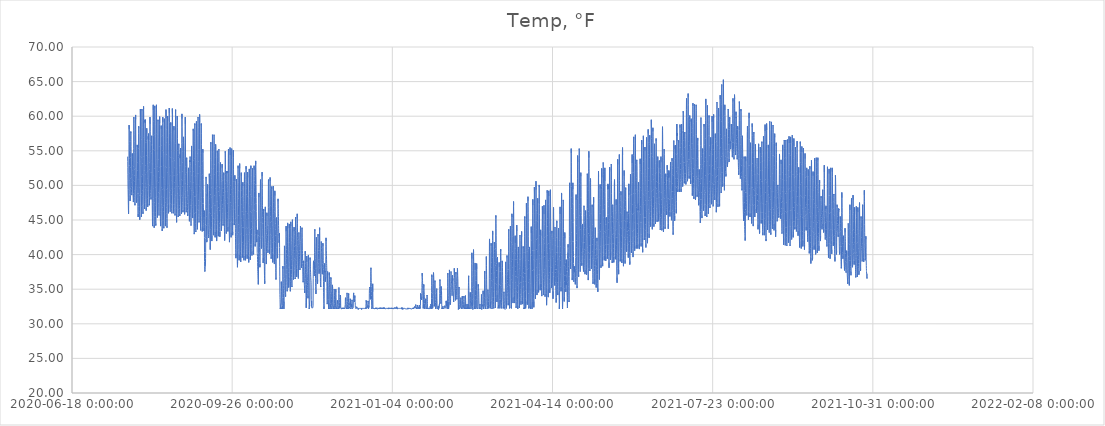
| Category | Temp, °F |
|---|---|
| 44034.768425925926 | 54.157 |
| 44034.81009259259 | 53.462 |
| 44034.85175925926 | 52.613 |
| 44034.893425925926 | 51.609 |
| 44034.93509259259 | 50.76 |
| 44034.97675925926 | 49.91 |
| 44035.018425925926 | 49.447 |
| 44035.06009259259 | 48.906 |
| 44035.10175925926 | 48.289 |
| 44035.143425925926 | 47.748 |
| 44035.18509259259 | 47.13 |
| 44035.22675925926 | 46.59 |
| 44035.268425925926 | 46.204 |
| 44035.31009259259 | 45.895 |
| 44035.35175925926 | 46.358 |
| 44035.393425925926 | 47.594 |
| 44035.43509259259 | 49.37 |
| 44035.47675925926 | 51.918 |
| 44035.518425925926 | 52.845 |
| 44035.56009259259 | 53.926 |
| 44035.60175925926 | 55.933 |
| 44035.643425925926 | 58.713 |
| 44035.68509259259 | 58.713 |
| 44035.72675925926 | 58.096 |
| 44035.768425925926 | 57.71 |
| 44035.81009259259 | 56.32 |
| 44035.85175925926 | 55.084 |
| 44035.893425925926 | 53.926 |
| 44035.93509259259 | 52.845 |
| 44035.97675925926 | 51.764 |
| 44036.018425925926 | 50.76 |
| 44036.06009259259 | 49.91 |
| 44036.10175925926 | 49.215 |
| 44036.143425925926 | 48.675 |
| 44036.18509259259 | 48.289 |
| 44036.22675925926 | 48.057 |
| 44036.268425925926 | 47.748 |
| 44036.31009259259 | 47.748 |
| 44036.35175925926 | 47.825 |
| 44036.393425925926 | 48.52 |
| 44036.43509259259 | 49.524 |
| 44036.47675925926 | 50.991 |
| 44036.518425925926 | 52.613 |
| 44036.56009259259 | 54.003 |
| 44036.60175925926 | 54.93 |
| 44036.643425925926 | 56.32 |
| 44036.68509259259 | 57.246 |
| 44036.72675925926 | 57.787 |
| 44036.768425925926 | 57.555 |
| 44036.81009259259 | 56.628 |
| 44036.85175925926 | 55.625 |
| 44036.893425925926 | 54.543 |
| 44036.93509259259 | 53.231 |
| 44036.97675925926 | 52.072 |
| 44037.018425925926 | 51.146 |
| 44037.06009259259 | 50.451 |
| 44037.10175925926 | 49.833 |
| 44037.143425925926 | 49.37 |
| 44037.18509259259 | 48.984 |
| 44037.22675925926 | 48.829 |
| 44037.268425925926 | 48.597 |
| 44037.31009259259 | 48.675 |
| 44037.35175925926 | 48.752 |
| 44037.393425925926 | 49.215 |
| 44037.43509259259 | 50.142 |
| 44037.47675925926 | 51.455 |
| 44037.518425925926 | 51.841 |
| 44037.56009259259 | 52.304 |
| 44037.60175925926 | 53.231 |
| 44037.643425925926 | 54.621 |
| 44037.68509259259 | 54.235 |
| 44037.72675925926 | 54.157 |
| 44037.768425925926 | 53.54 |
| 44037.81009259259 | 52.922 |
| 44037.85175925926 | 52.15 |
| 44037.893425925926 | 51.609 |
| 44037.93509259259 | 50.914 |
| 44037.97675925926 | 50.219 |
| 44038.018425925926 | 49.679 |
| 44038.06009259259 | 49.061 |
| 44038.10175925926 | 48.675 |
| 44038.143425925926 | 48.443 |
| 44038.18509259259 | 48.211 |
| 44038.22675925926 | 48.057 |
| 44038.268425925926 | 47.825 |
| 44038.31009259259 | 47.594 |
| 44038.35175925926 | 47.748 |
| 44038.393425925926 | 48.829 |
| 44038.43509259259 | 50.76 |
| 44038.47675925926 | 52.69 |
| 44038.518425925926 | 55.316 |
| 44038.56009259259 | 57.941 |
| 44038.60175925926 | 59.872 |
| 44038.643425925926 | 59.64 |
| 44038.68509259259 | 58.945 |
| 44038.72675925926 | 57.864 |
| 44038.768425925926 | 57.401 |
| 44038.81009259259 | 56.32 |
| 44038.85175925926 | 54.775 |
| 44038.893425925926 | 53.385 |
| 44038.93509259259 | 52.304 |
| 44038.97675925926 | 51.455 |
| 44039.018425925926 | 50.605 |
| 44039.06009259259 | 49.91 |
| 44039.10175925926 | 49.215 |
| 44039.143425925926 | 48.752 |
| 44039.18509259259 | 48.211 |
| 44039.22675925926 | 47.748 |
| 44039.268425925926 | 47.285 |
| 44039.31009259259 | 47.13 |
| 44039.35175925926 | 47.362 |
| 44039.393425925926 | 48.52 |
| 44039.43509259259 | 50.065 |
| 44039.47675925926 | 52.458 |
| 44039.518425925926 | 55.007 |
| 44039.56009259259 | 58.096 |
| 44039.60175925926 | 59.408 |
| 44039.643425925926 | 58.945 |
| 44039.68509259259 | 59.794 |
| 44039.72675925926 | 60.181 |
| 44039.768425925926 | 59.563 |
| 44039.81009259259 | 58.173 |
| 44039.85175925926 | 56.242 |
| 44039.893425925926 | 54.698 |
| 44039.93509259259 | 53.385 |
| 44039.97675925926 | 52.227 |
| 44040.018425925926 | 51.069 |
| 44040.06009259259 | 50.142 |
| 44040.10175925926 | 49.37 |
| 44040.143425925926 | 48.675 |
| 44040.18509259259 | 48.443 |
| 44040.22675925926 | 47.902 |
| 44040.268425925926 | 47.516 |
| 44040.31009259259 | 47.439 |
| 44040.35175925926 | 47.516 |
| 44040.393425925926 | 47.825 |
| 44040.43509259259 | 48.906 |
| 44040.47675925926 | 49.91 |
| 44040.518425925926 | 51.146 |
| 44040.56009259259 | 51.377 |
| 44040.60175925926 | 52.381 |
| 44040.643425925926 | 54.852 |
| 44040.68509259259 | 55.856 |
| 44040.72675925926 | 55.779 |
| 44040.768425925926 | 55.547 |
| 44040.81009259259 | 54.389 |
| 44040.85175925926 | 53.308 |
| 44040.893425925926 | 52.15 |
| 44040.93509259259 | 50.914 |
| 44040.97675925926 | 49.756 |
| 44041.018425925926 | 48.829 |
| 44041.06009259259 | 48.057 |
| 44041.10175925926 | 47.594 |
| 44041.143425925926 | 46.976 |
| 44041.18509259259 | 46.435 |
| 44041.22675925926 | 45.972 |
| 44041.268425925926 | 45.586 |
| 44041.31009259259 | 45.431 |
| 44041.35175925926 | 45.895 |
| 44041.393425925926 | 46.976 |
| 44041.43509259259 | 48.829 |
| 44041.47675925926 | 50.914 |
| 44041.518425925926 | 53.231 |
| 44041.56009259259 | 55.316 |
| 44041.60175925926 | 57.478 |
| 44041.643425925926 | 58.559 |
| 44041.68509259259 | 58.559 |
| 44041.72675925926 | 58.25 |
| 44041.768425925926 | 57.71 |
| 44041.81009259259 | 56.551 |
| 44041.85175925926 | 55.161 |
| 44041.893425925926 | 53.694 |
| 44041.93509259259 | 52.227 |
| 44041.97675925926 | 50.914 |
| 44042.018425925926 | 49.679 |
| 44042.06009259259 | 48.52 |
| 44042.10175925926 | 47.594 |
| 44042.143425925926 | 46.899 |
| 44042.18509259259 | 46.204 |
| 44042.22675925926 | 45.74 |
| 44042.268425925926 | 45.2 |
| 44042.31009259259 | 45.045 |
| 44042.35175925926 | 45.431 |
| 44042.393425925926 | 46.667 |
| 44042.43509259259 | 48.597 |
| 44042.47675925926 | 50.914 |
| 44042.518425925926 | 53.462 |
| 44042.56009259259 | 55.933 |
| 44042.60175925926 | 58.018 |
| 44042.643425925926 | 59.872 |
| 44042.68509259259 | 61.03 |
| 44042.72675925926 | 61.03 |
| 44042.768425925926 | 59.794 |
| 44042.81009259259 | 58.559 |
| 44042.85175925926 | 57.015 |
| 44042.893425925926 | 55.547 |
| 44042.93509259259 | 54.157 |
| 44042.97675925926 | 52.69 |
| 44043.018425925926 | 51.069 |
| 44043.06009259259 | 49.601 |
| 44043.10175925926 | 48.52 |
| 44043.143425925926 | 47.516 |
| 44043.18509259259 | 46.821 |
| 44043.22675925926 | 46.126 |
| 44043.268425925926 | 45.663 |
| 44043.31009259259 | 45.431 |
| 44043.35175925926 | 45.74 |
| 44043.393425925926 | 46.976 |
| 44043.43509259259 | 48.829 |
| 44043.47675925926 | 51.3 |
| 44043.518425925926 | 54.003 |
| 44043.56009259259 | 56.628 |
| 44043.60175925926 | 59.177 |
| 44043.643425925926 | 61.03 |
| 44043.68509259259 | 60.953 |
| 44043.72675925926 | 60.798 |
| 44043.768425925926 | 59.872 |
| 44043.81009259259 | 58.404 |
| 44043.85175925926 | 56.706 |
| 44043.893425925926 | 54.852 |
| 44043.93509259259 | 53.153 |
| 44043.97675925926 | 51.609 |
| 44044.018425925926 | 50.296 |
| 44044.06009259259 | 49.292 |
| 44044.10175925926 | 48.443 |
| 44044.143425925926 | 47.748 |
| 44044.18509259259 | 47.13 |
| 44044.22675925926 | 46.59 |
| 44044.268425925926 | 46.126 |
| 44044.31009259259 | 45.895 |
| 44044.35175925926 | 46.204 |
| 44044.393425925926 | 47.207 |
| 44044.43509259259 | 49.061 |
| 44044.47675925926 | 51.377 |
| 44044.518425925926 | 54.157 |
| 44044.56009259259 | 56.937 |
| 44044.60175925926 | 59.408 |
| 44044.643425925926 | 61.262 |
| 44044.68509259259 | 61.416 |
| 44044.72675925926 | 61.03 |
| 44044.768425925926 | 60.412 |
| 44044.81009259259 | 58.791 |
| 44044.85175925926 | 57.246 |
| 44044.893425925926 | 55.47 |
| 44044.93509259259 | 53.771 |
| 44044.97675925926 | 52.15 |
| 44045.018425925926 | 50.76 |
| 44045.06009259259 | 49.833 |
| 44045.10175925926 | 49.061 |
| 44045.143425925926 | 48.289 |
| 44045.18509259259 | 47.671 |
| 44045.22675925926 | 47.362 |
| 44045.268425925926 | 46.899 |
| 44045.31009259259 | 46.59 |
| 44045.35175925926 | 46.821 |
| 44045.393425925926 | 47.98 |
| 44045.43509259259 | 49.679 |
| 44045.47675925926 | 52.15 |
| 44045.518425925926 | 54.235 |
| 44045.56009259259 | 56.628 |
| 44045.60175925926 | 58.559 |
| 44045.643425925926 | 59.486 |
| 44045.68509259259 | 59.099 |
| 44045.72675925926 | 59.486 |
| 44045.768425925926 | 58.945 |
| 44045.81009259259 | 57.71 |
| 44045.85175925926 | 56.242 |
| 44045.893425925926 | 54.389 |
| 44045.93509259259 | 52.845 |
| 44045.97675925926 | 51.532 |
| 44046.018425925926 | 50.219 |
| 44046.06009259259 | 49.37 |
| 44046.10175925926 | 48.597 |
| 44046.143425925926 | 47.902 |
| 44046.18509259259 | 47.362 |
| 44046.22675925926 | 46.744 |
| 44046.268425925926 | 46.513 |
| 44046.31009259259 | 46.358 |
| 44046.35175925926 | 46.744 |
| 44046.393425925926 | 47.902 |
| 44046.43509259259 | 49.679 |
| 44046.47675925926 | 51.918 |
| 44046.518425925926 | 54.312 |
| 44046.56009259259 | 56.242 |
| 44046.60175925926 | 56.474 |
| 44046.643425925926 | 58.096 |
| 44046.68509259259 | 58.25 |
| 44046.72675925926 | 57.478 |
| 44046.768425925926 | 56.937 |
| 44046.81009259259 | 55.547 |
| 44046.85175925926 | 54.235 |
| 44046.893425925926 | 53.153 |
| 44046.93509259259 | 51.995 |
| 44046.97675925926 | 50.991 |
| 44047.018425925926 | 50.065 |
| 44047.06009259259 | 49.215 |
| 44047.10175925926 | 48.597 |
| 44047.143425925926 | 48.134 |
| 44047.18509259259 | 47.594 |
| 44047.22675925926 | 47.285 |
| 44047.268425925926 | 46.899 |
| 44047.31009259259 | 46.899 |
| 44047.35175925926 | 47.362 |
| 44047.393425925926 | 48.366 |
| 44047.43509259259 | 50.065 |
| 44047.47675925926 | 52.15 |
| 44047.518425925926 | 53.462 |
| 44047.56009259259 | 54.775 |
| 44047.60175925926 | 57.092 |
| 44047.643425925926 | 56.783 |
| 44047.68509259259 | 56.628 |
| 44047.72675925926 | 57.478 |
| 44047.768425925926 | 57.015 |
| 44047.81009259259 | 56.551 |
| 44047.85175925926 | 55.547 |
| 44047.893425925926 | 54.08 |
| 44047.93509259259 | 52.767 |
| 44047.97675925926 | 51.223 |
| 44048.018425925926 | 50.142 |
| 44048.06009259259 | 49.292 |
| 44048.10175925926 | 48.752 |
| 44048.143425925926 | 48.211 |
| 44048.18509259259 | 47.825 |
| 44048.22675925926 | 47.439 |
| 44048.268425925926 | 47.13 |
| 44048.31009259259 | 47.053 |
| 44048.35175925926 | 47.362 |
| 44048.393425925926 | 48.289 |
| 44048.43509259259 | 49.987 |
| 44048.47675925926 | 52.304 |
| 44048.518425925926 | 53.308 |
| 44048.56009259259 | 54.389 |
| 44048.60175925926 | 56.474 |
| 44048.643425925926 | 58.945 |
| 44048.68509259259 | 59.872 |
| 44048.72675925926 | 59.794 |
| 44048.768425925926 | 58.868 |
| 44048.81009259259 | 57.787 |
| 44048.85175925926 | 56.32 |
| 44048.893425925926 | 54.93 |
| 44048.93509259259 | 53.385 |
| 44048.97675925926 | 51.918 |
| 44049.018425925926 | 50.914 |
| 44049.06009259259 | 49.91 |
| 44049.10175925926 | 49.215 |
| 44049.143425925926 | 48.829 |
| 44049.18509259259 | 48.443 |
| 44049.22675925926 | 48.289 |
| 44049.268425925926 | 48.134 |
| 44049.31009259259 | 47.98 |
| 44049.35175925926 | 48.289 |
| 44049.393425925926 | 49.061 |
| 44049.43509259259 | 49.756 |
| 44049.47675925926 | 51.841 |
| 44049.518425925926 | 53.54 |
| 44049.56009259259 | 54.621 |
| 44049.60175925926 | 55.007 |
| 44049.643425925926 | 55.779 |
| 44049.68509259259 | 55.933 |
| 44049.72675925926 | 57.169 |
| 44049.768425925926 | 56.937 |
| 44049.81009259259 | 55.856 |
| 44049.85175925926 | 54.543 |
| 44049.893425925926 | 53.153 |
| 44049.93509259259 | 51.841 |
| 44049.97675925926 | 50.451 |
| 44050.018425925926 | 49.215 |
| 44050.06009259259 | 48.057 |
| 44050.10175925926 | 47.053 |
| 44050.143425925926 | 46.049 |
| 44050.18509259259 | 45.354 |
| 44050.22675925926 | 44.814 |
| 44050.268425925926 | 44.273 |
| 44050.31009259259 | 44.119 |
| 44050.35175925926 | 44.273 |
| 44050.393425925926 | 45.663 |
| 44050.43509259259 | 47.516 |
| 44050.47675925926 | 50.142 |
| 44050.518425925926 | 53.076 |
| 44050.56009259259 | 55.933 |
| 44050.60175925926 | 58.559 |
| 44050.643425925926 | 60.335 |
| 44050.68509259259 | 61.416 |
| 44050.72675925926 | 61.648 |
| 44050.768425925926 | 60.876 |
| 44050.81009259259 | 59.254 |
| 44050.85175925926 | 57.169 |
| 44050.893425925926 | 55.161 |
| 44050.93509259259 | 53.231 |
| 44050.97675925926 | 51.377 |
| 44051.018425925926 | 49.601 |
| 44051.06009259259 | 48.134 |
| 44051.10175925926 | 46.899 |
| 44051.143425925926 | 46.049 |
| 44051.18509259259 | 45.277 |
| 44051.22675925926 | 44.736 |
| 44051.268425925926 | 44.119 |
| 44051.31009259259 | 43.887 |
| 44051.35175925926 | 44.273 |
| 44051.393425925926 | 45.509 |
| 44051.43509259259 | 47.516 |
| 44051.47675925926 | 49.91 |
| 44051.518425925926 | 52.458 |
| 44051.56009259259 | 55.007 |
| 44051.60175925926 | 57.401 |
| 44051.643425925926 | 59.563 |
| 44051.68509259259 | 61.493 |
| 44051.72675925926 | 61.107 |
| 44051.768425925926 | 60.567 |
| 44051.81009259259 | 58.791 |
| 44051.85175925926 | 57.092 |
| 44051.893425925926 | 55.084 |
| 44051.93509259259 | 53.076 |
| 44051.97675925926 | 51.223 |
| 44052.018425925926 | 49.679 |
| 44052.06009259259 | 48.211 |
| 44052.10175925926 | 47.053 |
| 44052.143425925926 | 46.049 |
| 44052.18509259259 | 45.509 |
| 44052.22675925926 | 44.968 |
| 44052.268425925926 | 44.505 |
| 44052.31009259259 | 44.196 |
| 44052.35175925926 | 44.505 |
| 44052.393425925926 | 45.509 |
| 44052.43509259259 | 47.439 |
| 44052.47675925926 | 49.91 |
| 44052.518425925926 | 52.767 |
| 44052.56009259259 | 55.702 |
| 44052.60175925926 | 58.25 |
| 44052.643425925926 | 60.026 |
| 44052.68509259259 | 61.262 |
| 44052.72675925926 | 61.648 |
| 44052.768425925926 | 60.567 |
| 44052.81009259259 | 59.177 |
| 44052.85175925926 | 57.478 |
| 44052.893425925926 | 55.547 |
| 44052.93509259259 | 53.694 |
| 44052.97675925926 | 52.072 |
| 44053.018425925926 | 50.528 |
| 44053.06009259259 | 49.215 |
| 44053.10175925926 | 48.211 |
| 44053.143425925926 | 47.285 |
| 44053.18509259259 | 46.667 |
| 44053.22675925926 | 46.204 |
| 44053.268425925926 | 45.586 |
| 44053.31009259259 | 45.354 |
| 44053.35175925926 | 45.586 |
| 44053.393425925926 | 46.59 |
| 44053.43509259259 | 48.443 |
| 44053.47675925926 | 50.76 |
| 44053.518425925926 | 52.767 |
| 44053.56009259259 | 53.231 |
| 44053.60175925926 | 54.543 |
| 44053.643425925926 | 57.401 |
| 44053.68509259259 | 59.486 |
| 44053.72675925926 | 59.254 |
| 44053.768425925926 | 59.022 |
| 44053.81009259259 | 57.864 |
| 44053.85175925926 | 56.86 |
| 44053.893425925926 | 55.547 |
| 44053.93509259259 | 53.771 |
| 44053.97675925926 | 51.995 |
| 44054.018425925926 | 50.374 |
| 44054.06009259259 | 48.984 |
| 44054.10175925926 | 48.057 |
| 44054.143425925926 | 47.362 |
| 44054.18509259259 | 46.744 |
| 44054.22675925926 | 46.281 |
| 44054.268425925926 | 45.818 |
| 44054.31009259259 | 45.663 |
| 44054.35175925926 | 45.818 |
| 44054.393425925926 | 46.744 |
| 44054.43509259259 | 48.829 |
| 44054.47675925926 | 49.91 |
| 44054.518425925926 | 51.146 |
| 44054.56009259259 | 52.613 |
| 44054.60175925926 | 55.625 |
| 44054.643425925926 | 57.864 |
| 44054.68509259259 | 58.791 |
| 44054.72675925926 | 59.949 |
| 44054.768425925926 | 59.022 |
| 44054.81009259259 | 57.864 |
| 44054.85175925926 | 56.32 |
| 44054.893425925926 | 54.543 |
| 44054.93509259259 | 52.69 |
| 44054.97675925926 | 51.069 |
| 44055.018425925926 | 49.292 |
| 44055.06009259259 | 47.98 |
| 44055.10175925926 | 46.744 |
| 44055.143425925926 | 45.972 |
| 44055.18509259259 | 45.2 |
| 44055.22675925926 | 44.736 |
| 44055.268425925926 | 44.35 |
| 44055.31009259259 | 44.119 |
| 44055.35175925926 | 44.428 |
| 44055.393425925926 | 45.509 |
| 44055.43509259259 | 46.204 |
| 44055.47675925926 | 48.289 |
| 44055.518425925926 | 49.987 |
| 44055.56009259259 | 52.767 |
| 44055.60175925926 | 55.856 |
| 44055.643425925926 | 57.401 |
| 44055.68509259259 | 58.636 |
| 44055.72675925926 | 58.173 |
| 44055.768425925926 | 57.092 |
| 44055.81009259259 | 55.779 |
| 44055.85175925926 | 54.235 |
| 44055.893425925926 | 52.767 |
| 44055.93509259259 | 51.223 |
| 44055.97675925926 | 49.679 |
| 44056.018425925926 | 48.443 |
| 44056.06009259259 | 47.207 |
| 44056.10175925926 | 46.281 |
| 44056.143425925926 | 45.431 |
| 44056.18509259259 | 44.736 |
| 44056.22675925926 | 44.119 |
| 44056.268425925926 | 43.81 |
| 44056.31009259259 | 43.424 |
| 44056.35175925926 | 43.733 |
| 44056.393425925926 | 44.891 |
| 44056.43509259259 | 46.821 |
| 44056.47675925926 | 49.447 |
| 44056.518425925926 | 52.227 |
| 44056.56009259259 | 55.007 |
| 44056.60175925926 | 57.246 |
| 44056.643425925926 | 58.945 |
| 44056.68509259259 | 59.872 |
| 44056.72675925926 | 59.872 |
| 44056.768425925926 | 59.177 |
| 44056.81009259259 | 58.018 |
| 44056.85175925926 | 56.551 |
| 44056.893425925926 | 54.775 |
| 44056.93509259259 | 52.922 |
| 44056.97675925926 | 51.146 |
| 44057.018425925926 | 49.601 |
| 44057.06009259259 | 48.211 |
| 44057.10175925926 | 47.053 |
| 44057.143425925926 | 46.204 |
| 44057.18509259259 | 45.431 |
| 44057.22675925926 | 44.891 |
| 44057.268425925926 | 44.196 |
| 44057.31009259259 | 43.81 |
| 44057.35175925926 | 44.041 |
| 44057.393425925926 | 45.045 |
| 44057.43509259259 | 46.899 |
| 44057.47675925926 | 49.37 |
| 44057.518425925926 | 51.918 |
| 44057.56009259259 | 54.466 |
| 44057.60175925926 | 56.937 |
| 44057.643425925926 | 58.636 |
| 44057.68509259259 | 59.64 |
| 44057.72675925926 | 59.64 |
| 44057.768425925926 | 58.791 |
| 44057.81009259259 | 57.555 |
| 44057.85175925926 | 55.856 |
| 44057.893425925926 | 54.235 |
| 44057.93509259259 | 52.536 |
| 44057.97675925926 | 50.837 |
| 44058.018425925926 | 49.292 |
| 44058.06009259259 | 47.98 |
| 44058.10175925926 | 47.053 |
| 44058.143425925926 | 46.204 |
| 44058.18509259259 | 45.586 |
| 44058.22675925926 | 45.045 |
| 44058.268425925926 | 44.505 |
| 44058.31009259259 | 44.119 |
| 44058.35175925926 | 44.582 |
| 44058.393425925926 | 45.74 |
| 44058.43509259259 | 47.516 |
| 44058.47675925926 | 50.065 |
| 44058.518425925926 | 52.767 |
| 44058.56009259259 | 55.702 |
| 44058.60175925926 | 58.173 |
| 44058.643425925926 | 59.949 |
| 44058.68509259259 | 60.953 |
| 44058.72675925926 | 60.876 |
| 44058.768425925926 | 59.717 |
| 44058.81009259259 | 58.096 |
| 44058.85175925926 | 56.242 |
| 44058.893425925926 | 54.466 |
| 44058.93509259259 | 52.613 |
| 44058.97675925926 | 51.069 |
| 44059.018425925926 | 49.447 |
| 44059.06009259259 | 48.057 |
| 44059.10175925926 | 46.821 |
| 44059.143425925926 | 45.972 |
| 44059.18509259259 | 45.2 |
| 44059.22675925926 | 44.659 |
| 44059.268425925926 | 44.119 |
| 44059.31009259259 | 43.887 |
| 44059.35175925926 | 44.119 |
| 44059.393425925926 | 45.2 |
| 44059.43509259259 | 47.207 |
| 44059.47675925926 | 49.524 |
| 44059.518425925926 | 51.841 |
| 44059.56009259259 | 54.389 |
| 44059.60175925926 | 56.937 |
| 44059.643425925926 | 58.713 |
| 44059.68509259259 | 59.794 |
| 44059.72675925926 | 60.026 |
| 44059.768425925926 | 59.331 |
| 44059.81009259259 | 58.018 |
| 44059.85175925926 | 56.397 |
| 44059.893425925926 | 54.698 |
| 44059.93509259259 | 53.076 |
| 44059.97675925926 | 51.532 |
| 44060.018425925926 | 50.219 |
| 44060.06009259259 | 49.061 |
| 44060.10175925926 | 48.134 |
| 44060.143425925926 | 47.362 |
| 44060.18509259259 | 46.899 |
| 44060.22675925926 | 46.435 |
| 44060.268425925926 | 45.972 |
| 44060.31009259259 | 45.895 |
| 44060.35175925926 | 46.049 |
| 44060.393425925926 | 47.13 |
| 44060.43509259259 | 48.906 |
| 44060.47675925926 | 51.069 |
| 44060.518425925926 | 53.694 |
| 44060.56009259259 | 56.242 |
| 44060.60175925926 | 58.018 |
| 44060.643425925926 | 59.872 |
| 44060.68509259259 | 61.03 |
| 44060.72675925926 | 61.184 |
| 44060.768425925926 | 60.412 |
| 44060.81009259259 | 59.099 |
| 44060.85175925926 | 57.555 |
| 44060.893425925926 | 55.856 |
| 44060.93509259259 | 54.235 |
| 44060.97675925926 | 52.536 |
| 44061.018425925926 | 51.223 |
| 44061.06009259259 | 49.987 |
| 44061.10175925926 | 48.984 |
| 44061.143425925926 | 48.211 |
| 44061.18509259259 | 47.594 |
| 44061.22675925926 | 47.053 |
| 44061.268425925926 | 46.513 |
| 44061.31009259259 | 46.204 |
| 44061.35175925926 | 46.358 |
| 44061.393425925926 | 47.362 |
| 44061.43509259259 | 49.215 |
| 44061.47675925926 | 51.377 |
| 44061.518425925926 | 54.003 |
| 44061.56009259259 | 56.551 |
| 44061.60175925926 | 58.713 |
| 44061.643425925926 | 58.868 |
| 44061.68509259259 | 59.099 |
| 44061.72675925926 | 59.099 |
| 44061.768425925926 | 58.636 |
| 44061.81009259259 | 57.632 |
| 44061.85175925926 | 56.397 |
| 44061.893425925926 | 54.852 |
| 44061.93509259259 | 53.385 |
| 44061.97675925926 | 52.072 |
| 44062.018425925926 | 50.76 |
| 44062.06009259259 | 49.601 |
| 44062.10175925926 | 48.675 |
| 44062.143425925926 | 47.748 |
| 44062.18509259259 | 47.207 |
| 44062.22675925926 | 46.667 |
| 44062.268425925926 | 46.204 |
| 44062.31009259259 | 45.972 |
| 44062.35175925926 | 46.126 |
| 44062.393425925926 | 47.13 |
| 44062.43509259259 | 48.984 |
| 44062.47675925926 | 51.3 |
| 44062.518425925926 | 54.003 |
| 44062.56009259259 | 56.937 |
| 44062.60175925926 | 59.022 |
| 44062.643425925926 | 61.107 |
| 44062.68509259259 | 61.107 |
| 44062.72675925926 | 60.258 |
| 44062.768425925926 | 59.177 |
| 44062.81009259259 | 58.018 |
| 44062.85175925926 | 56.551 |
| 44062.893425925926 | 55.007 |
| 44062.93509259259 | 53.462 |
| 44062.97675925926 | 51.841 |
| 44063.018425925926 | 50.528 |
| 44063.06009259259 | 49.447 |
| 44063.10175925926 | 48.597 |
| 44063.143425925926 | 47.902 |
| 44063.18509259259 | 47.285 |
| 44063.22675925926 | 46.667 |
| 44063.268425925926 | 46.281 |
| 44063.31009259259 | 45.972 |
| 44063.35175925926 | 46.204 |
| 44063.393425925926 | 47.207 |
| 44063.43509259259 | 49.061 |
| 44063.47675925926 | 51.377 |
| 44063.518425925926 | 53.848 |
| 44063.56009259259 | 56.551 |
| 44063.60175925926 | 58.327 |
| 44063.643425925926 | 58.559 |
| 44063.68509259259 | 57.941 |
| 44063.72675925926 | 57.864 |
| 44063.768425925926 | 57.555 |
| 44063.81009259259 | 56.397 |
| 44063.85175925926 | 55.007 |
| 44063.893425925926 | 53.617 |
| 44063.93509259259 | 52.536 |
| 44063.97675925926 | 51.377 |
| 44064.018425925926 | 50.451 |
| 44064.06009259259 | 49.601 |
| 44064.10175925926 | 48.752 |
| 44064.143425925926 | 48.057 |
| 44064.18509259259 | 47.285 |
| 44064.22675925926 | 46.667 |
| 44064.268425925926 | 46.126 |
| 44064.31009259259 | 45.663 |
| 44064.35175925926 | 45.895 |
| 44064.393425925926 | 46.821 |
| 44064.43509259259 | 48.52 |
| 44064.47675925926 | 50.76 |
| 44064.518425925926 | 53.385 |
| 44064.56009259259 | 56.088 |
| 44064.60175925926 | 58.559 |
| 44064.643425925926 | 60.258 |
| 44064.68509259259 | 60.953 |
| 44064.72675925926 | 60.721 |
| 44064.768425925926 | 59.794 |
| 44064.81009259259 | 58.327 |
| 44064.85175925926 | 56.706 |
| 44064.893425925926 | 54.93 |
| 44064.93509259259 | 53.231 |
| 44064.97675925926 | 51.455 |
| 44065.018425925926 | 49.833 |
| 44065.06009259259 | 48.597 |
| 44065.10175925926 | 47.594 |
| 44065.143425925926 | 46.667 |
| 44065.18509259259 | 45.895 |
| 44065.22675925926 | 45.431 |
| 44065.268425925926 | 45.045 |
| 44065.31009259259 | 44.659 |
| 44065.35175925926 | 44.968 |
| 44065.393425925926 | 45.895 |
| 44065.43509259259 | 47.516 |
| 44065.47675925926 | 49.91 |
| 44065.518425925926 | 52.458 |
| 44065.56009259259 | 55.084 |
| 44065.60175925926 | 57.401 |
| 44065.643425925926 | 59.022 |
| 44065.68509259259 | 60.026 |
| 44065.72675925926 | 60.103 |
| 44065.768425925926 | 59.408 |
| 44065.81009259259 | 58.327 |
| 44065.85175925926 | 56.783 |
| 44065.893425925926 | 55.084 |
| 44065.93509259259 | 53.231 |
| 44065.97675925926 | 51.609 |
| 44066.018425925926 | 50.065 |
| 44066.06009259259 | 48.829 |
| 44066.10175925926 | 47.902 |
| 44066.143425925926 | 47.053 |
| 44066.18509259259 | 46.435 |
| 44066.22675925926 | 45.972 |
| 44066.268425925926 | 45.586 |
| 44066.31009259259 | 45.431 |
| 44066.35175925926 | 45.663 |
| 44066.393425925926 | 46.513 |
| 44066.43509259259 | 47.902 |
| 44066.47675925926 | 49.833 |
| 44066.518425925926 | 52.072 |
| 44066.56009259259 | 54.003 |
| 44066.60175925926 | 54.312 |
| 44066.643425925926 | 55.084 |
| 44066.68509259259 | 56.011 |
| 44066.72675925926 | 55.779 |
| 44066.768425925926 | 54.775 |
| 44066.81009259259 | 53.926 |
| 44066.85175925926 | 52.845 |
| 44066.893425925926 | 51.841 |
| 44066.93509259259 | 50.76 |
| 44066.97675925926 | 49.524 |
| 44067.018425925926 | 48.52 |
| 44067.06009259259 | 47.748 |
| 44067.10175925926 | 47.13 |
| 44067.143425925926 | 46.667 |
| 44067.18509259259 | 46.281 |
| 44067.22675925926 | 45.895 |
| 44067.268425925926 | 45.74 |
| 44067.31009259259 | 45.586 |
| 44067.35175925926 | 45.895 |
| 44067.393425925926 | 46.435 |
| 44067.43509259259 | 47.98 |
| 44067.47675925926 | 49.756 |
| 44067.518425925926 | 52.381 |
| 44067.56009259259 | 54.466 |
| 44067.60175925926 | 53.926 |
| 44067.643425925926 | 54.466 |
| 44067.68509259259 | 54.775 |
| 44067.72675925926 | 55.161 |
| 44067.768425925926 | 55.393 |
| 44067.81009259259 | 54.852 |
| 44067.85175925926 | 53.848 |
| 44067.893425925926 | 52.845 |
| 44067.93509259259 | 51.918 |
| 44067.97675925926 | 51.069 |
| 44068.018425925926 | 50.142 |
| 44068.06009259259 | 49.292 |
| 44068.10175925926 | 48.443 |
| 44068.143425925926 | 47.748 |
| 44068.18509259259 | 47.285 |
| 44068.22675925926 | 46.744 |
| 44068.268425925926 | 46.204 |
| 44068.31009259259 | 45.895 |
| 44068.35175925926 | 45.972 |
| 44068.393425925926 | 46.821 |
| 44068.43509259259 | 48.52 |
| 44068.47675925926 | 50.837 |
| 44068.518425925926 | 53.385 |
| 44068.56009259259 | 56.088 |
| 44068.60175925926 | 58.404 |
| 44068.643425925926 | 60.335 |
| 44068.68509259259 | 59.64 |
| 44068.72675925926 | 58.482 |
| 44068.768425925926 | 57.71 |
| 44068.81009259259 | 56.242 |
| 44068.85175925926 | 54.93 |
| 44068.893425925926 | 53.308 |
| 44068.93509259259 | 51.995 |
| 44068.97675925926 | 50.76 |
| 44069.018425925926 | 49.833 |
| 44069.06009259259 | 48.906 |
| 44069.10175925926 | 48.211 |
| 44069.143425925926 | 47.516 |
| 44069.18509259259 | 47.053 |
| 44069.22675925926 | 46.513 |
| 44069.268425925926 | 46.126 |
| 44069.31009259259 | 46.049 |
| 44069.35175925926 | 46.435 |
| 44069.393425925926 | 46.899 |
| 44069.43509259259 | 48.597 |
| 44069.47675925926 | 51.069 |
| 44069.518425925926 | 53.848 |
| 44069.56009259259 | 56.011 |
| 44069.60175925926 | 57.015 |
| 44069.643425925926 | 56.783 |
| 44069.68509259259 | 56.474 |
| 44069.72675925926 | 56.397 |
| 44069.768425925926 | 55.779 |
| 44069.81009259259 | 54.852 |
| 44069.85175925926 | 53.617 |
| 44069.893425925926 | 52.304 |
| 44069.93509259259 | 51.146 |
| 44069.97675925926 | 50.219 |
| 44070.018425925926 | 49.447 |
| 44070.06009259259 | 48.829 |
| 44070.10175925926 | 48.211 |
| 44070.143425925926 | 47.594 |
| 44070.18509259259 | 46.976 |
| 44070.22675925926 | 46.513 |
| 44070.268425925926 | 46.126 |
| 44070.31009259259 | 45.818 |
| 44070.35175925926 | 45.818 |
| 44070.393425925926 | 46.821 |
| 44070.43509259259 | 48.675 |
| 44070.47675925926 | 50.837 |
| 44070.518425925926 | 53.694 |
| 44070.56009259259 | 54.93 |
| 44070.60175925926 | 56.165 |
| 44070.643425925926 | 58.482 |
| 44070.68509259259 | 59.64 |
| 44070.72675925926 | 59.872 |
| 44070.768425925926 | 58.868 |
| 44070.81009259259 | 57.169 |
| 44070.85175925926 | 55.547 |
| 44070.893425925926 | 54.08 |
| 44070.93509259259 | 52.767 |
| 44070.97675925926 | 51.532 |
| 44071.018425925926 | 50.296 |
| 44071.06009259259 | 49.138 |
| 44071.10175925926 | 48.289 |
| 44071.143425925926 | 47.516 |
| 44071.18509259259 | 46.899 |
| 44071.22675925926 | 46.435 |
| 44071.268425925926 | 46.126 |
| 44071.31009259259 | 46.049 |
| 44071.35175925926 | 46.281 |
| 44071.393425925926 | 46.976 |
| 44071.43509259259 | 48.289 |
| 44071.47675925926 | 49.91 |
| 44071.518425925926 | 51.841 |
| 44071.56009259259 | 53.231 |
| 44071.60175925926 | 54.003 |
| 44071.643425925926 | 53.771 |
| 44071.68509259259 | 53.54 |
| 44071.72675925926 | 53.231 |
| 44071.768425925926 | 52.767 |
| 44071.81009259259 | 52.072 |
| 44071.85175925926 | 51.069 |
| 44071.893425925926 | 50.142 |
| 44071.93509259259 | 49.292 |
| 44071.97675925926 | 48.597 |
| 44072.018425925926 | 47.902 |
| 44072.06009259259 | 47.362 |
| 44072.10175925926 | 46.744 |
| 44072.143425925926 | 46.358 |
| 44072.18509259259 | 45.895 |
| 44072.22675925926 | 45.586 |
| 44072.268425925926 | 45.509 |
| 44072.31009259259 | 45.509 |
| 44072.35175925926 | 45.663 |
| 44072.393425925926 | 45.818 |
| 44072.43509259259 | 46.126 |
| 44072.47675925926 | 46.513 |
| 44072.518425925926 | 46.899 |
| 44072.56009259259 | 47.439 |
| 44072.60175925926 | 48.52 |
| 44072.643425925926 | 50.374 |
| 44072.68509259259 | 51.995 |
| 44072.72675925926 | 52.536 |
| 44072.768425925926 | 52.536 |
| 44072.81009259259 | 52.072 |
| 44072.85175925926 | 51.532 |
| 44072.893425925926 | 50.76 |
| 44072.93509259259 | 49.91 |
| 44072.97675925926 | 49.138 |
| 44073.018425925926 | 48.443 |
| 44073.06009259259 | 47.825 |
| 44073.10175925926 | 47.13 |
| 44073.143425925926 | 46.435 |
| 44073.18509259259 | 45.818 |
| 44073.22675925926 | 45.431 |
| 44073.268425925926 | 45.045 |
| 44073.31009259259 | 44.814 |
| 44073.35175925926 | 44.891 |
| 44073.393425925926 | 45.818 |
| 44073.43509259259 | 47.594 |
| 44073.47675925926 | 49.833 |
| 44073.518425925926 | 52.227 |
| 44073.56009259259 | 53.385 |
| 44073.60175925926 | 53.617 |
| 44073.643425925926 | 53.385 |
| 44073.68509259259 | 53.54 |
| 44073.72675925926 | 54.157 |
| 44073.768425925926 | 54.003 |
| 44073.81009259259 | 52.999 |
| 44073.85175925926 | 51.995 |
| 44073.893425925926 | 50.605 |
| 44073.93509259259 | 49.601 |
| 44073.97675925926 | 48.752 |
| 44074.018425925926 | 47.902 |
| 44074.06009259259 | 47.13 |
| 44074.10175925926 | 46.435 |
| 44074.143425925926 | 45.895 |
| 44074.18509259259 | 45.354 |
| 44074.22675925926 | 44.891 |
| 44074.268425925926 | 44.505 |
| 44074.31009259259 | 44.196 |
| 44074.35175925926 | 44.35 |
| 44074.393425925926 | 45.277 |
| 44074.43509259259 | 47.053 |
| 44074.47675925926 | 49.292 |
| 44074.518425925926 | 51.455 |
| 44074.56009259259 | 52.536 |
| 44074.60175925926 | 54.389 |
| 44074.643425925926 | 55.702 |
| 44074.68509259259 | 55.47 |
| 44074.72675925926 | 55.161 |
| 44074.768425925926 | 54.543 |
| 44074.81009259259 | 53.54 |
| 44074.85175925926 | 52.458 |
| 44074.893425925926 | 51.609 |
| 44074.93509259259 | 50.451 |
| 44074.97675925926 | 49.601 |
| 44075.018425925926 | 48.675 |
| 44075.06009259259 | 47.825 |
| 44075.10175925926 | 47.362 |
| 44075.143425925926 | 46.821 |
| 44075.18509259259 | 46.281 |
| 44075.22675925926 | 45.74 |
| 44075.268425925926 | 45.431 |
| 44075.31009259259 | 45.277 |
| 44075.35175925926 | 45.509 |
| 44075.393425925926 | 46.126 |
| 44075.43509259259 | 47.285 |
| 44075.47675925926 | 49.215 |
| 44075.518425925926 | 51.377 |
| 44075.56009259259 | 53.694 |
| 44075.60175925926 | 55.779 |
| 44075.643425925926 | 57.555 |
| 44075.68509259259 | 58.173 |
| 44075.72675925926 | 57.864 |
| 44075.768425925926 | 56.551 |
| 44075.81009259259 | 55.084 |
| 44075.85175925926 | 53.617 |
| 44075.893425925926 | 51.995 |
| 44075.93509259259 | 50.451 |
| 44075.97675925926 | 48.984 |
| 44076.018425925926 | 47.594 |
| 44076.06009259259 | 46.435 |
| 44076.10175925926 | 45.431 |
| 44076.143425925926 | 44.736 |
| 44076.18509259259 | 44.119 |
| 44076.22675925926 | 43.733 |
| 44076.268425925926 | 43.269 |
| 44076.31009259259 | 42.96 |
| 44076.35175925926 | 43.115 |
| 44076.393425925926 | 44.119 |
| 44076.43509259259 | 45.972 |
| 44076.47675925926 | 48.366 |
| 44076.518425925926 | 51.223 |
| 44076.56009259259 | 53.926 |
| 44076.60175925926 | 56.397 |
| 44076.643425925926 | 58.096 |
| 44076.68509259259 | 58.945 |
| 44076.72675925926 | 58.713 |
| 44076.768425925926 | 57.71 |
| 44076.81009259259 | 56.088 |
| 44076.85175925926 | 54.543 |
| 44076.893425925926 | 52.999 |
| 44076.93509259259 | 51.377 |
| 44076.97675925926 | 49.756 |
| 44077.018425925926 | 48.366 |
| 44077.06009259259 | 47.13 |
| 44077.10175925926 | 46.049 |
| 44077.143425925926 | 45.277 |
| 44077.18509259259 | 44.505 |
| 44077.22675925926 | 43.964 |
| 44077.268425925926 | 43.501 |
| 44077.31009259259 | 43.269 |
| 44077.35175925926 | 43.424 |
| 44077.393425925926 | 44.273 |
| 44077.43509259259 | 46.049 |
| 44077.47675925926 | 48.52 |
| 44077.518425925926 | 51.3 |
| 44077.56009259259 | 54.157 |
| 44077.60175925926 | 56.706 |
| 44077.643425925926 | 58.404 |
| 44077.68509259259 | 59.254 |
| 44077.72675925926 | 59.177 |
| 44077.768425925926 | 58.173 |
| 44077.81009259259 | 56.551 |
| 44077.85175925926 | 54.93 |
| 44077.893425925926 | 53.462 |
| 44077.93509259259 | 51.764 |
| 44077.97675925926 | 50.142 |
| 44078.018425925926 | 48.675 |
| 44078.06009259259 | 47.362 |
| 44078.10175925926 | 46.358 |
| 44078.143425925926 | 45.586 |
| 44078.18509259259 | 44.891 |
| 44078.22675925926 | 44.428 |
| 44078.268425925926 | 43.964 |
| 44078.31009259259 | 43.655 |
| 44078.35175925926 | 43.887 |
| 44078.393425925926 | 44.736 |
| 44078.43509259259 | 46.513 |
| 44078.47675925926 | 49.061 |
| 44078.518425925926 | 51.764 |
| 44078.56009259259 | 54.621 |
| 44078.60175925926 | 57.169 |
| 44078.643425925926 | 58.945 |
| 44078.68509259259 | 59.872 |
| 44078.72675925926 | 59.717 |
| 44078.768425925926 | 58.404 |
| 44078.81009259259 | 56.706 |
| 44078.85175925926 | 55.161 |
| 44078.893425925926 | 53.462 |
| 44078.93509259259 | 51.764 |
| 44078.97675925926 | 50.065 |
| 44079.018425925926 | 48.752 |
| 44079.06009259259 | 47.825 |
| 44079.10175925926 | 47.053 |
| 44079.143425925926 | 46.358 |
| 44079.18509259259 | 45.74 |
| 44079.22675925926 | 45.354 |
| 44079.268425925926 | 44.968 |
| 44079.31009259259 | 44.659 |
| 44079.35175925926 | 44.814 |
| 44079.393425925926 | 45.74 |
| 44079.43509259259 | 47.594 |
| 44079.47675925926 | 49.833 |
| 44079.518425925926 | 52.767 |
| 44079.56009259259 | 55.238 |
| 44079.60175925926 | 57.555 |
| 44079.643425925926 | 59.408 |
| 44079.68509259259 | 60.258 |
| 44079.72675925926 | 60.258 |
| 44079.768425925926 | 59.099 |
| 44079.81009259259 | 57.555 |
| 44079.85175925926 | 55.933 |
| 44079.893425925926 | 54.157 |
| 44079.93509259259 | 52.536 |
| 44079.97675925926 | 50.682 |
| 44080.018425925926 | 48.906 |
| 44080.06009259259 | 47.671 |
| 44080.10175925926 | 46.435 |
| 44080.143425925926 | 45.663 |
| 44080.18509259259 | 44.968 |
| 44080.22675925926 | 44.428 |
| 44080.268425925926 | 43.81 |
| 44080.31009259259 | 43.501 |
| 44080.35175925926 | 43.655 |
| 44080.393425925926 | 44.659 |
| 44080.43509259259 | 46.513 |
| 44080.47675925926 | 48.984 |
| 44080.518425925926 | 51.841 |
| 44080.56009259259 | 54.621 |
| 44080.60175925926 | 56.783 |
| 44080.643425925926 | 58.327 |
| 44080.68509259259 | 58.945 |
| 44080.72675925926 | 58.636 |
| 44080.768425925926 | 57.478 |
| 44080.81009259259 | 55.933 |
| 44080.85175925926 | 54.543 |
| 44080.893425925926 | 52.922 |
| 44080.93509259259 | 51.377 |
| 44080.97675925926 | 49.756 |
| 44081.018425925926 | 48.289 |
| 44081.06009259259 | 47.053 |
| 44081.10175925926 | 46.126 |
| 44081.143425925926 | 45.354 |
| 44081.18509259259 | 44.736 |
| 44081.22675925926 | 44.196 |
| 44081.268425925926 | 43.81 |
| 44081.31009259259 | 43.346 |
| 44081.35175925926 | 43.346 |
| 44081.393425925926 | 43.964 |
| 44081.43509259259 | 45.431 |
| 44081.47675925926 | 47.362 |
| 44081.518425925926 | 49.601 |
| 44081.56009259259 | 51.609 |
| 44081.60175925926 | 53.462 |
| 44081.643425925926 | 54.775 |
| 44081.68509259259 | 55.238 |
| 44081.72675925926 | 55.238 |
| 44081.768425925926 | 54.698 |
| 44081.81009259259 | 53.617 |
| 44081.85175925926 | 52.381 |
| 44081.893425925926 | 50.837 |
| 44081.93509259259 | 49.447 |
| 44081.97675925926 | 48.289 |
| 44082.018425925926 | 47.362 |
| 44082.06009259259 | 46.744 |
| 44082.10175925926 | 46.126 |
| 44082.143425925926 | 45.74 |
| 44082.18509259259 | 45.431 |
| 44082.22675925926 | 44.891 |
| 44082.268425925926 | 44.505 |
| 44082.31009259259 | 44.196 |
| 44082.35175925926 | 43.733 |
| 44082.393425925926 | 43.424 |
| 44082.43509259259 | 43.887 |
| 44082.47675925926 | 45.354 |
| 44082.518425925926 | 45.74 |
| 44082.56009259259 | 46.358 |
| 44082.60175925926 | 45.354 |
| 44082.643425925926 | 43.964 |
| 44082.68509259259 | 42.497 |
| 44082.72675925926 | 40.335 |
| 44082.768425925926 | 39.022 |
| 44082.81009259259 | 38.327 |
| 44082.85175925926 | 37.941 |
| 44082.893425925926 | 37.787 |
| 44082.93509259259 | 37.555 |
| 44082.97675925926 | 37.555 |
| 44083.018425925926 | 37.555 |
| 44083.06009259259 | 37.709 |
| 44083.10175925926 | 37.864 |
| 44083.143425925926 | 38.095 |
| 44083.18509259259 | 38.173 |
| 44083.22675925926 | 38.173 |
| 44083.268425925926 | 38.25 |
| 44083.31009259259 | 38.25 |
| 44083.35175925926 | 38.79 |
| 44083.393425925926 | 39.408 |
| 44083.43509259259 | 40.258 |
| 44083.47675925926 | 42.343 |
| 44083.518425925926 | 44.35 |
| 44083.56009259259 | 47.285 |
| 44083.60175925926 | 48.984 |
| 44083.643425925926 | 50.528 |
| 44083.68509259259 | 51.223 |
| 44083.72675925926 | 50.991 |
| 44083.768425925926 | 49.987 |
| 44083.81009259259 | 48.829 |
| 44083.85175925926 | 47.902 |
| 44083.893425925926 | 46.667 |
| 44083.93509259259 | 45.509 |
| 44083.97675925926 | 44.196 |
| 44084.018425925926 | 43.269 |
| 44084.06009259259 | 42.574 |
| 44084.10175925926 | 42.034 |
| 44084.143425925926 | 41.802 |
| 44084.18509259259 | 41.725 |
| 44084.22675925926 | 41.725 |
| 44084.268425925926 | 41.725 |
| 44084.31009259259 | 41.879 |
| 44084.35175925926 | 42.111 |
| 44084.393425925926 | 42.806 |
| 44084.43509259259 | 44.428 |
| 44084.47675925926 | 46.435 |
| 44084.518425925926 | 48.829 |
| 44084.56009259259 | 48.443 |
| 44084.60175925926 | 49.138 |
| 44084.643425925926 | 50.142 |
| 44084.68509259259 | 50.142 |
| 44084.72675925926 | 50.065 |
| 44084.768425925926 | 49.679 |
| 44084.81009259259 | 48.984 |
| 44084.85175925926 | 47.825 |
| 44084.893425925926 | 46.667 |
| 44084.93509259259 | 45.895 |
| 44084.97675925926 | 45.123 |
| 44085.018425925926 | 44.505 |
| 44085.06009259259 | 43.81 |
| 44085.10175925926 | 43.424 |
| 44085.143425925926 | 43.115 |
| 44085.18509259259 | 42.883 |
| 44085.22675925926 | 42.651 |
| 44085.268425925926 | 42.574 |
| 44085.31009259259 | 42.42 |
| 44085.35175925926 | 42.42 |
| 44085.393425925926 | 42.574 |
| 44085.43509259259 | 42.883 |
| 44085.47675925926 | 43.655 |
| 44085.518425925926 | 44.196 |
| 44085.56009259259 | 46.049 |
| 44085.60175925926 | 48.366 |
| 44085.643425925926 | 49.91 |
| 44085.68509259259 | 51.3 |
| 44085.72675925926 | 51.686 |
| 44085.768425925926 | 51.146 |
| 44085.81009259259 | 50.296 |
| 44085.85175925926 | 49.292 |
| 44085.893425925926 | 48.057 |
| 44085.93509259259 | 47.207 |
| 44085.97675925926 | 46.049 |
| 44086.018425925926 | 45.045 |
| 44086.06009259259 | 44.119 |
| 44086.10175925926 | 43.192 |
| 44086.143425925926 | 42.42 |
| 44086.18509259259 | 41.879 |
| 44086.22675925926 | 41.339 |
| 44086.268425925926 | 40.953 |
| 44086.31009259259 | 40.721 |
| 44086.35175925926 | 40.798 |
| 44086.393425925926 | 41.648 |
| 44086.43509259259 | 43.578 |
| 44086.47675925926 | 45.895 |
| 44086.518425925926 | 48.675 |
| 44086.56009259259 | 51.455 |
| 44086.60175925926 | 53.848 |
| 44086.643425925926 | 55.547 |
| 44086.68509259259 | 56.242 |
| 44086.72675925926 | 56.011 |
| 44086.768425925926 | 54.852 |
| 44086.81009259259 | 53.617 |
| 44086.85175925926 | 52.458 |
| 44086.893425925926 | 50.991 |
| 44086.93509259259 | 49.679 |
| 44086.97675925926 | 48.289 |
| 44087.018425925926 | 46.821 |
| 44087.06009259259 | 45.663 |
| 44087.10175925926 | 44.736 |
| 44087.143425925926 | 43.964 |
| 44087.18509259259 | 43.269 |
| 44087.22675925926 | 42.651 |
| 44087.268425925926 | 42.188 |
| 44087.31009259259 | 41.956 |
| 44087.35175925926 | 41.879 |
| 44087.393425925926 | 42.729 |
| 44087.43509259259 | 44.505 |
| 44087.47675925926 | 46.899 |
| 44087.518425925926 | 49.601 |
| 44087.56009259259 | 52.304 |
| 44087.60175925926 | 54.775 |
| 44087.643425925926 | 56.474 |
| 44087.68509259259 | 57.323 |
| 44087.72675925926 | 57.169 |
| 44087.768425925926 | 56.397 |
| 44087.81009259259 | 55.547 |
| 44087.85175925926 | 54.235 |
| 44087.893425925926 | 52.999 |
| 44087.93509259259 | 51.532 |
| 44087.97675925926 | 49.833 |
| 44088.018425925926 | 48.366 |
| 44088.06009259259 | 47.13 |
| 44088.10175925926 | 46.049 |
| 44088.143425925926 | 45.2 |
| 44088.18509259259 | 44.428 |
| 44088.22675925926 | 43.81 |
| 44088.268425925926 | 43.346 |
| 44088.31009259259 | 42.806 |
| 44088.35175925926 | 42.883 |
| 44088.393425925926 | 43.578 |
| 44088.43509259259 | 45.2 |
| 44088.47675925926 | 47.362 |
| 44088.518425925926 | 49.756 |
| 44088.56009259259 | 52.458 |
| 44088.60175925926 | 54.93 |
| 44088.643425925926 | 56.551 |
| 44088.68509259259 | 57.323 |
| 44088.72675925926 | 57.169 |
| 44088.768425925926 | 56.551 |
| 44088.81009259259 | 55.625 |
| 44088.85175925926 | 54.389 |
| 44088.893425925926 | 52.999 |
| 44088.93509259259 | 51.532 |
| 44088.97675925926 | 49.91 |
| 44089.018425925926 | 48.52 |
| 44089.06009259259 | 47.13 |
| 44089.10175925926 | 45.972 |
| 44089.143425925926 | 45.045 |
| 44089.18509259259 | 44.35 |
| 44089.22675925926 | 43.655 |
| 44089.268425925926 | 43.038 |
| 44089.31009259259 | 42.729 |
| 44089.35175925926 | 42.497 |
| 44089.393425925926 | 43.269 |
| 44089.43509259259 | 44.814 |
| 44089.47675925926 | 47.053 |
| 44089.518425925926 | 49.524 |
| 44089.56009259259 | 51.918 |
| 44089.60175925926 | 54.08 |
| 44089.643425925926 | 55.238 |
| 44089.68509259259 | 55.933 |
| 44089.72675925926 | 55.856 |
| 44089.768425925926 | 55.161 |
| 44089.81009259259 | 54.157 |
| 44089.85175925926 | 53.076 |
| 44089.893425925926 | 51.764 |
| 44089.93509259259 | 50.451 |
| 44089.97675925926 | 48.984 |
| 44090.018425925926 | 47.671 |
| 44090.06009259259 | 46.358 |
| 44090.10175925926 | 45.277 |
| 44090.143425925926 | 44.35 |
| 44090.18509259259 | 43.655 |
| 44090.22675925926 | 42.883 |
| 44090.268425925926 | 42.42 |
| 44090.31009259259 | 41.956 |
| 44090.35175925926 | 41.956 |
| 44090.393425925926 | 42.651 |
| 44090.43509259259 | 44.119 |
| 44090.47675925926 | 46.049 |
| 44090.518425925926 | 48.366 |
| 44090.56009259259 | 50.682 |
| 44090.60175925926 | 52.922 |
| 44090.643425925926 | 54.235 |
| 44090.68509259259 | 55.007 |
| 44090.72675925926 | 54.698 |
| 44090.768425925926 | 54.08 |
| 44090.81009259259 | 53.231 |
| 44090.85175925926 | 51.995 |
| 44090.893425925926 | 50.914 |
| 44090.93509259259 | 49.833 |
| 44090.97675925926 | 48.752 |
| 44091.018425925926 | 47.671 |
| 44091.06009259259 | 46.667 |
| 44091.10175925926 | 45.663 |
| 44091.143425925926 | 44.814 |
| 44091.18509259259 | 44.196 |
| 44091.22675925926 | 43.578 |
| 44091.268425925926 | 43.115 |
| 44091.31009259259 | 42.651 |
| 44091.35175925926 | 42.729 |
| 44091.393425925926 | 43.424 |
| 44091.43509259259 | 44.736 |
| 44091.47675925926 | 46.821 |
| 44091.518425925926 | 49.138 |
| 44091.56009259259 | 51.377 |
| 44091.60175925926 | 53.308 |
| 44091.643425925926 | 54.775 |
| 44091.68509259259 | 55.238 |
| 44091.72675925926 | 55.084 |
| 44091.768425925926 | 54.235 |
| 44091.81009259259 | 53.153 |
| 44091.85175925926 | 51.995 |
| 44091.893425925926 | 50.914 |
| 44091.93509259259 | 49.679 |
| 44091.97675925926 | 48.52 |
| 44092.018425925926 | 47.439 |
| 44092.06009259259 | 46.358 |
| 44092.10175925926 | 45.431 |
| 44092.143425925926 | 44.505 |
| 44092.18509259259 | 43.887 |
| 44092.22675925926 | 43.346 |
| 44092.268425925926 | 42.883 |
| 44092.31009259259 | 42.574 |
| 44092.35175925926 | 42.497 |
| 44092.393425925926 | 43.269 |
| 44092.43509259259 | 44.659 |
| 44092.47675925926 | 46.976 |
| 44092.518425925926 | 48.443 |
| 44092.56009259259 | 50.065 |
| 44092.60175925926 | 51.841 |
| 44092.643425925926 | 52.536 |
| 44092.68509259259 | 53.308 |
| 44092.72675925926 | 53.385 |
| 44092.768425925926 | 52.767 |
| 44092.81009259259 | 52.227 |
| 44092.85175925926 | 51.532 |
| 44092.893425925926 | 50.528 |
| 44092.93509259259 | 49.292 |
| 44092.97675925926 | 48.211 |
| 44093.018425925926 | 47.053 |
| 44093.06009259259 | 46.358 |
| 44093.10175925926 | 45.74 |
| 44093.143425925926 | 45.2 |
| 44093.18509259259 | 44.736 |
| 44093.22675925926 | 44.196 |
| 44093.268425925926 | 43.733 |
| 44093.31009259259 | 43.424 |
| 44093.35175925926 | 43.501 |
| 44093.393425925926 | 44.041 |
| 44093.43509259259 | 45.586 |
| 44093.47675925926 | 47.825 |
| 44093.518425925926 | 50.065 |
| 44093.56009259259 | 50.528 |
| 44093.60175925926 | 50.837 |
| 44093.643425925926 | 51.146 |
| 44093.68509259259 | 52.304 |
| 44093.72675925926 | 53.076 |
| 44093.768425925926 | 52.536 |
| 44093.81009259259 | 51.686 |
| 44093.85175925926 | 50.682 |
| 44093.893425925926 | 49.601 |
| 44093.93509259259 | 48.597 |
| 44093.97675925926 | 47.748 |
| 44094.018425925926 | 47.207 |
| 44094.06009259259 | 46.667 |
| 44094.10175925926 | 45.972 |
| 44094.143425925926 | 45.586 |
| 44094.18509259259 | 45.045 |
| 44094.22675925926 | 44.736 |
| 44094.268425925926 | 44.505 |
| 44094.31009259259 | 44.196 |
| 44094.35175925926 | 44.428 |
| 44094.393425925926 | 45.123 |
| 44094.43509259259 | 46.59 |
| 44094.47675925926 | 47.902 |
| 44094.518425925926 | 48.52 |
| 44094.56009259259 | 48.984 |
| 44094.60175925926 | 49.524 |
| 44094.643425925926 | 50.76 |
| 44094.68509259259 | 51.223 |
| 44094.72675925926 | 51.841 |
| 44094.768425925926 | 51.455 |
| 44094.81009259259 | 50.837 |
| 44094.85175925926 | 49.756 |
| 44094.893425925926 | 48.984 |
| 44094.93509259259 | 48.211 |
| 44094.97675925926 | 47.362 |
| 44095.018425925926 | 46.435 |
| 44095.06009259259 | 45.431 |
| 44095.10175925926 | 44.505 |
| 44095.143425925926 | 43.887 |
| 44095.18509259259 | 43.346 |
| 44095.22675925926 | 42.883 |
| 44095.268425925926 | 42.42 |
| 44095.31009259259 | 42.034 |
| 44095.35175925926 | 42.111 |
| 44095.393425925926 | 42.96 |
| 44095.43509259259 | 44.814 |
| 44095.47675925926 | 47.13 |
| 44095.518425925926 | 49.292 |
| 44095.56009259259 | 50.837 |
| 44095.60175925926 | 51.841 |
| 44095.643425925926 | 53.694 |
| 44095.68509259259 | 54.93 |
| 44095.72675925926 | 54.698 |
| 44095.768425925926 | 54.08 |
| 44095.81009259259 | 53.076 |
| 44095.85175925926 | 52.304 |
| 44095.893425925926 | 51.609 |
| 44095.93509259259 | 50.296 |
| 44095.97675925926 | 49.138 |
| 44096.018425925926 | 47.825 |
| 44096.06009259259 | 46.899 |
| 44096.10175925926 | 45.972 |
| 44096.143425925926 | 45.123 |
| 44096.18509259259 | 44.428 |
| 44096.22675925926 | 43.887 |
| 44096.268425925926 | 43.501 |
| 44096.31009259259 | 43.038 |
| 44096.35175925926 | 42.96 |
| 44096.393425925926 | 43.578 |
| 44096.43509259259 | 45.277 |
| 44096.47675925926 | 47.594 |
| 44096.518425925926 | 49.756 |
| 44096.56009259259 | 50.682 |
| 44096.60175925926 | 51.686 |
| 44096.643425925926 | 52.072 |
| 44096.68509259259 | 51.764 |
| 44096.72675925926 | 52.072 |
| 44096.768425925926 | 51.918 |
| 44096.81009259259 | 51.377 |
| 44096.85175925926 | 50.605 |
| 44096.893425925926 | 49.833 |
| 44096.93509259259 | 49.138 |
| 44096.97675925926 | 48.289 |
| 44097.018425925926 | 47.362 |
| 44097.06009259259 | 46.59 |
| 44097.10175925926 | 46.126 |
| 44097.143425925926 | 45.586 |
| 44097.18509259259 | 45.045 |
| 44097.22675925926 | 44.582 |
| 44097.268425925926 | 44.041 |
| 44097.31009259259 | 43.578 |
| 44097.35175925926 | 43.346 |
| 44097.393425925926 | 44.041 |
| 44097.43509259259 | 45.586 |
| 44097.47675925926 | 47.748 |
| 44097.518425925926 | 50.142 |
| 44097.56009259259 | 52.536 |
| 44097.60175925926 | 54.466 |
| 44097.643425925926 | 54.852 |
| 44097.68509259259 | 55.238 |
| 44097.72675925926 | 55.007 |
| 44097.768425925926 | 53.926 |
| 44097.81009259259 | 52.922 |
| 44097.85175925926 | 51.686 |
| 44097.893425925926 | 50.682 |
| 44097.93509259259 | 49.37 |
| 44097.97675925926 | 48.134 |
| 44098.018425925926 | 46.821 |
| 44098.06009259259 | 45.509 |
| 44098.10175925926 | 44.659 |
| 44098.143425925926 | 43.733 |
| 44098.18509259259 | 43.115 |
| 44098.22675925926 | 42.651 |
| 44098.268425925926 | 42.188 |
| 44098.31009259259 | 41.802 |
| 44098.35175925926 | 41.725 |
| 44098.393425925926 | 42.497 |
| 44098.43509259259 | 43.578 |
| 44098.47675925926 | 45.2 |
| 44098.518425925926 | 47.594 |
| 44098.56009259259 | 50.374 |
| 44098.60175925926 | 52.999 |
| 44098.643425925926 | 54.698 |
| 44098.68509259259 | 55.47 |
| 44098.72675925926 | 55.393 |
| 44098.768425925926 | 54.389 |
| 44098.81009259259 | 53.385 |
| 44098.85175925926 | 52.227 |
| 44098.893425925926 | 51.223 |
| 44098.93509259259 | 49.987 |
| 44098.97675925926 | 48.675 |
| 44099.018425925926 | 47.516 |
| 44099.06009259259 | 46.435 |
| 44099.10175925926 | 45.431 |
| 44099.143425925926 | 44.659 |
| 44099.18509259259 | 43.964 |
| 44099.22675925926 | 43.424 |
| 44099.268425925926 | 42.883 |
| 44099.31009259259 | 42.651 |
| 44099.35175925926 | 42.497 |
| 44099.393425925926 | 43.192 |
| 44099.43509259259 | 44.814 |
| 44099.47675925926 | 47.13 |
| 44099.518425925926 | 49.37 |
| 44099.56009259259 | 51.609 |
| 44099.60175925926 | 53.771 |
| 44099.643425925926 | 54.852 |
| 44099.68509259259 | 55.316 |
| 44099.72675925926 | 55.161 |
| 44099.768425925926 | 54.235 |
| 44099.81009259259 | 53.385 |
| 44099.85175925926 | 52.381 |
| 44099.893425925926 | 51.3 |
| 44099.93509259259 | 50.219 |
| 44099.97675925926 | 48.984 |
| 44100.018425925926 | 47.594 |
| 44100.06009259259 | 46.513 |
| 44100.10175925926 | 45.509 |
| 44100.143425925926 | 44.659 |
| 44100.18509259259 | 44.119 |
| 44100.22675925926 | 43.501 |
| 44100.268425925926 | 43.115 |
| 44100.31009259259 | 42.806 |
| 44100.35175925926 | 42.729 |
| 44100.393425925926 | 43.269 |
| 44100.43509259259 | 44.814 |
| 44100.47675925926 | 46.976 |
| 44100.518425925926 | 48.443 |
| 44100.56009259259 | 50.528 |
| 44100.60175925926 | 52.458 |
| 44100.643425925926 | 54.003 |
| 44100.68509259259 | 55.084 |
| 44100.72675925926 | 55.084 |
| 44100.768425925926 | 54.08 |
| 44100.81009259259 | 53.076 |
| 44100.85175925926 | 52.304 |
| 44100.893425925926 | 51.377 |
| 44100.93509259259 | 50.528 |
| 44100.97675925926 | 49.524 |
| 44101.018425925926 | 48.443 |
| 44101.06009259259 | 47.439 |
| 44101.10175925926 | 46.59 |
| 44101.143425925926 | 45.895 |
| 44101.18509259259 | 45.2 |
| 44101.22675925926 | 44.582 |
| 44101.268425925926 | 44.273 |
| 44101.31009259259 | 44.196 |
| 44101.35175925926 | 44.196 |
| 44101.393425925926 | 44.582 |
| 44101.43509259259 | 45.123 |
| 44101.47675925926 | 46.513 |
| 44101.518425925926 | 48.057 |
| 44101.56009259259 | 49.91 |
| 44101.60175925926 | 50.528 |
| 44101.643425925926 | 50.914 |
| 44101.68509259259 | 51.455 |
| 44101.72675925926 | 50.605 |
| 44101.768425925926 | 48.984 |
| 44101.81009259259 | 47.516 |
| 44101.85175925926 | 46.126 |
| 44101.893425925926 | 45.2 |
| 44101.93509259259 | 44.505 |
| 44101.97675925926 | 43.81 |
| 44102.018425925926 | 43.192 |
| 44102.06009259259 | 42.651 |
| 44102.10175925926 | 42.343 |
| 44102.143425925926 | 41.802 |
| 44102.18509259259 | 41.261 |
| 44102.22675925926 | 40.721 |
| 44102.268425925926 | 40.335 |
| 44102.31009259259 | 39.717 |
| 44102.35175925926 | 39.485 |
| 44102.393425925926 | 40.103 |
| 44102.43509259259 | 41.416 |
| 44102.47675925926 | 43.269 |
| 44102.518425925926 | 45.354 |
| 44102.56009259259 | 47.594 |
| 44102.60175925926 | 49.447 |
| 44102.643425925926 | 50.528 |
| 44102.68509259259 | 50.914 |
| 44102.72675925926 | 50.142 |
| 44102.768425925926 | 48.906 |
| 44102.81009259259 | 47.902 |
| 44102.85175925926 | 46.899 |
| 44102.893425925926 | 45.74 |
| 44102.93509259259 | 44.659 |
| 44102.97675925926 | 43.733 |
| 44103.018425925926 | 42.574 |
| 44103.06009259259 | 41.493 |
| 44103.10175925926 | 40.567 |
| 44103.143425925926 | 39.872 |
| 44103.18509259259 | 39.254 |
| 44103.22675925926 | 38.713 |
| 44103.268425925926 | 38.482 |
| 44103.31009259259 | 38.173 |
| 44103.35175925926 | 38.173 |
| 44103.393425925926 | 38.945 |
| 44103.43509259259 | 40.644 |
| 44103.47675925926 | 42.883 |
| 44103.518425925926 | 45.586 |
| 44103.56009259259 | 48.366 |
| 44103.60175925926 | 50.76 |
| 44103.643425925926 | 52.304 |
| 44103.68509259259 | 52.845 |
| 44103.72675925926 | 52.458 |
| 44103.768425925926 | 51.3 |
| 44103.81009259259 | 50.374 |
| 44103.85175925926 | 49.292 |
| 44103.893425925926 | 48.134 |
| 44103.93509259259 | 47.053 |
| 44103.97675925926 | 45.663 |
| 44104.018425925926 | 44.35 |
| 44104.06009259259 | 43.192 |
| 44104.10175925926 | 42.265 |
| 44104.143425925926 | 41.416 |
| 44104.18509259259 | 40.721 |
| 44104.22675925926 | 40.258 |
| 44104.268425925926 | 39.717 |
| 44104.31009259259 | 39.485 |
| 44104.35175925926 | 39.177 |
| 44104.393425925926 | 39.949 |
| 44104.43509259259 | 41.648 |
| 44104.47675925926 | 43.964 |
| 44104.518425925926 | 46.59 |
| 44104.56009259259 | 49.061 |
| 44104.60175925926 | 51.377 |
| 44104.643425925926 | 52.767 |
| 44104.68509259259 | 53.153 |
| 44104.72675925926 | 52.458 |
| 44104.768425925926 | 51.069 |
| 44104.81009259259 | 50.065 |
| 44104.85175925926 | 48.906 |
| 44104.893425925926 | 47.748 |
| 44104.93509259259 | 46.59 |
| 44104.97675925926 | 45.431 |
| 44105.018425925926 | 44.119 |
| 44105.06009259259 | 42.883 |
| 44105.10175925926 | 41.956 |
| 44105.143425925926 | 41.107 |
| 44105.18509259259 | 40.412 |
| 44105.22675925926 | 39.872 |
| 44105.268425925926 | 39.563 |
| 44105.31009259259 | 39.099 |
| 44105.35175925926 | 38.945 |
| 44105.393425925926 | 39.717 |
| 44105.43509259259 | 41.261 |
| 44105.47675925926 | 43.115 |
| 44105.518425925926 | 45.586 |
| 44105.56009259259 | 47.98 |
| 44105.60175925926 | 49.987 |
| 44105.643425925926 | 51.377 |
| 44105.68509259259 | 51.841 |
| 44105.72675925926 | 51.3 |
| 44105.768425925926 | 50.219 |
| 44105.81009259259 | 49.292 |
| 44105.85175925926 | 48.211 |
| 44105.893425925926 | 47.207 |
| 44105.93509259259 | 46.281 |
| 44105.97675925926 | 45.2 |
| 44106.018425925926 | 44.196 |
| 44106.06009259259 | 43.038 |
| 44106.10175925926 | 42.265 |
| 44106.143425925926 | 41.493 |
| 44106.18509259259 | 40.875 |
| 44106.22675925926 | 40.258 |
| 44106.268425925926 | 39.949 |
| 44106.31009259259 | 39.563 |
| 44106.35175925926 | 39.485 |
| 44106.393425925926 | 40.103 |
| 44106.43509259259 | 41.725 |
| 44106.47675925926 | 43.887 |
| 44106.518425925926 | 46.204 |
| 44106.56009259259 | 48.366 |
| 44106.60175925926 | 49.601 |
| 44106.643425925926 | 50.296 |
| 44106.68509259259 | 50.451 |
| 44106.72675925926 | 49.91 |
| 44106.768425925926 | 49.37 |
| 44106.81009259259 | 48.675 |
| 44106.85175925926 | 47.825 |
| 44106.893425925926 | 46.821 |
| 44106.93509259259 | 45.818 |
| 44106.97675925926 | 44.891 |
| 44107.018425925926 | 43.887 |
| 44107.06009259259 | 42.806 |
| 44107.10175925926 | 41.956 |
| 44107.143425925926 | 41.261 |
| 44107.18509259259 | 40.644 |
| 44107.22675925926 | 40.103 |
| 44107.268425925926 | 39.64 |
| 44107.31009259259 | 39.331 |
| 44107.35175925926 | 39.177 |
| 44107.393425925926 | 39.794 |
| 44107.43509259259 | 41.261 |
| 44107.47675925926 | 43.269 |
| 44107.518425925926 | 45.818 |
| 44107.56009259259 | 48.211 |
| 44107.60175925926 | 50.296 |
| 44107.643425925926 | 51.532 |
| 44107.68509259259 | 51.841 |
| 44107.72675925926 | 51.3 |
| 44107.768425925926 | 50.296 |
| 44107.81009259259 | 49.601 |
| 44107.85175925926 | 48.52 |
| 44107.893425925926 | 47.516 |
| 44107.93509259259 | 46.59 |
| 44107.97675925926 | 45.586 |
| 44108.018425925926 | 44.273 |
| 44108.06009259259 | 43.115 |
| 44108.10175925926 | 42.188 |
| 44108.143425925926 | 41.416 |
| 44108.18509259259 | 40.721 |
| 44108.22675925926 | 40.18 |
| 44108.268425925926 | 39.872 |
| 44108.31009259259 | 39.485 |
| 44108.35175925926 | 39.177 |
| 44108.393425925926 | 39.949 |
| 44108.43509259259 | 41.57 |
| 44108.47675925926 | 43.733 |
| 44108.518425925926 | 46.204 |
| 44108.56009259259 | 48.752 |
| 44108.60175925926 | 50.837 |
| 44108.643425925926 | 52.304 |
| 44108.68509259259 | 52.767 |
| 44108.72675925926 | 52.304 |
| 44108.768425925926 | 51.377 |
| 44108.81009259259 | 50.605 |
| 44108.85175925926 | 49.601 |
| 44108.893425925926 | 48.675 |
| 44108.93509259259 | 47.594 |
| 44108.97675925926 | 46.281 |
| 44109.018425925926 | 45.123 |
| 44109.06009259259 | 43.964 |
| 44109.10175925926 | 42.883 |
| 44109.143425925926 | 41.956 |
| 44109.18509259259 | 41.184 |
| 44109.22675925926 | 40.721 |
| 44109.268425925926 | 40.18 |
| 44109.31009259259 | 39.717 |
| 44109.35175925926 | 39.408 |
| 44109.393425925926 | 40.026 |
| 44109.43509259259 | 41.648 |
| 44109.47675925926 | 43.733 |
| 44109.518425925926 | 45.972 |
| 44109.56009259259 | 48.366 |
| 44109.60175925926 | 50.374 |
| 44109.643425925926 | 51.609 |
| 44109.68509259259 | 51.918 |
| 44109.72675925926 | 51.146 |
| 44109.768425925926 | 50.219 |
| 44109.81009259259 | 49.215 |
| 44109.85175925926 | 48.366 |
| 44109.893425925926 | 47.362 |
| 44109.93509259259 | 46.281 |
| 44109.97675925926 | 45.2 |
| 44110.018425925926 | 43.887 |
| 44110.06009259259 | 42.883 |
| 44110.10175925926 | 41.879 |
| 44110.143425925926 | 41.107 |
| 44110.18509259259 | 40.489 |
| 44110.22675925926 | 39.872 |
| 44110.268425925926 | 39.485 |
| 44110.31009259259 | 39.022 |
| 44110.35175925926 | 38.868 |
| 44110.393425925926 | 39.64 |
| 44110.43509259259 | 41.107 |
| 44110.47675925926 | 43.269 |
| 44110.518425925926 | 45.74 |
| 44110.56009259259 | 48.289 |
| 44110.60175925926 | 50.451 |
| 44110.643425925926 | 51.764 |
| 44110.68509259259 | 52.381 |
| 44110.72675925926 | 51.918 |
| 44110.768425925926 | 51.069 |
| 44110.81009259259 | 50.142 |
| 44110.85175925926 | 49.138 |
| 44110.893425925926 | 48.057 |
| 44110.93509259259 | 46.899 |
| 44110.97675925926 | 45.586 |
| 44111.018425925926 | 44.273 |
| 44111.06009259259 | 43.192 |
| 44111.10175925926 | 42.188 |
| 44111.143425925926 | 41.416 |
| 44111.18509259259 | 40.798 |
| 44111.22675925926 | 40.18 |
| 44111.268425925926 | 39.794 |
| 44111.31009259259 | 39.408 |
| 44111.35175925926 | 39.254 |
| 44111.393425925926 | 39.949 |
| 44111.43509259259 | 41.416 |
| 44111.47675925926 | 43.655 |
| 44111.518425925926 | 46.204 |
| 44111.56009259259 | 48.675 |
| 44111.60175925926 | 50.914 |
| 44111.643425925926 | 52.381 |
| 44111.68509259259 | 52.845 |
| 44111.72675925926 | 52.304 |
| 44111.768425925926 | 51.455 |
| 44111.81009259259 | 50.528 |
| 44111.85175925926 | 49.447 |
| 44111.893425925926 | 48.366 |
| 44111.93509259259 | 47.285 |
| 44111.97675925926 | 46.049 |
| 44112.018425925926 | 44.814 |
| 44112.06009259259 | 43.81 |
| 44112.10175925926 | 42.883 |
| 44112.143425925926 | 42.111 |
| 44112.18509259259 | 41.493 |
| 44112.22675925926 | 40.875 |
| 44112.268425925926 | 40.412 |
| 44112.31009259259 | 40.18 |
| 44112.35175925926 | 39.872 |
| 44112.393425925926 | 40.489 |
| 44112.43509259259 | 41.802 |
| 44112.47675925926 | 44.041 |
| 44112.518425925926 | 46.358 |
| 44112.56009259259 | 48.752 |
| 44112.60175925926 | 50.76 |
| 44112.643425925926 | 51.995 |
| 44112.68509259259 | 52.458 |
| 44112.72675925926 | 51.918 |
| 44112.768425925926 | 51.069 |
| 44112.81009259259 | 50.296 |
| 44112.85175925926 | 49.37 |
| 44112.893425925926 | 48.443 |
| 44112.93509259259 | 47.516 |
| 44112.97675925926 | 46.59 |
| 44113.018425925926 | 45.663 |
| 44113.06009259259 | 44.505 |
| 44113.10175925926 | 43.733 |
| 44113.143425925926 | 42.806 |
| 44113.18509259259 | 42.034 |
| 44113.22675925926 | 41.416 |
| 44113.268425925926 | 40.721 |
| 44113.31009259259 | 40.335 |
| 44113.35175925926 | 40.026 |
| 44113.393425925926 | 40.258 |
| 44113.43509259259 | 41.725 |
| 44113.47675925926 | 43.887 |
| 44113.518425925926 | 46.513 |
| 44113.56009259259 | 48.906 |
| 44113.60175925926 | 50.76 |
| 44113.643425925926 | 52.304 |
| 44113.68509259259 | 52.845 |
| 44113.72675925926 | 52.227 |
| 44113.768425925926 | 51.3 |
| 44113.81009259259 | 50.682 |
| 44113.85175925926 | 50.296 |
| 44113.893425925926 | 49.756 |
| 44113.93509259259 | 49.061 |
| 44113.97675925926 | 48.211 |
| 44114.018425925926 | 47.285 |
| 44114.06009259259 | 46.358 |
| 44114.10175925926 | 45.277 |
| 44114.143425925926 | 44.428 |
| 44114.18509259259 | 43.501 |
| 44114.22675925926 | 42.729 |
| 44114.268425925926 | 42.034 |
| 44114.31009259259 | 41.57 |
| 44114.35175925926 | 41.184 |
| 44114.393425925926 | 41.57 |
| 44114.43509259259 | 42.883 |
| 44114.47675925926 | 44.891 |
| 44114.518425925926 | 47.439 |
| 44114.56009259259 | 50.142 |
| 44114.60175925926 | 51.532 |
| 44114.643425925926 | 52.69 |
| 44114.68509259259 | 53.54 |
| 44114.72675925926 | 53.076 |
| 44114.768425925926 | 52.536 |
| 44114.81009259259 | 51.918 |
| 44114.85175925926 | 51.069 |
| 44114.893425925926 | 50.142 |
| 44114.93509259259 | 49.215 |
| 44114.97675925926 | 48.289 |
| 44115.018425925926 | 47.362 |
| 44115.06009259259 | 46.204 |
| 44115.10175925926 | 45.123 |
| 44115.143425925926 | 44.119 |
| 44115.18509259259 | 43.346 |
| 44115.22675925926 | 42.883 |
| 44115.268425925926 | 42.343 |
| 44115.31009259259 | 42.034 |
| 44115.35175925926 | 41.802 |
| 44115.393425925926 | 42.343 |
| 44115.43509259259 | 43.038 |
| 44115.47675925926 | 43.346 |
| 44115.518425925926 | 43.578 |
| 44115.56009259259 | 42.883 |
| 44115.60175925926 | 41.802 |
| 44115.643425925926 | 40.335 |
| 44115.68509259259 | 40.18 |
| 44115.72675925926 | 40.18 |
| 44115.768425925926 | 40.18 |
| 44115.81009259259 | 39.717 |
| 44115.85175925926 | 39.331 |
| 44115.893425925926 | 38.868 |
| 44115.93509259259 | 38.327 |
| 44115.97675925926 | 37.787 |
| 44116.018425925926 | 37.555 |
| 44116.06009259259 | 37.246 |
| 44116.10175925926 | 36.937 |
| 44116.143425925926 | 36.628 |
| 44116.18509259259 | 36.397 |
| 44116.22675925926 | 36.165 |
| 44116.268425925926 | 35.933 |
| 44116.31009259259 | 35.702 |
| 44116.35175925926 | 35.624 |
| 44116.393425925926 | 36.319 |
| 44116.43509259259 | 37.787 |
| 44116.47675925926 | 40.103 |
| 44116.518425925926 | 42.729 |
| 44116.56009259259 | 45.277 |
| 44116.60175925926 | 47.439 |
| 44116.643425925926 | 48.597 |
| 44116.68509259259 | 48.906 |
| 44116.72675925926 | 48.289 |
| 44116.768425925926 | 47.207 |
| 44116.81009259259 | 46.435 |
| 44116.85175925926 | 45.586 |
| 44116.893425925926 | 44.891 |
| 44116.93509259259 | 44.273 |
| 44116.97675925926 | 43.424 |
| 44117.018425925926 | 42.651 |
| 44117.06009259259 | 41.802 |
| 44117.10175925926 | 41.03 |
| 44117.143425925926 | 40.258 |
| 44117.18509259259 | 39.717 |
| 44117.22675925926 | 39.099 |
| 44117.268425925926 | 38.713 |
| 44117.31009259259 | 38.173 |
| 44117.35175925926 | 38.095 |
| 44117.393425925926 | 38.636 |
| 44117.43509259259 | 40.026 |
| 44117.47675925926 | 42.188 |
| 44117.518425925926 | 44.582 |
| 44117.56009259259 | 47.13 |
| 44117.60175925926 | 49.061 |
| 44117.643425925926 | 50.374 |
| 44117.68509259259 | 50.837 |
| 44117.72675925926 | 50.296 |
| 44117.768425925926 | 49.215 |
| 44117.81009259259 | 48.366 |
| 44117.85175925926 | 47.516 |
| 44117.893425925926 | 46.821 |
| 44117.93509259259 | 46.126 |
| 44117.97675925926 | 45.431 |
| 44118.018425925926 | 44.659 |
| 44118.06009259259 | 43.887 |
| 44118.10175925926 | 43.269 |
| 44118.143425925926 | 42.497 |
| 44118.18509259259 | 41.956 |
| 44118.22675925926 | 41.416 |
| 44118.268425925926 | 41.107 |
| 44118.31009259259 | 40.875 |
| 44118.35175925926 | 40.798 |
| 44118.393425925926 | 41.339 |
| 44118.43509259259 | 42.651 |
| 44118.47675925926 | 44.582 |
| 44118.518425925926 | 46.821 |
| 44118.56009259259 | 48.752 |
| 44118.60175925926 | 50.528 |
| 44118.643425925926 | 51.609 |
| 44118.68509259259 | 51.918 |
| 44118.72675925926 | 51.3 |
| 44118.768425925926 | 50.451 |
| 44118.81009259259 | 49.524 |
| 44118.85175925926 | 48.597 |
| 44118.893425925926 | 47.902 |
| 44118.93509259259 | 47.053 |
| 44118.97675925926 | 46.281 |
| 44119.018425925926 | 45.354 |
| 44119.06009259259 | 44.505 |
| 44119.10175925926 | 43.578 |
| 44119.143425925926 | 42.651 |
| 44119.18509259259 | 41.802 |
| 44119.22675925926 | 40.875 |
| 44119.268425925926 | 40.103 |
| 44119.31009259259 | 39.177 |
| 44119.35175925926 | 38.79 |
| 44119.393425925926 | 38.713 |
| 44119.43509259259 | 39.563 |
| 44119.47675925926 | 40.798 |
| 44119.518425925926 | 42.497 |
| 44119.56009259259 | 44.505 |
| 44119.60175925926 | 45.818 |
| 44119.643425925926 | 46.59 |
| 44119.68509259259 | 46.281 |
| 44119.72675925926 | 45.2 |
| 44119.768425925926 | 43.964 |
| 44119.81009259259 | 43.038 |
| 44119.85175925926 | 42.265 |
| 44119.893425925926 | 41.493 |
| 44119.93509259259 | 41.03 |
| 44119.97675925926 | 40.412 |
| 44120.018425925926 | 39.717 |
| 44120.06009259259 | 39.022 |
| 44120.10175925926 | 38.327 |
| 44120.143425925926 | 37.632 |
| 44120.18509259259 | 37.014 |
| 44120.22675925926 | 36.551 |
| 44120.268425925926 | 36.165 |
| 44120.31009259259 | 35.779 |
| 44120.35175925926 | 35.702 |
| 44120.393425925926 | 36.165 |
| 44120.43509259259 | 37.555 |
| 44120.47675925926 | 39.485 |
| 44120.518425925926 | 41.802 |
| 44120.56009259259 | 43.578 |
| 44120.60175925926 | 45.2 |
| 44120.643425925926 | 46.204 |
| 44120.68509259259 | 46.899 |
| 44120.72675925926 | 46.281 |
| 44120.768425925926 | 45.431 |
| 44120.81009259259 | 44.814 |
| 44120.85175925926 | 44.041 |
| 44120.893425925926 | 43.578 |
| 44120.93509259259 | 43.269 |
| 44120.97675925926 | 42.729 |
| 44121.018425925926 | 42.188 |
| 44121.06009259259 | 41.725 |
| 44121.10175925926 | 41.107 |
| 44121.143425925926 | 40.489 |
| 44121.18509259259 | 39.872 |
| 44121.22675925926 | 39.408 |
| 44121.268425925926 | 39.022 |
| 44121.31009259259 | 38.636 |
| 44121.35175925926 | 38.636 |
| 44121.393425925926 | 39.177 |
| 44121.43509259259 | 40.489 |
| 44121.47675925926 | 41.261 |
| 44121.518425925926 | 42.42 |
| 44121.56009259259 | 43.038 |
| 44121.60175925926 | 44.428 |
| 44121.643425925926 | 45.431 |
| 44121.68509259259 | 46.049 |
| 44121.72675925926 | 46.126 |
| 44121.768425925926 | 45.586 |
| 44121.81009259259 | 45.045 |
| 44121.85175925926 | 44.582 |
| 44121.893425925926 | 44.35 |
| 44121.93509259259 | 44.196 |
| 44121.97675925926 | 43.81 |
| 44122.018425925926 | 43.424 |
| 44122.06009259259 | 42.729 |
| 44122.10175925926 | 42.265 |
| 44122.143425925926 | 41.648 |
| 44122.18509259259 | 41.261 |
| 44122.22675925926 | 40.875 |
| 44122.268425925926 | 40.567 |
| 44122.31009259259 | 40.412 |
| 44122.35175925926 | 40.258 |
| 44122.393425925926 | 40.721 |
| 44122.43509259259 | 41.879 |
| 44122.47675925926 | 42.96 |
| 44122.518425925926 | 44.196 |
| 44122.56009259259 | 46.821 |
| 44122.60175925926 | 49.215 |
| 44122.643425925926 | 50.682 |
| 44122.68509259259 | 50.837 |
| 44122.72675925926 | 50.528 |
| 44122.768425925926 | 49.833 |
| 44122.81009259259 | 48.906 |
| 44122.85175925926 | 48.211 |
| 44122.893425925926 | 47.516 |
| 44122.93509259259 | 46.821 |
| 44122.97675925926 | 46.204 |
| 44123.018425925926 | 45.354 |
| 44123.06009259259 | 44.582 |
| 44123.10175925926 | 43.578 |
| 44123.143425925926 | 42.729 |
| 44123.18509259259 | 41.956 |
| 44123.22675925926 | 41.339 |
| 44123.268425925926 | 40.875 |
| 44123.31009259259 | 40.412 |
| 44123.35175925926 | 40.103 |
| 44123.393425925926 | 40.644 |
| 44123.43509259259 | 41.725 |
| 44123.47675925926 | 43.501 |
| 44123.518425925926 | 45.586 |
| 44123.56009259259 | 46.976 |
| 44123.60175925926 | 48.752 |
| 44123.643425925926 | 50.296 |
| 44123.68509259259 | 51.146 |
| 44123.72675925926 | 50.605 |
| 44123.768425925926 | 49.524 |
| 44123.81009259259 | 48.752 |
| 44123.85175925926 | 47.902 |
| 44123.893425925926 | 47.13 |
| 44123.93509259259 | 46.281 |
| 44123.97675925926 | 45.509 |
| 44124.018425925926 | 44.659 |
| 44124.06009259259 | 43.733 |
| 44124.10175925926 | 42.883 |
| 44124.143425925926 | 42.034 |
| 44124.18509259259 | 41.261 |
| 44124.22675925926 | 40.644 |
| 44124.268425925926 | 40.18 |
| 44124.31009259259 | 39.64 |
| 44124.35175925926 | 39.408 |
| 44124.393425925926 | 39.64 |
| 44124.43509259259 | 40.875 |
| 44124.47675925926 | 42.806 |
| 44124.518425925926 | 44.814 |
| 44124.56009259259 | 46.899 |
| 44124.60175925926 | 48.443 |
| 44124.643425925926 | 49.37 |
| 44124.68509259259 | 49.833 |
| 44124.72675925926 | 49.447 |
| 44124.768425925926 | 48.829 |
| 44124.81009259259 | 48.134 |
| 44124.85175925926 | 47.207 |
| 44124.893425925926 | 46.59 |
| 44124.93509259259 | 45.895 |
| 44124.97675925926 | 45.123 |
| 44125.018425925926 | 44.196 |
| 44125.06009259259 | 43.269 |
| 44125.10175925926 | 42.497 |
| 44125.143425925926 | 41.725 |
| 44125.18509259259 | 40.953 |
| 44125.22675925926 | 40.335 |
| 44125.268425925926 | 39.794 |
| 44125.31009259259 | 39.177 |
| 44125.35175925926 | 38.868 |
| 44125.393425925926 | 38.868 |
| 44125.43509259259 | 40.026 |
| 44125.47675925926 | 42.188 |
| 44125.518425925926 | 44.35 |
| 44125.56009259259 | 46.204 |
| 44125.60175925926 | 47.98 |
| 44125.643425925926 | 49.37 |
| 44125.68509259259 | 49.91 |
| 44125.72675925926 | 49.215 |
| 44125.768425925926 | 48.289 |
| 44125.81009259259 | 47.516 |
| 44125.85175925926 | 46.667 |
| 44125.893425925926 | 45.895 |
| 44125.93509259259 | 45.2 |
| 44125.97675925926 | 44.582 |
| 44126.018425925926 | 43.733 |
| 44126.06009259259 | 42.651 |
| 44126.10175925926 | 41.802 |
| 44126.143425925926 | 41.03 |
| 44126.18509259259 | 40.335 |
| 44126.22675925926 | 39.872 |
| 44126.268425925926 | 39.254 |
| 44126.31009259259 | 38.868 |
| 44126.35175925926 | 38.636 |
| 44126.393425925926 | 38.713 |
| 44126.43509259259 | 40.026 |
| 44126.47675925926 | 41.879 |
| 44126.518425925926 | 44.119 |
| 44126.56009259259 | 46.204 |
| 44126.60175925926 | 48.057 |
| 44126.643425925926 | 49.215 |
| 44126.68509259259 | 49.292 |
| 44126.72675925926 | 48.52 |
| 44126.768425925926 | 47.748 |
| 44126.81009259259 | 46.976 |
| 44126.85175925926 | 46.126 |
| 44126.893425925926 | 45.354 |
| 44126.93509259259 | 44.505 |
| 44126.97675925926 | 43.655 |
| 44127.018425925926 | 42.729 |
| 44127.06009259259 | 41.802 |
| 44127.10175925926 | 40.798 |
| 44127.143425925926 | 39.794 |
| 44127.18509259259 | 38.945 |
| 44127.22675925926 | 38.018 |
| 44127.268425925926 | 37.4 |
| 44127.31009259259 | 36.705 |
| 44127.35175925926 | 36.397 |
| 44127.393425925926 | 36.705 |
| 44127.43509259259 | 37.709 |
| 44127.47675925926 | 39.331 |
| 44127.518425925926 | 41.03 |
| 44127.56009259259 | 42.806 |
| 44127.60175925926 | 44.041 |
| 44127.643425925926 | 45.045 |
| 44127.68509259259 | 45.354 |
| 44127.72675925926 | 45.2 |
| 44127.768425925926 | 44.736 |
| 44127.81009259259 | 44.273 |
| 44127.85175925926 | 43.887 |
| 44127.893425925926 | 43.578 |
| 44127.93509259259 | 43.346 |
| 44127.97675925926 | 43.038 |
| 44128.018425925926 | 42.574 |
| 44128.06009259259 | 42.034 |
| 44128.10175925926 | 41.416 |
| 44128.143425925926 | 40.875 |
| 44128.18509259259 | 40.489 |
| 44128.22675925926 | 40.18 |
| 44128.268425925926 | 39.949 |
| 44128.31009259259 | 39.64 |
| 44128.35175925926 | 39.485 |
| 44128.393425925926 | 39.794 |
| 44128.43509259259 | 41.03 |
| 44128.47675925926 | 43.038 |
| 44128.518425925926 | 45.045 |
| 44128.56009259259 | 46.513 |
| 44128.60175925926 | 47.902 |
| 44128.643425925926 | 48.057 |
| 44128.68509259259 | 47.671 |
| 44128.72675925926 | 47.207 |
| 44128.768425925926 | 46.667 |
| 44128.81009259259 | 46.281 |
| 44128.85175925926 | 45.895 |
| 44128.893425925926 | 45.509 |
| 44128.93509259259 | 44.891 |
| 44128.97675925926 | 44.196 |
| 44129.018425925926 | 43.733 |
| 44129.06009259259 | 43.269 |
| 44129.10175925926 | 43.038 |
| 44129.143425925926 | 42.651 |
| 44129.18509259259 | 42.343 |
| 44129.22675925926 | 42.034 |
| 44129.268425925926 | 41.879 |
| 44129.31009259259 | 41.725 |
| 44129.35175925926 | 41.725 |
| 44129.393425925926 | 41.802 |
| 44129.43509259259 | 42.188 |
| 44129.47675925926 | 43.115 |
| 44129.518425925926 | 43.192 |
| 44129.56009259259 | 42.188 |
| 44129.60175925926 | 41.03 |
| 44129.643425925926 | 40.103 |
| 44129.68509259259 | 38.327 |
| 44129.72675925926 | 36.783 |
| 44129.768425925926 | 35.315 |
| 44129.81009259259 | 34.234 |
| 44129.85175925926 | 33.771 |
| 44129.893425925926 | 33.539 |
| 44129.93509259259 | 32.999 |
| 44129.97675925926 | 32.458 |
| 44130.018425925926 | 32.149 |
| 44130.06009259259 | 32.227 |
| 44130.10175925926 | 32.227 |
| 44130.143425925926 | 32.304 |
| 44130.18509259259 | 32.227 |
| 44130.22675925926 | 32.304 |
| 44130.268425925926 | 32.381 |
| 44130.31009259259 | 32.227 |
| 44130.35175925926 | 32.227 |
| 44130.393425925926 | 32.227 |
| 44130.43509259259 | 32.304 |
| 44130.47675925926 | 32.381 |
| 44130.518425925926 | 32.381 |
| 44130.56009259259 | 33.076 |
| 44130.60175925926 | 34.698 |
| 44130.643425925926 | 35.933 |
| 44130.68509259259 | 36.088 |
| 44130.72675925926 | 36.088 |
| 44130.768425925926 | 35.624 |
| 44130.81009259259 | 35.161 |
| 44130.85175925926 | 34.621 |
| 44130.893425925926 | 34.157 |
| 44130.93509259259 | 33.694 |
| 44130.97675925926 | 33.153 |
| 44131.018425925926 | 32.613 |
| 44131.06009259259 | 32.149 |
| 44131.10175925926 | 32.304 |
| 44131.143425925926 | 32.149 |
| 44131.18509259259 | 32.227 |
| 44131.22675925926 | 32.227 |
| 44131.268425925926 | 32.227 |
| 44131.31009259259 | 32.227 |
| 44131.35175925926 | 32.227 |
| 44131.393425925926 | 32.227 |
| 44131.43509259259 | 32.227 |
| 44131.47675925926 | 32.227 |
| 44131.518425925926 | 32.613 |
| 44131.56009259259 | 33.771 |
| 44131.60175925926 | 36.165 |
| 44131.643425925926 | 37.787 |
| 44131.68509259259 | 38.327 |
| 44131.72675925926 | 37.941 |
| 44131.768425925926 | 37.323 |
| 44131.81009259259 | 36.86 |
| 44131.85175925926 | 36.397 |
| 44131.893425925926 | 35.779 |
| 44131.93509259259 | 35.547 |
| 44131.97675925926 | 35.084 |
| 44132.018425925926 | 34.389 |
| 44132.06009259259 | 33.771 |
| 44132.10175925926 | 33.308 |
| 44132.143425925926 | 32.922 |
| 44132.18509259259 | 32.458 |
| 44132.22675925926 | 32.304 |
| 44132.268425925926 | 32.227 |
| 44132.31009259259 | 32.149 |
| 44132.35175925926 | 32.227 |
| 44132.393425925926 | 32.227 |
| 44132.43509259259 | 33.231 |
| 44132.47675925926 | 34.775 |
| 44132.518425925926 | 36.551 |
| 44132.56009259259 | 38.404 |
| 44132.60175925926 | 40.18 |
| 44132.643425925926 | 41.261 |
| 44132.68509259259 | 41.339 |
| 44132.72675925926 | 40.953 |
| 44132.768425925926 | 40.489 |
| 44132.81009259259 | 39.872 |
| 44132.85175925926 | 39.254 |
| 44132.893425925926 | 38.868 |
| 44132.93509259259 | 38.404 |
| 44132.97675925926 | 37.864 |
| 44133.018425925926 | 37.246 |
| 44133.06009259259 | 36.551 |
| 44133.10175925926 | 35.933 |
| 44133.143425925926 | 35.393 |
| 44133.18509259259 | 35.007 |
| 44133.22675925926 | 34.543 |
| 44133.268425925926 | 34.234 |
| 44133.31009259259 | 34.08 |
| 44133.35175925926 | 33.926 |
| 44133.393425925926 | 34.234 |
| 44133.43509259259 | 35.547 |
| 44133.47675925926 | 37.092 |
| 44133.518425925926 | 39.099 |
| 44133.56009259259 | 41.261 |
| 44133.60175925926 | 42.96 |
| 44133.643425925926 | 43.887 |
| 44133.68509259259 | 44.119 |
| 44133.72675925926 | 43.346 |
| 44133.768425925926 | 42.651 |
| 44133.81009259259 | 41.956 |
| 44133.85175925926 | 41.261 |
| 44133.893425925926 | 40.721 |
| 44133.93509259259 | 40.18 |
| 44133.97675925926 | 39.408 |
| 44134.018425925926 | 38.559 |
| 44134.06009259259 | 37.864 |
| 44134.10175925926 | 37.092 |
| 44134.143425925926 | 36.397 |
| 44134.18509259259 | 35.933 |
| 44134.22675925926 | 35.547 |
| 44134.268425925926 | 35.161 |
| 44134.31009259259 | 34.929 |
| 44134.35175925926 | 34.698 |
| 44134.393425925926 | 34.929 |
| 44134.43509259259 | 36.165 |
| 44134.47675925926 | 37.787 |
| 44134.518425925926 | 39.872 |
| 44134.56009259259 | 41.802 |
| 44134.60175925926 | 43.578 |
| 44134.643425925926 | 44.582 |
| 44134.68509259259 | 44.582 |
| 44134.72675925926 | 43.81 |
| 44134.768425925926 | 43.038 |
| 44134.81009259259 | 42.42 |
| 44134.85175925926 | 41.725 |
| 44134.893425925926 | 41.184 |
| 44134.93509259259 | 40.567 |
| 44134.97675925926 | 39.794 |
| 44135.018425925926 | 38.945 |
| 44135.06009259259 | 38.173 |
| 44135.10175925926 | 37.4 |
| 44135.143425925926 | 36.783 |
| 44135.18509259259 | 36.397 |
| 44135.22675925926 | 36.01 |
| 44135.268425925926 | 35.547 |
| 44135.31009259259 | 35.238 |
| 44135.35175925926 | 35.161 |
| 44135.393425925926 | 35.315 |
| 44135.43509259259 | 36.628 |
| 44135.47675925926 | 38.25 |
| 44135.518425925926 | 40.18 |
| 44135.56009259259 | 42.111 |
| 44135.60175925926 | 43.655 |
| 44135.643425925926 | 44.428 |
| 44135.68509259259 | 44.428 |
| 44135.72675925926 | 43.81 |
| 44135.768425925926 | 43.115 |
| 44135.81009259259 | 42.42 |
| 44135.85175925926 | 41.725 |
| 44135.893425925926 | 41.107 |
| 44135.93509259259 | 40.412 |
| 44135.97675925926 | 39.717 |
| 44136.018425925926 | 38.868 |
| 44136.06009259259 | 38.095 |
| 44136.06009259259 | 37.4 |
| 44136.10175925926 | 36.783 |
| 44136.143425925926 | 36.242 |
| 44136.18509259259 | 35.779 |
| 44136.22675925926 | 35.315 |
| 44136.268425925926 | 35.007 |
| 44136.31009259259 | 34.698 |
| 44136.35175925926 | 34.929 |
| 44136.393425925926 | 36.088 |
| 44136.43509259259 | 37.864 |
| 44136.47675925926 | 39.794 |
| 44136.518425925926 | 42.111 |
| 44136.56009259259 | 43.733 |
| 44136.60175925926 | 44.736 |
| 44136.643425925926 | 44.736 |
| 44136.68509259259 | 44.119 |
| 44136.72675925926 | 43.424 |
| 44136.768425925926 | 42.651 |
| 44136.81009259259 | 42.034 |
| 44136.85175925926 | 41.57 |
| 44136.893425925926 | 40.798 |
| 44136.93509259259 | 40.026 |
| 44136.97675925926 | 39.331 |
| 44137.018425925926 | 38.482 |
| 44137.06009259259 | 37.864 |
| 44137.10175925926 | 37.092 |
| 44137.143425925926 | 36.705 |
| 44137.18509259259 | 36.319 |
| 44137.22675925926 | 35.779 |
| 44137.268425925926 | 35.47 |
| 44137.31009259259 | 35.315 |
| 44137.35175925926 | 35.47 |
| 44137.393425925926 | 36.705 |
| 44137.43509259259 | 38.404 |
| 44137.47675925926 | 40.335 |
| 44137.518425925926 | 42.42 |
| 44137.56009259259 | 44.196 |
| 44137.60175925926 | 45.045 |
| 44137.643425925926 | 45.045 |
| 44137.68509259259 | 44.505 |
| 44137.72675925926 | 43.81 |
| 44137.768425925926 | 43.115 |
| 44137.81009259259 | 42.42 |
| 44137.85175925926 | 41.879 |
| 44137.893425925926 | 41.261 |
| 44137.93509259259 | 40.567 |
| 44137.97675925926 | 39.717 |
| 44138.018425925926 | 39.022 |
| 44138.06009259259 | 38.327 |
| 44138.10175925926 | 37.864 |
| 44138.143425925926 | 37.323 |
| 44138.18509259259 | 36.937 |
| 44138.22675925926 | 36.628 |
| 44138.268425925926 | 36.397 |
| 44138.31009259259 | 36.319 |
| 44138.35175925926 | 36.474 |
| 44138.393425925926 | 37.555 |
| 44138.43509259259 | 39.177 |
| 44138.47675925926 | 40.644 |
| 44138.518425925926 | 42.265 |
| 44138.56009259259 | 43.578 |
| 44138.60175925926 | 43.733 |
| 44138.643425925926 | 43.964 |
| 44138.68509259259 | 43.887 |
| 44138.72675925926 | 43.346 |
| 44138.768425925926 | 42.883 |
| 44138.81009259259 | 42.265 |
| 44138.85175925926 | 41.802 |
| 44138.893425925926 | 41.184 |
| 44138.93509259259 | 40.644 |
| 44138.97675925926 | 40.103 |
| 44139.018425925926 | 39.408 |
| 44139.06009259259 | 38.79 |
| 44139.10175925926 | 38.173 |
| 44139.143425925926 | 37.709 |
| 44139.18509259259 | 37.323 |
| 44139.22675925926 | 36.937 |
| 44139.268425925926 | 36.705 |
| 44139.31009259259 | 36.474 |
| 44139.35175925926 | 36.628 |
| 44139.393425925926 | 37.787 |
| 44139.43509259259 | 39.331 |
| 44139.47675925926 | 41.339 |
| 44139.518425925926 | 43.501 |
| 44139.56009259259 | 45.123 |
| 44139.60175925926 | 45.431 |
| 44139.643425925926 | 45.431 |
| 44139.68509259259 | 45.2 |
| 44139.72675925926 | 44.505 |
| 44139.768425925926 | 43.887 |
| 44139.81009259259 | 43.346 |
| 44139.85175925926 | 42.729 |
| 44139.893425925926 | 42.188 |
| 44139.93509259259 | 41.339 |
| 44139.97675925926 | 40.567 |
| 44140.018425925926 | 39.872 |
| 44140.06009259259 | 39.177 |
| 44140.10175925926 | 38.559 |
| 44140.143425925926 | 38.018 |
| 44140.18509259259 | 37.632 |
| 44140.22675925926 | 37.323 |
| 44140.268425925926 | 37.014 |
| 44140.31009259259 | 36.783 |
| 44140.35175925926 | 36.86 |
| 44140.393425925926 | 37.941 |
| 44140.43509259259 | 39.563 |
| 44140.47675925926 | 41.493 |
| 44140.518425925926 | 43.424 |
| 44140.56009259259 | 45.123 |
| 44140.60175925926 | 45.895 |
| 44140.643425925926 | 45.895 |
| 44140.68509259259 | 45.2 |
| 44140.72675925926 | 44.505 |
| 44140.768425925926 | 43.964 |
| 44140.81009259259 | 43.192 |
| 44140.85175925926 | 42.497 |
| 44140.893425925926 | 42.034 |
| 44140.93509259259 | 41.184 |
| 44140.97675925926 | 40.412 |
| 44141.018425925926 | 39.64 |
| 44141.06009259259 | 38.868 |
| 44141.10175925926 | 38.25 |
| 44141.143425925926 | 37.787 |
| 44141.18509259259 | 37.246 |
| 44141.22675925926 | 36.937 |
| 44141.268425925926 | 36.705 |
| 44141.31009259259 | 36.551 |
| 44141.35175925926 | 36.705 |
| 44141.393425925926 | 37.632 |
| 44141.43509259259 | 38.79 |
| 44141.47675925926 | 40.18 |
| 44141.518425925926 | 41.416 |
| 44141.56009259259 | 42.188 |
| 44141.60175925926 | 42.96 |
| 44141.643425925926 | 43.192 |
| 44141.68509259259 | 43.269 |
| 44141.72675925926 | 43.038 |
| 44141.768425925926 | 42.729 |
| 44141.81009259259 | 42.265 |
| 44141.85175925926 | 41.956 |
| 44141.893425925926 | 41.648 |
| 44141.93509259259 | 41.107 |
| 44141.97675925926 | 40.567 |
| 44142.018425925926 | 40.103 |
| 44142.06009259259 | 39.717 |
| 44142.10175925926 | 39.331 |
| 44142.143425925926 | 38.945 |
| 44142.18509259259 | 38.636 |
| 44142.22675925926 | 38.327 |
| 44142.268425925926 | 38.018 |
| 44142.31009259259 | 37.787 |
| 44142.35175925926 | 38.018 |
| 44142.393425925926 | 38.945 |
| 44142.43509259259 | 40.567 |
| 44142.47675925926 | 41.879 |
| 44142.518425925926 | 43.115 |
| 44142.56009259259 | 43.346 |
| 44142.60175925926 | 43.733 |
| 44142.643425925926 | 44.119 |
| 44142.68509259259 | 43.887 |
| 44142.72675925926 | 43.733 |
| 44142.768425925926 | 43.424 |
| 44142.81009259259 | 43.192 |
| 44142.85175925926 | 42.883 |
| 44142.893425925926 | 42.42 |
| 44142.93509259259 | 42.188 |
| 44142.97675925926 | 41.879 |
| 44143.018425925926 | 41.57 |
| 44143.06009259259 | 41.339 |
| 44143.10175925926 | 40.18 |
| 44143.143425925926 | 39.408 |
| 44143.18509259259 | 38.945 |
| 44143.22675925926 | 38.713 |
| 44143.268425925926 | 38.25 |
| 44143.31009259259 | 38.095 |
| 44143.35175925926 | 38.173 |
| 44143.393425925926 | 38.559 |
| 44143.43509259259 | 39.64 |
| 44143.47675925926 | 40.953 |
| 44143.518425925926 | 42.343 |
| 44143.56009259259 | 43.192 |
| 44143.60175925926 | 43.887 |
| 44143.643425925926 | 43.655 |
| 44143.68509259259 | 43.115 |
| 44143.72675925926 | 42.497 |
| 44143.768425925926 | 41.802 |
| 44143.81009259259 | 40.953 |
| 44143.85175925926 | 40.567 |
| 44143.893425925926 | 40.18 |
| 44143.93509259259 | 39.794 |
| 44143.97675925926 | 39.177 |
| 44144.018425925926 | 38.713 |
| 44144.06009259259 | 38.25 |
| 44144.10175925926 | 37.632 |
| 44144.143425925926 | 37.169 |
| 44144.18509259259 | 36.783 |
| 44144.22675925926 | 36.474 |
| 44144.268425925926 | 36.242 |
| 44144.31009259259 | 36.01 |
| 44144.35175925926 | 36.242 |
| 44144.393425925926 | 36.474 |
| 44144.43509259259 | 36.783 |
| 44144.47675925926 | 37.555 |
| 44144.518425925926 | 38.713 |
| 44144.56009259259 | 38.79 |
| 44144.60175925926 | 39.099 |
| 44144.643425925926 | 39.022 |
| 44144.68509259259 | 38.79 |
| 44144.72675925926 | 38.482 |
| 44144.768425925926 | 38.25 |
| 44144.81009259259 | 37.709 |
| 44144.85175925926 | 37.4 |
| 44144.893425925926 | 36.937 |
| 44144.93509259259 | 36.551 |
| 44144.97675925926 | 36.242 |
| 44145.018425925926 | 36.01 |
| 44145.06009259259 | 35.702 |
| 44145.10175925926 | 35.547 |
| 44145.143425925926 | 35.315 |
| 44145.18509259259 | 35.084 |
| 44145.22675925926 | 35.084 |
| 44145.268425925926 | 34.775 |
| 44145.31009259259 | 34.466 |
| 44145.35175925926 | 34.775 |
| 44145.393425925926 | 35.315 |
| 44145.43509259259 | 36.474 |
| 44145.47675925926 | 37.478 |
| 44145.518425925926 | 38.404 |
| 44145.56009259259 | 39.794 |
| 44145.60175925926 | 40.489 |
| 44145.643425925926 | 40.103 |
| 44145.68509259259 | 39.099 |
| 44145.72675925926 | 38.713 |
| 44145.768425925926 | 38.25 |
| 44145.81009259259 | 37.864 |
| 44145.85175925926 | 37.092 |
| 44145.893425925926 | 36.551 |
| 44145.93509259259 | 36.165 |
| 44145.97675925926 | 35.702 |
| 44146.018425925926 | 35.161 |
| 44146.06009259259 | 34.621 |
| 44146.10175925926 | 33.771 |
| 44146.143425925926 | 33.076 |
| 44146.18509259259 | 32.613 |
| 44146.22675925926 | 32.304 |
| 44146.268425925926 | 32.304 |
| 44146.31009259259 | 32.304 |
| 44146.35175925926 | 32.227 |
| 44146.393425925926 | 32.304 |
| 44146.43509259259 | 34.08 |
| 44146.47675925926 | 35.702 |
| 44146.518425925926 | 37.4 |
| 44146.56009259259 | 38.868 |
| 44146.60175925926 | 39.794 |
| 44146.643425925926 | 39.717 |
| 44146.68509259259 | 38.945 |
| 44146.72675925926 | 38.559 |
| 44146.768425925926 | 38.018 |
| 44146.81009259259 | 37.555 |
| 44146.85175925926 | 37.323 |
| 44146.893425925926 | 37.169 |
| 44146.93509259259 | 36.783 |
| 44146.97675925926 | 36.242 |
| 44147.018425925926 | 35.933 |
| 44147.06009259259 | 35.547 |
| 44147.10175925926 | 35.238 |
| 44147.143425925926 | 34.929 |
| 44147.18509259259 | 34.389 |
| 44147.22675925926 | 34.003 |
| 44147.268425925926 | 33.848 |
| 44147.31009259259 | 33.771 |
| 44147.35175925926 | 33.694 |
| 44147.393425925926 | 34.08 |
| 44147.43509259259 | 34.852 |
| 44147.47675925926 | 36.165 |
| 44147.518425925926 | 38.095 |
| 44147.56009259259 | 39.485 |
| 44147.60175925926 | 39.949 |
| 44147.643425925926 | 39.64 |
| 44147.68509259259 | 38.945 |
| 44147.72675925926 | 38.173 |
| 44147.768425925926 | 37.246 |
| 44147.81009259259 | 36.628 |
| 44147.85175925926 | 36.088 |
| 44147.893425925926 | 35.47 |
| 44147.93509259259 | 34.775 |
| 44147.97675925926 | 34.157 |
| 44148.018425925926 | 33.308 |
| 44148.06009259259 | 32.767 |
| 44148.10175925926 | 32.149 |
| 44148.143425925926 | 32.304 |
| 44148.18509259259 | 32.227 |
| 44148.22675925926 | 32.227 |
| 44148.268425925926 | 32.227 |
| 44148.31009259259 | 32.227 |
| 44148.35175925926 | 32.304 |
| 44148.393425925926 | 32.304 |
| 44148.43509259259 | 32.227 |
| 44148.47675925926 | 33.462 |
| 44148.518425925926 | 35.933 |
| 44148.56009259259 | 37.864 |
| 44148.60175925926 | 39.022 |
| 44148.643425925926 | 39.563 |
| 44148.68509259259 | 39.254 |
| 44148.72675925926 | 39.099 |
| 44148.768425925926 | 38.636 |
| 44148.81009259259 | 38.25 |
| 44148.85175925926 | 38.018 |
| 44148.893425925926 | 37.864 |
| 44148.93509259259 | 37.632 |
| 44148.97675925926 | 37.4 |
| 44149.018425925926 | 37.092 |
| 44149.06009259259 | 36.86 |
| 44149.10175925926 | 36.705 |
| 44149.143425925926 | 36.474 |
| 44149.18509259259 | 36.397 |
| 44149.22675925926 | 36.242 |
| 44149.268425925926 | 36.01 |
| 44149.31009259259 | 35.624 |
| 44149.35175925926 | 34.157 |
| 44149.393425925926 | 33.539 |
| 44149.43509259259 | 33.385 |
| 44149.47675925926 | 32.536 |
| 44149.518425925926 | 32.613 |
| 44149.56009259259 | 33.153 |
| 44149.60175925926 | 33.308 |
| 44149.643425925926 | 32.613 |
| 44149.68509259259 | 32.304 |
| 44149.72675925926 | 32.304 |
| 44149.768425925926 | 32.381 |
| 44149.81009259259 | 32.381 |
| 44149.85175925926 | 32.381 |
| 44149.893425925926 | 32.304 |
| 44149.93509259259 | 32.304 |
| 44149.97675925926 | 32.304 |
| 44150.018425925926 | 32.304 |
| 44150.06009259259 | 32.381 |
| 44150.10175925926 | 32.304 |
| 44150.143425925926 | 32.227 |
| 44150.18509259259 | 32.227 |
| 44150.22675925926 | 32.227 |
| 44150.268425925926 | 32.227 |
| 44150.31009259259 | 32.304 |
| 44150.35175925926 | 32.304 |
| 44150.393425925926 | 32.381 |
| 44150.43509259259 | 32.304 |
| 44150.47675925926 | 32.304 |
| 44150.518425925926 | 32.613 |
| 44150.56009259259 | 34.312 |
| 44150.60175925926 | 36.551 |
| 44150.643425925926 | 37.864 |
| 44150.68509259259 | 38.482 |
| 44150.72675925926 | 38.79 |
| 44150.768425925926 | 38.945 |
| 44150.81009259259 | 39.022 |
| 44150.85175925926 | 39.099 |
| 44150.893425925926 | 39.099 |
| 44150.93509259259 | 39.022 |
| 44150.97675925926 | 38.79 |
| 44151.018425925926 | 38.482 |
| 44151.06009259259 | 37.941 |
| 44151.10175925926 | 37.555 |
| 44151.143425925926 | 37.4 |
| 44151.18509259259 | 37.169 |
| 44151.22675925926 | 37.092 |
| 44151.268425925926 | 36.937 |
| 44151.31009259259 | 37.014 |
| 44151.35175925926 | 37.092 |
| 44151.393425925926 | 37.709 |
| 44151.43509259259 | 39.022 |
| 44151.47675925926 | 40.335 |
| 44151.518425925926 | 41.956 |
| 44151.56009259259 | 43.115 |
| 44151.60175925926 | 43.655 |
| 44151.643425925926 | 43.424 |
| 44151.68509259259 | 42.651 |
| 44151.72675925926 | 41.802 |
| 44151.768425925926 | 41.107 |
| 44151.81009259259 | 40.567 |
| 44151.85175925926 | 40.026 |
| 44151.893425925926 | 39.408 |
| 44151.93509259259 | 38.636 |
| 44151.97675925926 | 37.941 |
| 44152.018425925926 | 37.246 |
| 44152.06009259259 | 36.551 |
| 44152.10175925926 | 36.01 |
| 44152.143425925926 | 35.393 |
| 44152.18509259259 | 35.007 |
| 44152.22675925926 | 34.775 |
| 44152.268425925926 | 34.466 |
| 44152.31009259259 | 34.312 |
| 44152.35175925926 | 34.234 |
| 44152.393425925926 | 34.929 |
| 44152.43509259259 | 36.319 |
| 44152.47675925926 | 38.018 |
| 44152.518425925926 | 39.949 |
| 44152.56009259259 | 41.57 |
| 44152.60175925926 | 42.497 |
| 44152.643425925926 | 42.42 |
| 44152.68509259259 | 41.879 |
| 44152.72675925926 | 41.184 |
| 44152.768425925926 | 40.489 |
| 44152.81009259259 | 40.103 |
| 44152.85175925926 | 39.717 |
| 44152.893425925926 | 39.177 |
| 44152.93509259259 | 38.713 |
| 44152.97675925926 | 38.095 |
| 44153.018425925926 | 37.555 |
| 44153.06009259259 | 36.937 |
| 44153.10175925926 | 36.628 |
| 44153.143425925926 | 36.319 |
| 44153.18509259259 | 36.088 |
| 44153.22675925926 | 35.933 |
| 44153.268425925926 | 35.856 |
| 44153.31009259259 | 35.779 |
| 44153.35175925926 | 35.856 |
| 44153.393425925926 | 36.397 |
| 44153.43509259259 | 37.478 |
| 44153.47675925926 | 38.868 |
| 44153.518425925926 | 40.644 |
| 44153.56009259259 | 42.343 |
| 44153.60175925926 | 42.96 |
| 44153.643425925926 | 43.038 |
| 44153.68509259259 | 42.651 |
| 44153.72675925926 | 41.956 |
| 44153.768425925926 | 41.416 |
| 44153.81009259259 | 41.03 |
| 44153.85175925926 | 40.567 |
| 44153.893425925926 | 40.18 |
| 44153.93509259259 | 39.64 |
| 44153.97675925926 | 39.254 |
| 44154.018425925926 | 38.713 |
| 44154.06009259259 | 38.25 |
| 44154.10175925926 | 37.864 |
| 44154.143425925926 | 37.632 |
| 44154.18509259259 | 37.4 |
| 44154.22675925926 | 37.323 |
| 44154.268425925926 | 37.246 |
| 44154.31009259259 | 37.169 |
| 44154.35175925926 | 37.246 |
| 44154.393425925926 | 37.941 |
| 44154.43509259259 | 39.254 |
| 44154.47675925926 | 40.567 |
| 44154.518425925926 | 42.111 |
| 44154.56009259259 | 43.346 |
| 44154.60175925926 | 43.887 |
| 44154.643425925926 | 43.578 |
| 44154.68509259259 | 42.806 |
| 44154.72675925926 | 42.034 |
| 44154.768425925926 | 41.261 |
| 44154.81009259259 | 40.567 |
| 44154.85175925926 | 39.949 |
| 44154.893425925926 | 39.485 |
| 44154.93509259259 | 38.79 |
| 44154.97675925926 | 38.095 |
| 44155.018425925926 | 37.246 |
| 44155.06009259259 | 36.705 |
| 44155.10175925926 | 36.088 |
| 44155.143425925926 | 35.779 |
| 44155.18509259259 | 35.624 |
| 44155.22675925926 | 35.47 |
| 44155.268425925926 | 35.47 |
| 44155.31009259259 | 35.315 |
| 44155.35175925926 | 35.47 |
| 44155.393425925926 | 35.933 |
| 44155.43509259259 | 37.092 |
| 44155.47675925926 | 38.713 |
| 44155.518425925926 | 40.335 |
| 44155.56009259259 | 41.261 |
| 44155.60175925926 | 41.648 |
| 44155.643425925926 | 41.879 |
| 44155.68509259259 | 41.725 |
| 44155.72675925926 | 41.261 |
| 44155.768425925926 | 40.875 |
| 44155.81009259259 | 40.489 |
| 44155.85175925926 | 40.335 |
| 44155.893425925926 | 39.949 |
| 44155.93509259259 | 39.331 |
| 44155.97675925926 | 38.79 |
| 44156.018425925926 | 38.327 |
| 44156.06009259259 | 37.941 |
| 44156.10175925926 | 37.787 |
| 44156.143425925926 | 37.478 |
| 44156.18509259259 | 37.323 |
| 44156.22675925926 | 37.246 |
| 44156.268425925926 | 37.169 |
| 44156.31009259259 | 37.169 |
| 44156.35175925926 | 37.323 |
| 44156.393425925926 | 37.632 |
| 44156.43509259259 | 38.095 |
| 44156.47675925926 | 38.713 |
| 44156.518425925926 | 39.64 |
| 44156.56009259259 | 40.103 |
| 44156.60175925926 | 41.03 |
| 44156.643425925926 | 41.648 |
| 44156.68509259259 | 41.57 |
| 44156.72675925926 | 41.261 |
| 44156.768425925926 | 40.489 |
| 44156.81009259259 | 39.794 |
| 44156.85175925926 | 39.177 |
| 44156.893425925926 | 38.559 |
| 44156.93509259259 | 37.864 |
| 44156.97675925926 | 36.937 |
| 44157.018425925926 | 36.088 |
| 44157.06009259259 | 35.238 |
| 44157.10175925926 | 34.543 |
| 44157.143425925926 | 34.003 |
| 44157.18509259259 | 33.462 |
| 44157.22675925926 | 32.922 |
| 44157.268425925926 | 32.536 |
| 44157.31009259259 | 32.149 |
| 44157.35175925926 | 32.072 |
| 44157.393425925926 | 32.536 |
| 44157.43509259259 | 33.617 |
| 44157.47675925926 | 35.007 |
| 44157.518425925926 | 36.474 |
| 44157.56009259259 | 37.787 |
| 44157.60175925926 | 38.559 |
| 44157.643425925926 | 38.713 |
| 44157.68509259259 | 38.482 |
| 44157.72675925926 | 38.018 |
| 44157.768425925926 | 37.632 |
| 44157.81009259259 | 37.478 |
| 44157.85175925926 | 37.555 |
| 44157.893425925926 | 37.632 |
| 44157.93509259259 | 37.555 |
| 44157.97675925926 | 37.4 |
| 44158.018425925926 | 37.092 |
| 44158.06009259259 | 36.705 |
| 44158.10175925926 | 36.319 |
| 44158.143425925926 | 36.088 |
| 44158.18509259259 | 36.01 |
| 44158.22675925926 | 36.165 |
| 44158.268425925926 | 36.165 |
| 44158.31009259259 | 36.01 |
| 44158.35175925926 | 36.165 |
| 44158.393425925926 | 36.783 |
| 44158.43509259259 | 38.173 |
| 44158.47675925926 | 39.717 |
| 44158.518425925926 | 41.184 |
| 44158.56009259259 | 41.956 |
| 44158.60175925926 | 42.42 |
| 44158.643425925926 | 41.956 |
| 44158.68509259259 | 41.493 |
| 44158.72675925926 | 40.798 |
| 44158.768425925926 | 40.567 |
| 44158.81009259259 | 40.489 |
| 44158.85175925926 | 40.18 |
| 44158.893425925926 | 39.872 |
| 44158.93509259259 | 39.331 |
| 44158.97675925926 | 38.713 |
| 44159.018425925926 | 38.404 |
| 44159.06009259259 | 38.095 |
| 44159.10175925926 | 37.4 |
| 44159.143425925926 | 36.319 |
| 44159.18509259259 | 35.393 |
| 44159.22675925926 | 34.389 |
| 44159.268425925926 | 33.385 |
| 44159.31009259259 | 32.999 |
| 44159.35175925926 | 32.844 |
| 44159.393425925926 | 32.999 |
| 44159.43509259259 | 33.539 |
| 44159.47675925926 | 34.621 |
| 44159.518425925926 | 35.933 |
| 44159.56009259259 | 37.092 |
| 44159.60175925926 | 37.555 |
| 44159.643425925926 | 37.555 |
| 44159.68509259259 | 37.014 |
| 44159.72675925926 | 36.551 |
| 44159.768425925926 | 36.397 |
| 44159.81009259259 | 36.242 |
| 44159.85175925926 | 36.088 |
| 44159.893425925926 | 35.856 |
| 44159.93509259259 | 35.547 |
| 44159.97675925926 | 35.007 |
| 44160.018425925926 | 34.312 |
| 44160.06009259259 | 33.539 |
| 44160.10175925926 | 32.999 |
| 44160.143425925926 | 32.381 |
| 44160.18509259259 | 32.149 |
| 44160.22675925926 | 32.227 |
| 44160.268425925926 | 32.304 |
| 44160.31009259259 | 32.227 |
| 44160.35175925926 | 32.227 |
| 44160.393425925926 | 32.227 |
| 44160.43509259259 | 32.149 |
| 44160.47675925926 | 32.999 |
| 44160.518425925926 | 34.157 |
| 44160.56009259259 | 36.01 |
| 44160.60175925926 | 37.169 |
| 44160.643425925926 | 37.4 |
| 44160.68509259259 | 37.014 |
| 44160.72675925926 | 36.783 |
| 44160.768425925926 | 36.397 |
| 44160.81009259259 | 36.01 |
| 44160.85175925926 | 35.702 |
| 44160.893425925926 | 35.238 |
| 44160.93509259259 | 34.698 |
| 44160.97675925926 | 34.003 |
| 44161.018425925926 | 33.462 |
| 44161.06009259259 | 32.767 |
| 44161.10175925926 | 32.304 |
| 44161.143425925926 | 32.149 |
| 44161.18509259259 | 32.227 |
| 44161.22675925926 | 32.227 |
| 44161.268425925926 | 32.227 |
| 44161.31009259259 | 32.227 |
| 44161.35175925926 | 32.304 |
| 44161.393425925926 | 32.304 |
| 44161.43509259259 | 32.227 |
| 44161.47675925926 | 32.922 |
| 44161.518425925926 | 34.389 |
| 44161.56009259259 | 35.856 |
| 44161.60175925926 | 36.705 |
| 44161.643425925926 | 36.783 |
| 44161.68509259259 | 36.783 |
| 44161.72675925926 | 36.474 |
| 44161.768425925926 | 36.088 |
| 44161.81009259259 | 35.624 |
| 44161.85175925926 | 35.161 |
| 44161.893425925926 | 34.852 |
| 44161.93509259259 | 34.621 |
| 44161.97675925926 | 34.003 |
| 44162.018425925926 | 33.462 |
| 44162.06009259259 | 32.999 |
| 44162.10175925926 | 32.613 |
| 44162.143425925926 | 32.149 |
| 44162.18509259259 | 32.149 |
| 44162.22675925926 | 32.227 |
| 44162.268425925926 | 32.227 |
| 44162.31009259259 | 32.304 |
| 44162.35175925926 | 32.227 |
| 44162.393425925926 | 32.227 |
| 44162.43509259259 | 32.227 |
| 44162.47675925926 | 32.458 |
| 44162.518425925926 | 33.076 |
| 44162.56009259259 | 34.389 |
| 44162.60175925926 | 35.624 |
| 44162.643425925926 | 35.702 |
| 44162.68509259259 | 35.624 |
| 44162.72675925926 | 35.161 |
| 44162.768425925926 | 34.621 |
| 44162.81009259259 | 34.312 |
| 44162.85175925926 | 33.848 |
| 44162.893425925926 | 33.462 |
| 44162.93509259259 | 32.922 |
| 44162.97675925926 | 32.304 |
| 44163.018425925926 | 32.149 |
| 44163.06009259259 | 32.149 |
| 44163.10175925926 | 32.227 |
| 44163.143425925926 | 32.227 |
| 44163.18509259259 | 32.227 |
| 44163.22675925926 | 32.227 |
| 44163.268425925926 | 32.227 |
| 44163.31009259259 | 32.227 |
| 44163.35175925926 | 32.304 |
| 44163.393425925926 | 32.304 |
| 44163.43509259259 | 32.227 |
| 44163.47675925926 | 32.149 |
| 44163.518425925926 | 32.613 |
| 44163.56009259259 | 33.153 |
| 44163.60175925926 | 33.539 |
| 44163.643425925926 | 34.389 |
| 44163.68509259259 | 35.007 |
| 44163.72675925926 | 35.007 |
| 44163.768425925926 | 34.852 |
| 44163.81009259259 | 34.621 |
| 44163.85175925926 | 34.466 |
| 44163.893425925926 | 34.08 |
| 44163.93509259259 | 33.539 |
| 44163.97675925926 | 32.922 |
| 44164.018425925926 | 32.381 |
| 44164.06009259259 | 32.149 |
| 44164.10175925926 | 32.149 |
| 44164.143425925926 | 32.227 |
| 44164.18509259259 | 32.227 |
| 44164.22675925926 | 32.227 |
| 44164.268425925926 | 32.227 |
| 44164.31009259259 | 32.227 |
| 44164.35175925926 | 32.227 |
| 44164.393425925926 | 32.304 |
| 44164.43509259259 | 32.227 |
| 44164.47675925926 | 32.227 |
| 44164.518425925926 | 32.69 |
| 44164.56009259259 | 33.153 |
| 44164.60175925926 | 34.003 |
| 44164.643425925926 | 34.775 |
| 44164.68509259259 | 35.007 |
| 44164.72675925926 | 34.929 |
| 44164.768425925926 | 34.543 |
| 44164.81009259259 | 34.234 |
| 44164.85175925926 | 33.771 |
| 44164.893425925926 | 33.308 |
| 44164.93509259259 | 32.844 |
| 44164.97675925926 | 32.149 |
| 44165.018425925926 | 32.149 |
| 44165.06009259259 | 32.149 |
| 44165.10175925926 | 32.304 |
| 44165.143425925926 | 32.304 |
| 44165.18509259259 | 32.149 |
| 44165.22675925926 | 32.227 |
| 44165.268425925926 | 32.227 |
| 44165.31009259259 | 32.227 |
| 44165.35175925926 | 32.304 |
| 44165.393425925926 | 32.304 |
| 44165.43509259259 | 32.227 |
| 44165.47675925926 | 32.304 |
| 44165.518425925926 | 32.304 |
| 44165.56009259259 | 32.613 |
| 44165.60175925926 | 32.767 |
| 44165.643425925926 | 32.69 |
| 44165.68509259259 | 32.999 |
| 44165.72675925926 | 33.385 |
| 44165.768425925926 | 33.385 |
| 44165.81009259259 | 33.462 |
| 44165.85175925926 | 33.385 |
| 44165.893425925926 | 33.076 |
| 44165.93509259259 | 32.767 |
| 44165.97675925926 | 32.304 |
| 44166.018425925926 | 32.149 |
| 44166.06009259259 | 32.227 |
| 44166.10175925926 | 32.227 |
| 44166.143425925926 | 32.227 |
| 44166.18509259259 | 32.304 |
| 44166.22675925926 | 32.381 |
| 44166.268425925926 | 32.304 |
| 44166.31009259259 | 32.149 |
| 44166.35175925926 | 32.227 |
| 44166.393425925926 | 32.227 |
| 44166.43509259259 | 32.304 |
| 44166.47675925926 | 32.227 |
| 44166.518425925926 | 32.613 |
| 44166.56009259259 | 34.389 |
| 44166.60175925926 | 35.084 |
| 44166.643425925926 | 35.238 |
| 44166.68509259259 | 35.084 |
| 44166.72675925926 | 34.775 |
| 44166.768425925926 | 34.389 |
| 44166.81009259259 | 34.234 |
| 44166.85175925926 | 34.003 |
| 44166.893425925926 | 33.771 |
| 44166.93509259259 | 33.539 |
| 44166.97675925926 | 33.076 |
| 44167.018425925926 | 32.613 |
| 44167.06009259259 | 32.381 |
| 44167.10175925926 | 32.227 |
| 44167.143425925926 | 32.149 |
| 44167.18509259259 | 32.227 |
| 44167.22675925926 | 32.227 |
| 44167.268425925926 | 32.149 |
| 44167.31009259259 | 32.227 |
| 44167.35175925926 | 32.227 |
| 44167.393425925926 | 32.227 |
| 44167.43509259259 | 32.149 |
| 44167.47675925926 | 32.304 |
| 44167.518425925926 | 32.922 |
| 44167.56009259259 | 33.539 |
| 44167.60175925926 | 34.157 |
| 44167.643425925926 | 34.157 |
| 44167.68509259259 | 33.848 |
| 44167.72675925926 | 33.308 |
| 44167.768425925926 | 32.613 |
| 44167.81009259259 | 32.227 |
| 44167.85175925926 | 32.227 |
| 44167.893425925926 | 32.149 |
| 44167.93509259259 | 32.227 |
| 44167.97675925926 | 32.227 |
| 44168.018425925926 | 32.149 |
| 44168.06009259259 | 32.227 |
| 44168.10175925926 | 32.227 |
| 44168.143425925926 | 32.227 |
| 44168.18509259259 | 32.227 |
| 44168.22675925926 | 32.227 |
| 44168.268425925926 | 32.227 |
| 44168.31009259259 | 32.149 |
| 44168.35175925926 | 32.227 |
| 44168.393425925926 | 32.227 |
| 44168.43509259259 | 32.149 |
| 44168.47675925926 | 32.227 |
| 44168.518425925926 | 32.149 |
| 44168.56009259259 | 32.304 |
| 44168.60175925926 | 32.304 |
| 44168.643425925926 | 32.149 |
| 44168.68509259259 | 32.149 |
| 44168.72675925926 | 32.227 |
| 44168.768425925926 | 32.227 |
| 44168.81009259259 | 32.149 |
| 44168.85175925926 | 32.149 |
| 44168.893425925926 | 32.227 |
| 44168.93509259259 | 32.149 |
| 44168.97675925926 | 32.227 |
| 44169.018425925926 | 32.304 |
| 44169.06009259259 | 32.227 |
| 44169.10175925926 | 32.227 |
| 44169.143425925926 | 32.227 |
| 44169.18509259259 | 32.304 |
| 44169.22675925926 | 32.149 |
| 44169.268425925926 | 32.227 |
| 44169.31009259259 | 32.149 |
| 44169.35175925926 | 32.227 |
| 44169.393425925926 | 32.227 |
| 44169.43509259259 | 32.304 |
| 44169.47675925926 | 32.227 |
| 44169.518425925926 | 32.227 |
| 44169.56009259259 | 32.149 |
| 44169.60175925926 | 32.227 |
| 44169.643425925926 | 32.227 |
| 44169.68509259259 | 32.227 |
| 44169.72675925926 | 32.227 |
| 44169.768425925926 | 32.227 |
| 44169.81009259259 | 32.227 |
| 44169.85175925926 | 32.227 |
| 44169.893425925926 | 32.304 |
| 44169.93509259259 | 32.304 |
| 44169.97675925926 | 32.227 |
| 44170.018425925926 | 32.149 |
| 44170.06009259259 | 32.149 |
| 44170.10175925926 | 32.227 |
| 44170.143425925926 | 32.072 |
| 44170.18509259259 | 32.227 |
| 44170.22675925926 | 32.227 |
| 44170.268425925926 | 32.227 |
| 44170.31009259259 | 32.227 |
| 44170.35175925926 | 32.304 |
| 44170.393425925926 | 32.227 |
| 44170.43509259259 | 32.227 |
| 44170.47675925926 | 32.227 |
| 44170.518425925926 | 32.304 |
| 44170.56009259259 | 32.381 |
| 44170.60175925926 | 32.767 |
| 44170.643425925926 | 33.231 |
| 44170.68509259259 | 33.617 |
| 44170.72675925926 | 33.694 |
| 44170.768425925926 | 33.694 |
| 44170.81009259259 | 33.771 |
| 44170.85175925926 | 33.539 |
| 44170.893425925926 | 33.462 |
| 44170.93509259259 | 33.076 |
| 44170.97675925926 | 32.767 |
| 44171.018425925926 | 32.304 |
| 44171.06009259259 | 32.227 |
| 44171.10175925926 | 32.227 |
| 44171.143425925926 | 32.227 |
| 44171.18509259259 | 32.227 |
| 44171.22675925926 | 32.149 |
| 44171.268425925926 | 32.227 |
| 44171.31009259259 | 32.227 |
| 44171.35175925926 | 32.149 |
| 44171.393425925926 | 32.304 |
| 44171.43509259259 | 32.149 |
| 44171.47675925926 | 32.227 |
| 44171.518425925926 | 32.381 |
| 44171.56009259259 | 32.922 |
| 44171.60175925926 | 33.231 |
| 44171.643425925926 | 33.771 |
| 44171.68509259259 | 34.312 |
| 44171.72675925926 | 34.466 |
| 44171.768425925926 | 34.312 |
| 44171.81009259259 | 34.157 |
| 44171.85175925926 | 33.926 |
| 44171.893425925926 | 33.694 |
| 44171.93509259259 | 33.231 |
| 44171.97675925926 | 32.767 |
| 44172.018425925926 | 32.381 |
| 44172.06009259259 | 32.149 |
| 44172.10175925926 | 32.227 |
| 44172.143425925926 | 32.149 |
| 44172.18509259259 | 32.227 |
| 44172.22675925926 | 32.149 |
| 44172.268425925926 | 32.227 |
| 44172.31009259259 | 32.149 |
| 44172.35175925926 | 32.304 |
| 44172.393425925926 | 32.304 |
| 44172.43509259259 | 32.227 |
| 44172.47675925926 | 32.149 |
| 44172.518425925926 | 32.381 |
| 44172.56009259259 | 32.69 |
| 44172.60175925926 | 33.076 |
| 44172.643425925926 | 33.694 |
| 44172.68509259259 | 34.157 |
| 44172.72675925926 | 34.389 |
| 44172.768425925926 | 34.157 |
| 44172.81009259259 | 33.848 |
| 44172.85175925926 | 33.694 |
| 44172.893425925926 | 33.385 |
| 44172.93509259259 | 33.076 |
| 44172.97675925926 | 32.458 |
| 44173.018425925926 | 32.227 |
| 44173.06009259259 | 32.227 |
| 44173.10175925926 | 32.227 |
| 44173.143425925926 | 32.227 |
| 44173.18509259259 | 32.227 |
| 44173.22675925926 | 32.149 |
| 44173.268425925926 | 32.149 |
| 44173.31009259259 | 32.227 |
| 44173.35175925926 | 32.227 |
| 44173.393425925926 | 32.149 |
| 44173.43509259259 | 32.227 |
| 44173.47675925926 | 32.227 |
| 44173.518425925926 | 32.458 |
| 44173.56009259259 | 32.69 |
| 44173.60175925926 | 32.922 |
| 44173.643425925926 | 32.767 |
| 44173.68509259259 | 33.153 |
| 44173.72675925926 | 33.617 |
| 44173.768425925926 | 33.694 |
| 44173.81009259259 | 33.694 |
| 44173.85175925926 | 33.385 |
| 44173.893425925926 | 33.076 |
| 44173.93509259259 | 32.767 |
| 44173.97675925926 | 32.381 |
| 44174.018425925926 | 32.149 |
| 44174.06009259259 | 32.149 |
| 44174.10175925926 | 32.227 |
| 44174.143425925926 | 32.227 |
| 44174.18509259259 | 32.149 |
| 44174.22675925926 | 32.227 |
| 44174.268425925926 | 32.227 |
| 44174.31009259259 | 32.304 |
| 44174.35175925926 | 32.227 |
| 44174.393425925926 | 32.227 |
| 44174.43509259259 | 32.304 |
| 44174.47675925926 | 32.304 |
| 44174.518425925926 | 32.304 |
| 44174.56009259259 | 32.536 |
| 44174.60175925926 | 32.767 |
| 44174.643425925926 | 32.458 |
| 44174.68509259259 | 32.536 |
| 44174.72675925926 | 32.922 |
| 44174.768425925926 | 33.231 |
| 44174.81009259259 | 33.462 |
| 44174.85175925926 | 33.385 |
| 44174.893425925926 | 33.231 |
| 44174.93509259259 | 32.844 |
| 44174.97675925926 | 32.613 |
| 44175.018425925926 | 32.149 |
| 44175.06009259259 | 32.149 |
| 44175.10175925926 | 32.227 |
| 44175.143425925926 | 32.227 |
| 44175.18509259259 | 32.072 |
| 44175.22675925926 | 32.227 |
| 44175.268425925926 | 32.227 |
| 44175.31009259259 | 32.227 |
| 44175.35175925926 | 32.227 |
| 44175.393425925926 | 32.149 |
| 44175.43509259259 | 32.149 |
| 44175.47675925926 | 32.227 |
| 44175.518425925926 | 32.149 |
| 44175.56009259259 | 32.304 |
| 44175.60175925926 | 32.304 |
| 44175.643425925926 | 32.999 |
| 44175.68509259259 | 33.694 |
| 44175.72675925926 | 34.157 |
| 44175.768425925926 | 34.312 |
| 44175.81009259259 | 34.389 |
| 44175.85175925926 | 34.466 |
| 44175.893425925926 | 34.312 |
| 44175.93509259259 | 34.08 |
| 44175.97675925926 | 33.926 |
| 44176.018425925926 | 33.848 |
| 44176.06009259259 | 33.539 |
| 44176.10175925926 | 33.539 |
| 44176.143425925926 | 33.308 |
| 44176.18509259259 | 33.231 |
| 44176.22675925926 | 33.231 |
| 44176.268425925926 | 33.153 |
| 44176.31009259259 | 33.076 |
| 44176.35175925926 | 33.153 |
| 44176.393425925926 | 33.308 |
| 44176.43509259259 | 33.385 |
| 44176.47675925926 | 33.694 |
| 44176.518425925926 | 33.926 |
| 44176.56009259259 | 34.08 |
| 44176.60175925926 | 34.08 |
| 44176.643425925926 | 33.771 |
| 44176.68509259259 | 33.617 |
| 44176.72675925926 | 33.462 |
| 44176.768425925926 | 33.231 |
| 44176.81009259259 | 33.076 |
| 44176.85175925926 | 32.844 |
| 44176.893425925926 | 32.613 |
| 44176.93509259259 | 32.381 |
| 44176.97675925926 | 32.304 |
| 44177.018425925926 | 32.227 |
| 44177.06009259259 | 32.149 |
| 44177.10175925926 | 32.227 |
| 44177.143425925926 | 32.149 |
| 44177.18509259259 | 32.227 |
| 44177.22675925926 | 32.227 |
| 44177.268425925926 | 32.227 |
| 44177.31009259259 | 32.227 |
| 44177.35175925926 | 32.304 |
| 44177.393425925926 | 32.227 |
| 44177.43509259259 | 32.227 |
| 44177.47675925926 | 32.227 |
| 44177.518425925926 | 32.304 |
| 44177.56009259259 | 32.227 |
| 44177.60175925926 | 32.304 |
| 44177.643425925926 | 32.227 |
| 44177.68509259259 | 32.304 |
| 44177.72675925926 | 32.458 |
| 44177.768425925926 | 32.458 |
| 44177.81009259259 | 32.458 |
| 44177.85175925926 | 32.458 |
| 44177.893425925926 | 32.304 |
| 44177.93509259259 | 32.227 |
| 44177.97675925926 | 32.227 |
| 44178.018425925926 | 32.227 |
| 44178.06009259259 | 32.227 |
| 44178.10175925926 | 32.304 |
| 44178.143425925926 | 32.227 |
| 44178.18509259259 | 32.227 |
| 44178.22675925926 | 32.227 |
| 44178.268425925926 | 32.227 |
| 44178.31009259259 | 32.304 |
| 44178.35175925926 | 32.227 |
| 44178.393425925926 | 32.227 |
| 44178.43509259259 | 32.227 |
| 44178.47675925926 | 32.227 |
| 44178.518425925926 | 32.227 |
| 44178.56009259259 | 32.227 |
| 44178.60175925926 | 32.304 |
| 44178.643425925926 | 32.149 |
| 44178.68509259259 | 32.149 |
| 44178.72675925926 | 32.072 |
| 44178.768425925926 | 32.227 |
| 44178.81009259259 | 32.227 |
| 44178.85175925926 | 32.227 |
| 44178.893425925926 | 32.227 |
| 44178.93509259259 | 32.227 |
| 44178.97675925926 | 32.227 |
| 44179.018425925926 | 32.227 |
| 44179.06009259259 | 32.304 |
| 44179.10175925926 | 32.227 |
| 44179.143425925926 | 32.227 |
| 44179.18509259259 | 32.227 |
| 44179.22675925926 | 32.227 |
| 44179.268425925926 | 32.227 |
| 44179.31009259259 | 32.304 |
| 44179.35175925926 | 32.304 |
| 44179.393425925926 | 32.227 |
| 44179.43509259259 | 32.227 |
| 44179.47675925926 | 32.227 |
| 44179.518425925926 | 32.227 |
| 44179.56009259259 | 32.227 |
| 44179.60175925926 | 32.227 |
| 44179.643425925926 | 32.227 |
| 44179.68509259259 | 32.227 |
| 44179.72675925926 | 32.227 |
| 44179.768425925926 | 32.227 |
| 44179.81009259259 | 32.227 |
| 44179.85175925926 | 32.227 |
| 44179.893425925926 | 32.227 |
| 44179.93509259259 | 32.304 |
| 44179.97675925926 | 32.227 |
| 44180.018425925926 | 32.227 |
| 44180.06009259259 | 32.227 |
| 44180.10175925926 | 32.304 |
| 44180.143425925926 | 32.227 |
| 44180.18509259259 | 32.149 |
| 44180.22675925926 | 32.227 |
| 44180.268425925926 | 32.227 |
| 44180.31009259259 | 32.304 |
| 44180.35175925926 | 32.149 |
| 44180.393425925926 | 32.304 |
| 44180.43509259259 | 32.304 |
| 44180.47675925926 | 32.227 |
| 44180.518425925926 | 32.304 |
| 44180.56009259259 | 32.304 |
| 44180.60175925926 | 32.149 |
| 44180.643425925926 | 32.227 |
| 44180.68509259259 | 32.227 |
| 44180.72675925926 | 32.227 |
| 44180.768425925926 | 32.227 |
| 44180.81009259259 | 32.072 |
| 44180.85175925926 | 32.227 |
| 44180.893425925926 | 32.149 |
| 44180.93509259259 | 32.149 |
| 44180.97675925926 | 32.304 |
| 44181.018425925926 | 32.227 |
| 44181.06009259259 | 32.227 |
| 44181.10175925926 | 32.227 |
| 44181.143425925926 | 32.227 |
| 44181.18509259259 | 32.304 |
| 44181.22675925926 | 32.227 |
| 44181.268425925926 | 32.227 |
| 44181.31009259259 | 32.149 |
| 44181.35175925926 | 32.227 |
| 44181.393425925926 | 32.227 |
| 44181.43509259259 | 32.227 |
| 44181.47675925926 | 32.227 |
| 44181.518425925926 | 32.227 |
| 44181.56009259259 | 32.149 |
| 44181.60175925926 | 32.227 |
| 44181.643425925926 | 32.149 |
| 44181.68509259259 | 32.227 |
| 44181.72675925926 | 32.304 |
| 44181.768425925926 | 32.227 |
| 44181.81009259259 | 32.227 |
| 44181.85175925926 | 32.227 |
| 44181.893425925926 | 32.227 |
| 44181.93509259259 | 32.227 |
| 44181.97675925926 | 32.149 |
| 44182.018425925926 | 32.227 |
| 44182.06009259259 | 32.227 |
| 44182.10175925926 | 32.227 |
| 44182.143425925926 | 32.227 |
| 44182.18509259259 | 32.304 |
| 44182.22675925926 | 32.149 |
| 44182.268425925926 | 32.149 |
| 44182.31009259259 | 32.149 |
| 44182.35175925926 | 32.227 |
| 44182.393425925926 | 32.227 |
| 44182.43509259259 | 32.304 |
| 44182.47675925926 | 32.227 |
| 44182.518425925926 | 32.227 |
| 44182.56009259259 | 32.227 |
| 44182.60175925926 | 32.304 |
| 44182.643425925926 | 32.304 |
| 44182.68509259259 | 32.227 |
| 44182.72675925926 | 32.227 |
| 44182.768425925926 | 32.304 |
| 44182.81009259259 | 32.227 |
| 44182.85175925926 | 32.227 |
| 44182.893425925926 | 32.227 |
| 44182.93509259259 | 32.149 |
| 44182.97675925926 | 32.227 |
| 44183.018425925926 | 32.149 |
| 44183.06009259259 | 32.227 |
| 44183.10175925926 | 32.149 |
| 44183.143425925926 | 32.227 |
| 44183.18509259259 | 32.227 |
| 44183.22675925926 | 32.227 |
| 44183.268425925926 | 32.149 |
| 44183.31009259259 | 32.227 |
| 44183.35175925926 | 32.304 |
| 44183.393425925926 | 32.227 |
| 44183.43509259259 | 32.149 |
| 44183.47675925926 | 32.304 |
| 44183.518425925926 | 32.458 |
| 44183.56009259259 | 32.922 |
| 44183.60175925926 | 33.153 |
| 44183.643425925926 | 33.385 |
| 44183.68509259259 | 33.462 |
| 44183.72675925926 | 33.462 |
| 44183.768425925926 | 33.462 |
| 44183.81009259259 | 33.385 |
| 44183.85175925926 | 33.153 |
| 44183.893425925926 | 32.999 |
| 44183.93509259259 | 32.844 |
| 44183.97675925926 | 32.613 |
| 44184.018425925926 | 32.227 |
| 44184.06009259259 | 32.227 |
| 44184.10175925926 | 32.227 |
| 44184.143425925926 | 32.149 |
| 44184.18509259259 | 32.227 |
| 44184.22675925926 | 32.227 |
| 44184.268425925926 | 32.227 |
| 44184.31009259259 | 32.227 |
| 44184.35175925926 | 32.227 |
| 44184.393425925926 | 32.227 |
| 44184.43509259259 | 32.227 |
| 44184.47675925926 | 32.227 |
| 44184.518425925926 | 32.304 |
| 44184.56009259259 | 32.536 |
| 44184.60175925926 | 32.767 |
| 44184.643425925926 | 32.844 |
| 44184.68509259259 | 32.844 |
| 44184.72675925926 | 32.922 |
| 44184.768425925926 | 33.076 |
| 44184.81009259259 | 33.308 |
| 44184.85175925926 | 33.385 |
| 44184.893425925926 | 33.385 |
| 44184.93509259259 | 33.231 |
| 44184.97675925926 | 33.076 |
| 44185.018425925926 | 32.767 |
| 44185.06009259259 | 32.304 |
| 44185.10175925926 | 32.149 |
| 44185.143425925926 | 32.227 |
| 44185.18509259259 | 32.227 |
| 44185.22675925926 | 32.227 |
| 44185.268425925926 | 32.227 |
| 44185.31009259259 | 32.227 |
| 44185.35175925926 | 32.227 |
| 44185.393425925926 | 32.227 |
| 44185.43509259259 | 32.227 |
| 44185.47675925926 | 32.227 |
| 44185.518425925926 | 32.613 |
| 44185.56009259259 | 32.844 |
| 44185.60175925926 | 33.462 |
| 44185.643425925926 | 34.389 |
| 44185.68509259259 | 34.852 |
| 44185.72675925926 | 34.852 |
| 44185.768425925926 | 34.852 |
| 44185.81009259259 | 34.852 |
| 44185.85175925926 | 35.084 |
| 44185.893425925926 | 35.161 |
| 44185.93509259259 | 35.315 |
| 44185.97675925926 | 35.238 |
| 44186.018425925926 | 35.161 |
| 44186.06009259259 | 34.852 |
| 44186.10175925926 | 34.698 |
| 44186.143425925926 | 34.698 |
| 44186.18509259259 | 34.312 |
| 44186.22675925926 | 34.08 |
| 44186.268425925926 | 33.926 |
| 44186.31009259259 | 33.771 |
| 44186.35175925926 | 33.539 |
| 44186.393425925926 | 34.003 |
| 44186.43509259259 | 35.007 |
| 44186.47675925926 | 35.933 |
| 44186.518425925926 | 36.783 |
| 44186.56009259259 | 37.555 |
| 44186.60175925926 | 37.941 |
| 44186.643425925926 | 38.095 |
| 44186.68509259259 | 37.864 |
| 44186.72675925926 | 37.246 |
| 44186.768425925926 | 36.628 |
| 44186.81009259259 | 36.242 |
| 44186.85175925926 | 35.933 |
| 44186.893425925926 | 35.393 |
| 44186.93509259259 | 34.698 |
| 44186.97675925926 | 34.08 |
| 44187.018425925926 | 33.539 |
| 44187.06009259259 | 33.153 |
| 44187.10175925926 | 32.69 |
| 44187.143425925926 | 32.304 |
| 44187.18509259259 | 32.227 |
| 44187.22675925926 | 32.149 |
| 44187.268425925926 | 32.149 |
| 44187.31009259259 | 32.149 |
| 44187.35175925926 | 32.149 |
| 44187.393425925926 | 32.149 |
| 44187.43509259259 | 32.227 |
| 44187.47675925926 | 32.458 |
| 44187.518425925926 | 33.385 |
| 44187.56009259259 | 34.775 |
| 44187.60175925926 | 35.624 |
| 44187.643425925926 | 35.547 |
| 44187.68509259259 | 35.702 |
| 44187.72675925926 | 35.624 |
| 44187.768425925926 | 35.779 |
| 44187.81009259259 | 34.621 |
| 44187.85175925926 | 33.848 |
| 44187.893425925926 | 32.844 |
| 44187.93509259259 | 32.227 |
| 44187.97675925926 | 32.227 |
| 44188.018425925926 | 32.149 |
| 44188.06009259259 | 32.149 |
| 44188.10175925926 | 32.304 |
| 44188.143425925926 | 32.227 |
| 44188.18509259259 | 32.227 |
| 44188.22675925926 | 32.227 |
| 44188.268425925926 | 32.227 |
| 44188.31009259259 | 32.149 |
| 44188.35175925926 | 32.227 |
| 44188.393425925926 | 32.227 |
| 44188.43509259259 | 32.227 |
| 44188.47675925926 | 32.304 |
| 44188.518425925926 | 32.304 |
| 44188.56009259259 | 32.227 |
| 44188.60175925926 | 32.227 |
| 44188.643425925926 | 32.227 |
| 44188.68509259259 | 32.227 |
| 44188.72675925926 | 32.227 |
| 44188.768425925926 | 32.227 |
| 44188.81009259259 | 32.227 |
| 44188.85175925926 | 32.304 |
| 44188.893425925926 | 32.227 |
| 44188.93509259259 | 32.304 |
| 44188.97675925926 | 32.304 |
| 44189.018425925926 | 32.227 |
| 44189.06009259259 | 32.227 |
| 44189.10175925926 | 32.227 |
| 44189.143425925926 | 32.227 |
| 44189.18509259259 | 32.149 |
| 44189.22675925926 | 32.149 |
| 44189.268425925926 | 32.227 |
| 44189.31009259259 | 32.149 |
| 44189.35175925926 | 32.227 |
| 44189.393425925926 | 32.227 |
| 44189.43509259259 | 32.227 |
| 44189.47675925926 | 32.227 |
| 44189.518425925926 | 32.227 |
| 44189.56009259259 | 32.227 |
| 44189.60175925926 | 32.149 |
| 44189.643425925926 | 32.227 |
| 44189.68509259259 | 32.304 |
| 44189.72675925926 | 32.149 |
| 44189.768425925926 | 32.304 |
| 44189.81009259259 | 32.304 |
| 44189.85175925926 | 32.149 |
| 44189.893425925926 | 32.227 |
| 44189.93509259259 | 32.227 |
| 44189.97675925926 | 32.227 |
| 44190.018425925926 | 32.227 |
| 44190.06009259259 | 32.227 |
| 44190.10175925926 | 32.227 |
| 44190.143425925926 | 32.227 |
| 44190.18509259259 | 32.149 |
| 44190.22675925926 | 32.227 |
| 44190.268425925926 | 32.304 |
| 44190.31009259259 | 32.227 |
| 44190.35175925926 | 32.149 |
| 44190.393425925926 | 32.227 |
| 44190.43509259259 | 32.227 |
| 44190.47675925926 | 32.149 |
| 44190.518425925926 | 32.227 |
| 44190.56009259259 | 32.149 |
| 44190.60175925926 | 32.149 |
| 44190.643425925926 | 32.227 |
| 44190.68509259259 | 32.227 |
| 44190.72675925926 | 32.227 |
| 44190.768425925926 | 32.227 |
| 44190.81009259259 | 32.227 |
| 44190.85175925926 | 32.227 |
| 44190.893425925926 | 32.227 |
| 44190.93509259259 | 32.149 |
| 44190.97675925926 | 32.149 |
| 44191.018425925926 | 32.227 |
| 44191.06009259259 | 32.304 |
| 44191.10175925926 | 32.227 |
| 44191.143425925926 | 32.227 |
| 44191.18509259259 | 32.227 |
| 44191.22675925926 | 32.227 |
| 44191.268425925926 | 32.227 |
| 44191.31009259259 | 32.227 |
| 44191.35175925926 | 32.304 |
| 44191.393425925926 | 32.304 |
| 44191.43509259259 | 32.227 |
| 44191.47675925926 | 32.227 |
| 44191.518425925926 | 32.227 |
| 44191.56009259259 | 32.149 |
| 44191.60175925926 | 32.149 |
| 44191.643425925926 | 32.227 |
| 44191.68509259259 | 32.227 |
| 44191.72675925926 | 32.227 |
| 44191.768425925926 | 32.227 |
| 44191.81009259259 | 32.227 |
| 44191.85175925926 | 32.304 |
| 44191.893425925926 | 32.304 |
| 44191.93509259259 | 32.227 |
| 44191.97675925926 | 32.227 |
| 44192.018425925926 | 32.227 |
| 44192.06009259259 | 32.149 |
| 44192.10175925926 | 32.227 |
| 44192.143425925926 | 32.072 |
| 44192.18509259259 | 32.227 |
| 44192.22675925926 | 32.227 |
| 44192.268425925926 | 32.304 |
| 44192.31009259259 | 32.304 |
| 44192.35175925926 | 32.304 |
| 44192.393425925926 | 32.149 |
| 44192.43509259259 | 32.227 |
| 44192.47675925926 | 32.149 |
| 44192.518425925926 | 32.304 |
| 44192.56009259259 | 32.304 |
| 44192.60175925926 | 32.227 |
| 44192.643425925926 | 32.227 |
| 44192.68509259259 | 32.149 |
| 44192.72675925926 | 32.227 |
| 44192.768425925926 | 32.149 |
| 44192.81009259259 | 32.149 |
| 44192.85175925926 | 32.227 |
| 44192.893425925926 | 32.227 |
| 44192.93509259259 | 32.227 |
| 44192.97675925926 | 32.304 |
| 44193.018425925926 | 32.227 |
| 44193.06009259259 | 32.149 |
| 44193.10175925926 | 32.304 |
| 44193.143425925926 | 32.227 |
| 44193.18509259259 | 32.227 |
| 44193.22675925926 | 32.227 |
| 44193.268425925926 | 32.227 |
| 44193.31009259259 | 32.227 |
| 44193.35175925926 | 32.304 |
| 44193.393425925926 | 32.227 |
| 44193.43509259259 | 32.304 |
| 44193.47675925926 | 32.227 |
| 44193.518425925926 | 32.304 |
| 44193.56009259259 | 32.227 |
| 44193.60175925926 | 32.227 |
| 44193.643425925926 | 32.149 |
| 44193.68509259259 | 32.227 |
| 44193.72675925926 | 32.227 |
| 44193.768425925926 | 32.227 |
| 44193.81009259259 | 32.227 |
| 44193.85175925926 | 32.304 |
| 44193.893425925926 | 32.227 |
| 44193.93509259259 | 32.149 |
| 44193.97675925926 | 32.149 |
| 44194.018425925926 | 32.227 |
| 44194.06009259259 | 32.149 |
| 44194.10175925926 | 32.227 |
| 44194.143425925926 | 32.149 |
| 44194.18509259259 | 32.227 |
| 44194.22675925926 | 32.227 |
| 44194.268425925926 | 32.304 |
| 44194.31009259259 | 32.227 |
| 44194.35175925926 | 32.149 |
| 44194.393425925926 | 32.227 |
| 44194.43509259259 | 32.227 |
| 44194.47675925926 | 32.227 |
| 44194.518425925926 | 32.304 |
| 44194.56009259259 | 32.227 |
| 44194.60175925926 | 32.227 |
| 44194.643425925926 | 32.149 |
| 44194.68509259259 | 32.304 |
| 44194.72675925926 | 32.227 |
| 44194.768425925926 | 32.149 |
| 44194.81009259259 | 32.227 |
| 44194.85175925926 | 32.227 |
| 44194.893425925926 | 32.227 |
| 44194.93509259259 | 32.304 |
| 44194.97675925926 | 32.304 |
| 44195.018425925926 | 32.227 |
| 44195.06009259259 | 32.304 |
| 44195.10175925926 | 32.149 |
| 44195.143425925926 | 32.227 |
| 44195.18509259259 | 32.227 |
| 44195.22675925926 | 32.304 |
| 44195.268425925926 | 32.227 |
| 44195.31009259259 | 32.227 |
| 44195.35175925926 | 32.304 |
| 44195.393425925926 | 32.227 |
| 44195.43509259259 | 32.227 |
| 44195.47675925926 | 32.304 |
| 44195.518425925926 | 32.227 |
| 44195.56009259259 | 32.149 |
| 44195.60175925926 | 32.227 |
| 44195.643425925926 | 32.227 |
| 44195.68509259259 | 32.227 |
| 44195.72675925926 | 32.149 |
| 44195.768425925926 | 32.149 |
| 44195.81009259259 | 32.149 |
| 44195.85175925926 | 32.227 |
| 44195.893425925926 | 32.227 |
| 44195.93509259259 | 32.227 |
| 44195.97675925926 | 32.227 |
| 44196.018425925926 | 32.227 |
| 44196.06009259259 | 32.227 |
| 44196.10175925926 | 32.227 |
| 44196.143425925926 | 32.227 |
| 44196.18509259259 | 32.227 |
| 44196.22675925926 | 32.304 |
| 44196.268425925926 | 32.227 |
| 44196.31009259259 | 32.227 |
| 44196.35175925926 | 32.149 |
| 44196.393425925926 | 32.227 |
| 44196.43509259259 | 32.227 |
| 44196.47675925926 | 32.227 |
| 44196.518425925926 | 32.149 |
| 44196.56009259259 | 32.227 |
| 44196.60175925926 | 32.149 |
| 44196.643425925926 | 32.227 |
| 44196.68509259259 | 32.227 |
| 44196.72675925926 | 32.227 |
| 44196.768425925926 | 32.149 |
| 44196.81009259259 | 32.227 |
| 44196.85175925926 | 32.227 |
| 44196.893425925926 | 32.227 |
| 44196.93509259259 | 32.227 |
| 44196.97675925926 | 32.227 |
| 44197.018425925926 | 32.149 |
| 44197.06009259259 | 32.227 |
| 44197.10175925926 | 32.149 |
| 44197.143425925926 | 32.227 |
| 44197.18509259259 | 32.227 |
| 44197.22675925926 | 32.149 |
| 44197.268425925926 | 32.304 |
| 44197.31009259259 | 32.304 |
| 44197.35175925926 | 32.149 |
| 44197.393425925926 | 32.304 |
| 44197.43509259259 | 32.149 |
| 44197.47675925926 | 32.304 |
| 44197.518425925926 | 32.227 |
| 44197.56009259259 | 32.227 |
| 44197.60175925926 | 32.149 |
| 44197.643425925926 | 32.227 |
| 44197.68509259259 | 32.149 |
| 44197.72675925926 | 32.149 |
| 44197.768425925926 | 32.227 |
| 44197.81009259259 | 32.227 |
| 44197.85175925926 | 32.227 |
| 44197.893425925926 | 32.304 |
| 44197.93509259259 | 32.227 |
| 44197.97675925926 | 32.227 |
| 44198.018425925926 | 32.149 |
| 44198.06009259259 | 32.227 |
| 44198.10175925926 | 32.149 |
| 44198.143425925926 | 32.227 |
| 44198.18509259259 | 32.149 |
| 44198.22675925926 | 32.227 |
| 44198.268425925926 | 32.227 |
| 44198.31009259259 | 32.149 |
| 44198.35175925926 | 32.227 |
| 44198.393425925926 | 32.149 |
| 44198.43509259259 | 32.304 |
| 44198.47675925926 | 32.227 |
| 44198.518425925926 | 32.227 |
| 44198.56009259259 | 32.304 |
| 44198.60175925926 | 32.227 |
| 44198.643425925926 | 32.227 |
| 44198.68509259259 | 32.227 |
| 44198.72675925926 | 32.227 |
| 44198.768425925926 | 32.227 |
| 44198.81009259259 | 32.227 |
| 44198.85175925926 | 32.149 |
| 44198.893425925926 | 32.227 |
| 44198.93509259259 | 32.227 |
| 44198.97675925926 | 32.227 |
| 44199.018425925926 | 32.149 |
| 44199.06009259259 | 32.227 |
| 44199.10175925926 | 32.149 |
| 44199.143425925926 | 32.227 |
| 44199.18509259259 | 32.304 |
| 44199.22675925926 | 32.227 |
| 44199.268425925926 | 32.227 |
| 44199.31009259259 | 32.227 |
| 44199.35175925926 | 32.227 |
| 44199.393425925926 | 32.227 |
| 44199.43509259259 | 32.227 |
| 44199.47675925926 | 32.227 |
| 44199.518425925926 | 32.149 |
| 44199.56009259259 | 32.149 |
| 44199.60175925926 | 32.149 |
| 44199.643425925926 | 32.227 |
| 44199.68509259259 | 32.304 |
| 44199.72675925926 | 32.304 |
| 44199.768425925926 | 32.227 |
| 44199.81009259259 | 32.227 |
| 44199.85175925926 | 32.149 |
| 44199.893425925926 | 32.227 |
| 44199.93509259259 | 32.227 |
| 44199.97675925926 | 32.227 |
| 44200.018425925926 | 32.227 |
| 44200.06009259259 | 32.149 |
| 44200.10175925926 | 32.227 |
| 44200.143425925926 | 32.227 |
| 44200.18509259259 | 32.227 |
| 44200.22675925926 | 32.227 |
| 44200.268425925926 | 32.149 |
| 44200.31009259259 | 32.227 |
| 44200.35175925926 | 32.227 |
| 44200.393425925926 | 32.227 |
| 44200.43509259259 | 32.227 |
| 44200.47675925926 | 32.304 |
| 44200.518425925926 | 32.227 |
| 44200.56009259259 | 32.227 |
| 44200.60175925926 | 32.227 |
| 44200.643425925926 | 32.227 |
| 44200.68509259259 | 32.227 |
| 44200.72675925926 | 32.304 |
| 44200.768425925926 | 32.227 |
| 44200.81009259259 | 32.227 |
| 44200.85175925926 | 32.227 |
| 44200.893425925926 | 32.149 |
| 44200.93509259259 | 32.227 |
| 44200.97675925926 | 32.227 |
| 44201.018425925926 | 32.227 |
| 44201.06009259259 | 32.227 |
| 44201.10175925926 | 32.227 |
| 44201.143425925926 | 32.227 |
| 44201.18509259259 | 32.149 |
| 44201.22675925926 | 32.149 |
| 44201.268425925926 | 32.227 |
| 44201.31009259259 | 32.227 |
| 44201.35175925926 | 32.227 |
| 44201.393425925926 | 32.149 |
| 44201.43509259259 | 32.227 |
| 44201.47675925926 | 32.227 |
| 44201.518425925926 | 32.227 |
| 44201.56009259259 | 32.304 |
| 44201.60175925926 | 32.304 |
| 44201.643425925926 | 32.381 |
| 44201.68509259259 | 32.304 |
| 44201.72675925926 | 32.381 |
| 44201.768425925926 | 32.304 |
| 44201.81009259259 | 32.304 |
| 44201.85175925926 | 32.227 |
| 44201.893425925926 | 32.304 |
| 44201.93509259259 | 32.304 |
| 44201.97675925926 | 32.227 |
| 44202.018425925926 | 32.227 |
| 44202.06009259259 | 32.227 |
| 44202.10175925926 | 32.227 |
| 44202.143425925926 | 32.149 |
| 44202.18509259259 | 32.227 |
| 44202.22675925926 | 32.304 |
| 44202.268425925926 | 32.227 |
| 44202.31009259259 | 32.304 |
| 44202.35175925926 | 32.149 |
| 44202.393425925926 | 32.227 |
| 44202.43509259259 | 32.227 |
| 44202.47675925926 | 32.227 |
| 44202.518425925926 | 32.227 |
| 44202.56009259259 | 32.227 |
| 44202.60175925926 | 32.227 |
| 44202.643425925926 | 32.304 |
| 44202.68509259259 | 32.304 |
| 44202.72675925926 | 32.458 |
| 44202.768425925926 | 32.381 |
| 44202.81009259259 | 32.381 |
| 44202.85175925926 | 32.304 |
| 44202.893425925926 | 32.149 |
| 44202.93509259259 | 32.227 |
| 44202.97675925926 | 32.227 |
| 44203.018425925926 | 32.149 |
| 44203.06009259259 | 32.227 |
| 44203.10175925926 | 32.227 |
| 44203.143425925926 | 32.149 |
| 44203.18509259259 | 32.304 |
| 44203.22675925926 | 32.227 |
| 44203.268425925926 | 32.149 |
| 44203.31009259259 | 32.149 |
| 44203.35175925926 | 32.149 |
| 44203.393425925926 | 32.227 |
| 44203.43509259259 | 32.227 |
| 44203.47675925926 | 32.149 |
| 44203.518425925926 | 32.149 |
| 44203.56009259259 | 32.227 |
| 44203.60175925926 | 32.149 |
| 44203.643425925926 | 32.227 |
| 44203.68509259259 | 32.149 |
| 44203.72675925926 | 32.149 |
| 44203.768425925926 | 32.227 |
| 44203.81009259259 | 32.149 |
| 44203.85175925926 | 32.227 |
| 44203.893425925926 | 32.227 |
| 44203.93509259259 | 32.227 |
| 44203.97675925926 | 32.227 |
| 44204.018425925926 | 32.227 |
| 44204.06009259259 | 32.227 |
| 44204.10175925926 | 32.227 |
| 44204.143425925926 | 32.304 |
| 44204.18509259259 | 32.227 |
| 44204.22675925926 | 32.227 |
| 44204.268425925926 | 32.304 |
| 44204.31009259259 | 32.149 |
| 44204.35175925926 | 32.227 |
| 44204.393425925926 | 32.227 |
| 44204.43509259259 | 32.227 |
| 44204.47675925926 | 32.149 |
| 44204.518425925926 | 32.227 |
| 44204.56009259259 | 32.227 |
| 44204.60175925926 | 32.227 |
| 44204.643425925926 | 32.227 |
| 44204.68509259259 | 32.227 |
| 44204.72675925926 | 32.149 |
| 44204.768425925926 | 32.149 |
| 44204.81009259259 | 32.227 |
| 44204.85175925926 | 32.149 |
| 44204.893425925926 | 32.227 |
| 44204.93509259259 | 32.149 |
| 44204.97675925926 | 32.149 |
| 44205.018425925926 | 32.149 |
| 44205.06009259259 | 32.149 |
| 44205.10175925926 | 32.227 |
| 44205.143425925926 | 32.227 |
| 44205.18509259259 | 32.149 |
| 44205.22675925926 | 32.227 |
| 44205.268425925926 | 32.227 |
| 44205.31009259259 | 32.227 |
| 44205.35175925926 | 32.149 |
| 44205.393425925926 | 32.227 |
| 44205.43509259259 | 32.149 |
| 44205.47675925926 | 32.149 |
| 44205.518425925926 | 32.149 |
| 44205.56009259259 | 32.227 |
| 44205.60175925926 | 32.227 |
| 44205.643425925926 | 32.227 |
| 44205.68509259259 | 32.227 |
| 44205.72675925926 | 32.227 |
| 44205.768425925926 | 32.149 |
| 44205.81009259259 | 32.304 |
| 44205.85175925926 | 32.149 |
| 44205.893425925926 | 32.304 |
| 44205.93509259259 | 32.227 |
| 44205.97675925926 | 32.149 |
| 44206.018425925926 | 32.304 |
| 44206.06009259259 | 32.149 |
| 44206.10175925926 | 32.227 |
| 44206.143425925926 | 32.227 |
| 44206.18509259259 | 32.227 |
| 44206.22675925926 | 32.227 |
| 44206.268425925926 | 32.149 |
| 44206.31009259259 | 32.304 |
| 44206.35175925926 | 32.227 |
| 44206.393425925926 | 32.227 |
| 44206.43509259259 | 32.227 |
| 44206.47675925926 | 32.227 |
| 44206.518425925926 | 32.072 |
| 44206.56009259259 | 32.227 |
| 44206.60175925926 | 32.227 |
| 44206.643425925926 | 32.227 |
| 44206.68509259259 | 32.149 |
| 44206.72675925926 | 32.227 |
| 44206.768425925926 | 32.227 |
| 44206.81009259259 | 32.227 |
| 44206.85175925926 | 32.304 |
| 44206.893425925926 | 32.227 |
| 44206.93509259259 | 32.227 |
| 44206.97675925926 | 32.227 |
| 44207.018425925926 | 32.304 |
| 44207.06009259259 | 32.227 |
| 44207.10175925926 | 32.227 |
| 44207.143425925926 | 32.227 |
| 44207.18509259259 | 32.227 |
| 44207.22675925926 | 32.227 |
| 44207.268425925926 | 32.149 |
| 44207.31009259259 | 32.227 |
| 44207.35175925926 | 32.149 |
| 44207.393425925926 | 32.149 |
| 44207.43509259259 | 32.149 |
| 44207.47675925926 | 32.227 |
| 44207.518425925926 | 32.304 |
| 44207.56009259259 | 32.227 |
| 44207.60175925926 | 32.227 |
| 44207.643425925926 | 32.149 |
| 44207.68509259259 | 32.149 |
| 44207.72675925926 | 32.149 |
| 44207.768425925926 | 32.149 |
| 44207.81009259259 | 32.227 |
| 44207.85175925926 | 32.149 |
| 44207.893425925926 | 32.227 |
| 44207.93509259259 | 32.227 |
| 44207.97675925926 | 32.149 |
| 44208.018425925926 | 32.227 |
| 44208.06009259259 | 32.149 |
| 44208.10175925926 | 32.227 |
| 44208.143425925926 | 32.304 |
| 44208.18509259259 | 32.227 |
| 44208.22675925926 | 32.149 |
| 44208.268425925926 | 32.227 |
| 44208.31009259259 | 32.227 |
| 44208.35175925926 | 32.304 |
| 44208.393425925926 | 32.227 |
| 44208.43509259259 | 32.149 |
| 44208.47675925926 | 32.227 |
| 44208.518425925926 | 32.149 |
| 44208.56009259259 | 32.149 |
| 44208.60175925926 | 32.227 |
| 44208.643425925926 | 32.227 |
| 44208.68509259259 | 32.227 |
| 44208.72675925926 | 32.227 |
| 44208.768425925926 | 32.227 |
| 44208.81009259259 | 32.227 |
| 44208.85175925926 | 32.227 |
| 44208.893425925926 | 32.149 |
| 44208.93509259259 | 32.227 |
| 44208.97675925926 | 32.149 |
| 44209.018425925926 | 32.227 |
| 44209.06009259259 | 32.149 |
| 44209.10175925926 | 32.149 |
| 44209.143425925926 | 32.149 |
| 44209.18509259259 | 32.227 |
| 44209.22675925926 | 32.227 |
| 44209.268425925926 | 32.149 |
| 44209.31009259259 | 32.227 |
| 44209.35175925926 | 32.227 |
| 44209.393425925926 | 32.149 |
| 44209.43509259259 | 32.149 |
| 44209.47675925926 | 32.149 |
| 44209.518425925926 | 32.227 |
| 44209.56009259259 | 32.227 |
| 44209.60175925926 | 32.227 |
| 44209.643425925926 | 32.227 |
| 44209.68509259259 | 32.149 |
| 44209.72675925926 | 32.227 |
| 44209.768425925926 | 32.304 |
| 44209.81009259259 | 32.149 |
| 44209.85175925926 | 32.149 |
| 44209.893425925926 | 32.227 |
| 44209.93509259259 | 32.227 |
| 44209.97675925926 | 32.227 |
| 44210.018425925926 | 32.227 |
| 44210.06009259259 | 32.227 |
| 44210.10175925926 | 32.149 |
| 44210.143425925926 | 32.149 |
| 44210.18509259259 | 32.227 |
| 44210.22675925926 | 32.149 |
| 44210.268425925926 | 32.149 |
| 44210.31009259259 | 32.227 |
| 44210.35175925926 | 32.227 |
| 44210.393425925926 | 32.227 |
| 44210.43509259259 | 32.227 |
| 44210.47675925926 | 32.149 |
| 44210.518425925926 | 32.227 |
| 44210.56009259259 | 32.304 |
| 44210.60175925926 | 32.227 |
| 44210.643425925926 | 32.304 |
| 44210.68509259259 | 32.149 |
| 44210.72675925926 | 32.304 |
| 44210.768425925926 | 32.227 |
| 44210.81009259259 | 32.227 |
| 44210.85175925926 | 32.304 |
| 44210.893425925926 | 32.149 |
| 44210.93509259259 | 32.227 |
| 44210.97675925926 | 32.149 |
| 44211.018425925926 | 32.227 |
| 44211.06009259259 | 32.227 |
| 44211.10175925926 | 32.227 |
| 44211.143425925926 | 32.149 |
| 44211.18509259259 | 32.149 |
| 44211.22675925926 | 32.227 |
| 44211.268425925926 | 32.227 |
| 44211.31009259259 | 32.149 |
| 44211.35175925926 | 32.227 |
| 44211.393425925926 | 32.149 |
| 44211.43509259259 | 32.149 |
| 44211.47675925926 | 32.149 |
| 44211.518425925926 | 32.227 |
| 44211.56009259259 | 32.149 |
| 44211.60175925926 | 32.149 |
| 44211.643425925926 | 32.227 |
| 44211.68509259259 | 32.149 |
| 44211.72675925926 | 32.227 |
| 44211.768425925926 | 32.149 |
| 44211.81009259259 | 32.227 |
| 44211.85175925926 | 32.227 |
| 44211.893425925926 | 32.227 |
| 44211.93509259259 | 32.149 |
| 44211.97675925926 | 32.149 |
| 44212.018425925926 | 32.227 |
| 44212.06009259259 | 32.227 |
| 44212.10175925926 | 32.227 |
| 44212.143425925926 | 32.149 |
| 44212.18509259259 | 32.149 |
| 44212.22675925926 | 32.149 |
| 44212.268425925926 | 32.149 |
| 44212.31009259259 | 32.149 |
| 44212.35175925926 | 32.227 |
| 44212.393425925926 | 32.149 |
| 44212.43509259259 | 32.227 |
| 44212.47675925926 | 32.227 |
| 44212.518425925926 | 32.227 |
| 44212.56009259259 | 32.227 |
| 44212.60175925926 | 32.227 |
| 44212.643425925926 | 32.227 |
| 44212.68509259259 | 32.227 |
| 44212.72675925926 | 32.227 |
| 44212.768425925926 | 32.227 |
| 44212.81009259259 | 32.149 |
| 44212.85175925926 | 32.149 |
| 44212.893425925926 | 32.227 |
| 44212.93509259259 | 32.304 |
| 44212.97675925926 | 32.227 |
| 44213.018425925926 | 32.149 |
| 44213.06009259259 | 32.149 |
| 44213.10175925926 | 32.304 |
| 44213.143425925926 | 32.227 |
| 44213.18509259259 | 32.227 |
| 44213.22675925926 | 32.227 |
| 44213.268425925926 | 32.227 |
| 44213.31009259259 | 32.227 |
| 44213.35175925926 | 32.227 |
| 44213.393425925926 | 32.149 |
| 44213.43509259259 | 32.227 |
| 44213.47675925926 | 32.227 |
| 44213.518425925926 | 32.227 |
| 44213.56009259259 | 32.304 |
| 44213.60175925926 | 32.304 |
| 44213.643425925926 | 32.304 |
| 44213.68509259259 | 32.304 |
| 44213.72675925926 | 32.304 |
| 44213.768425925926 | 32.381 |
| 44213.81009259259 | 32.381 |
| 44213.85175925926 | 32.458 |
| 44213.893425925926 | 32.304 |
| 44213.93509259259 | 32.458 |
| 44213.97675925926 | 32.381 |
| 44214.018425925926 | 32.381 |
| 44214.06009259259 | 32.381 |
| 44214.10175925926 | 32.458 |
| 44214.143425925926 | 32.381 |
| 44214.18509259259 | 32.381 |
| 44214.22675925926 | 32.304 |
| 44214.268425925926 | 32.304 |
| 44214.31009259259 | 32.304 |
| 44214.35175925926 | 32.227 |
| 44214.393425925926 | 32.304 |
| 44214.43509259259 | 32.381 |
| 44214.47675925926 | 32.536 |
| 44214.518425925926 | 32.613 |
| 44214.56009259259 | 32.613 |
| 44214.60175925926 | 32.767 |
| 44214.643425925926 | 32.767 |
| 44214.68509259259 | 32.767 |
| 44214.72675925926 | 32.69 |
| 44214.768425925926 | 32.613 |
| 44214.81009259259 | 32.458 |
| 44214.85175925926 | 32.458 |
| 44214.893425925926 | 32.304 |
| 44214.93509259259 | 32.304 |
| 44214.97675925926 | 32.149 |
| 44215.018425925926 | 32.149 |
| 44215.06009259259 | 32.227 |
| 44215.10175925926 | 32.227 |
| 44215.143425925926 | 32.304 |
| 44215.18509259259 | 32.149 |
| 44215.22675925926 | 32.304 |
| 44215.268425925926 | 32.149 |
| 44215.31009259259 | 32.227 |
| 44215.35175925926 | 32.149 |
| 44215.393425925926 | 32.227 |
| 44215.43509259259 | 32.227 |
| 44215.47675925926 | 32.304 |
| 44215.518425925926 | 32.227 |
| 44215.56009259259 | 32.304 |
| 44215.60175925926 | 32.381 |
| 44215.643425925926 | 32.381 |
| 44215.68509259259 | 32.69 |
| 44215.72675925926 | 32.69 |
| 44215.768425925926 | 32.69 |
| 44215.81009259259 | 32.536 |
| 44215.85175925926 | 32.381 |
| 44215.893425925926 | 32.227 |
| 44215.93509259259 | 32.149 |
| 44215.97675925926 | 32.227 |
| 44216.018425925926 | 32.227 |
| 44216.06009259259 | 32.149 |
| 44216.10175925926 | 32.149 |
| 44216.143425925926 | 32.227 |
| 44216.18509259259 | 32.227 |
| 44216.22675925926 | 32.227 |
| 44216.268425925926 | 32.149 |
| 44216.31009259259 | 32.304 |
| 44216.35175925926 | 32.149 |
| 44216.393425925926 | 32.149 |
| 44216.43509259259 | 32.149 |
| 44216.47675925926 | 32.227 |
| 44216.518425925926 | 32.227 |
| 44216.56009259259 | 32.304 |
| 44216.60175925926 | 32.381 |
| 44216.643425925926 | 32.458 |
| 44216.68509259259 | 32.227 |
| 44216.72675925926 | 32.304 |
| 44216.768425925926 | 32.536 |
| 44216.81009259259 | 32.69 |
| 44216.85175925926 | 32.767 |
| 44216.893425925926 | 32.767 |
| 44216.93509259259 | 32.767 |
| 44216.97675925926 | 32.69 |
| 44217.018425925926 | 32.536 |
| 44217.06009259259 | 32.381 |
| 44217.10175925926 | 32.304 |
| 44217.143425925926 | 32.149 |
| 44217.18509259259 | 32.227 |
| 44217.22675925926 | 32.227 |
| 44217.268425925926 | 32.149 |
| 44217.31009259259 | 32.227 |
| 44217.35175925926 | 32.227 |
| 44217.393425925926 | 32.227 |
| 44217.43509259259 | 32.227 |
| 44217.47675925926 | 32.227 |
| 44217.518425925926 | 32.458 |
| 44217.56009259259 | 32.69 |
| 44217.60175925926 | 33.539 |
| 44217.643425925926 | 34.389 |
| 44217.68509259259 | 34.466 |
| 44217.72675925926 | 34.466 |
| 44217.768425925926 | 34.389 |
| 44217.81009259259 | 34.312 |
| 44217.85175925926 | 34.157 |
| 44217.893425925926 | 34.234 |
| 44217.93509259259 | 34.234 |
| 44217.97675925926 | 34.234 |
| 44218.018425925926 | 34.157 |
| 44218.06009259259 | 34.08 |
| 44218.10175925926 | 33.926 |
| 44218.143425925926 | 33.771 |
| 44218.18509259259 | 33.694 |
| 44218.22675925926 | 33.617 |
| 44218.268425925926 | 33.462 |
| 44218.31009259259 | 33.539 |
| 44218.35175925926 | 33.462 |
| 44218.393425925926 | 33.848 |
| 44218.43509259259 | 34.389 |
| 44218.47675925926 | 35.238 |
| 44218.518425925926 | 35.856 |
| 44218.56009259259 | 36.088 |
| 44218.60175925926 | 36.397 |
| 44218.643425925926 | 37.323 |
| 44218.68509259259 | 36.937 |
| 44218.72675925926 | 36.705 |
| 44218.768425925926 | 36.705 |
| 44218.81009259259 | 36.628 |
| 44218.85175925926 | 36.242 |
| 44218.893425925926 | 36.01 |
| 44218.93509259259 | 35.547 |
| 44218.97675925926 | 35.161 |
| 44219.018425925926 | 34.775 |
| 44219.06009259259 | 34.157 |
| 44219.10175925926 | 33.617 |
| 44219.143425925926 | 33.308 |
| 44219.18509259259 | 33.076 |
| 44219.22675925926 | 32.767 |
| 44219.268425925926 | 32.458 |
| 44219.31009259259 | 32.227 |
| 44219.35175925926 | 32.227 |
| 44219.393425925926 | 32.227 |
| 44219.43509259259 | 32.922 |
| 44219.47675925926 | 33.539 |
| 44219.518425925926 | 34.157 |
| 44219.56009259259 | 34.775 |
| 44219.60175925926 | 35.702 |
| 44219.643425925926 | 35.779 |
| 44219.68509259259 | 35.702 |
| 44219.72675925926 | 35.393 |
| 44219.768425925926 | 35.084 |
| 44219.81009259259 | 34.852 |
| 44219.85175925926 | 34.698 |
| 44219.893425925926 | 34.466 |
| 44219.93509259259 | 34.234 |
| 44219.97675925926 | 34.003 |
| 44220.018425925926 | 33.462 |
| 44220.06009259259 | 32.922 |
| 44220.10175925926 | 32.149 |
| 44220.143425925926 | 32.227 |
| 44220.18509259259 | 32.227 |
| 44220.22675925926 | 32.227 |
| 44220.268425925926 | 32.149 |
| 44220.31009259259 | 32.227 |
| 44220.35175925926 | 32.227 |
| 44220.393425925926 | 32.149 |
| 44220.43509259259 | 32.149 |
| 44220.47675925926 | 32.304 |
| 44220.518425925926 | 32.304 |
| 44220.56009259259 | 32.613 |
| 44220.60175925926 | 33.153 |
| 44220.643425925926 | 32.999 |
| 44220.68509259259 | 32.922 |
| 44220.72675925926 | 33.153 |
| 44220.768425925926 | 33.462 |
| 44220.81009259259 | 33.617 |
| 44220.85175925926 | 33.694 |
| 44220.893425925926 | 33.539 |
| 44220.93509259259 | 33.385 |
| 44220.97675925926 | 32.999 |
| 44221.018425925926 | 32.613 |
| 44221.06009259259 | 32.149 |
| 44221.10175925926 | 32.149 |
| 44221.143425925926 | 32.227 |
| 44221.18509259259 | 32.227 |
| 44221.22675925926 | 32.227 |
| 44221.268425925926 | 32.149 |
| 44221.31009259259 | 32.149 |
| 44221.35175925926 | 32.227 |
| 44221.393425925926 | 32.227 |
| 44221.43509259259 | 32.227 |
| 44221.47675925926 | 32.227 |
| 44221.518425925926 | 32.381 |
| 44221.56009259259 | 32.767 |
| 44221.60175925926 | 33.308 |
| 44221.643425925926 | 33.926 |
| 44221.68509259259 | 34.157 |
| 44221.72675925926 | 34.003 |
| 44221.768425925926 | 33.926 |
| 44221.81009259259 | 33.539 |
| 44221.85175925926 | 33.231 |
| 44221.893425925926 | 32.922 |
| 44221.93509259259 | 32.304 |
| 44221.97675925926 | 32.149 |
| 44222.018425925926 | 32.227 |
| 44222.06009259259 | 32.149 |
| 44222.10175925926 | 32.227 |
| 44222.143425925926 | 32.149 |
| 44222.18509259259 | 32.149 |
| 44222.22675925926 | 32.227 |
| 44222.268425925926 | 32.227 |
| 44222.31009259259 | 32.227 |
| 44222.35175925926 | 32.149 |
| 44222.393425925926 | 32.227 |
| 44222.43509259259 | 32.304 |
| 44222.47675925926 | 32.227 |
| 44222.518425925926 | 32.227 |
| 44222.56009259259 | 32.227 |
| 44222.60175925926 | 32.304 |
| 44222.643425925926 | 32.227 |
| 44222.68509259259 | 32.304 |
| 44222.72675925926 | 32.227 |
| 44222.768425925926 | 32.227 |
| 44222.81009259259 | 32.149 |
| 44222.85175925926 | 32.227 |
| 44222.893425925926 | 32.149 |
| 44222.93509259259 | 32.227 |
| 44222.97675925926 | 32.227 |
| 44223.018425925926 | 32.227 |
| 44223.06009259259 | 32.149 |
| 44223.10175925926 | 32.149 |
| 44223.143425925926 | 32.149 |
| 44223.18509259259 | 32.227 |
| 44223.22675925926 | 32.149 |
| 44223.268425925926 | 32.149 |
| 44223.31009259259 | 32.227 |
| 44223.35175925926 | 32.149 |
| 44223.393425925926 | 32.227 |
| 44223.43509259259 | 32.227 |
| 44223.47675925926 | 32.227 |
| 44223.518425925926 | 32.149 |
| 44223.56009259259 | 32.304 |
| 44223.60175925926 | 32.381 |
| 44223.643425925926 | 32.381 |
| 44223.68509259259 | 32.536 |
| 44223.72675925926 | 32.227 |
| 44223.768425925926 | 32.227 |
| 44223.81009259259 | 32.149 |
| 44223.85175925926 | 32.227 |
| 44223.893425925926 | 32.227 |
| 44223.93509259259 | 32.381 |
| 44223.97675925926 | 32.536 |
| 44224.018425925926 | 32.69 |
| 44224.06009259259 | 32.844 |
| 44224.10175925926 | 32.767 |
| 44224.143425925926 | 32.613 |
| 44224.18509259259 | 32.536 |
| 44224.22675925926 | 32.458 |
| 44224.268425925926 | 32.304 |
| 44224.31009259259 | 32.304 |
| 44224.35175925926 | 32.149 |
| 44224.393425925926 | 32.381 |
| 44224.43509259259 | 32.844 |
| 44224.47675925926 | 33.694 |
| 44224.518425925926 | 34.543 |
| 44224.56009259259 | 35.547 |
| 44224.60175925926 | 36.705 |
| 44224.643425925926 | 37.092 |
| 44224.68509259259 | 37.169 |
| 44224.72675925926 | 37.092 |
| 44224.768425925926 | 36.705 |
| 44224.81009259259 | 36.319 |
| 44224.85175925926 | 35.779 |
| 44224.893425925926 | 35.315 |
| 44224.93509259259 | 35.007 |
| 44224.97675925926 | 34.389 |
| 44225.018425925926 | 33.694 |
| 44225.06009259259 | 32.999 |
| 44225.10175925926 | 32.381 |
| 44225.143425925926 | 32.227 |
| 44225.18509259259 | 32.149 |
| 44225.22675925926 | 32.227 |
| 44225.268425925926 | 32.227 |
| 44225.31009259259 | 32.227 |
| 44225.35175925926 | 32.227 |
| 44225.393425925926 | 32.227 |
| 44225.43509259259 | 32.227 |
| 44225.47675925926 | 32.767 |
| 44225.518425925926 | 33.926 |
| 44225.56009259259 | 34.852 |
| 44225.60175925926 | 35.779 |
| 44225.643425925926 | 36.705 |
| 44225.68509259259 | 37.4 |
| 44225.72675925926 | 37.4 |
| 44225.768425925926 | 37.169 |
| 44225.81009259259 | 37.014 |
| 44225.85175925926 | 36.937 |
| 44225.893425925926 | 36.551 |
| 44225.93509259259 | 36.088 |
| 44225.97675925926 | 35.779 |
| 44226.018425925926 | 35.161 |
| 44226.06009259259 | 34.543 |
| 44226.10175925926 | 34.08 |
| 44226.143425925926 | 33.694 |
| 44226.18509259259 | 33.462 |
| 44226.22675925926 | 33.153 |
| 44226.268425925926 | 32.922 |
| 44226.31009259259 | 32.69 |
| 44226.35175925926 | 32.536 |
| 44226.393425925926 | 32.844 |
| 44226.43509259259 | 33.462 |
| 44226.47675925926 | 34.466 |
| 44226.518425925926 | 35.161 |
| 44226.56009259259 | 35.702 |
| 44226.60175925926 | 36.242 |
| 44226.643425925926 | 36.01 |
| 44226.68509259259 | 35.47 |
| 44226.72675925926 | 35.007 |
| 44226.768425925926 | 34.389 |
| 44226.81009259259 | 34.003 |
| 44226.85175925926 | 33.539 |
| 44226.893425925926 | 33.308 |
| 44226.93509259259 | 33.076 |
| 44226.97675925926 | 32.844 |
| 44227.018425925926 | 32.613 |
| 44227.06009259259 | 32.149 |
| 44227.10175925926 | 32.227 |
| 44227.143425925926 | 32.227 |
| 44227.18509259259 | 32.227 |
| 44227.22675925926 | 32.149 |
| 44227.268425925926 | 32.149 |
| 44227.31009259259 | 32.227 |
| 44227.35175925926 | 32.227 |
| 44227.393425925926 | 32.149 |
| 44227.43509259259 | 32.227 |
| 44227.47675925926 | 32.227 |
| 44227.518425925926 | 32.922 |
| 44227.56009259259 | 34.003 |
| 44227.60175925926 | 34.543 |
| 44227.643425925926 | 34.929 |
| 44227.68509259259 | 35.007 |
| 44227.72675925926 | 35.084 |
| 44227.768425925926 | 34.929 |
| 44227.81009259259 | 34.312 |
| 44227.85175925926 | 33.694 |
| 44227.893425925926 | 33.385 |
| 44227.93509259259 | 32.844 |
| 44227.97675925926 | 32.381 |
| 44228.018425925926 | 32.149 |
| 44228.06009259259 | 32.227 |
| 44228.10175925926 | 32.227 |
| 44228.143425925926 | 32.227 |
| 44228.18509259259 | 32.227 |
| 44228.22675925926 | 32.149 |
| 44228.268425925926 | 32.227 |
| 44228.31009259259 | 32.227 |
| 44228.35175925926 | 32.149 |
| 44228.393425925926 | 32.304 |
| 44228.43509259259 | 32.227 |
| 44228.47675925926 | 32.227 |
| 44228.518425925926 | 32.304 |
| 44228.56009259259 | 32.381 |
| 44228.60175925926 | 32.304 |
| 44228.643425925926 | 32.536 |
| 44228.68509259259 | 32.458 |
| 44228.72675925926 | 32.227 |
| 44228.768425925926 | 32.072 |
| 44228.81009259259 | 32.227 |
| 44228.85175925926 | 32.227 |
| 44228.893425925926 | 32.458 |
| 44228.93509259259 | 32.536 |
| 44228.97675925926 | 32.458 |
| 44229.018425925926 | 32.227 |
| 44229.06009259259 | 32.149 |
| 44229.10175925926 | 32.227 |
| 44229.143425925926 | 32.227 |
| 44229.18509259259 | 32.149 |
| 44229.22675925926 | 32.149 |
| 44229.268425925926 | 32.227 |
| 44229.31009259259 | 32.227 |
| 44229.35175925926 | 32.227 |
| 44229.393425925926 | 32.227 |
| 44229.43509259259 | 32.227 |
| 44229.47675925926 | 32.149 |
| 44229.518425925926 | 32.999 |
| 44229.56009259259 | 34.389 |
| 44229.60175925926 | 34.929 |
| 44229.643425925926 | 35.393 |
| 44229.68509259259 | 36.165 |
| 44229.72675925926 | 36.397 |
| 44229.768425925926 | 36.165 |
| 44229.81009259259 | 36.01 |
| 44229.85175925926 | 35.856 |
| 44229.893425925926 | 35.47 |
| 44229.93509259259 | 35.084 |
| 44229.97675925926 | 34.698 |
| 44230.018425925926 | 34.389 |
| 44230.06009259259 | 34.08 |
| 44230.10175925926 | 33.848 |
| 44230.143425925926 | 33.694 |
| 44230.18509259259 | 33.385 |
| 44230.22675925926 | 33.231 |
| 44230.268425925926 | 33.076 |
| 44230.31009259259 | 32.922 |
| 44230.35175925926 | 33.153 |
| 44230.393425925926 | 33.694 |
| 44230.43509259259 | 34.543 |
| 44230.47675925926 | 35.007 |
| 44230.518425925926 | 35.393 |
| 44230.56009259259 | 34.852 |
| 44230.60175925926 | 34.312 |
| 44230.643425925926 | 34.698 |
| 44230.68509259259 | 34.621 |
| 44230.72675925926 | 34.543 |
| 44230.768425925926 | 34.08 |
| 44230.81009259259 | 33.462 |
| 44230.85175925926 | 32.844 |
| 44230.893425925926 | 32.458 |
| 44230.93509259259 | 32.304 |
| 44230.97675925926 | 32.227 |
| 44231.018425925926 | 32.149 |
| 44231.06009259259 | 32.149 |
| 44231.10175925926 | 32.227 |
| 44231.143425925926 | 32.304 |
| 44231.18509259259 | 32.227 |
| 44231.22675925926 | 32.227 |
| 44231.268425925926 | 32.227 |
| 44231.31009259259 | 32.227 |
| 44231.35175925926 | 32.149 |
| 44231.393425925926 | 32.149 |
| 44231.43509259259 | 32.227 |
| 44231.47675925926 | 32.304 |
| 44231.518425925926 | 32.227 |
| 44231.56009259259 | 32.381 |
| 44231.60175925926 | 32.536 |
| 44231.643425925926 | 32.381 |
| 44231.68509259259 | 32.227 |
| 44231.72675925926 | 32.227 |
| 44231.768425925926 | 32.227 |
| 44231.81009259259 | 32.227 |
| 44231.85175925926 | 32.227 |
| 44231.893425925926 | 32.227 |
| 44231.93509259259 | 32.149 |
| 44231.97675925926 | 32.149 |
| 44232.018425925926 | 32.304 |
| 44232.06009259259 | 32.227 |
| 44232.10175925926 | 32.227 |
| 44232.143425925926 | 32.227 |
| 44232.18509259259 | 32.227 |
| 44232.22675925926 | 32.227 |
| 44232.268425925926 | 32.227 |
| 44232.31009259259 | 32.227 |
| 44232.35175925926 | 32.149 |
| 44232.393425925926 | 32.227 |
| 44232.43509259259 | 32.227 |
| 44232.47675925926 | 32.304 |
| 44232.518425925926 | 32.227 |
| 44232.56009259259 | 32.227 |
| 44232.60175925926 | 32.304 |
| 44232.643425925926 | 32.227 |
| 44232.68509259259 | 32.227 |
| 44232.72675925926 | 32.381 |
| 44232.768425925926 | 32.613 |
| 44232.81009259259 | 32.69 |
| 44232.85175925926 | 32.69 |
| 44232.893425925926 | 32.381 |
| 44232.93509259259 | 32.227 |
| 44232.97675925926 | 32.149 |
| 44233.018425925926 | 32.149 |
| 44233.06009259259 | 32.149 |
| 44233.10175925926 | 32.227 |
| 44233.143425925926 | 32.227 |
| 44233.18509259259 | 32.227 |
| 44233.22675925926 | 32.227 |
| 44233.268425925926 | 32.227 |
| 44233.31009259259 | 32.149 |
| 44233.35175925926 | 32.227 |
| 44233.393425925926 | 32.227 |
| 44233.43509259259 | 32.227 |
| 44233.47675925926 | 32.227 |
| 44233.518425925926 | 32.381 |
| 44233.56009259259 | 32.844 |
| 44233.60175925926 | 33.308 |
| 44233.643425925926 | 32.999 |
| 44233.68509259259 | 32.767 |
| 44233.72675925926 | 32.613 |
| 44233.768425925926 | 32.844 |
| 44233.81009259259 | 33.076 |
| 44233.85175925926 | 33.153 |
| 44233.893425925926 | 33.308 |
| 44233.93509259259 | 33.153 |
| 44233.97675925926 | 33.153 |
| 44234.018425925926 | 32.999 |
| 44234.06009259259 | 32.69 |
| 44234.10175925926 | 32.536 |
| 44234.143425925926 | 32.304 |
| 44234.18509259259 | 32.227 |
| 44234.22675925926 | 32.227 |
| 44234.268425925926 | 32.227 |
| 44234.31009259259 | 32.149 |
| 44234.35175925926 | 32.227 |
| 44234.393425925926 | 32.149 |
| 44234.43509259259 | 32.227 |
| 44234.47675925926 | 33.153 |
| 44234.518425925926 | 34.312 |
| 44234.56009259259 | 35.393 |
| 44234.60175925926 | 36.551 |
| 44234.643425925926 | 37.323 |
| 44234.68509259259 | 37.092 |
| 44234.72675925926 | 36.474 |
| 44234.768425925926 | 35.933 |
| 44234.81009259259 | 35.084 |
| 44234.85175925926 | 34.466 |
| 44234.893425925926 | 34.08 |
| 44234.93509259259 | 33.617 |
| 44234.97675925926 | 33.231 |
| 44235.018425925926 | 32.844 |
| 44235.06009259259 | 32.381 |
| 44235.10175925926 | 32.149 |
| 44235.143425925926 | 32.227 |
| 44235.18509259259 | 32.227 |
| 44235.22675925926 | 32.149 |
| 44235.268425925926 | 32.227 |
| 44235.31009259259 | 32.149 |
| 44235.35175925926 | 32.227 |
| 44235.393425925926 | 32.227 |
| 44235.43509259259 | 32.227 |
| 44235.47675925926 | 33.153 |
| 44235.518425925926 | 34.157 |
| 44235.56009259259 | 35.47 |
| 44235.60175925926 | 36.705 |
| 44235.643425925926 | 37.787 |
| 44235.68509259259 | 37.632 |
| 44235.72675925926 | 37.169 |
| 44235.768425925926 | 36.551 |
| 44235.81009259259 | 35.856 |
| 44235.85175925926 | 35.161 |
| 44235.893425925926 | 34.775 |
| 44235.93509259259 | 34.234 |
| 44235.97675925926 | 33.926 |
| 44236.018425925926 | 33.539 |
| 44236.06009259259 | 33.308 |
| 44236.10175925926 | 33.076 |
| 44236.143425925926 | 32.922 |
| 44236.18509259259 | 32.767 |
| 44236.22675925926 | 32.69 |
| 44236.268425925926 | 32.767 |
| 44236.31009259259 | 32.844 |
| 44236.35175925926 | 33.076 |
| 44236.393425925926 | 33.694 |
| 44236.43509259259 | 34.466 |
| 44236.47675925926 | 35.393 |
| 44236.518425925926 | 36.088 |
| 44236.56009259259 | 36.628 |
| 44236.60175925926 | 37.323 |
| 44236.643425925926 | 37.555 |
| 44236.68509259259 | 37.4 |
| 44236.72675925926 | 37.169 |
| 44236.768425925926 | 37.014 |
| 44236.81009259259 | 36.628 |
| 44236.85175925926 | 36.319 |
| 44236.893425925926 | 36.319 |
| 44236.93509259259 | 36.242 |
| 44236.97675925926 | 35.856 |
| 44237.018425925926 | 35.702 |
| 44237.06009259259 | 35.47 |
| 44237.10175925926 | 35.007 |
| 44237.143425925926 | 34.775 |
| 44237.18509259259 | 34.466 |
| 44237.22675925926 | 34.234 |
| 44237.268425925926 | 34.234 |
| 44237.31009259259 | 34.08 |
| 44237.35175925926 | 34.234 |
| 44237.393425925926 | 34.466 |
| 44237.43509259259 | 34.929 |
| 44237.47675925926 | 35.547 |
| 44237.518425925926 | 36.165 |
| 44237.56009259259 | 36.705 |
| 44237.60175925926 | 37.014 |
| 44237.643425925926 | 36.242 |
| 44237.68509259259 | 36.551 |
| 44237.72675925926 | 36.397 |
| 44237.768425925926 | 36.01 |
| 44237.81009259259 | 35.47 |
| 44237.85175925926 | 35.084 |
| 44237.893425925926 | 34.852 |
| 44237.93509259259 | 34.775 |
| 44237.97675925926 | 34.621 |
| 44238.018425925926 | 34.621 |
| 44238.06009259259 | 34.312 |
| 44238.10175925926 | 34.003 |
| 44238.143425925926 | 33.848 |
| 44238.18509259259 | 33.617 |
| 44238.22675925926 | 33.308 |
| 44238.268425925926 | 33.153 |
| 44238.31009259259 | 33.153 |
| 44238.35175925926 | 33.308 |
| 44238.393425925926 | 33.848 |
| 44238.43509259259 | 34.157 |
| 44238.47675925926 | 34.775 |
| 44238.518425925926 | 35.393 |
| 44238.56009259259 | 36.01 |
| 44238.60175925926 | 36.705 |
| 44238.643425925926 | 37.709 |
| 44238.68509259259 | 38.018 |
| 44238.72675925926 | 38.018 |
| 44238.768425925926 | 37.478 |
| 44238.81009259259 | 36.937 |
| 44238.85175925926 | 36.705 |
| 44238.893425925926 | 36.551 |
| 44238.93509259259 | 36.397 |
| 44238.97675925926 | 36.242 |
| 44239.018425925926 | 35.933 |
| 44239.06009259259 | 35.702 |
| 44239.10175925926 | 35.315 |
| 44239.143425925926 | 35.007 |
| 44239.18509259259 | 34.775 |
| 44239.22675925926 | 34.543 |
| 44239.268425925926 | 34.234 |
| 44239.31009259259 | 33.926 |
| 44239.35175925926 | 33.539 |
| 44239.393425925926 | 33.385 |
| 44239.43509259259 | 33.848 |
| 44239.47675925926 | 34.312 |
| 44239.518425925926 | 35.084 |
| 44239.56009259259 | 35.702 |
| 44239.60175925926 | 36.319 |
| 44239.643425925926 | 37.246 |
| 44239.68509259259 | 37.478 |
| 44239.72675925926 | 37.4 |
| 44239.768425925926 | 37.169 |
| 44239.81009259259 | 36.86 |
| 44239.85175925926 | 36.628 |
| 44239.893425925926 | 36.474 |
| 44239.93509259259 | 36.088 |
| 44239.97675925926 | 35.393 |
| 44240.018425925926 | 35.084 |
| 44240.06009259259 | 34.852 |
| 44240.10175925926 | 34.621 |
| 44240.143425925926 | 34.312 |
| 44240.18509259259 | 34.08 |
| 44240.22675925926 | 33.771 |
| 44240.268425925926 | 33.539 |
| 44240.31009259259 | 33.462 |
| 44240.35175925926 | 33.694 |
| 44240.393425925926 | 34.08 |
| 44240.43509259259 | 34.466 |
| 44240.47675925926 | 35.47 |
| 44240.518425925926 | 36.474 |
| 44240.56009259259 | 36.937 |
| 44240.60175925926 | 37.709 |
| 44240.643425925926 | 38.018 |
| 44240.68509259259 | 37.941 |
| 44240.72675925926 | 37.632 |
| 44240.768425925926 | 37.4 |
| 44240.81009259259 | 37.014 |
| 44240.85175925926 | 36.783 |
| 44240.893425925926 | 36.551 |
| 44240.93509259259 | 36.165 |
| 44240.97675925926 | 35.624 |
| 44241.018425925926 | 35.084 |
| 44241.06009259259 | 34.466 |
| 44241.10175925926 | 33.771 |
| 44241.143425925926 | 33.153 |
| 44241.18509259259 | 32.536 |
| 44241.22675925926 | 32.072 |
| 44241.268425925926 | 32.149 |
| 44241.31009259259 | 32.227 |
| 44241.35175925926 | 32.227 |
| 44241.393425925926 | 32.227 |
| 44241.43509259259 | 32.149 |
| 44241.47675925926 | 32.304 |
| 44241.518425925926 | 33.076 |
| 44241.56009259259 | 34.08 |
| 44241.60175925926 | 35.084 |
| 44241.643425925926 | 35.315 |
| 44241.68509259259 | 35.084 |
| 44241.72675925926 | 34.234 |
| 44241.768425925926 | 33.539 |
| 44241.81009259259 | 32.767 |
| 44241.85175925926 | 32.149 |
| 44241.893425925926 | 32.149 |
| 44241.93509259259 | 32.227 |
| 44241.97675925926 | 32.227 |
| 44242.018425925926 | 32.227 |
| 44242.06009259259 | 32.227 |
| 44242.10175925926 | 32.149 |
| 44242.143425925926 | 32.227 |
| 44242.18509259259 | 32.227 |
| 44242.22675925926 | 32.227 |
| 44242.268425925926 | 32.149 |
| 44242.31009259259 | 32.227 |
| 44242.35175925926 | 32.227 |
| 44242.393425925926 | 32.227 |
| 44242.43509259259 | 32.227 |
| 44242.47675925926 | 32.304 |
| 44242.518425925926 | 32.381 |
| 44242.56009259259 | 32.999 |
| 44242.60175925926 | 33.462 |
| 44242.643425925926 | 33.462 |
| 44242.68509259259 | 33.617 |
| 44242.72675925926 | 33.694 |
| 44242.768425925926 | 33.771 |
| 44242.81009259259 | 33.771 |
| 44242.85175925926 | 33.539 |
| 44242.893425925926 | 33.462 |
| 44242.93509259259 | 33.385 |
| 44242.97675925926 | 33.153 |
| 44243.018425925926 | 32.69 |
| 44243.06009259259 | 32.458 |
| 44243.10175925926 | 32.149 |
| 44243.143425925926 | 32.149 |
| 44243.18509259259 | 32.227 |
| 44243.22675925926 | 32.227 |
| 44243.268425925926 | 32.227 |
| 44243.31009259259 | 32.227 |
| 44243.35175925926 | 32.227 |
| 44243.393425925926 | 32.149 |
| 44243.43509259259 | 32.227 |
| 44243.47675925926 | 32.381 |
| 44243.518425925926 | 32.999 |
| 44243.56009259259 | 33.617 |
| 44243.60175925926 | 33.848 |
| 44243.643425925926 | 33.926 |
| 44243.68509259259 | 34.003 |
| 44243.72675925926 | 34.003 |
| 44243.768425925926 | 33.539 |
| 44243.81009259259 | 33.385 |
| 44243.85175925926 | 33.153 |
| 44243.893425925926 | 32.767 |
| 44243.93509259259 | 32.304 |
| 44243.97675925926 | 32.227 |
| 44244.018425925926 | 32.149 |
| 44244.06009259259 | 32.227 |
| 44244.10175925926 | 32.149 |
| 44244.143425925926 | 32.149 |
| 44244.18509259259 | 32.227 |
| 44244.22675925926 | 32.227 |
| 44244.268425925926 | 32.227 |
| 44244.31009259259 | 32.227 |
| 44244.35175925926 | 32.227 |
| 44244.393425925926 | 32.227 |
| 44244.43509259259 | 32.304 |
| 44244.47675925926 | 32.304 |
| 44244.518425925926 | 32.844 |
| 44244.56009259259 | 33.231 |
| 44244.60175925926 | 33.539 |
| 44244.643425925926 | 33.694 |
| 44244.68509259259 | 34.003 |
| 44244.72675925926 | 33.926 |
| 44244.768425925926 | 33.771 |
| 44244.81009259259 | 33.539 |
| 44244.85175925926 | 33.231 |
| 44244.893425925926 | 32.844 |
| 44244.93509259259 | 32.458 |
| 44244.97675925926 | 32.304 |
| 44245.018425925926 | 32.227 |
| 44245.06009259259 | 32.304 |
| 44245.10175925926 | 32.149 |
| 44245.143425925926 | 32.227 |
| 44245.18509259259 | 32.304 |
| 44245.22675925926 | 32.149 |
| 44245.268425925926 | 32.227 |
| 44245.31009259259 | 32.149 |
| 44245.35175925926 | 32.149 |
| 44245.393425925926 | 32.227 |
| 44245.43509259259 | 32.149 |
| 44245.47675925926 | 32.227 |
| 44245.518425925926 | 32.844 |
| 44245.56009259259 | 33.771 |
| 44245.60175925926 | 33.771 |
| 44245.643425925926 | 34.08 |
| 44245.68509259259 | 34.08 |
| 44245.72675925926 | 33.539 |
| 44245.768425925926 | 33.385 |
| 44245.81009259259 | 33.153 |
| 44245.85175925926 | 32.536 |
| 44245.893425925926 | 32.149 |
| 44245.93509259259 | 32.227 |
| 44245.97675925926 | 32.227 |
| 44246.018425925926 | 32.149 |
| 44246.06009259259 | 32.149 |
| 44246.10175925926 | 32.304 |
| 44246.143425925926 | 32.227 |
| 44246.18509259259 | 32.149 |
| 44246.22675925926 | 32.227 |
| 44246.268425925926 | 32.227 |
| 44246.31009259259 | 32.227 |
| 44246.35175925926 | 32.227 |
| 44246.393425925926 | 32.227 |
| 44246.43509259259 | 32.227 |
| 44246.47675925926 | 32.304 |
| 44246.518425925926 | 32.458 |
| 44246.56009259259 | 32.69 |
| 44246.60175925926 | 32.767 |
| 44246.643425925926 | 32.844 |
| 44246.68509259259 | 32.458 |
| 44246.72675925926 | 32.304 |
| 44246.768425925926 | 32.149 |
| 44246.81009259259 | 32.227 |
| 44246.85175925926 | 32.227 |
| 44246.893425925926 | 32.304 |
| 44246.93509259259 | 32.458 |
| 44246.97675925926 | 32.458 |
| 44247.018425925926 | 32.536 |
| 44247.06009259259 | 32.536 |
| 44247.10175925926 | 32.304 |
| 44247.143425925926 | 32.227 |
| 44247.18509259259 | 32.149 |
| 44247.22675925926 | 32.227 |
| 44247.268425925926 | 32.227 |
| 44247.31009259259 | 32.227 |
| 44247.35175925926 | 32.304 |
| 44247.393425925926 | 32.149 |
| 44247.43509259259 | 32.922 |
| 44247.47675925926 | 34.775 |
| 44247.518425925926 | 35.547 |
| 44247.56009259259 | 35.933 |
| 44247.60175925926 | 36.474 |
| 44247.643425925926 | 36.937 |
| 44247.68509259259 | 36.783 |
| 44247.72675925926 | 36.01 |
| 44247.768425925926 | 35.624 |
| 44247.81009259259 | 34.775 |
| 44247.85175925926 | 34.312 |
| 44247.893425925926 | 33.926 |
| 44247.93509259259 | 33.617 |
| 44247.97675925926 | 32.767 |
| 44248.018425925926 | 32.149 |
| 44248.06009259259 | 32.072 |
| 44248.10175925926 | 32.227 |
| 44248.143425925926 | 32.227 |
| 44248.18509259259 | 32.227 |
| 44248.22675925926 | 32.149 |
| 44248.268425925926 | 32.149 |
| 44248.31009259259 | 32.149 |
| 44248.35175925926 | 32.227 |
| 44248.393425925926 | 32.227 |
| 44248.43509259259 | 32.227 |
| 44248.47675925926 | 32.381 |
| 44248.518425925926 | 32.922 |
| 44248.56009259259 | 33.694 |
| 44248.60175925926 | 34.389 |
| 44248.643425925926 | 34.543 |
| 44248.68509259259 | 33.848 |
| 44248.72675925926 | 33.308 |
| 44248.768425925926 | 33.385 |
| 44248.81009259259 | 33.231 |
| 44248.85175925926 | 33.231 |
| 44248.893425925926 | 32.999 |
| 44248.93509259259 | 32.536 |
| 44248.97675925926 | 32.304 |
| 44249.018425925926 | 32.149 |
| 44249.06009259259 | 32.227 |
| 44249.10175925926 | 32.149 |
| 44249.143425925926 | 32.227 |
| 44249.18509259259 | 32.227 |
| 44249.22675925926 | 32.227 |
| 44249.268425925926 | 32.149 |
| 44249.31009259259 | 32.304 |
| 44249.35175925926 | 32.227 |
| 44249.393425925926 | 32.227 |
| 44249.43509259259 | 32.304 |
| 44249.47675925926 | 33.153 |
| 44249.518425925926 | 34.621 |
| 44249.56009259259 | 36.165 |
| 44249.60175925926 | 38.713 |
| 44249.643425925926 | 40.258 |
| 44249.68509259259 | 40.18 |
| 44249.72675925926 | 39.408 |
| 44249.768425925926 | 38.559 |
| 44249.81009259259 | 37.709 |
| 44249.85175925926 | 36.86 |
| 44249.893425925926 | 36.165 |
| 44249.93509259259 | 35.238 |
| 44249.97675925926 | 34.389 |
| 44250.018425925926 | 33.462 |
| 44250.06009259259 | 32.536 |
| 44250.10175925926 | 32.227 |
| 44250.143425925926 | 32.227 |
| 44250.18509259259 | 32.149 |
| 44250.22675925926 | 32.149 |
| 44250.268425925926 | 32.072 |
| 44250.31009259259 | 32.149 |
| 44250.35175925926 | 32.227 |
| 44250.393425925926 | 32.304 |
| 44250.43509259259 | 32.69 |
| 44250.47675925926 | 33.694 |
| 44250.518425925926 | 35.393 |
| 44250.56009259259 | 37.014 |
| 44250.60175925926 | 39.022 |
| 44250.643425925926 | 40.258 |
| 44250.68509259259 | 40.721 |
| 44250.72675925926 | 40.258 |
| 44250.768425925926 | 39.717 |
| 44250.81009259259 | 38.945 |
| 44250.85175925926 | 38.018 |
| 44250.893425925926 | 37.246 |
| 44250.93509259259 | 36.474 |
| 44250.97675925926 | 35.702 |
| 44251.018425925926 | 34.929 |
| 44251.06009259259 | 34.157 |
| 44251.10175925926 | 33.308 |
| 44251.143425925926 | 32.613 |
| 44251.18509259259 | 32.149 |
| 44251.22675925926 | 32.149 |
| 44251.268425925926 | 32.227 |
| 44251.31009259259 | 32.227 |
| 44251.35175925926 | 32.227 |
| 44251.393425925926 | 32.227 |
| 44251.43509259259 | 32.536 |
| 44251.47675925926 | 33.539 |
| 44251.518425925926 | 35.007 |
| 44251.56009259259 | 36.474 |
| 44251.60175925926 | 37.709 |
| 44251.643425925926 | 38.636 |
| 44251.68509259259 | 38.79 |
| 44251.72675925926 | 37.787 |
| 44251.768425925926 | 37.014 |
| 44251.81009259259 | 36.242 |
| 44251.85175925926 | 35.47 |
| 44251.893425925926 | 34.929 |
| 44251.93509259259 | 34.08 |
| 44251.97675925926 | 33.308 |
| 44252.018425925926 | 32.381 |
| 44252.06009259259 | 32.149 |
| 44252.10175925926 | 32.072 |
| 44252.143425925926 | 32.072 |
| 44252.18509259259 | 32.149 |
| 44252.22675925926 | 32.227 |
| 44252.268425925926 | 32.227 |
| 44252.31009259259 | 32.149 |
| 44252.35175925926 | 32.227 |
| 44252.393425925926 | 32.227 |
| 44252.43509259259 | 32.536 |
| 44252.47675925926 | 33.539 |
| 44252.518425925926 | 34.852 |
| 44252.56009259259 | 36.242 |
| 44252.60175925926 | 37.555 |
| 44252.643425925926 | 38.713 |
| 44252.68509259259 | 38.79 |
| 44252.72675925926 | 37.941 |
| 44252.768425925926 | 37.014 |
| 44252.81009259259 | 36.088 |
| 44252.85175925926 | 35.084 |
| 44252.893425925926 | 34.234 |
| 44252.93509259259 | 33.462 |
| 44252.97675925926 | 32.536 |
| 44253.018425925926 | 32.149 |
| 44253.06009259259 | 32.149 |
| 44253.10175925926 | 32.149 |
| 44253.143425925926 | 32.149 |
| 44253.18509259259 | 32.149 |
| 44253.22675925926 | 32.227 |
| 44253.268425925926 | 32.149 |
| 44253.31009259259 | 32.227 |
| 44253.35175925926 | 32.227 |
| 44253.393425925926 | 32.304 |
| 44253.43509259259 | 32.304 |
| 44253.47675925926 | 32.999 |
| 44253.518425925926 | 33.848 |
| 44253.56009259259 | 34.929 |
| 44253.60175925926 | 35.702 |
| 44253.643425925926 | 35.779 |
| 44253.68509259259 | 35.393 |
| 44253.72675925926 | 35.238 |
| 44253.768425925926 | 35.238 |
| 44253.81009259259 | 35.084 |
| 44253.85175925926 | 35.084 |
| 44253.893425925926 | 34.852 |
| 44253.93509259259 | 34.698 |
| 44253.97675925926 | 34.312 |
| 44254.018425925926 | 33.848 |
| 44254.06009259259 | 33.308 |
| 44254.10175925926 | 32.844 |
| 44254.143425925926 | 32.458 |
| 44254.18509259259 | 32.149 |
| 44254.22675925926 | 32.227 |
| 44254.268425925926 | 32.227 |
| 44254.31009259259 | 32.149 |
| 44254.35175925926 | 32.227 |
| 44254.393425925926 | 32.227 |
| 44254.43509259259 | 32.227 |
| 44254.47675925926 | 32.227 |
| 44254.518425925926 | 32.304 |
| 44254.56009259259 | 32.381 |
| 44254.60175925926 | 32.458 |
| 44254.643425925926 | 32.69 |
| 44254.68509259259 | 32.844 |
| 44254.72675925926 | 32.767 |
| 44254.768425925926 | 32.69 |
| 44254.81009259259 | 32.458 |
| 44254.85175925926 | 32.149 |
| 44254.893425925926 | 32.227 |
| 44254.93509259259 | 32.227 |
| 44254.97675925926 | 32.149 |
| 44255.018425925926 | 32.227 |
| 44255.06009259259 | 32.149 |
| 44255.10175925926 | 32.227 |
| 44255.143425925926 | 32.227 |
| 44255.18509259259 | 32.149 |
| 44255.22675925926 | 32.227 |
| 44255.268425925926 | 32.227 |
| 44255.31009259259 | 32.227 |
| 44255.35175925926 | 32.227 |
| 44255.393425925926 | 32.227 |
| 44255.43509259259 | 32.227 |
| 44255.47675925926 | 32.304 |
| 44255.518425925926 | 32.922 |
| 44255.56009259259 | 33.462 |
| 44255.60175925926 | 33.771 |
| 44255.643425925926 | 34.234 |
| 44255.68509259259 | 34.003 |
| 44255.72675925926 | 33.076 |
| 44255.768425925926 | 32.381 |
| 44255.81009259259 | 32.072 |
| 44255.85175925926 | 32.149 |
| 44255.893425925926 | 32.149 |
| 44255.93509259259 | 32.227 |
| 44255.97675925926 | 32.227 |
| 44256.018425925926 | 32.149 |
| 44256.06009259259 | 32.227 |
| 44256.10175925926 | 32.304 |
| 44256.143425925926 | 32.149 |
| 44256.18509259259 | 32.227 |
| 44256.22675925926 | 32.149 |
| 44256.268425925926 | 32.149 |
| 44256.31009259259 | 32.227 |
| 44256.35175925926 | 32.227 |
| 44256.393425925926 | 32.304 |
| 44256.43509259259 | 32.227 |
| 44256.47675925926 | 32.227 |
| 44256.518425925926 | 32.922 |
| 44256.56009259259 | 33.308 |
| 44256.60175925926 | 33.926 |
| 44256.643425925926 | 34.543 |
| 44256.68509259259 | 34.775 |
| 44256.72675925926 | 34.234 |
| 44256.768425925926 | 33.462 |
| 44256.81009259259 | 32.999 |
| 44256.85175925926 | 32.458 |
| 44256.893425925926 | 32.304 |
| 44256.93509259259 | 32.227 |
| 44256.97675925926 | 32.149 |
| 44257.018425925926 | 32.149 |
| 44257.06009259259 | 32.227 |
| 44257.10175925926 | 32.227 |
| 44257.143425925926 | 32.149 |
| 44257.18509259259 | 32.227 |
| 44257.22675925926 | 32.227 |
| 44257.268425925926 | 32.227 |
| 44257.31009259259 | 32.227 |
| 44257.35175925926 | 32.149 |
| 44257.393425925926 | 32.227 |
| 44257.43509259259 | 32.227 |
| 44257.47675925926 | 32.922 |
| 44257.518425925926 | 33.848 |
| 44257.56009259259 | 35.161 |
| 44257.60175925926 | 36.397 |
| 44257.643425925926 | 37.323 |
| 44257.68509259259 | 37.632 |
| 44257.72675925926 | 37.246 |
| 44257.768425925926 | 36.628 |
| 44257.81009259259 | 36.242 |
| 44257.85175925926 | 35.779 |
| 44257.893425925926 | 35.161 |
| 44257.93509259259 | 34.466 |
| 44257.97675925926 | 33.694 |
| 44258.018425925926 | 32.844 |
| 44258.06009259259 | 32.149 |
| 44258.10175925926 | 32.227 |
| 44258.143425925926 | 32.304 |
| 44258.18509259259 | 32.227 |
| 44258.22675925926 | 32.227 |
| 44258.268425925926 | 32.304 |
| 44258.31009259259 | 32.304 |
| 44258.35175925926 | 32.227 |
| 44258.393425925926 | 32.227 |
| 44258.43509259259 | 32.69 |
| 44258.47675925926 | 33.617 |
| 44258.518425925926 | 35.238 |
| 44258.56009259259 | 36.783 |
| 44258.60175925926 | 38.404 |
| 44258.643425925926 | 39.408 |
| 44258.68509259259 | 39.717 |
| 44258.72675925926 | 39.254 |
| 44258.768425925926 | 38.404 |
| 44258.81009259259 | 37.941 |
| 44258.85175925926 | 37.169 |
| 44258.893425925926 | 36.397 |
| 44258.93509259259 | 35.624 |
| 44258.97675925926 | 34.852 |
| 44259.018425925926 | 34.157 |
| 44259.06009259259 | 33.231 |
| 44259.10175925926 | 32.458 |
| 44259.143425925926 | 32.149 |
| 44259.18509259259 | 32.149 |
| 44259.22675925926 | 32.227 |
| 44259.268425925926 | 32.149 |
| 44259.31009259259 | 32.227 |
| 44259.35175925926 | 32.149 |
| 44259.393425925926 | 32.227 |
| 44259.43509259259 | 32.304 |
| 44259.47675925926 | 32.613 |
| 44259.518425925926 | 33.153 |
| 44259.56009259259 | 33.771 |
| 44259.60175925926 | 34.312 |
| 44259.643425925926 | 34.929 |
| 44259.68509259259 | 35.007 |
| 44259.72675925926 | 34.775 |
| 44259.768425925926 | 34.621 |
| 44259.81009259259 | 34.466 |
| 44259.85175925926 | 34.157 |
| 44259.893425925926 | 34.08 |
| 44259.93509259259 | 34.003 |
| 44259.97675925926 | 33.617 |
| 44260.018425925926 | 33.231 |
| 44260.06009259259 | 32.69 |
| 44260.10175925926 | 32.227 |
| 44260.143425925926 | 32.149 |
| 44260.18509259259 | 32.149 |
| 44260.22675925926 | 32.149 |
| 44260.268425925926 | 32.149 |
| 44260.31009259259 | 32.149 |
| 44260.35175925926 | 32.149 |
| 44260.393425925926 | 32.227 |
| 44260.43509259259 | 32.767 |
| 44260.47675925926 | 34.389 |
| 44260.518425925926 | 36.551 |
| 44260.56009259259 | 38.636 |
| 44260.60175925926 | 40.489 |
| 44260.643425925926 | 41.956 |
| 44260.68509259259 | 42.265 |
| 44260.72675925926 | 41.416 |
| 44260.768425925926 | 40.412 |
| 44260.81009259259 | 39.408 |
| 44260.85175925926 | 38.482 |
| 44260.893425925926 | 37.632 |
| 44260.93509259259 | 36.86 |
| 44260.97675925926 | 35.779 |
| 44261.018425925926 | 34.698 |
| 44261.06009259259 | 33.694 |
| 44261.10175925926 | 32.767 |
| 44261.143425925926 | 32.227 |
| 44261.18509259259 | 32.149 |
| 44261.22675925926 | 32.304 |
| 44261.268425925926 | 32.149 |
| 44261.31009259259 | 32.227 |
| 44261.35175925926 | 32.227 |
| 44261.393425925926 | 32.227 |
| 44261.43509259259 | 33.231 |
| 44261.47675925926 | 35.007 |
| 44261.518425925926 | 36.551 |
| 44261.56009259259 | 38.327 |
| 44261.60175925926 | 40.258 |
| 44261.643425925926 | 41.184 |
| 44261.68509259259 | 41.648 |
| 44261.72675925926 | 41.261 |
| 44261.768425925926 | 40.489 |
| 44261.81009259259 | 39.794 |
| 44261.85175925926 | 38.868 |
| 44261.893425925926 | 38.095 |
| 44261.93509259259 | 37.246 |
| 44261.97675925926 | 36.242 |
| 44262.018425925926 | 35.238 |
| 44262.06009259259 | 34.312 |
| 44262.10175925926 | 33.385 |
| 44262.143425925926 | 32.69 |
| 44262.18509259259 | 32.149 |
| 44262.22675925926 | 32.149 |
| 44262.268425925926 | 32.227 |
| 44262.31009259259 | 32.227 |
| 44262.35175925926 | 32.227 |
| 44262.393425925926 | 32.304 |
| 44262.43509259259 | 33.771 |
| 44262.47675925926 | 36.165 |
| 44262.518425925926 | 37.632 |
| 44262.56009259259 | 39.563 |
| 44262.60175925926 | 42.034 |
| 44262.643425925926 | 43.424 |
| 44262.68509259259 | 43.424 |
| 44262.72675925926 | 42.883 |
| 44262.768425925926 | 42.034 |
| 44262.81009259259 | 41.184 |
| 44262.85175925926 | 40.18 |
| 44262.893425925926 | 39.254 |
| 44262.93509259259 | 38.482 |
| 44262.97675925926 | 37.478 |
| 44263.018425925926 | 36.397 |
| 44263.06009259259 | 35.47 |
| 44263.10175925926 | 34.621 |
| 44263.143425925926 | 33.848 |
| 44263.18509259259 | 33.231 |
| 44263.22675925926 | 32.767 |
| 44263.268425925926 | 32.458 |
| 44263.31009259259 | 32.227 |
| 44263.35175925926 | 32.381 |
| 44263.393425925926 | 33.153 |
| 44263.43509259259 | 34.698 |
| 44263.47675925926 | 37.246 |
| 44263.518425925926 | 38.559 |
| 44263.56009259259 | 40.335 |
| 44263.60175925926 | 40.721 |
| 44263.643425925926 | 41.184 |
| 44263.68509259259 | 41.802 |
| 44263.72675925926 | 41.493 |
| 44263.768425925926 | 40.721 |
| 44263.81009259259 | 40.258 |
| 44263.85175925926 | 39.64 |
| 44263.893425925926 | 38.868 |
| 44263.93509259259 | 38.095 |
| 44263.97675925926 | 37.4 |
| 44264.018425925926 | 36.628 |
| 44264.06009259259 | 35.856 |
| 44264.10175925926 | 35.084 |
| 44264.143425925926 | 34.312 |
| 44264.18509259259 | 33.771 |
| 44264.22675925926 | 33.153 |
| 44264.268425925926 | 32.613 |
| 44264.31009259259 | 32.304 |
| 44264.35175925926 | 32.458 |
| 44264.393425925926 | 33.848 |
| 44264.43509259259 | 35.779 |
| 44264.47675925926 | 38.404 |
| 44264.518425925926 | 40.875 |
| 44264.56009259259 | 43.269 |
| 44264.60175925926 | 45.045 |
| 44264.643425925926 | 45.663 |
| 44264.68509259259 | 45.354 |
| 44264.72675925926 | 44.505 |
| 44264.768425925926 | 43.733 |
| 44264.81009259259 | 42.729 |
| 44264.85175925926 | 41.725 |
| 44264.893425925926 | 40.644 |
| 44264.93509259259 | 39.563 |
| 44264.97675925926 | 38.713 |
| 44265.018425925926 | 37.709 |
| 44265.06009259259 | 36.705 |
| 44265.10175925926 | 35.702 |
| 44265.143425925926 | 35.315 |
| 44265.18509259259 | 34.698 |
| 44265.22675925926 | 34.312 |
| 44265.268425925926 | 33.848 |
| 44265.31009259259 | 33.153 |
| 44265.35175925926 | 33.153 |
| 44265.393425925926 | 33.231 |
| 44265.43509259259 | 34.157 |
| 44265.47675925926 | 36.088 |
| 44265.518425925926 | 37.709 |
| 44265.56009259259 | 38.482 |
| 44265.60175925926 | 39.099 |
| 44265.643425925926 | 39.64 |
| 44265.68509259259 | 39.177 |
| 44265.72675925926 | 39.177 |
| 44265.768425925926 | 38.327 |
| 44265.81009259259 | 37.092 |
| 44265.85175925926 | 36.319 |
| 44265.893425925926 | 35.547 |
| 44265.93509259259 | 34.543 |
| 44265.97675925926 | 33.617 |
| 44266.018425925926 | 32.536 |
| 44266.06009259259 | 32.227 |
| 44266.10175925926 | 32.149 |
| 44266.143425925926 | 32.227 |
| 44266.18509259259 | 32.149 |
| 44266.22675925926 | 32.149 |
| 44266.268425925926 | 32.149 |
| 44266.31009259259 | 32.227 |
| 44266.35175925926 | 32.149 |
| 44266.393425925926 | 32.149 |
| 44266.43509259259 | 32.767 |
| 44266.47675925926 | 33.848 |
| 44266.518425925926 | 34.621 |
| 44266.56009259259 | 35.856 |
| 44266.60175925926 | 36.783 |
| 44266.643425925926 | 37.787 |
| 44266.68509259259 | 38.868 |
| 44266.72675925926 | 38.79 |
| 44266.768425925926 | 38.173 |
| 44266.81009259259 | 37.555 |
| 44266.85175925926 | 36.628 |
| 44266.893425925926 | 35.702 |
| 44266.93509259259 | 35.007 |
| 44266.97675925926 | 34.157 |
| 44267.018425925926 | 33.539 |
| 44267.06009259259 | 32.844 |
| 44267.10175925926 | 32.381 |
| 44267.143425925926 | 32.227 |
| 44267.18509259259 | 32.227 |
| 44267.22675925926 | 32.149 |
| 44267.268425925926 | 32.149 |
| 44267.31009259259 | 32.149 |
| 44267.35175925926 | 32.149 |
| 44267.393425925926 | 32.304 |
| 44267.43509259259 | 33.462 |
| 44267.47675925926 | 35.547 |
| 44267.518425925926 | 37.555 |
| 44267.56009259259 | 39.177 |
| 44267.60175925926 | 40.335 |
| 44267.643425925926 | 40.798 |
| 44267.68509259259 | 40.875 |
| 44267.72675925926 | 40.489 |
| 44267.768425925926 | 39.717 |
| 44267.81009259259 | 39.099 |
| 44267.85175925926 | 38.404 |
| 44267.893425925926 | 37.555 |
| 44267.93509259259 | 36.783 |
| 44267.97675925926 | 36.01 |
| 44268.018425925926 | 35.238 |
| 44268.06009259259 | 34.543 |
| 44268.10175925926 | 33.848 |
| 44268.143425925926 | 33.076 |
| 44268.18509259259 | 32.613 |
| 44268.22675925926 | 32.381 |
| 44268.268425925926 | 32.227 |
| 44268.31009259259 | 32.458 |
| 44268.35175925926 | 32.999 |
| 44268.393425925926 | 34.08 |
| 44268.43509259259 | 35.547 |
| 44268.47675925926 | 36.628 |
| 44268.518425925926 | 38.173 |
| 44268.56009259259 | 39.099 |
| 44268.60175925926 | 39.022 |
| 44268.643425925926 | 39.177 |
| 44268.68509259259 | 39.177 |
| 44268.72675925926 | 38.79 |
| 44268.768425925926 | 38.173 |
| 44268.81009259259 | 37.555 |
| 44268.85175925926 | 37.014 |
| 44268.893425925926 | 36.474 |
| 44268.93509259259 | 35.779 |
| 44268.97675925926 | 35.007 |
| 44269.018425925926 | 34.389 |
| 44269.06009259259 | 34.003 |
| 44269.143425925926 | 33.462 |
| 44269.18509259259 | 33.231 |
| 44269.22675925926 | 32.844 |
| 44269.268425925926 | 32.458 |
| 44269.31009259259 | 32.227 |
| 44269.35175925926 | 32.227 |
| 44269.393425925926 | 32.149 |
| 44269.43509259259 | 32.227 |
| 44269.47675925926 | 32.304 |
| 44269.518425925926 | 32.536 |
| 44269.56009259259 | 32.536 |
| 44269.60175925926 | 33.231 |
| 44269.643425925926 | 34.234 |
| 44269.68509259259 | 34.621 |
| 44269.72675925926 | 34.466 |
| 44269.768425925926 | 34.389 |
| 44269.81009259259 | 33.771 |
| 44269.85175925926 | 33.385 |
| 44269.893425925926 | 32.922 |
| 44269.93509259259 | 32.767 |
| 44269.97675925926 | 32.458 |
| 44270.018425925926 | 32.227 |
| 44270.06009259259 | 32.227 |
| 44270.10175925926 | 32.227 |
| 44270.143425925926 | 32.227 |
| 44270.18509259259 | 32.227 |
| 44270.22675925926 | 32.227 |
| 44270.268425925926 | 32.149 |
| 44270.31009259259 | 32.227 |
| 44270.35175925926 | 32.227 |
| 44270.393425925926 | 32.072 |
| 44270.43509259259 | 32.227 |
| 44270.47675925926 | 32.227 |
| 44270.518425925926 | 32.69 |
| 44270.56009259259 | 34.003 |
| 44270.60175925926 | 35.856 |
| 44270.643425925926 | 37.092 |
| 44270.68509259259 | 38.636 |
| 44270.72675925926 | 38.945 |
| 44270.768425925926 | 38.79 |
| 44270.81009259259 | 38.482 |
| 44270.85175925926 | 38.095 |
| 44270.893425925926 | 37.4 |
| 44270.93509259259 | 36.783 |
| 44270.97675925926 | 36.165 |
| 44271.018425925926 | 35.47 |
| 44271.06009259259 | 34.929 |
| 44271.10175925926 | 34.389 |
| 44271.143425925926 | 33.771 |
| 44271.18509259259 | 33.153 |
| 44271.22675925926 | 32.767 |
| 44271.268425925926 | 32.227 |
| 44271.31009259259 | 32.227 |
| 44271.35175925926 | 32.149 |
| 44271.393425925926 | 32.149 |
| 44271.43509259259 | 33.308 |
| 44271.47675925926 | 35.238 |
| 44271.518425925926 | 37.014 |
| 44271.56009259259 | 38.945 |
| 44271.60175925926 | 39.872 |
| 44271.643425925926 | 39.563 |
| 44271.68509259259 | 39.331 |
| 44271.72675925926 | 37.864 |
| 44271.768425925926 | 37.555 |
| 44271.81009259259 | 37.169 |
| 44271.85175925926 | 36.628 |
| 44271.893425925926 | 36.397 |
| 44271.93509259259 | 35.933 |
| 44271.97675925926 | 35.393 |
| 44272.018425925926 | 34.852 |
| 44272.06009259259 | 34.389 |
| 44272.10175925926 | 33.926 |
| 44272.143425925926 | 33.771 |
| 44272.18509259259 | 33.385 |
| 44272.22675925926 | 33.231 |
| 44272.268425925926 | 33.076 |
| 44272.31009259259 | 32.844 |
| 44272.35175925926 | 32.69 |
| 44272.393425925926 | 32.999 |
| 44272.43509259259 | 33.308 |
| 44272.47675925926 | 34.466 |
| 44272.518425925926 | 35.624 |
| 44272.56009259259 | 37.864 |
| 44272.60175925926 | 40.412 |
| 44272.643425925926 | 42.42 |
| 44272.68509259259 | 43.655 |
| 44272.72675925926 | 43.424 |
| 44272.768425925926 | 42.111 |
| 44272.81009259259 | 40.798 |
| 44272.85175925926 | 39.794 |
| 44272.893425925926 | 38.713 |
| 44272.93509259259 | 37.632 |
| 44272.97675925926 | 36.705 |
| 44273.018425925926 | 35.547 |
| 44273.06009259259 | 34.312 |
| 44273.10175925926 | 33.153 |
| 44273.143425925926 | 32.227 |
| 44273.18509259259 | 32.149 |
| 44273.22675925926 | 32.227 |
| 44273.268425925926 | 32.149 |
| 44273.31009259259 | 32.227 |
| 44273.35175925926 | 32.227 |
| 44273.393425925926 | 32.227 |
| 44273.43509259259 | 32.381 |
| 44273.47675925926 | 33.617 |
| 44273.518425925926 | 35.547 |
| 44273.56009259259 | 37.709 |
| 44273.60175925926 | 40.026 |
| 44273.643425925926 | 41.956 |
| 44273.68509259259 | 43.655 |
| 44273.72675925926 | 44.119 |
| 44273.768425925926 | 43.501 |
| 44273.81009259259 | 42.651 |
| 44273.85175925926 | 41.879 |
| 44273.893425925926 | 41.03 |
| 44273.93509259259 | 40.258 |
| 44273.97675925926 | 39.408 |
| 44274.018425925926 | 38.404 |
| 44274.06009259259 | 37.323 |
| 44274.10175925926 | 36.242 |
| 44274.143425925926 | 35.238 |
| 44274.18509259259 | 34.312 |
| 44274.22675925926 | 33.539 |
| 44274.268425925926 | 32.844 |
| 44274.31009259259 | 32.381 |
| 44274.35175925926 | 32.227 |
| 44274.393425925926 | 32.767 |
| 44274.43509259259 | 34.312 |
| 44274.47675925926 | 36.397 |
| 44274.518425925926 | 39.022 |
| 44274.56009259259 | 41.725 |
| 44274.60175925926 | 44.273 |
| 44274.643425925926 | 45.895 |
| 44274.68509259259 | 45.895 |
| 44274.72675925926 | 45.895 |
| 44274.768425925926 | 45.431 |
| 44274.81009259259 | 44.505 |
| 44274.85175925926 | 43.733 |
| 44274.893425925926 | 42.651 |
| 44274.93509259259 | 41.493 |
| 44274.97675925926 | 40.412 |
| 44275.018425925926 | 39.331 |
| 44275.06009259259 | 38.173 |
| 44275.10175925926 | 36.937 |
| 44275.143425925926 | 35.933 |
| 44275.18509259259 | 34.929 |
| 44275.22675925926 | 34.312 |
| 44275.268425925926 | 33.771 |
| 44275.31009259259 | 33.308 |
| 44275.35175925926 | 32.999 |
| 44275.393425925926 | 33.848 |
| 44275.43509259259 | 35.161 |
| 44275.47675925926 | 37.632 |
| 44275.518425925926 | 40.18 |
| 44275.56009259259 | 42.729 |
| 44275.60175925926 | 45.2 |
| 44275.643425925926 | 46.976 |
| 44275.68509259259 | 47.671 |
| 44275.72675925926 | 47.13 |
| 44275.768425925926 | 46.204 |
| 44275.81009259259 | 44.814 |
| 44275.85175925926 | 43.578 |
| 44275.893425925926 | 42.574 |
| 44275.93509259259 | 41.725 |
| 44275.97675925926 | 40.875 |
| 44276.018425925926 | 39.949 |
| 44276.06009259259 | 38.482 |
| 44276.10175925926 | 36.319 |
| 44276.143425925926 | 35.084 |
| 44276.18509259259 | 34.543 |
| 44276.22675925926 | 34.08 |
| 44276.268425925926 | 33.539 |
| 44276.31009259259 | 33.231 |
| 44276.35175925926 | 32.999 |
| 44276.393425925926 | 33.153 |
| 44276.43509259259 | 34.621 |
| 44276.47675925926 | 37.169 |
| 44276.518425925926 | 39.254 |
| 44276.56009259259 | 39.872 |
| 44276.60175925926 | 40.335 |
| 44276.643425925926 | 42.265 |
| 44276.68509259259 | 42.729 |
| 44276.72675925926 | 41.648 |
| 44276.768425925926 | 40.875 |
| 44276.81009259259 | 40.18 |
| 44276.85175925926 | 39.254 |
| 44276.893425925926 | 38.327 |
| 44276.93509259259 | 37.555 |
| 44276.97675925926 | 36.86 |
| 44277.018425925926 | 35.933 |
| 44277.06009259259 | 35.084 |
| 44277.10175925926 | 34.157 |
| 44277.143425925926 | 33.385 |
| 44277.18509259259 | 33.153 |
| 44277.22675925926 | 32.613 |
| 44277.268425925926 | 32.304 |
| 44277.31009259259 | 32.227 |
| 44277.35175925926 | 32.536 |
| 44277.393425925926 | 33.231 |
| 44277.43509259259 | 34.621 |
| 44277.47675925926 | 36.783 |
| 44277.518425925926 | 39.331 |
| 44277.56009259259 | 41.107 |
| 44277.60175925926 | 42.96 |
| 44277.643425925926 | 44.041 |
| 44277.68509259259 | 44.273 |
| 44277.72675925926 | 44.196 |
| 44277.768425925926 | 43.424 |
| 44277.81009259259 | 42.42 |
| 44277.85175925926 | 41.416 |
| 44277.893425925926 | 40.567 |
| 44277.93509259259 | 39.717 |
| 44277.97675925926 | 38.868 |
| 44278.018425925926 | 37.787 |
| 44278.06009259259 | 36.705 |
| 44278.10175925926 | 35.547 |
| 44278.143425925926 | 34.543 |
| 44278.18509259259 | 33.539 |
| 44278.22675925926 | 32.844 |
| 44278.268425925926 | 32.536 |
| 44278.31009259259 | 32.149 |
| 44278.35175925926 | 32.149 |
| 44278.393425925926 | 32.613 |
| 44278.43509259259 | 33.308 |
| 44278.47675925926 | 34.621 |
| 44278.518425925926 | 36.088 |
| 44278.56009259259 | 37.555 |
| 44278.60175925926 | 39.872 |
| 44278.643425925926 | 40.875 |
| 44278.68509259259 | 41.107 |
| 44278.72675925926 | 40.875 |
| 44278.768425925926 | 40.18 |
| 44278.81009259259 | 39.485 |
| 44278.85175925926 | 38.559 |
| 44278.893425925926 | 37.787 |
| 44278.93509259259 | 37.092 |
| 44278.97675925926 | 36.474 |
| 44279.018425925926 | 35.933 |
| 44279.06009259259 | 35.393 |
| 44279.10175925926 | 34.775 |
| 44279.143425925926 | 34.234 |
| 44279.18509259259 | 33.617 |
| 44279.22675925926 | 33.153 |
| 44279.268425925926 | 32.613 |
| 44279.31009259259 | 32.304 |
| 44279.35175925926 | 32.227 |
| 44279.393425925926 | 32.536 |
| 44279.43509259259 | 33.848 |
| 44279.47675925926 | 35.856 |
| 44279.518425925926 | 38.018 |
| 44279.56009259259 | 39.254 |
| 44279.60175925926 | 40.953 |
| 44279.643425925926 | 42.343 |
| 44279.68509259259 | 42.806 |
| 44279.72675925926 | 42.651 |
| 44279.768425925926 | 42.034 |
| 44279.81009259259 | 41.107 |
| 44279.85175925926 | 40.103 |
| 44279.893425925926 | 39.331 |
| 44279.93509259259 | 38.482 |
| 44279.97675925926 | 37.632 |
| 44280.018425925926 | 36.937 |
| 44280.06009259259 | 35.933 |
| 44280.10175925926 | 34.929 |
| 44280.143425925926 | 34.234 |
| 44280.18509259259 | 33.694 |
| 44280.22675925926 | 33.308 |
| 44280.268425925926 | 32.999 |
| 44280.31009259259 | 32.767 |
| 44280.35175925926 | 32.844 |
| 44280.393425925926 | 33.308 |
| 44280.43509259259 | 33.926 |
| 44280.47675925926 | 35.007 |
| 44280.518425925926 | 36.01 |
| 44280.56009259259 | 37.323 |
| 44280.60175925926 | 39.485 |
| 44280.643425925926 | 41.416 |
| 44280.68509259259 | 42.729 |
| 44280.72675925926 | 43.346 |
| 44280.768425925926 | 42.574 |
| 44280.81009259259 | 41.57 |
| 44280.85175925926 | 40.644 |
| 44280.893425925926 | 39.794 |
| 44280.93509259259 | 39.099 |
| 44280.97675925926 | 38.327 |
| 44281.018425925926 | 37.632 |
| 44281.06009259259 | 36.86 |
| 44281.10175925926 | 36.165 |
| 44281.143425925926 | 35.238 |
| 44281.18509259259 | 34.466 |
| 44281.22675925926 | 33.926 |
| 44281.268425925926 | 33.385 |
| 44281.31009259259 | 32.999 |
| 44281.35175925926 | 32.844 |
| 44281.393425925926 | 33.153 |
| 44281.43509259259 | 34.157 |
| 44281.47675925926 | 35.393 |
| 44281.518425925926 | 36.86 |
| 44281.56009259259 | 38.482 |
| 44281.60175925926 | 40.026 |
| 44281.643425925926 | 40.953 |
| 44281.68509259259 | 41.184 |
| 44281.72675925926 | 40.875 |
| 44281.768425925926 | 40.335 |
| 44281.81009259259 | 39.64 |
| 44281.85175925926 | 38.79 |
| 44281.893425925926 | 37.941 |
| 44281.93509259259 | 37.4 |
| 44281.97675925926 | 36.705 |
| 44282.018425925926 | 36.088 |
| 44282.06009259259 | 35.393 |
| 44282.10175925926 | 34.543 |
| 44282.143425925926 | 33.617 |
| 44282.18509259259 | 32.922 |
| 44282.22675925926 | 32.536 |
| 44282.268425925926 | 32.149 |
| 44282.31009259259 | 32.304 |
| 44282.35175925926 | 32.149 |
| 44282.393425925926 | 32.381 |
| 44282.43509259259 | 33.153 |
| 44282.47675925926 | 34.621 |
| 44282.518425925926 | 37.246 |
| 44282.56009259259 | 40.258 |
| 44282.60175925926 | 42.651 |
| 44282.643425925926 | 44.196 |
| 44282.68509259259 | 45.509 |
| 44282.72675925926 | 45.277 |
| 44282.768425925926 | 44.428 |
| 44282.81009259259 | 43.038 |
| 44282.85175925926 | 41.339 |
| 44282.893425925926 | 40.258 |
| 44282.93509259259 | 39.177 |
| 44282.97675925926 | 38.25 |
| 44283.018425925926 | 37.246 |
| 44283.06009259259 | 36.088 |
| 44283.10175925926 | 34.775 |
| 44283.143425925926 | 33.694 |
| 44283.18509259259 | 32.69 |
| 44283.22675925926 | 32.227 |
| 44283.268425925926 | 32.149 |
| 44283.31009259259 | 32.227 |
| 44283.35175925926 | 32.227 |
| 44283.393425925926 | 32.227 |
| 44283.43509259259 | 33.231 |
| 44283.47675925926 | 35.47 |
| 44283.518425925926 | 37.864 |
| 44283.56009259259 | 40.721 |
| 44283.60175925926 | 43.269 |
| 44283.643425925926 | 45.586 |
| 44283.68509259259 | 47.053 |
| 44283.72675925926 | 47.439 |
| 44283.768425925926 | 46.435 |
| 44283.81009259259 | 45.045 |
| 44283.85175925926 | 43.887 |
| 44283.893425925926 | 42.806 |
| 44283.93509259259 | 41.57 |
| 44283.97675925926 | 40.412 |
| 44284.018425925926 | 39.331 |
| 44284.06009259259 | 38.095 |
| 44284.10175925926 | 36.86 |
| 44284.143425925926 | 35.702 |
| 44284.18509259259 | 34.698 |
| 44284.22675925926 | 34.003 |
| 44284.268425925926 | 33.308 |
| 44284.31009259259 | 32.767 |
| 44284.35175925926 | 32.767 |
| 44284.393425925926 | 33.462 |
| 44284.43509259259 | 35.315 |
| 44284.47675925926 | 37.864 |
| 44284.518425925926 | 40.489 |
| 44284.56009259259 | 43.424 |
| 44284.60175925926 | 45.972 |
| 44284.643425925926 | 47.825 |
| 44284.68509259259 | 48.366 |
| 44284.72675925926 | 47.748 |
| 44284.768425925926 | 46.976 |
| 44284.81009259259 | 46.049 |
| 44284.85175925926 | 44.659 |
| 44284.893425925926 | 42.574 |
| 44284.93509259259 | 40.875 |
| 44284.97675925926 | 39.177 |
| 44285.018425925926 | 37.941 |
| 44285.06009259259 | 35.933 |
| 44285.10175925926 | 34.389 |
| 44285.143425925926 | 33.153 |
| 44285.18509259259 | 32.227 |
| 44285.22675925926 | 32.149 |
| 44285.268425925926 | 32.227 |
| 44285.31009259259 | 32.149 |
| 44285.35175925926 | 32.227 |
| 44285.393425925926 | 32.227 |
| 44285.43509259259 | 32.536 |
| 44285.47675925926 | 34.157 |
| 44285.518425925926 | 36.397 |
| 44285.56009259259 | 38.559 |
| 44285.60175925926 | 40.644 |
| 44285.643425925926 | 41.107 |
| 44285.68509259259 | 40.953 |
| 44285.72675925926 | 40.489 |
| 44285.768425925926 | 39.949 |
| 44285.81009259259 | 39.022 |
| 44285.85175925926 | 38.095 |
| 44285.893425925926 | 37.092 |
| 44285.93509259259 | 35.856 |
| 44285.97675925926 | 34.698 |
| 44286.018425925926 | 33.694 |
| 44286.06009259259 | 32.999 |
| 44286.10175925926 | 32.304 |
| 44286.143425925926 | 32.227 |
| 44286.18509259259 | 32.227 |
| 44286.22675925926 | 32.149 |
| 44286.268425925926 | 32.227 |
| 44286.31009259259 | 32.149 |
| 44286.35175925926 | 32.227 |
| 44286.393425925926 | 32.149 |
| 44286.43509259259 | 32.536 |
| 44286.47675925926 | 33.848 |
| 44286.518425925926 | 35.856 |
| 44286.56009259259 | 37.941 |
| 44286.60175925926 | 40.258 |
| 44286.643425925926 | 42.188 |
| 44286.68509259259 | 43.733 |
| 44286.72675925926 | 44.041 |
| 44286.768425925926 | 43.115 |
| 44286.81009259259 | 42.034 |
| 44286.85175925926 | 40.953 |
| 44286.893425925926 | 39.872 |
| 44286.93509259259 | 38.636 |
| 44286.97675925926 | 37.632 |
| 44287.018425925926 | 36.474 |
| 44287.06009259259 | 35.315 |
| 44287.10175925926 | 34.234 |
| 44287.143425925926 | 33.153 |
| 44287.18509259259 | 32.304 |
| 44287.22675925926 | 32.149 |
| 44287.268425925926 | 32.072 |
| 44287.31009259259 | 32.149 |
| 44287.35175925926 | 32.227 |
| 44287.393425925926 | 32.149 |
| 44287.43509259259 | 33.153 |
| 44287.47675925926 | 35.315 |
| 44287.518425925926 | 37.709 |
| 44287.56009259259 | 40.567 |
| 44287.60175925926 | 43.424 |
| 44287.643425925926 | 45.895 |
| 44287.68509259259 | 47.594 |
| 44287.72675925926 | 47.98 |
| 44287.768425925926 | 47.13 |
| 44287.81009259259 | 45.586 |
| 44287.85175925926 | 44.273 |
| 44287.893425925926 | 42.96 |
| 44287.93509259259 | 41.802 |
| 44287.97675925926 | 40.567 |
| 44288.018425925926 | 39.254 |
| 44288.06009259259 | 37.864 |
| 44288.10175925926 | 36.474 |
| 44288.143425925926 | 35.47 |
| 44288.18509259259 | 34.543 |
| 44288.22675925926 | 33.694 |
| 44288.268425925926 | 32.999 |
| 44288.31009259259 | 32.536 |
| 44288.35175925926 | 32.381 |
| 44288.393425925926 | 33.231 |
| 44288.43509259259 | 35.161 |
| 44288.47675925926 | 37.709 |
| 44288.518425925926 | 40.644 |
| 44288.56009259259 | 43.733 |
| 44288.60175925926 | 46.513 |
| 44288.643425925926 | 48.597 |
| 44288.68509259259 | 49.756 |
| 44288.72675925926 | 49.756 |
| 44288.768425925926 | 48.752 |
| 44288.81009259259 | 47.362 |
| 44288.85175925926 | 45.895 |
| 44288.893425925926 | 44.505 |
| 44288.93509259259 | 43.269 |
| 44288.97675925926 | 41.956 |
| 44289.018425925926 | 40.567 |
| 44289.06009259259 | 39.177 |
| 44289.10175925926 | 37.864 |
| 44289.143425925926 | 36.783 |
| 44289.18509259259 | 35.702 |
| 44289.22675925926 | 35.007 |
| 44289.268425925926 | 34.389 |
| 44289.31009259259 | 33.771 |
| 44289.35175925926 | 33.617 |
| 44289.393425925926 | 34.389 |
| 44289.43509259259 | 36.319 |
| 44289.47675925926 | 38.945 |
| 44289.518425925926 | 41.956 |
| 44289.56009259259 | 44.968 |
| 44289.60175925926 | 47.594 |
| 44289.643425925926 | 49.679 |
| 44289.68509259259 | 50.605 |
| 44289.72675925926 | 50.528 |
| 44289.768425925926 | 49.37 |
| 44289.81009259259 | 47.748 |
| 44289.85175925926 | 46.358 |
| 44289.893425925926 | 44.968 |
| 44289.93509259259 | 43.578 |
| 44289.97675925926 | 42.188 |
| 44290.018425925926 | 40.721 |
| 44290.06009259259 | 39.254 |
| 44290.10175925926 | 38.095 |
| 44290.143425925926 | 36.937 |
| 44290.18509259259 | 36.01 |
| 44290.22675925926 | 35.161 |
| 44290.268425925926 | 34.698 |
| 44290.31009259259 | 34.157 |
| 44290.35175925926 | 34.08 |
| 44290.393425925926 | 34.929 |
| 44290.43509259259 | 36.705 |
| 44290.47675925926 | 38.636 |
| 44290.518425925926 | 40.489 |
| 44290.56009259259 | 42.343 |
| 44290.60175925926 | 44.814 |
| 44290.643425925926 | 45.972 |
| 44290.68509259259 | 46.744 |
| 44290.72675925926 | 47.748 |
| 44290.768425925926 | 48.134 |
| 44290.81009259259 | 47.439 |
| 44290.85175925926 | 46.667 |
| 44290.893425925926 | 45.277 |
| 44290.93509259259 | 43.81 |
| 44290.97675925926 | 42.265 |
| 44291.018425925926 | 40.644 |
| 44291.06009259259 | 39.331 |
| 44291.10175925926 | 38.095 |
| 44291.143425925926 | 37.169 |
| 44291.18509259259 | 36.242 |
| 44291.22675925926 | 35.624 |
| 44291.268425925926 | 35.007 |
| 44291.31009259259 | 34.543 |
| 44291.35175925926 | 34.543 |
| 44291.393425925926 | 35.393 |
| 44291.43509259259 | 37.169 |
| 44291.47675925926 | 39.408 |
| 44291.518425925926 | 41.339 |
| 44291.56009259259 | 44.582 |
| 44291.60175925926 | 47.285 |
| 44291.643425925926 | 48.829 |
| 44291.68509259259 | 50.065 |
| 44291.72675925926 | 49.756 |
| 44291.768425925926 | 48.752 |
| 44291.81009259259 | 47.285 |
| 44291.85175925926 | 45.818 |
| 44291.893425925926 | 44.273 |
| 44291.93509259259 | 42.806 |
| 44291.97675925926 | 41.416 |
| 44292.018425925926 | 39.872 |
| 44292.06009259259 | 38.713 |
| 44292.10175925926 | 37.709 |
| 44292.143425925926 | 37.092 |
| 44292.18509259259 | 36.397 |
| 44292.22675925926 | 35.624 |
| 44292.268425925926 | 35.238 |
| 44292.31009259259 | 34.852 |
| 44292.35175925926 | 34.929 |
| 44292.393425925926 | 35.779 |
| 44292.43509259259 | 37.632 |
| 44292.47675925926 | 39.485 |
| 44292.518425925926 | 40.953 |
| 44292.56009259259 | 42.806 |
| 44292.60175925926 | 43.578 |
| 44292.643425925926 | 43.655 |
| 44292.68509259259 | 43.655 |
| 44292.72675925926 | 42.729 |
| 44292.768425925926 | 41.725 |
| 44292.81009259259 | 40.412 |
| 44292.85175925926 | 39.485 |
| 44292.893425925926 | 38.636 |
| 44292.93509259259 | 37.787 |
| 44292.97675925926 | 37.014 |
| 44293.018425925926 | 36.319 |
| 44293.06009259259 | 35.856 |
| 44293.10175925926 | 35.238 |
| 44293.143425925926 | 34.852 |
| 44293.18509259259 | 34.621 |
| 44293.22675925926 | 34.234 |
| 44293.268425925926 | 34.157 |
| 44293.31009259259 | 34.003 |
| 44293.35175925926 | 34.157 |
| 44293.393425925926 | 34.852 |
| 44293.43509259259 | 35.933 |
| 44293.47675925926 | 38.79 |
| 44293.518425925926 | 41.416 |
| 44293.56009259259 | 43.733 |
| 44293.60175925926 | 44.736 |
| 44293.643425925926 | 45.818 |
| 44293.68509259259 | 46.976 |
| 44293.72675925926 | 46.435 |
| 44293.768425925926 | 45.123 |
| 44293.81009259259 | 44.273 |
| 44293.85175925926 | 43.501 |
| 44293.893425925926 | 42.343 |
| 44293.93509259259 | 40.798 |
| 44293.97675925926 | 39.64 |
| 44294.018425925926 | 38.482 |
| 44294.06009259259 | 37.478 |
| 44294.10175925926 | 36.551 |
| 44294.143425925926 | 35.702 |
| 44294.18509259259 | 35.084 |
| 44294.22675925926 | 34.621 |
| 44294.268425925926 | 34.157 |
| 44294.31009259259 | 34.157 |
| 44294.35175925926 | 34.389 |
| 44294.393425925926 | 35.47 |
| 44294.43509259259 | 36.397 |
| 44294.47675925926 | 37.4 |
| 44294.518425925926 | 39.64 |
| 44294.56009259259 | 42.188 |
| 44294.60175925926 | 44.968 |
| 44294.643425925926 | 46.821 |
| 44294.68509259259 | 47.13 |
| 44294.72675925926 | 45.818 |
| 44294.768425925926 | 45.045 |
| 44294.81009259259 | 44.35 |
| 44294.85175925926 | 43.424 |
| 44294.893425925926 | 42.497 |
| 44294.93509259259 | 41.57 |
| 44294.97675925926 | 40.644 |
| 44295.018425925926 | 39.717 |
| 44295.06009259259 | 38.79 |
| 44295.10175925926 | 37.864 |
| 44295.143425925926 | 36.783 |
| 44295.18509259259 | 36.01 |
| 44295.22675925926 | 35.393 |
| 44295.268425925926 | 34.775 |
| 44295.31009259259 | 34.08 |
| 44295.35175925926 | 33.926 |
| 44295.393425925926 | 34.312 |
| 44295.43509259259 | 35.624 |
| 44295.47675925926 | 37.014 |
| 44295.518425925926 | 38.79 |
| 44295.56009259259 | 42.574 |
| 44295.60175925926 | 44.814 |
| 44295.643425925926 | 46.744 |
| 44295.68509259259 | 47.902 |
| 44295.72675925926 | 47.748 |
| 44295.768425925926 | 46.358 |
| 44295.81009259259 | 44.582 |
| 44295.85175925926 | 43.115 |
| 44295.893425925926 | 41.802 |
| 44295.93509259259 | 40.644 |
| 44295.97675925926 | 39.485 |
| 44296.018425925926 | 38.404 |
| 44296.06009259259 | 37.246 |
| 44296.10175925926 | 36.165 |
| 44296.143425925926 | 35.238 |
| 44296.18509259259 | 34.389 |
| 44296.22675925926 | 33.694 |
| 44296.268425925926 | 33.153 |
| 44296.31009259259 | 32.69 |
| 44296.35175925926 | 32.767 |
| 44296.393425925926 | 33.771 |
| 44296.43509259259 | 35.856 |
| 44296.47675925926 | 38.25 |
| 44296.518425925926 | 41.03 |
| 44296.56009259259 | 44.041 |
| 44296.60175925926 | 46.744 |
| 44296.643425925926 | 48.597 |
| 44296.68509259259 | 49.292 |
| 44296.72675925926 | 48.906 |
| 44296.768425925926 | 47.748 |
| 44296.81009259259 | 46.435 |
| 44296.85175925926 | 45.2 |
| 44296.893425925926 | 44.041 |
| 44296.93509259259 | 42.729 |
| 44296.97675925926 | 41.416 |
| 44297.018425925926 | 40.18 |
| 44297.06009259259 | 38.79 |
| 44297.10175925926 | 37.632 |
| 44297.143425925926 | 36.551 |
| 44297.18509259259 | 35.702 |
| 44297.22675925926 | 35.007 |
| 44297.268425925926 | 34.234 |
| 44297.31009259259 | 33.848 |
| 44297.35175925926 | 33.926 |
| 44297.393425925926 | 35.007 |
| 44297.43509259259 | 36.937 |
| 44297.47675925926 | 39.177 |
| 44297.518425925926 | 41.57 |
| 44297.56009259259 | 44.428 |
| 44297.60175925926 | 47.285 |
| 44297.643425925926 | 48.984 |
| 44297.68509259259 | 49.215 |
| 44297.72675925926 | 49.138 |
| 44297.768425925926 | 48.443 |
| 44297.81009259259 | 47.362 |
| 44297.85175925926 | 46.126 |
| 44297.893425925926 | 44.659 |
| 44297.93509259259 | 43.346 |
| 44297.97675925926 | 42.111 |
| 44298.018425925926 | 40.875 |
| 44298.06009259259 | 39.485 |
| 44298.10175925926 | 38.327 |
| 44298.143425925926 | 37.4 |
| 44298.18509259259 | 36.397 |
| 44298.22675925926 | 35.779 |
| 44298.268425925926 | 35.007 |
| 44298.31009259259 | 34.466 |
| 44298.35175925926 | 34.466 |
| 44298.393425925926 | 35.238 |
| 44298.43509259259 | 37.092 |
| 44298.47675925926 | 39.331 |
| 44298.518425925926 | 42.034 |
| 44298.56009259259 | 44.814 |
| 44298.60175925926 | 46.821 |
| 44298.643425925926 | 48.366 |
| 44298.68509259259 | 49.37 |
| 44298.72675925926 | 49.447 |
| 44298.768425925926 | 48.52 |
| 44298.81009259259 | 46.744 |
| 44298.85175925926 | 45.277 |
| 44298.893425925926 | 44.119 |
| 44298.93509259259 | 42.883 |
| 44298.97675925926 | 41.725 |
| 44299.018425925926 | 40.335 |
| 44299.06009259259 | 39.099 |
| 44299.10175925926 | 38.095 |
| 44299.143425925926 | 37.014 |
| 44299.18509259259 | 36.319 |
| 44299.22675925926 | 35.702 |
| 44299.268425925926 | 35.315 |
| 44299.31009259259 | 35.161 |
| 44299.35175925926 | 35.238 |
| 44299.393425925926 | 35.624 |
| 44299.43509259259 | 36.628 |
| 44299.47675925926 | 38.095 |
| 44299.518425925926 | 40.798 |
| 44299.56009259259 | 42.574 |
| 44299.60175925926 | 43.192 |
| 44299.643425925926 | 43.424 |
| 44299.68509259259 | 43.038 |
| 44299.72675925926 | 42.96 |
| 44299.768425925926 | 42.651 |
| 44299.81009259259 | 42.265 |
| 44299.85175925926 | 41.416 |
| 44299.893425925926 | 40.721 |
| 44299.93509259259 | 39.717 |
| 44299.97675925926 | 38.482 |
| 44300.018425925926 | 37.4 |
| 44300.06009259259 | 36.474 |
| 44300.10175925926 | 35.779 |
| 44300.143425925926 | 35.238 |
| 44300.18509259259 | 34.775 |
| 44300.22675925926 | 34.312 |
| 44300.268425925926 | 34.003 |
| 44300.31009259259 | 33.617 |
| 44300.35175925926 | 33.694 |
| 44300.393425925926 | 34.698 |
| 44300.43509259259 | 36.86 |
| 44300.47675925926 | 39.408 |
| 44300.518425925926 | 42.343 |
| 44300.56009259259 | 45.354 |
| 44300.60175925926 | 46.281 |
| 44300.643425925926 | 46.821 |
| 44300.68509259259 | 46.435 |
| 44300.72675925926 | 45.431 |
| 44300.768425925926 | 44.814 |
| 44300.81009259259 | 43.964 |
| 44300.85175925926 | 42.96 |
| 44300.893425925926 | 42.034 |
| 44300.93509259259 | 40.798 |
| 44300.97675925926 | 39.794 |
| 44301.018425925926 | 38.79 |
| 44301.06009259259 | 38.095 |
| 44301.10175925926 | 37.478 |
| 44301.143425925926 | 36.783 |
| 44301.18509259259 | 36.474 |
| 44301.22675925926 | 36.165 |
| 44301.268425925926 | 35.702 |
| 44301.31009259259 | 35.547 |
| 44301.35175925926 | 35.779 |
| 44301.393425925926 | 36.01 |
| 44301.43509259259 | 37.864 |
| 44301.47675925926 | 40.258 |
| 44301.518425925926 | 42.729 |
| 44301.56009259259 | 43.964 |
| 44301.60175925926 | 43.81 |
| 44301.643425925926 | 42.034 |
| 44301.68509259259 | 41.339 |
| 44301.72675925926 | 40.026 |
| 44301.768425925926 | 39.022 |
| 44301.81009259259 | 38.559 |
| 44301.85175925926 | 37.864 |
| 44301.893425925926 | 37.4 |
| 44301.93509259259 | 36.628 |
| 44301.97675925926 | 35.933 |
| 44302.018425925926 | 35.393 |
| 44302.06009259259 | 34.775 |
| 44302.10175925926 | 34.312 |
| 44302.143425925926 | 33.848 |
| 44302.18509259259 | 33.694 |
| 44302.22675925926 | 33.385 |
| 44302.268425925926 | 33.076 |
| 44302.31009259259 | 32.999 |
| 44302.35175925926 | 33.076 |
| 44302.393425925926 | 33.771 |
| 44302.43509259259 | 35.624 |
| 44302.47675925926 | 37.864 |
| 44302.518425925926 | 40.335 |
| 44302.56009259259 | 42.497 |
| 44302.60175925926 | 43.964 |
| 44302.643425925926 | 44.659 |
| 44302.68509259259 | 44.891 |
| 44302.72675925926 | 44.814 |
| 44302.768425925926 | 44.582 |
| 44302.81009259259 | 43.655 |
| 44302.85175925926 | 42.42 |
| 44302.893425925926 | 41.184 |
| 44302.93509259259 | 40.258 |
| 44302.97675925926 | 39.331 |
| 44303.018425925926 | 38.482 |
| 44303.06009259259 | 37.478 |
| 44303.10175925926 | 36.783 |
| 44303.143425925926 | 35.933 |
| 44303.18509259259 | 35.315 |
| 44303.22675925926 | 34.929 |
| 44303.268425925926 | 34.466 |
| 44303.31009259259 | 34.157 |
| 44303.35175925926 | 34.543 |
| 44303.393425925926 | 35.007 |
| 44303.43509259259 | 35.393 |
| 44303.47675925926 | 36.01 |
| 44303.518425925926 | 37.555 |
| 44303.56009259259 | 39.408 |
| 44303.60175925926 | 40.953 |
| 44303.643425925926 | 42.729 |
| 44303.68509259259 | 43.578 |
| 44303.72675925926 | 43.81 |
| 44303.768425925926 | 43.655 |
| 44303.81009259259 | 42.265 |
| 44303.85175925926 | 41.184 |
| 44303.893425925926 | 40.258 |
| 44303.93509259259 | 39.331 |
| 44303.97675925926 | 38.482 |
| 44304.018425925926 | 37.478 |
| 44304.06009259259 | 36.551 |
| 44304.10175925926 | 35.393 |
| 44304.143425925926 | 34.312 |
| 44304.18509259259 | 33.462 |
| 44304.22675925926 | 32.69 |
| 44304.268425925926 | 32.149 |
| 44304.31009259259 | 32.149 |
| 44304.35175925926 | 32.227 |
| 44304.393425925926 | 32.922 |
| 44304.43509259259 | 34.852 |
| 44304.47675925926 | 37.323 |
| 44304.518425925926 | 39.717 |
| 44304.56009259259 | 42.034 |
| 44304.60175925926 | 44.273 |
| 44304.643425925926 | 45.818 |
| 44304.68509259259 | 46.59 |
| 44304.72675925926 | 46.899 |
| 44304.768425925926 | 45.818 |
| 44304.81009259259 | 44.659 |
| 44304.85175925926 | 43.269 |
| 44304.893425925926 | 42.111 |
| 44304.93509259259 | 41.184 |
| 44304.97675925926 | 40.258 |
| 44305.018425925926 | 39.177 |
| 44305.06009259259 | 38.095 |
| 44305.10175925926 | 37.169 |
| 44305.143425925926 | 36.474 |
| 44305.18509259259 | 36.01 |
| 44305.22675925926 | 35.393 |
| 44305.268425925926 | 35.007 |
| 44305.31009259259 | 34.698 |
| 44305.35175925926 | 34.775 |
| 44305.393425925926 | 35.315 |
| 44305.43509259259 | 37.323 |
| 44305.47675925926 | 39.872 |
| 44305.518425925926 | 42.265 |
| 44305.56009259259 | 44.891 |
| 44305.60175925926 | 47.207 |
| 44305.643425925926 | 48.906 |
| 44305.68509259259 | 48.906 |
| 44305.72675925926 | 48.597 |
| 44305.768425925926 | 47.516 |
| 44305.81009259259 | 45.586 |
| 44305.85175925926 | 44.119 |
| 44305.893425925926 | 42.574 |
| 44305.93509259259 | 40.721 |
| 44305.97675925926 | 38.945 |
| 44306.018425925926 | 37.632 |
| 44306.06009259259 | 36.319 |
| 44306.10175925926 | 35.238 |
| 44306.143425925926 | 34.157 |
| 44306.18509259259 | 33.153 |
| 44306.22675925926 | 32.381 |
| 44306.268425925926 | 32.149 |
| 44306.31009259259 | 32.304 |
| 44306.35175925926 | 32.227 |
| 44306.393425925926 | 32.922 |
| 44306.43509259259 | 34.621 |
| 44306.47675925926 | 36.783 |
| 44306.518425925926 | 39.254 |
| 44306.56009259259 | 41.879 |
| 44306.60175925926 | 44.814 |
| 44306.643425925926 | 46.821 |
| 44306.68509259259 | 47.902 |
| 44306.72675925926 | 47.748 |
| 44306.768425925926 | 46.899 |
| 44306.81009259259 | 45.2 |
| 44306.85175925926 | 43.81 |
| 44306.893425925926 | 42.574 |
| 44306.93509259259 | 41.107 |
| 44306.97675925926 | 39.794 |
| 44307.018425925926 | 38.482 |
| 44307.06009259259 | 37.169 |
| 44307.10175925926 | 36.01 |
| 44307.143425925926 | 35.007 |
| 44307.18509259259 | 34.312 |
| 44307.22675925926 | 33.771 |
| 44307.268425925926 | 33.385 |
| 44307.31009259259 | 33.231 |
| 44307.35175925926 | 33.308 |
| 44307.393425925926 | 33.926 |
| 44307.43509259259 | 35.084 |
| 44307.47675925926 | 36.088 |
| 44307.518425925926 | 36.937 |
| 44307.56009259259 | 38.404 |
| 44307.60175925926 | 41.03 |
| 44307.643425925926 | 42.574 |
| 44307.68509259259 | 43.192 |
| 44307.72675925926 | 43.115 |
| 44307.768425925926 | 42.343 |
| 44307.81009259259 | 41.648 |
| 44307.85175925926 | 40.798 |
| 44307.893425925926 | 40.103 |
| 44307.93509259259 | 39.408 |
| 44307.97675925926 | 38.868 |
| 44308.018425925926 | 38.327 |
| 44308.06009259259 | 37.632 |
| 44308.10175925926 | 37.014 |
| 44308.143425925926 | 36.474 |
| 44308.18509259259 | 35.856 |
| 44308.22675925926 | 35.315 |
| 44308.268425925926 | 34.852 |
| 44308.31009259259 | 34.621 |
| 44308.35175925926 | 35.084 |
| 44308.393425925926 | 36.088 |
| 44308.43509259259 | 35.624 |
| 44308.47675925926 | 36.705 |
| 44308.518425925926 | 38.559 |
| 44308.56009259259 | 38.713 |
| 44308.60175925926 | 38.327 |
| 44308.643425925926 | 39.254 |
| 44308.68509259259 | 38.868 |
| 44308.72675925926 | 38.018 |
| 44308.768425925926 | 37.555 |
| 44308.81009259259 | 37.169 |
| 44308.85175925926 | 37.014 |
| 44308.893425925926 | 36.86 |
| 44308.93509259259 | 36.628 |
| 44308.97675925926 | 36.397 |
| 44309.018425925926 | 35.856 |
| 44309.06009259259 | 35.161 |
| 44309.10175925926 | 34.543 |
| 44309.143425925926 | 33.926 |
| 44309.18509259259 | 33.308 |
| 44309.22675925926 | 32.922 |
| 44309.268425925926 | 32.536 |
| 44309.31009259259 | 32.304 |
| 44309.35175925926 | 32.458 |
| 44309.393425925926 | 33.771 |
| 44309.43509259259 | 35.933 |
| 44309.47675925926 | 37.555 |
| 44309.518425925926 | 39.717 |
| 44309.56009259259 | 39.563 |
| 44309.60175925926 | 40.335 |
| 44309.643425925926 | 40.798 |
| 44309.68509259259 | 41.261 |
| 44309.72675925926 | 41.493 |
| 44309.768425925926 | 41.03 |
| 44309.81009259259 | 40.875 |
| 44309.85175925926 | 40.335 |
| 44309.893425925926 | 39.717 |
| 44309.93509259259 | 39.099 |
| 44309.97675925926 | 38.25 |
| 44310.018425925926 | 37.478 |
| 44310.06009259259 | 36.783 |
| 44310.10175925926 | 36.165 |
| 44310.143425925926 | 35.393 |
| 44310.18509259259 | 34.775 |
| 44310.22675925926 | 34.08 |
| 44310.268425925926 | 33.462 |
| 44310.31009259259 | 33.153 |
| 44310.35175925926 | 33.385 |
| 44310.393425925926 | 34.698 |
| 44310.43509259259 | 36.86 |
| 44310.47675925926 | 39.563 |
| 44310.518425925926 | 42.574 |
| 44310.56009259259 | 45.277 |
| 44310.60175925926 | 48.057 |
| 44310.643425925926 | 49.601 |
| 44310.68509259259 | 49.987 |
| 44310.72675925926 | 50.374 |
| 44310.768425925926 | 49.601 |
| 44310.81009259259 | 48.211 |
| 44310.85175925926 | 47.13 |
| 44310.893425925926 | 46.126 |
| 44310.93509259259 | 44.891 |
| 44310.97675925926 | 43.887 |
| 44311.018425925926 | 42.883 |
| 44311.06009259259 | 41.879 |
| 44311.10175925926 | 40.953 |
| 44311.143425925926 | 40.103 |
| 44311.18509259259 | 39.485 |
| 44311.22675925926 | 38.868 |
| 44311.268425925926 | 38.25 |
| 44311.31009259259 | 37.941 |
| 44311.35175925926 | 38.095 |
| 44311.393425925926 | 39.485 |
| 44311.43509259259 | 41.493 |
| 44311.47675925926 | 44.119 |
| 44311.518425925926 | 46.976 |
| 44311.56009259259 | 49.833 |
| 44311.60175925926 | 52.69 |
| 44311.643425925926 | 54.621 |
| 44311.68509259259 | 55.316 |
| 44311.72675925926 | 54.621 |
| 44311.768425925926 | 53.308 |
| 44311.81009259259 | 51.686 |
| 44311.85175925926 | 49.833 |
| 44311.893425925926 | 48.289 |
| 44311.93509259259 | 46.667 |
| 44311.97675925926 | 44.968 |
| 44312.018425925926 | 43.192 |
| 44312.06009259259 | 41.57 |
| 44312.10175925926 | 40.103 |
| 44312.143425925926 | 39.022 |
| 44312.18509259259 | 38.095 |
| 44312.22675925926 | 37.246 |
| 44312.268425925926 | 36.628 |
| 44312.31009259259 | 36.319 |
| 44312.35175925926 | 36.705 |
| 44312.393425925926 | 38.018 |
| 44312.43509259259 | 39.949 |
| 44312.47675925926 | 41.879 |
| 44312.518425925926 | 44.582 |
| 44312.56009259259 | 47.362 |
| 44312.60175925926 | 49.138 |
| 44312.643425925926 | 49.91 |
| 44312.68509259259 | 50.142 |
| 44312.72675925926 | 50.374 |
| 44312.768425925926 | 49.447 |
| 44312.81009259259 | 48.443 |
| 44312.85175925926 | 47.207 |
| 44312.893425925926 | 45.972 |
| 44312.93509259259 | 44.659 |
| 44312.97675925926 | 43.269 |
| 44313.018425925926 | 41.879 |
| 44313.06009259259 | 40.644 |
| 44313.10175925926 | 39.717 |
| 44313.143425925926 | 38.713 |
| 44313.18509259259 | 37.864 |
| 44313.22675925926 | 37.169 |
| 44313.268425925926 | 36.474 |
| 44313.31009259259 | 36.088 |
| 44313.35175925926 | 36.242 |
| 44313.393425925926 | 37.092 |
| 44313.43509259259 | 37.709 |
| 44313.47675925926 | 37.864 |
| 44313.518425925926 | 38.327 |
| 44313.56009259259 | 38.173 |
| 44313.60175925926 | 37.632 |
| 44313.643425925926 | 38.173 |
| 44313.68509259259 | 37.478 |
| 44313.72675925926 | 37.4 |
| 44313.768425925926 | 37.787 |
| 44313.81009259259 | 38.018 |
| 44313.85175925926 | 38.018 |
| 44313.893425925926 | 37.864 |
| 44313.93509259259 | 37.555 |
| 44313.97675925926 | 37.246 |
| 44314.018425925926 | 36.937 |
| 44314.06009259259 | 36.397 |
| 44314.10175925926 | 36.01 |
| 44314.143425925926 | 35.856 |
| 44314.18509259259 | 35.779 |
| 44314.22675925926 | 35.702 |
| 44314.268425925926 | 35.702 |
| 44314.31009259259 | 35.624 |
| 44314.35175925926 | 36.165 |
| 44314.393425925926 | 36.705 |
| 44314.43509259259 | 37.941 |
| 44314.47675925926 | 39.563 |
| 44314.518425925926 | 41.648 |
| 44314.56009259259 | 45.045 |
| 44314.60175925926 | 47.748 |
| 44314.643425925926 | 48.289 |
| 44314.68509259259 | 48.211 |
| 44314.72675925926 | 48.675 |
| 44314.768425925926 | 47.902 |
| 44314.81009259259 | 46.513 |
| 44314.85175925926 | 45.354 |
| 44314.893425925926 | 44.196 |
| 44314.93509259259 | 43.038 |
| 44314.97675925926 | 42.034 |
| 44315.018425925926 | 41.03 |
| 44315.06009259259 | 39.717 |
| 44315.10175925926 | 38.79 |
| 44315.143425925926 | 37.709 |
| 44315.18509259259 | 36.86 |
| 44315.22675925926 | 36.088 |
| 44315.268425925926 | 35.47 |
| 44315.31009259259 | 35.161 |
| 44315.35175925926 | 35.47 |
| 44315.393425925926 | 36.86 |
| 44315.43509259259 | 39.099 |
| 44315.47675925926 | 41.956 |
| 44315.518425925926 | 45.123 |
| 44315.56009259259 | 48.134 |
| 44315.60175925926 | 50.991 |
| 44315.643425925926 | 53.076 |
| 44315.68509259259 | 54.312 |
| 44315.72675925926 | 54.312 |
| 44315.768425925926 | 53.385 |
| 44315.81009259259 | 51.764 |
| 44315.85175925926 | 50.142 |
| 44315.893425925926 | 48.52 |
| 44315.93509259259 | 46.899 |
| 44315.97675925926 | 45.354 |
| 44316.018425925926 | 43.81 |
| 44316.06009259259 | 42.265 |
| 44316.10175925926 | 40.875 |
| 44316.143425925926 | 39.717 |
| 44316.18509259259 | 38.713 |
| 44316.22675925926 | 37.864 |
| 44316.268425925926 | 37.169 |
| 44316.31009259259 | 36.783 |
| 44316.35175925926 | 37.092 |
| 44316.393425925926 | 38.559 |
| 44316.43509259259 | 40.798 |
| 44316.47675925926 | 43.501 |
| 44316.518425925926 | 46.667 |
| 44316.56009259259 | 49.756 |
| 44316.60175925926 | 52.304 |
| 44316.643425925926 | 54.312 |
| 44316.68509259259 | 55.316 |
| 44316.72675925926 | 55.084 |
| 44316.768425925926 | 53.848 |
| 44316.81009259259 | 52.072 |
| 44316.85175925926 | 50.296 |
| 44316.893425925926 | 48.906 |
| 44316.93509259259 | 47.285 |
| 44316.97675925926 | 45.663 |
| 44317.018425925926 | 43.964 |
| 44317.06009259259 | 42.42 |
| 44317.10175925926 | 41.107 |
| 44317.143425925926 | 39.949 |
| 44317.18509259259 | 39.022 |
| 44317.22675925926 | 38.327 |
| 44317.268425925926 | 37.709 |
| 44317.31009259259 | 37.555 |
| 44317.35175925926 | 37.709 |
| 44317.393425925926 | 38.868 |
| 44317.43509259259 | 41.107 |
| 44317.47675925926 | 43.655 |
| 44317.518425925926 | 46.126 |
| 44317.56009259259 | 48.289 |
| 44317.60175925926 | 50.142 |
| 44317.643425925926 | 51.686 |
| 44317.68509259259 | 51.841 |
| 44317.72675925926 | 51.3 |
| 44317.768425925926 | 50.528 |
| 44317.81009259259 | 49.447 |
| 44317.85175925926 | 48.211 |
| 44317.893425925926 | 46.899 |
| 44317.93509259259 | 45.663 |
| 44317.97675925926 | 44.35 |
| 44318.018425925926 | 43.115 |
| 44318.06009259259 | 41.956 |
| 44318.10175925926 | 40.953 |
| 44318.143425925926 | 40.258 |
| 44318.18509259259 | 39.794 |
| 44318.22675925926 | 39.177 |
| 44318.268425925926 | 38.636 |
| 44318.31009259259 | 38.404 |
| 44318.35175925926 | 38.79 |
| 44318.393425925926 | 39.717 |
| 44318.43509259259 | 39.717 |
| 44318.47675925926 | 40.721 |
| 44318.518425925926 | 40.875 |
| 44318.56009259259 | 41.725 |
| 44318.60175925926 | 43.269 |
| 44318.643425925926 | 43.346 |
| 44318.68509259259 | 44.273 |
| 44318.72675925926 | 44.428 |
| 44318.768425925926 | 44.35 |
| 44318.81009259259 | 43.964 |
| 44318.85175925926 | 43.269 |
| 44318.893425925926 | 42.497 |
| 44318.93509259259 | 41.648 |
| 44318.97675925926 | 41.107 |
| 44319.018425925926 | 40.412 |
| 44319.06009259259 | 39.717 |
| 44319.10175925926 | 39.254 |
| 44319.143425925926 | 38.868 |
| 44319.18509259259 | 38.095 |
| 44319.22675925926 | 38.018 |
| 44319.268425925926 | 37.864 |
| 44319.31009259259 | 37.864 |
| 44319.35175925926 | 37.555 |
| 44319.393425925926 | 37.555 |
| 44319.43509259259 | 38.327 |
| 44319.47675925926 | 40.489 |
| 44319.518425925926 | 41.725 |
| 44319.56009259259 | 43.655 |
| 44319.60175925926 | 46.049 |
| 44319.643425925926 | 47.053 |
| 44319.68509259259 | 47.13 |
| 44319.72675925926 | 46.899 |
| 44319.768425925926 | 46.435 |
| 44319.81009259259 | 45.663 |
| 44319.85175925926 | 44.736 |
| 44319.893425925926 | 43.887 |
| 44319.93509259259 | 42.883 |
| 44319.97675925926 | 41.725 |
| 44320.018425925926 | 40.721 |
| 44320.06009259259 | 40.026 |
| 44320.10175925926 | 39.254 |
| 44320.143425925926 | 38.482 |
| 44320.18509259259 | 38.095 |
| 44320.22675925926 | 37.709 |
| 44320.268425925926 | 37.323 |
| 44320.31009259259 | 37.169 |
| 44320.35175925926 | 37.787 |
| 44320.393425925926 | 38.79 |
| 44320.43509259259 | 39.794 |
| 44320.47675925926 | 40.644 |
| 44320.518425925926 | 42.111 |
| 44320.56009259259 | 43.578 |
| 44320.60175925926 | 44.968 |
| 44320.643425925926 | 46.358 |
| 44320.68509259259 | 45.972 |
| 44320.72675925926 | 45.972 |
| 44320.768425925926 | 45.431 |
| 44320.81009259259 | 44.659 |
| 44320.85175925926 | 43.578 |
| 44320.893425925926 | 42.729 |
| 44320.93509259259 | 42.188 |
| 44320.97675925926 | 41.416 |
| 44321.018425925926 | 40.567 |
| 44321.06009259259 | 39.949 |
| 44321.10175925926 | 38.559 |
| 44321.143425925926 | 38.095 |
| 44321.18509259259 | 37.709 |
| 44321.22675925926 | 37.4 |
| 44321.268425925926 | 37.092 |
| 44321.31009259259 | 37.014 |
| 44321.35175925926 | 37.478 |
| 44321.393425925926 | 38.636 |
| 44321.43509259259 | 40.18 |
| 44321.47675925926 | 42.574 |
| 44321.518425925926 | 44.582 |
| 44321.56009259259 | 45.818 |
| 44321.60175925926 | 47.053 |
| 44321.643425925926 | 48.829 |
| 44321.68509259259 | 50.914 |
| 44321.72675925926 | 51.686 |
| 44321.768425925926 | 51.455 |
| 44321.81009259259 | 49.833 |
| 44321.85175925926 | 48.057 |
| 44321.893425925926 | 46.667 |
| 44321.93509259259 | 45.2 |
| 44321.97675925926 | 43.81 |
| 44322.018425925926 | 42.42 |
| 44322.06009259259 | 41.03 |
| 44322.10175925926 | 39.794 |
| 44322.143425925926 | 38.713 |
| 44322.18509259259 | 37.864 |
| 44322.22675925926 | 37.169 |
| 44322.268425925926 | 36.551 |
| 44322.31009259259 | 36.319 |
| 44322.35175925926 | 36.705 |
| 44322.393425925926 | 38.018 |
| 44322.43509259259 | 40.335 |
| 44322.47675925926 | 43.038 |
| 44322.518425925926 | 46.204 |
| 44322.56009259259 | 49.215 |
| 44322.60175925926 | 51.995 |
| 44322.643425925926 | 53.926 |
| 44322.68509259259 | 54.93 |
| 44322.72675925926 | 54.93 |
| 44322.768425925926 | 54.003 |
| 44322.81009259259 | 52.458 |
| 44322.85175925926 | 50.682 |
| 44322.893425925926 | 48.906 |
| 44322.93509259259 | 47.285 |
| 44322.97675925926 | 45.663 |
| 44323.018425925926 | 44.119 |
| 44323.06009259259 | 42.729 |
| 44323.10175925926 | 41.339 |
| 44323.143425925926 | 40.18 |
| 44323.18509259259 | 39.254 |
| 44323.22675925926 | 38.482 |
| 44323.268425925926 | 37.941 |
| 44323.31009259259 | 37.632 |
| 44323.35175925926 | 37.864 |
| 44323.393425925926 | 39.331 |
| 44323.43509259259 | 41.339 |
| 44323.47675925926 | 43.655 |
| 44323.518425925926 | 45.431 |
| 44323.56009259259 | 47.594 |
| 44323.60175925926 | 50.065 |
| 44323.643425925926 | 50.374 |
| 44323.68509259259 | 50.374 |
| 44323.72675925926 | 50.991 |
| 44323.768425925926 | 50.451 |
| 44323.81009259259 | 49.679 |
| 44323.85175925926 | 48.443 |
| 44323.893425925926 | 47.207 |
| 44323.93509259259 | 45.895 |
| 44323.97675925926 | 44.736 |
| 44324.018425925926 | 43.578 |
| 44324.06009259259 | 42.343 |
| 44324.10175925926 | 41.261 |
| 44324.143425925926 | 40.258 |
| 44324.18509259259 | 39.485 |
| 44324.22675925926 | 38.636 |
| 44324.268425925926 | 38.095 |
| 44324.31009259259 | 37.941 |
| 44324.35175925926 | 38.404 |
| 44324.393425925926 | 39.872 |
| 44324.43509259259 | 40.953 |
| 44324.47675925926 | 42.729 |
| 44324.518425925926 | 45.74 |
| 44324.56009259259 | 45.972 |
| 44324.60175925926 | 46.744 |
| 44324.643425925926 | 46.667 |
| 44324.68509259259 | 46.976 |
| 44324.72675925926 | 47.207 |
| 44324.768425925926 | 46.821 |
| 44324.81009259259 | 45.586 |
| 44324.85175925926 | 44.35 |
| 44324.893425925926 | 43.424 |
| 44324.93509259259 | 42.42 |
| 44324.97675925926 | 41.493 |
| 44325.018425925926 | 40.489 |
| 44325.06009259259 | 39.485 |
| 44325.10175925926 | 38.636 |
| 44325.143425925926 | 37.941 |
| 44325.18509259259 | 37.169 |
| 44325.22675925926 | 36.551 |
| 44325.268425925926 | 36.01 |
| 44325.31009259259 | 35.779 |
| 44325.35175925926 | 36.088 |
| 44325.393425925926 | 37.4 |
| 44325.43509259259 | 39.177 |
| 44325.47675925926 | 40.798 |
| 44325.518425925926 | 42.188 |
| 44325.56009259259 | 44.119 |
| 44325.60175925926 | 46.435 |
| 44325.643425925926 | 48.057 |
| 44325.68509259259 | 48.289 |
| 44325.72675925926 | 47.516 |
| 44325.768425925926 | 46.899 |
| 44325.81009259259 | 45.972 |
| 44325.85175925926 | 44.968 |
| 44325.893425925926 | 43.964 |
| 44325.93509259259 | 42.883 |
| 44325.97675925926 | 41.956 |
| 44326.018425925926 | 40.953 |
| 44326.06009259259 | 40.258 |
| 44326.10175925926 | 39.485 |
| 44326.143425925926 | 38.79 |
| 44326.18509259259 | 38.404 |
| 44326.22675925926 | 38.018 |
| 44326.268425925926 | 37.555 |
| 44326.31009259259 | 37.323 |
| 44326.35175925926 | 36.474 |
| 44326.393425925926 | 35.702 |
| 44326.43509259259 | 36.474 |
| 44326.47675925926 | 37.4 |
| 44326.518425925926 | 38.327 |
| 44326.56009259259 | 39.872 |
| 44326.60175925926 | 41.339 |
| 44326.643425925926 | 42.265 |
| 44326.68509259259 | 43.887 |
| 44326.72675925926 | 43.733 |
| 44326.768425925926 | 42.497 |
| 44326.81009259259 | 41.416 |
| 44326.85175925926 | 40.721 |
| 44326.893425925926 | 39.872 |
| 44326.93509259259 | 39.485 |
| 44326.97675925926 | 39.022 |
| 44327.018425925926 | 38.404 |
| 44327.06009259259 | 37.632 |
| 44327.10175925926 | 36.937 |
| 44327.143425925926 | 36.397 |
| 44327.18509259259 | 35.933 |
| 44327.22675925926 | 35.47 |
| 44327.268425925926 | 35.238 |
| 44327.31009259259 | 35.238 |
| 44327.35175925926 | 35.779 |
| 44327.393425925926 | 37.169 |
| 44327.43509259259 | 38.25 |
| 44327.47675925926 | 38.482 |
| 44327.518425925926 | 38.404 |
| 44327.56009259259 | 39.485 |
| 44327.60175925926 | 40.026 |
| 44327.643425925926 | 40.875 |
| 44327.68509259259 | 41.725 |
| 44327.72675925926 | 42.42 |
| 44327.768425925926 | 42.42 |
| 44327.81009259259 | 41.956 |
| 44327.85175925926 | 41.261 |
| 44327.893425925926 | 40.721 |
| 44327.93509259259 | 40.026 |
| 44327.97675925926 | 39.563 |
| 44328.018425925926 | 38.79 |
| 44328.06009259259 | 37.864 |
| 44328.10175925926 | 37.169 |
| 44328.143425925926 | 36.474 |
| 44328.18509259259 | 35.856 |
| 44328.22675925926 | 35.315 |
| 44328.268425925926 | 34.929 |
| 44328.31009259259 | 34.621 |
| 44328.35175925926 | 35.084 |
| 44328.393425925926 | 36.397 |
| 44328.43509259259 | 38.636 |
| 44328.47675925926 | 41.261 |
| 44328.518425925926 | 43.192 |
| 44328.56009259259 | 45.277 |
| 44328.60175925926 | 47.362 |
| 44328.643425925926 | 49.601 |
| 44328.68509259259 | 50.914 |
| 44328.72675925926 | 52.072 |
| 44328.768425925926 | 51.223 |
| 44328.81009259259 | 49.292 |
| 44328.85175925926 | 47.671 |
| 44328.893425925926 | 46.204 |
| 44328.93509259259 | 44.814 |
| 44328.97675925926 | 43.424 |
| 44329.018425925926 | 42.111 |
| 44329.06009259259 | 40.953 |
| 44329.10175925926 | 39.794 |
| 44329.143425925926 | 38.79 |
| 44329.18509259259 | 38.018 |
| 44329.22675925926 | 37.323 |
| 44329.268425925926 | 36.86 |
| 44329.31009259259 | 36.397 |
| 44329.35175925926 | 37.014 |
| 44329.393425925926 | 38.636 |
| 44329.43509259259 | 40.721 |
| 44329.47675925926 | 43.655 |
| 44329.518425925926 | 45.895 |
| 44329.56009259259 | 48.134 |
| 44329.60175925926 | 49.679 |
| 44329.643425925926 | 49.601 |
| 44329.68509259259 | 49.679 |
| 44329.72675925926 | 50.142 |
| 44329.768425925926 | 50.065 |
| 44329.81009259259 | 49.524 |
| 44329.85175925926 | 48.597 |
| 44329.893425925926 | 47.13 |
| 44329.93509259259 | 45.895 |
| 44329.97675925926 | 44.505 |
| 44330.018425925926 | 43.346 |
| 44330.06009259259 | 42.265 |
| 44330.10175925926 | 41.184 |
| 44330.143425925926 | 40.18 |
| 44330.18509259259 | 39.485 |
| 44330.22675925926 | 38.79 |
| 44330.268425925926 | 38.095 |
| 44330.31009259259 | 38.018 |
| 44330.35175925926 | 38.559 |
| 44330.393425925926 | 40.026 |
| 44330.43509259259 | 42.111 |
| 44330.47675925926 | 44.273 |
| 44330.518425925926 | 46.435 |
| 44330.56009259259 | 49.37 |
| 44330.60175925926 | 49.833 |
| 44330.643425925926 | 50.296 |
| 44330.68509259259 | 51.223 |
| 44330.72675925926 | 52.458 |
| 44330.768425925926 | 52.381 |
| 44330.81009259259 | 51.146 |
| 44330.85175925926 | 49.756 |
| 44330.893425925926 | 48.134 |
| 44330.93509259259 | 46.513 |
| 44330.97675925926 | 45.045 |
| 44331.018425925926 | 43.578 |
| 44331.06009259259 | 42.42 |
| 44331.10175925926 | 41.339 |
| 44331.143425925926 | 40.335 |
| 44331.18509259259 | 39.717 |
| 44331.22675925926 | 39.022 |
| 44331.268425925926 | 38.482 |
| 44331.31009259259 | 38.327 |
| 44331.35175925926 | 38.79 |
| 44331.393425925926 | 40.489 |
| 44331.43509259259 | 42.651 |
| 44331.47675925926 | 45.431 |
| 44331.518425925926 | 48.134 |
| 44331.56009259259 | 49.679 |
| 44331.60175925926 | 51.995 |
| 44331.643425925926 | 53.308 |
| 44331.68509259259 | 53.153 |
| 44331.72675925926 | 52.69 |
| 44331.768425925926 | 51.609 |
| 44331.81009259259 | 50.296 |
| 44331.85175925926 | 49.061 |
| 44331.893425925926 | 47.748 |
| 44331.93509259259 | 46.513 |
| 44331.97675925926 | 45.354 |
| 44332.018425925926 | 44.119 |
| 44332.06009259259 | 43.038 |
| 44332.10175925926 | 41.956 |
| 44332.143425925926 | 41.03 |
| 44332.18509259259 | 40.335 |
| 44332.22675925926 | 39.872 |
| 44332.268425925926 | 39.331 |
| 44332.31009259259 | 39.177 |
| 44332.35175925926 | 39.794 |
| 44332.393425925926 | 41.261 |
| 44332.43509259259 | 43.346 |
| 44332.47675925926 | 45.123 |
| 44332.518425925926 | 47.207 |
| 44332.56009259259 | 48.443 |
| 44332.60175925926 | 50.682 |
| 44332.643425925926 | 51.995 |
| 44332.68509259259 | 52.536 |
| 44332.72675925926 | 50.605 |
| 44332.768425925926 | 48.984 |
| 44332.81009259259 | 47.902 |
| 44332.85175925926 | 46.744 |
| 44332.893425925926 | 45.509 |
| 44332.93509259259 | 44.35 |
| 44332.97675925926 | 43.192 |
| 44333.018425925926 | 42.265 |
| 44333.06009259259 | 41.493 |
| 44333.10175925926 | 40.721 |
| 44333.143425925926 | 40.18 |
| 44333.18509259259 | 39.64 |
| 44333.22675925926 | 39.331 |
| 44333.268425925926 | 39.099 |
| 44333.31009259259 | 39.022 |
| 44333.35175925926 | 39.717 |
| 44333.393425925926 | 40.875 |
| 44333.43509259259 | 42.574 |
| 44333.47675925926 | 43.964 |
| 44333.518425925926 | 44.505 |
| 44333.56009259259 | 44.814 |
| 44333.60175925926 | 45.277 |
| 44333.643425925926 | 45.045 |
| 44333.68509259259 | 45.123 |
| 44333.72675925926 | 45.354 |
| 44333.768425925926 | 44.968 |
| 44333.81009259259 | 44.35 |
| 44333.85175925926 | 43.501 |
| 44333.893425925926 | 42.651 |
| 44333.93509259259 | 42.111 |
| 44333.97675925926 | 41.493 |
| 44334.018425925926 | 40.798 |
| 44334.06009259259 | 40.412 |
| 44334.10175925926 | 40.258 |
| 44334.143425925926 | 39.949 |
| 44334.18509259259 | 39.717 |
| 44334.22675925926 | 39.64 |
| 44334.268425925926 | 39.408 |
| 44334.31009259259 | 39.485 |
| 44334.35175925926 | 40.18 |
| 44334.393425925926 | 41.493 |
| 44334.43509259259 | 43.115 |
| 44334.47675925926 | 45.74 |
| 44334.518425925926 | 47.671 |
| 44334.56009259259 | 49.215 |
| 44334.60175925926 | 50.219 |
| 44334.643425925926 | 49.447 |
| 44334.68509259259 | 50.065 |
| 44334.72675925926 | 49.91 |
| 44334.768425925926 | 49.37 |
| 44334.81009259259 | 48.289 |
| 44334.85175925926 | 46.976 |
| 44334.893425925926 | 45.74 |
| 44334.93509259259 | 44.659 |
| 44334.97675925926 | 43.578 |
| 44335.018425925926 | 42.42 |
| 44335.06009259259 | 41.493 |
| 44335.10175925926 | 40.567 |
| 44335.143425925926 | 39.717 |
| 44335.18509259259 | 39.099 |
| 44335.22675925926 | 38.636 |
| 44335.268425925926 | 38.25 |
| 44335.31009259259 | 38.095 |
| 44335.35175925926 | 38.868 |
| 44335.393425925926 | 40.258 |
| 44335.43509259259 | 42.42 |
| 44335.47675925926 | 45.045 |
| 44335.518425925926 | 47.98 |
| 44335.56009259259 | 50.374 |
| 44335.60175925926 | 52.381 |
| 44335.643425925926 | 52.227 |
| 44335.68509259259 | 52.613 |
| 44335.72675925926 | 51.995 |
| 44335.768425925926 | 50.837 |
| 44335.81009259259 | 49.37 |
| 44335.85175925926 | 47.594 |
| 44335.893425925926 | 45.972 |
| 44335.93509259259 | 44.582 |
| 44335.97675925926 | 43.269 |
| 44336.018425925926 | 42.343 |
| 44336.06009259259 | 41.648 |
| 44336.10175925926 | 40.875 |
| 44336.143425925926 | 40.335 |
| 44336.18509259259 | 39.872 |
| 44336.22675925926 | 39.254 |
| 44336.268425925926 | 39.254 |
| 44336.31009259259 | 39.331 |
| 44336.35175925926 | 40.335 |
| 44336.393425925926 | 41.648 |
| 44336.43509259259 | 43.501 |
| 44336.47675925926 | 44.814 |
| 44336.518425925926 | 46.59 |
| 44336.56009259259 | 49.37 |
| 44336.60175925926 | 52.072 |
| 44336.643425925926 | 52.15 |
| 44336.68509259259 | 53.076 |
| 44336.72675925926 | 52.922 |
| 44336.768425925926 | 52.381 |
| 44336.81009259259 | 50.76 |
| 44336.85175925926 | 48.829 |
| 44336.893425925926 | 47.207 |
| 44336.93509259259 | 45.509 |
| 44336.97675925926 | 43.964 |
| 44337.018425925926 | 42.574 |
| 44337.06009259259 | 41.416 |
| 44337.10175925926 | 40.567 |
| 44337.143425925926 | 39.949 |
| 44337.18509259259 | 39.408 |
| 44337.22675925926 | 39.022 |
| 44337.268425925926 | 38.79 |
| 44337.31009259259 | 39.099 |
| 44337.35175925926 | 39.949 |
| 44337.393425925926 | 41.648 |
| 44337.43509259259 | 42.883 |
| 44337.47675925926 | 44.814 |
| 44337.518425925926 | 46.204 |
| 44337.56009259259 | 46.59 |
| 44337.60175925926 | 47.207 |
| 44337.643425925926 | 47.053 |
| 44337.68509259259 | 47.053 |
| 44337.72675925926 | 46.899 |
| 44337.768425925926 | 46.435 |
| 44337.81009259259 | 45.895 |
| 44337.85175925926 | 45.354 |
| 44337.893425925926 | 44.582 |
| 44337.93509259259 | 43.81 |
| 44337.97675925926 | 43.038 |
| 44338.018425925926 | 42.42 |
| 44338.06009259259 | 41.57 |
| 44338.10175925926 | 40.875 |
| 44338.143425925926 | 40.335 |
| 44338.18509259259 | 39.717 |
| 44338.22675925926 | 39.177 |
| 44338.268425925926 | 38.868 |
| 44338.31009259259 | 38.79 |
| 44338.35175925926 | 39.717 |
| 44338.393425925926 | 40.953 |
| 44338.43509259259 | 42.729 |
| 44338.47675925926 | 44.968 |
| 44338.518425925926 | 46.899 |
| 44338.56009259259 | 48.211 |
| 44338.60175925926 | 50.219 |
| 44338.643425925926 | 50.142 |
| 44338.68509259259 | 50.296 |
| 44338.72675925926 | 50.837 |
| 44338.768425925926 | 49.987 |
| 44338.81009259259 | 49.138 |
| 44338.85175925926 | 47.902 |
| 44338.893425925926 | 46.435 |
| 44338.93509259259 | 45.2 |
| 44338.97675925926 | 44.041 |
| 44339.018425925926 | 43.038 |
| 44339.06009259259 | 42.343 |
| 44339.10175925926 | 41.57 |
| 44339.143425925926 | 40.953 |
| 44339.18509259259 | 40.335 |
| 44339.22675925926 | 39.872 |
| 44339.268425925926 | 39.485 |
| 44339.31009259259 | 39.331 |
| 44339.35175925926 | 39.872 |
| 44339.393425925926 | 40.721 |
| 44339.43509259259 | 41.416 |
| 44339.47675925926 | 42.42 |
| 44339.518425925926 | 42.883 |
| 44339.56009259259 | 43.501 |
| 44339.60175925926 | 45.972 |
| 44339.643425925926 | 46.358 |
| 44339.68509259259 | 47.748 |
| 44339.72675925926 | 47.98 |
| 44339.768425925926 | 47.13 |
| 44339.81009259259 | 46.126 |
| 44339.85175925926 | 44.736 |
| 44339.893425925926 | 43.578 |
| 44339.93509259259 | 42.497 |
| 44339.97675925926 | 41.261 |
| 44340.018425925926 | 40.103 |
| 44340.06009259259 | 39.177 |
| 44340.10175925926 | 38.327 |
| 44340.143425925926 | 37.632 |
| 44340.18509259259 | 37.014 |
| 44340.22675925926 | 36.474 |
| 44340.268425925926 | 36.088 |
| 44340.31009259259 | 35.933 |
| 44340.35175925926 | 36.705 |
| 44340.393425925926 | 38.018 |
| 44340.43509259259 | 40.026 |
| 44340.47675925926 | 42.42 |
| 44340.518425925926 | 45.045 |
| 44340.56009259259 | 47.902 |
| 44340.60175925926 | 50.296 |
| 44340.643425925926 | 52.227 |
| 44340.68509259259 | 53.462 |
| 44340.72675925926 | 53.771 |
| 44340.768425925926 | 52.999 |
| 44340.81009259259 | 51.455 |
| 44340.85175925926 | 49.833 |
| 44340.893425925926 | 48.057 |
| 44340.93509259259 | 46.358 |
| 44340.97675925926 | 44.659 |
| 44341.018425925926 | 43.038 |
| 44341.06009259259 | 41.725 |
| 44341.10175925926 | 40.489 |
| 44341.143425925926 | 39.563 |
| 44341.18509259259 | 38.713 |
| 44341.22675925926 | 37.941 |
| 44341.268425925926 | 37.4 |
| 44341.31009259259 | 37.169 |
| 44341.35175925926 | 37.787 |
| 44341.393425925926 | 39.099 |
| 44341.43509259259 | 40.953 |
| 44341.47675925926 | 43.424 |
| 44341.518425925926 | 46.126 |
| 44341.56009259259 | 48.906 |
| 44341.60175925926 | 51.3 |
| 44341.643425925926 | 53.076 |
| 44341.68509259259 | 54.312 |
| 44341.72675925926 | 54.466 |
| 44341.768425925926 | 53.848 |
| 44341.81009259259 | 52.381 |
| 44341.85175925926 | 50.682 |
| 44341.893425925926 | 48.984 |
| 44341.93509259259 | 47.285 |
| 44341.97675925926 | 45.586 |
| 44342.018425925926 | 44.196 |
| 44342.06009259259 | 42.883 |
| 44342.10175925926 | 41.802 |
| 44342.143425925926 | 41.107 |
| 44342.18509259259 | 40.335 |
| 44342.22675925926 | 39.64 |
| 44342.268425925926 | 39.022 |
| 44342.31009259259 | 39.022 |
| 44342.35175925926 | 39.331 |
| 44342.393425925926 | 40.644 |
| 44342.43509259259 | 41.956 |
| 44342.47675925926 | 43.964 |
| 44342.518425925926 | 46.049 |
| 44342.56009259259 | 46.976 |
| 44342.60175925926 | 47.825 |
| 44342.643425925926 | 47.825 |
| 44342.68509259259 | 48.443 |
| 44342.72675925926 | 49.138 |
| 44342.768425925926 | 49.138 |
| 44342.81009259259 | 48.597 |
| 44342.85175925926 | 47.748 |
| 44342.893425925926 | 46.821 |
| 44342.93509259259 | 45.895 |
| 44342.97675925926 | 44.814 |
| 44343.018425925926 | 43.81 |
| 44343.06009259259 | 42.806 |
| 44343.10175925926 | 41.802 |
| 44343.143425925926 | 40.875 |
| 44343.18509259259 | 40.103 |
| 44343.22675925926 | 39.485 |
| 44343.268425925926 | 39.099 |
| 44343.31009259259 | 38.79 |
| 44343.35175925926 | 39.331 |
| 44343.393425925926 | 40.798 |
| 44343.43509259259 | 42.574 |
| 44343.47675925926 | 44.968 |
| 44343.518425925926 | 47.671 |
| 44343.56009259259 | 50.374 |
| 44343.60175925926 | 52.767 |
| 44343.643425925926 | 54.466 |
| 44343.68509259259 | 55.161 |
| 44343.72675925926 | 55.47 |
| 44343.768425925926 | 54.389 |
| 44343.81009259259 | 52.536 |
| 44343.85175925926 | 50.682 |
| 44343.893425925926 | 49.215 |
| 44343.93509259259 | 47.439 |
| 44343.97675925926 | 45.663 |
| 44344.018425925926 | 43.887 |
| 44344.06009259259 | 42.497 |
| 44344.10175925926 | 41.416 |
| 44344.143425925926 | 40.489 |
| 44344.18509259259 | 39.64 |
| 44344.22675925926 | 39.022 |
| 44344.268425925926 | 38.482 |
| 44344.31009259259 | 38.327 |
| 44344.35175925926 | 38.79 |
| 44344.393425925926 | 40.18 |
| 44344.43509259259 | 41.956 |
| 44344.47675925926 | 43.424 |
| 44344.518425925926 | 44.968 |
| 44344.56009259259 | 47.516 |
| 44344.60175925926 | 49.91 |
| 44344.643425925926 | 50.682 |
| 44344.68509259259 | 50.837 |
| 44344.72675925926 | 52.15 |
| 44344.768425925926 | 51.377 |
| 44344.81009259259 | 50.528 |
| 44344.85175925926 | 49.37 |
| 44344.893425925926 | 47.902 |
| 44344.93509259259 | 46.513 |
| 44344.97675925926 | 44.968 |
| 44345.018425925926 | 43.578 |
| 44345.06009259259 | 42.497 |
| 44345.10175925926 | 41.493 |
| 44345.143425925926 | 40.644 |
| 44345.18509259259 | 39.872 |
| 44345.22675925926 | 39.254 |
| 44345.268425925926 | 38.868 |
| 44345.31009259259 | 38.713 |
| 44345.35175925926 | 39.177 |
| 44345.393425925926 | 40.489 |
| 44345.43509259259 | 42.188 |
| 44345.47675925926 | 44.814 |
| 44345.518425925926 | 46.976 |
| 44345.56009259259 | 47.825 |
| 44345.60175925926 | 48.443 |
| 44345.643425925926 | 49.215 |
| 44345.68509259259 | 49.679 |
| 44345.72675925926 | 49.37 |
| 44345.768425925926 | 48.906 |
| 44345.81009259259 | 48.289 |
| 44345.85175925926 | 47.594 |
| 44345.893425925926 | 46.744 |
| 44345.93509259259 | 46.049 |
| 44345.97675925926 | 45.2 |
| 44346.018425925926 | 44.273 |
| 44346.06009259259 | 43.346 |
| 44346.10175925926 | 42.42 |
| 44346.143425925926 | 41.802 |
| 44346.18509259259 | 41.261 |
| 44346.22675925926 | 40.721 |
| 44346.268425925926 | 40.412 |
| 44346.31009259259 | 40.412 |
| 44346.35175925926 | 40.875 |
| 44346.393425925926 | 41.57 |
| 44346.43509259259 | 42.96 |
| 44346.47675925926 | 45.123 |
| 44346.518425925926 | 46.204 |
| 44346.56009259259 | 46.126 |
| 44346.60175925926 | 45.972 |
| 44346.643425925926 | 45.586 |
| 44346.68509259259 | 45.2 |
| 44346.72675925926 | 45.277 |
| 44346.768425925926 | 44.814 |
| 44346.81009259259 | 44.428 |
| 44346.85175925926 | 43.964 |
| 44346.893425925926 | 43.346 |
| 44346.93509259259 | 42.883 |
| 44346.97675925926 | 42.497 |
| 44347.018425925926 | 42.111 |
| 44347.06009259259 | 41.648 |
| 44347.10175925926 | 41.339 |
| 44347.143425925926 | 40.875 |
| 44347.18509259259 | 40.489 |
| 44347.22675925926 | 40.18 |
| 44347.268425925926 | 39.717 |
| 44347.31009259259 | 39.563 |
| 44347.35175925926 | 40.18 |
| 44347.393425925926 | 41.493 |
| 44347.43509259259 | 43.501 |
| 44347.47675925926 | 45.972 |
| 44347.518425925926 | 48.289 |
| 44347.56009259259 | 48.829 |
| 44347.60175925926 | 48.675 |
| 44347.643425925926 | 50.219 |
| 44347.68509259259 | 49.138 |
| 44347.72675925926 | 49.061 |
| 44347.768425925926 | 48.752 |
| 44347.81009259259 | 47.748 |
| 44347.85175925926 | 46.513 |
| 44347.893425925926 | 45.586 |
| 44347.93509259259 | 44.659 |
| 44347.97675925926 | 43.81 |
| 44348.018425925926 | 42.806 |
| 44348.06009259259 | 41.879 |
| 44348.10175925926 | 40.953 |
| 44348.143425925926 | 40.335 |
| 44348.18509259259 | 39.563 |
| 44348.22675925926 | 38.945 |
| 44348.268425925926 | 38.559 |
| 44348.31009259259 | 38.636 |
| 44348.35175925926 | 39.022 |
| 44348.393425925926 | 39.872 |
| 44348.43509259259 | 41.339 |
| 44348.47675925926 | 44.428 |
| 44348.518425925926 | 46.59 |
| 44348.56009259259 | 48.675 |
| 44348.60175925926 | 49.447 |
| 44348.643425925926 | 50.219 |
| 44348.68509259259 | 51.609 |
| 44348.72675925926 | 51.377 |
| 44348.768425925926 | 50.682 |
| 44348.81009259259 | 49.524 |
| 44348.85175925926 | 48.52 |
| 44348.893425925926 | 47.362 |
| 44348.93509259259 | 46.204 |
| 44348.97675925926 | 44.891 |
| 44349.018425925926 | 43.81 |
| 44349.06009259259 | 42.806 |
| 44349.10175925926 | 42.188 |
| 44349.143425925926 | 41.57 |
| 44349.18509259259 | 40.953 |
| 44349.22675925926 | 40.489 |
| 44349.268425925926 | 40.258 |
| 44349.31009259259 | 40.18 |
| 44349.35175925926 | 40.644 |
| 44349.393425925926 | 41.879 |
| 44349.43509259259 | 43.424 |
| 44349.47675925926 | 45.895 |
| 44349.518425925926 | 48.675 |
| 44349.56009259259 | 51.223 |
| 44349.60175925926 | 51.841 |
| 44349.643425925926 | 52.69 |
| 44349.68509259259 | 54.157 |
| 44349.72675925926 | 54.466 |
| 44349.768425925926 | 53.231 |
| 44349.81009259259 | 51.918 |
| 44349.85175925926 | 50.374 |
| 44349.893425925926 | 48.752 |
| 44349.93509259259 | 47.207 |
| 44349.97675925926 | 45.818 |
| 44350.018425925926 | 44.428 |
| 44350.06009259259 | 43.346 |
| 44350.10175925926 | 42.42 |
| 44350.143425925926 | 41.57 |
| 44350.18509259259 | 40.875 |
| 44350.22675925926 | 40.18 |
| 44350.268425925926 | 39.64 |
| 44350.31009259259 | 39.563 |
| 44350.35175925926 | 40.335 |
| 44350.393425925926 | 41.648 |
| 44350.43509259259 | 43.501 |
| 44350.47675925926 | 45.972 |
| 44350.518425925926 | 48.829 |
| 44350.56009259259 | 51.841 |
| 44350.60175925926 | 54.312 |
| 44350.643425925926 | 56.011 |
| 44350.68509259259 | 57.015 |
| 44350.72675925926 | 57.092 |
| 44350.768425925926 | 56.783 |
| 44350.81009259259 | 55.084 |
| 44350.85175925926 | 53.462 |
| 44350.893425925926 | 51.455 |
| 44350.93509259259 | 49.37 |
| 44350.97675925926 | 47.516 |
| 44351.018425925926 | 46.049 |
| 44351.06009259259 | 44.659 |
| 44351.10175925926 | 43.655 |
| 44351.143425925926 | 42.574 |
| 44351.18509259259 | 41.879 |
| 44351.22675925926 | 41.261 |
| 44351.268425925926 | 40.798 |
| 44351.31009259259 | 40.567 |
| 44351.35175925926 | 41.184 |
| 44351.393425925926 | 42.42 |
| 44351.43509259259 | 44.273 |
| 44351.47675925926 | 46.744 |
| 44351.518425925926 | 49.292 |
| 44351.56009259259 | 51.995 |
| 44351.60175925926 | 54.312 |
| 44351.643425925926 | 56.088 |
| 44351.68509259259 | 57.092 |
| 44351.72675925926 | 57.323 |
| 44351.768425925926 | 56.551 |
| 44351.81009259259 | 55.007 |
| 44351.85175925926 | 52.999 |
| 44351.893425925926 | 50.76 |
| 44351.93509259259 | 48.829 |
| 44351.97675925926 | 47.053 |
| 44352.018425925926 | 45.586 |
| 44352.06009259259 | 44.428 |
| 44352.10175925926 | 43.269 |
| 44352.143425925926 | 42.42 |
| 44352.18509259259 | 41.725 |
| 44352.22675925926 | 41.184 |
| 44352.268425925926 | 40.875 |
| 44352.31009259259 | 40.798 |
| 44352.35175925926 | 41.416 |
| 44352.393425925926 | 42.651 |
| 44352.43509259259 | 44.428 |
| 44352.47675925926 | 46.821 |
| 44352.518425925926 | 49.447 |
| 44352.56009259259 | 51.146 |
| 44352.60175925926 | 53.694 |
| 44352.643425925926 | 53.54 |
| 44352.68509259259 | 53.54 |
| 44352.72675925926 | 52.922 |
| 44352.768425925926 | 51.995 |
| 44352.81009259259 | 50.682 |
| 44352.85175925926 | 49.061 |
| 44352.893425925926 | 47.439 |
| 44352.93509259259 | 46.204 |
| 44352.97675925926 | 45.277 |
| 44353.018425925926 | 44.505 |
| 44353.06009259259 | 43.81 |
| 44353.10175925926 | 43.038 |
| 44353.143425925926 | 42.343 |
| 44353.18509259259 | 41.802 |
| 44353.22675925926 | 41.416 |
| 44353.268425925926 | 40.875 |
| 44353.31009259259 | 40.953 |
| 44353.35175925926 | 41.493 |
| 44353.393425925926 | 42.729 |
| 44353.43509259259 | 44.35 |
| 44353.47675925926 | 46.59 |
| 44353.518425925926 | 46.435 |
| 44353.56009259259 | 47.439 |
| 44353.60175925926 | 48.829 |
| 44353.643425925926 | 49.292 |
| 44353.68509259259 | 49.91 |
| 44353.72675925926 | 50.451 |
| 44353.768425925926 | 50.065 |
| 44353.81009259259 | 49.292 |
| 44353.85175925926 | 48.211 |
| 44353.893425925926 | 47.053 |
| 44353.93509259259 | 46.126 |
| 44353.97675925926 | 45.277 |
| 44354.018425925926 | 44.273 |
| 44354.06009259259 | 43.424 |
| 44354.10175925926 | 42.806 |
| 44354.143425925926 | 42.265 |
| 44354.18509259259 | 41.802 |
| 44354.22675925926 | 41.184 |
| 44354.268425925926 | 40.798 |
| 44354.31009259259 | 40.721 |
| 44354.35175925926 | 41.339 |
| 44354.393425925926 | 42.42 |
| 44354.43509259259 | 44.119 |
| 44354.47675925926 | 46.204 |
| 44354.518425925926 | 47.285 |
| 44354.56009259259 | 49.061 |
| 44354.60175925926 | 50.991 |
| 44354.643425925926 | 52.458 |
| 44354.68509259259 | 53.385 |
| 44354.72675925926 | 53.848 |
| 44354.768425925926 | 53.076 |
| 44354.81009259259 | 52.15 |
| 44354.85175925926 | 51.069 |
| 44354.893425925926 | 49.679 |
| 44354.93509259259 | 48.289 |
| 44354.97675925926 | 46.976 |
| 44355.018425925926 | 45.818 |
| 44355.06009259259 | 44.659 |
| 44355.10175925926 | 43.81 |
| 44355.143425925926 | 42.96 |
| 44355.18509259259 | 42.343 |
| 44355.22675925926 | 41.725 |
| 44355.268425925926 | 41.339 |
| 44355.31009259259 | 41.184 |
| 44355.35175925926 | 41.648 |
| 44355.393425925926 | 42.883 |
| 44355.43509259259 | 44.659 |
| 44355.47675925926 | 46.744 |
| 44355.518425925926 | 49.215 |
| 44355.56009259259 | 51.764 |
| 44355.60175925926 | 54.08 |
| 44355.643425925926 | 55.702 |
| 44355.68509259259 | 56.551 |
| 44355.72675925926 | 56.628 |
| 44355.768425925926 | 55.933 |
| 44355.81009259259 | 54.621 |
| 44355.85175925926 | 52.69 |
| 44355.893425925926 | 50.682 |
| 44355.93509259259 | 48.829 |
| 44355.97675925926 | 47.285 |
| 44356.018425925926 | 45.74 |
| 44356.06009259259 | 44.428 |
| 44356.10175925926 | 43.269 |
| 44356.143425925926 | 42.42 |
| 44356.18509259259 | 41.725 |
| 44356.22675925926 | 40.953 |
| 44356.268425925926 | 40.489 |
| 44356.31009259259 | 40.335 |
| 44356.35175925926 | 40.798 |
| 44356.393425925926 | 41.802 |
| 44356.43509259259 | 43.733 |
| 44356.47675925926 | 45.972 |
| 44356.518425925926 | 48.597 |
| 44356.56009259259 | 51.223 |
| 44356.60175925926 | 53.694 |
| 44356.643425925926 | 55.47 |
| 44356.68509259259 | 56.706 |
| 44356.72675925926 | 57.169 |
| 44356.768425925926 | 56.706 |
| 44356.81009259259 | 55.084 |
| 44356.85175925926 | 53.462 |
| 44356.893425925926 | 51.764 |
| 44356.93509259259 | 50.219 |
| 44356.97675925926 | 48.675 |
| 44357.018425925926 | 47.516 |
| 44357.06009259259 | 46.435 |
| 44357.10175925926 | 45.354 |
| 44357.143425925926 | 44.582 |
| 44357.18509259259 | 43.733 |
| 44357.22675925926 | 43.038 |
| 44357.268425925926 | 42.42 |
| 44357.31009259259 | 42.111 |
| 44357.35175925926 | 42.42 |
| 44357.393425925926 | 43.578 |
| 44357.43509259259 | 45.354 |
| 44357.47675925926 | 47.285 |
| 44357.518425925926 | 48.597 |
| 44357.56009259259 | 50.065 |
| 44357.60175925926 | 51.223 |
| 44357.643425925926 | 53.694 |
| 44357.68509259259 | 55.161 |
| 44357.72675925926 | 55.547 |
| 44357.768425925926 | 55.007 |
| 44357.81009259259 | 53.848 |
| 44357.85175925926 | 52.304 |
| 44357.893425925926 | 50.76 |
| 44357.93509259259 | 49.215 |
| 44357.97675925926 | 47.825 |
| 44358.018425925926 | 46.435 |
| 44358.06009259259 | 45.354 |
| 44358.10175925926 | 44.35 |
| 44358.143425925926 | 43.501 |
| 44358.18509259259 | 42.497 |
| 44358.22675925926 | 41.802 |
| 44358.268425925926 | 41.184 |
| 44358.31009259259 | 41.03 |
| 44358.35175925926 | 41.493 |
| 44358.393425925926 | 42.497 |
| 44358.43509259259 | 43.964 |
| 44358.47675925926 | 46.204 |
| 44358.518425925926 | 48.829 |
| 44358.56009259259 | 51.3 |
| 44358.60175925926 | 53.694 |
| 44358.643425925926 | 55.547 |
| 44358.68509259259 | 56.628 |
| 44358.72675925926 | 56.937 |
| 44358.768425925926 | 56.397 |
| 44358.81009259259 | 55.007 |
| 44358.85175925926 | 53.385 |
| 44358.893425925926 | 51.686 |
| 44358.93509259259 | 49.987 |
| 44358.97675925926 | 48.366 |
| 44359.018425925926 | 47.053 |
| 44359.06009259259 | 45.895 |
| 44359.10175925926 | 44.814 |
| 44359.143425925926 | 43.964 |
| 44359.18509259259 | 43.192 |
| 44359.22675925926 | 42.42 |
| 44359.268425925926 | 41.802 |
| 44359.31009259259 | 41.648 |
| 44359.35175925926 | 42.111 |
| 44359.393425925926 | 43.192 |
| 44359.43509259259 | 45.045 |
| 44359.47675925926 | 47.285 |
| 44359.518425925926 | 49.833 |
| 44359.56009259259 | 52.536 |
| 44359.60175925926 | 54.93 |
| 44359.643425925926 | 56.706 |
| 44359.68509259259 | 57.71 |
| 44359.72675925926 | 58.096 |
| 44359.768425925926 | 57.478 |
| 44359.81009259259 | 56.165 |
| 44359.85175925926 | 54.466 |
| 44359.893425925926 | 52.458 |
| 44359.93509259259 | 50.682 |
| 44359.97675925926 | 49.138 |
| 44360.018425925926 | 47.825 |
| 44360.06009259259 | 46.513 |
| 44360.10175925926 | 45.586 |
| 44360.143425925926 | 44.659 |
| 44360.18509259259 | 43.81 |
| 44360.22675925926 | 43.269 |
| 44360.268425925926 | 42.729 |
| 44360.31009259259 | 42.42 |
| 44360.35175925926 | 43.038 |
| 44360.393425925926 | 44.196 |
| 44360.43509259259 | 45.972 |
| 44360.47675925926 | 48.289 |
| 44360.518425925926 | 51.223 |
| 44360.56009259259 | 54.003 |
| 44360.60175925926 | 55.933 |
| 44360.643425925926 | 56.242 |
| 44360.68509259259 | 57.015 |
| 44360.72675925926 | 57.246 |
| 44360.768425925926 | 56.628 |
| 44360.81009259259 | 55.547 |
| 44360.85175925926 | 54.157 |
| 44360.893425925926 | 52.536 |
| 44360.93509259259 | 51.069 |
| 44360.97675925926 | 49.756 |
| 44361.018425925926 | 48.752 |
| 44361.06009259259 | 47.825 |
| 44361.10175925926 | 47.053 |
| 44361.143425925926 | 46.204 |
| 44361.18509259259 | 45.509 |
| 44361.22675925926 | 44.736 |
| 44361.268425925926 | 44.196 |
| 44361.31009259259 | 44.041 |
| 44361.35175925926 | 44.505 |
| 44361.393425925926 | 45.586 |
| 44361.43509259259 | 47.362 |
| 44361.47675925926 | 49.601 |
| 44361.518425925926 | 52.072 |
| 44361.56009259259 | 54.621 |
| 44361.60175925926 | 56.783 |
| 44361.643425925926 | 58.482 |
| 44361.68509259259 | 59.486 |
| 44361.72675925926 | 59.408 |
| 44361.768425925926 | 58.327 |
| 44361.81009259259 | 56.783 |
| 44361.85175925926 | 54.621 |
| 44361.893425925926 | 52.381 |
| 44361.93509259259 | 50.605 |
| 44361.97675925926 | 49.138 |
| 44362.018425925926 | 47.98 |
| 44362.06009259259 | 47.053 |
| 44362.10175925926 | 46.204 |
| 44362.143425925926 | 45.509 |
| 44362.18509259259 | 44.814 |
| 44362.22675925926 | 44.35 |
| 44362.268425925926 | 43.81 |
| 44362.31009259259 | 43.655 |
| 44362.35175925926 | 44.041 |
| 44362.393425925926 | 45.2 |
| 44362.43509259259 | 46.899 |
| 44362.47675925926 | 49.215 |
| 44362.518425925926 | 51.609 |
| 44362.56009259259 | 54.157 |
| 44362.60175925926 | 56.242 |
| 44362.643425925926 | 57.632 |
| 44362.68509259259 | 58.327 |
| 44362.72675925926 | 57.787 |
| 44362.768425925926 | 57.092 |
| 44362.81009259259 | 55.702 |
| 44362.85175925926 | 54.08 |
| 44362.893425925926 | 52.381 |
| 44362.93509259259 | 50.837 |
| 44362.97675925926 | 49.447 |
| 44363.018425925926 | 48.366 |
| 44363.06009259259 | 47.439 |
| 44363.10175925926 | 46.667 |
| 44363.143425925926 | 45.818 |
| 44363.18509259259 | 45.277 |
| 44363.22675925926 | 44.659 |
| 44363.268425925926 | 44.196 |
| 44363.31009259259 | 44.041 |
| 44363.35175925926 | 44.428 |
| 44363.393425925926 | 45.431 |
| 44363.43509259259 | 47.053 |
| 44363.47675925926 | 48.906 |
| 44363.518425925926 | 51.455 |
| 44363.56009259259 | 53.385 |
| 44363.60175925926 | 54.389 |
| 44363.643425925926 | 55.238 |
| 44363.68509259259 | 56.011 |
| 44363.72675925926 | 55.702 |
| 44363.768425925926 | 55.007 |
| 44363.81009259259 | 53.771 |
| 44363.85175925926 | 52.381 |
| 44363.893425925926 | 50.991 |
| 44363.93509259259 | 49.91 |
| 44363.97675925926 | 48.906 |
| 44364.018425925926 | 48.211 |
| 44364.06009259259 | 47.439 |
| 44364.10175925926 | 46.821 |
| 44364.143425925926 | 46.204 |
| 44364.18509259259 | 45.586 |
| 44364.22675925926 | 44.968 |
| 44364.268425925926 | 44.428 |
| 44364.31009259259 | 44.35 |
| 44364.35175925926 | 44.814 |
| 44364.393425925926 | 45.818 |
| 44364.43509259259 | 47.516 |
| 44364.47675925926 | 49.679 |
| 44364.518425925926 | 51.686 |
| 44364.56009259259 | 53.153 |
| 44364.60175925926 | 54.698 |
| 44364.643425925926 | 55.702 |
| 44364.68509259259 | 56.783 |
| 44364.72675925926 | 56.397 |
| 44364.768425925926 | 56.011 |
| 44364.81009259259 | 54.852 |
| 44364.85175925926 | 53.54 |
| 44364.893425925926 | 51.918 |
| 44364.93509259259 | 50.528 |
| 44364.97675925926 | 49.524 |
| 44365.018425925926 | 48.829 |
| 44365.06009259259 | 48.057 |
| 44365.10175925926 | 47.439 |
| 44365.143425925926 | 46.667 |
| 44365.18509259259 | 46.126 |
| 44365.22675925926 | 45.509 |
| 44365.268425925926 | 44.968 |
| 44365.31009259259 | 44.736 |
| 44365.35175925926 | 45.045 |
| 44365.393425925926 | 45.895 |
| 44365.43509259259 | 46.59 |
| 44365.47675925926 | 48.057 |
| 44365.518425925926 | 49.215 |
| 44365.56009259259 | 50.451 |
| 44365.60175925926 | 52.536 |
| 44365.643425925926 | 53.231 |
| 44365.68509259259 | 54.003 |
| 44365.72675925926 | 54.157 |
| 44365.768425925926 | 53.694 |
| 44365.81009259259 | 52.381 |
| 44365.85175925926 | 51.069 |
| 44365.893425925926 | 49.756 |
| 44365.93509259259 | 48.984 |
| 44365.97675925926 | 48.211 |
| 44366.018425925926 | 47.362 |
| 44366.06009259259 | 46.744 |
| 44366.10175925926 | 46.281 |
| 44366.143425925926 | 45.818 |
| 44366.18509259259 | 45.354 |
| 44366.22675925926 | 45.123 |
| 44366.268425925926 | 44.814 |
| 44366.31009259259 | 44.814 |
| 44366.35175925926 | 44.891 |
| 44366.393425925926 | 45.895 |
| 44366.43509259259 | 47.671 |
| 44366.47675925926 | 49.447 |
| 44366.518425925926 | 49.987 |
| 44366.56009259259 | 50.837 |
| 44366.60175925926 | 52.999 |
| 44366.643425925926 | 53.617 |
| 44366.68509259259 | 52.536 |
| 44366.72675925926 | 52.072 |
| 44366.768425925926 | 51.841 |
| 44366.81009259259 | 51.223 |
| 44366.85175925926 | 50.296 |
| 44366.893425925926 | 49.138 |
| 44366.93509259259 | 48.211 |
| 44366.97675925926 | 47.207 |
| 44367.018425925926 | 46.281 |
| 44367.06009259259 | 45.663 |
| 44367.10175925926 | 45.123 |
| 44367.143425925926 | 44.582 |
| 44367.18509259259 | 44.119 |
| 44367.22675925926 | 43.81 |
| 44367.268425925926 | 43.578 |
| 44367.31009259259 | 43.733 |
| 44367.35175925926 | 44.196 |
| 44367.393425925926 | 45.354 |
| 44367.43509259259 | 46.744 |
| 44367.47675925926 | 48.906 |
| 44367.518425925926 | 51.686 |
| 44367.56009259259 | 52.458 |
| 44367.60175925926 | 53.462 |
| 44367.643425925926 | 53.54 |
| 44367.68509259259 | 54.003 |
| 44367.72675925926 | 54.157 |
| 44367.768425925926 | 53.308 |
| 44367.81009259259 | 52.227 |
| 44367.85175925926 | 51.146 |
| 44367.893425925926 | 49.91 |
| 44367.93509259259 | 48.984 |
| 44367.97675925926 | 47.98 |
| 44368.018425925926 | 47.285 |
| 44368.06009259259 | 46.59 |
| 44368.10175925926 | 45.818 |
| 44368.143425925926 | 45.123 |
| 44368.18509259259 | 44.582 |
| 44368.22675925926 | 43.964 |
| 44368.268425925926 | 43.501 |
| 44368.31009259259 | 43.424 |
| 44368.35175925926 | 43.81 |
| 44368.393425925926 | 45.045 |
| 44368.43509259259 | 46.821 |
| 44368.47675925926 | 49.061 |
| 44368.518425925926 | 51.609 |
| 44368.56009259259 | 54.003 |
| 44368.60175925926 | 56.32 |
| 44368.643425925926 | 57.941 |
| 44368.68509259259 | 58.482 |
| 44368.72675925926 | 57.941 |
| 44368.768425925926 | 57.323 |
| 44368.81009259259 | 55.933 |
| 44368.85175925926 | 54.003 |
| 44368.893425925926 | 52.15 |
| 44368.93509259259 | 50.374 |
| 44368.97675925926 | 48.829 |
| 44369.018425925926 | 47.594 |
| 44369.06009259259 | 46.59 |
| 44369.10175925926 | 45.586 |
| 44369.143425925926 | 44.814 |
| 44369.18509259259 | 44.196 |
| 44369.22675925926 | 43.655 |
| 44369.268425925926 | 43.269 |
| 44369.31009259259 | 43.269 |
| 44369.35175925926 | 43.655 |
| 44369.393425925926 | 44.196 |
| 44369.43509259259 | 46.204 |
| 44369.47675925926 | 48.211 |
| 44369.518425925926 | 50.914 |
| 44369.56009259259 | 53.617 |
| 44369.60175925926 | 54.621 |
| 44369.643425925926 | 54.698 |
| 44369.68509259259 | 55.238 |
| 44369.72675925926 | 55.316 |
| 44369.768425925926 | 55.007 |
| 44369.81009259259 | 54.466 |
| 44369.85175925926 | 53.231 |
| 44369.893425925926 | 51.764 |
| 44369.93509259259 | 50.451 |
| 44369.97675925926 | 49.215 |
| 44370.018425925926 | 48.134 |
| 44370.06009259259 | 46.899 |
| 44370.10175925926 | 46.049 |
| 44370.143425925926 | 45.354 |
| 44370.18509259259 | 44.736 |
| 44370.22675925926 | 44.119 |
| 44370.268425925926 | 43.733 |
| 44370.31009259259 | 43.655 |
| 44370.35175925926 | 44.041 |
| 44370.393425925926 | 45.045 |
| 44370.43509259259 | 46.59 |
| 44370.47675925926 | 48.597 |
| 44370.518425925926 | 50.142 |
| 44370.56009259259 | 50.76 |
| 44370.60175925926 | 50.837 |
| 44370.643425925926 | 50.914 |
| 44370.68509259259 | 51.532 |
| 44370.72675925926 | 51.686 |
| 44370.768425925926 | 51.223 |
| 44370.81009259259 | 50.76 |
| 44370.85175925926 | 50.065 |
| 44370.893425925926 | 49.524 |
| 44370.93509259259 | 48.906 |
| 44370.97675925926 | 48.211 |
| 44371.018425925926 | 47.671 |
| 44371.06009259259 | 47.13 |
| 44371.10175925926 | 46.667 |
| 44371.143425925926 | 46.358 |
| 44371.18509259259 | 46.126 |
| 44371.22675925926 | 45.895 |
| 44371.268425925926 | 45.818 |
| 44371.31009259259 | 45.74 |
| 44371.35175925926 | 46.204 |
| 44371.393425925926 | 46.667 |
| 44371.43509259259 | 46.976 |
| 44371.47675925926 | 48.443 |
| 44371.518425925926 | 49.833 |
| 44371.56009259259 | 51.223 |
| 44371.60175925926 | 52.922 |
| 44371.643425925926 | 52.304 |
| 44371.68509259259 | 52.072 |
| 44371.72675925926 | 51.841 |
| 44371.768425925926 | 51.455 |
| 44371.81009259259 | 50.682 |
| 44371.85175925926 | 49.756 |
| 44371.893425925926 | 48.752 |
| 44371.93509259259 | 48.057 |
| 44371.97675925926 | 47.207 |
| 44372.018425925926 | 46.435 |
| 44372.06009259259 | 45.818 |
| 44372.10175925926 | 45.045 |
| 44372.143425925926 | 44.505 |
| 44372.18509259259 | 44.196 |
| 44372.22675925926 | 43.887 |
| 44372.268425925926 | 43.733 |
| 44372.31009259259 | 43.733 |
| 44372.35175925926 | 44.428 |
| 44372.393425925926 | 45.431 |
| 44372.43509259259 | 46.744 |
| 44372.47675925926 | 48.134 |
| 44372.518425925926 | 50.065 |
| 44372.56009259259 | 51.686 |
| 44372.60175925926 | 51.146 |
| 44372.643425925926 | 52.15 |
| 44372.68509259259 | 52.072 |
| 44372.72675925926 | 52.227 |
| 44372.768425925926 | 52.227 |
| 44372.81009259259 | 51.609 |
| 44372.85175925926 | 50.528 |
| 44372.893425925926 | 49.601 |
| 44372.93509259259 | 48.752 |
| 44372.97675925926 | 47.98 |
| 44373.018425925926 | 47.439 |
| 44373.06009259259 | 46.899 |
| 44373.10175925926 | 46.435 |
| 44373.143425925926 | 46.204 |
| 44373.18509259259 | 45.895 |
| 44373.22675925926 | 45.74 |
| 44373.268425925926 | 45.663 |
| 44373.31009259259 | 45.509 |
| 44373.35175925926 | 45.509 |
| 44373.393425925926 | 46.126 |
| 44373.43509259259 | 46.976 |
| 44373.47675925926 | 48.443 |
| 44373.518425925926 | 49.447 |
| 44373.56009259259 | 50.528 |
| 44373.60175925926 | 51.686 |
| 44373.643425925926 | 52.922 |
| 44373.68509259259 | 53.385 |
| 44373.72675925926 | 53.231 |
| 44373.768425925926 | 52.845 |
| 44373.81009259259 | 52.227 |
| 44373.85175925926 | 51.223 |
| 44373.893425925926 | 49.987 |
| 44373.93509259259 | 48.906 |
| 44373.97675925926 | 47.902 |
| 44374.018425925926 | 47.207 |
| 44374.06009259259 | 46.513 |
| 44374.10175925926 | 46.049 |
| 44374.143425925926 | 45.74 |
| 44374.18509259259 | 45.509 |
| 44374.22675925926 | 45.123 |
| 44374.268425925926 | 44.968 |
| 44374.31009259259 | 45.123 |
| 44374.35175925926 | 45.586 |
| 44374.393425925926 | 46.204 |
| 44374.43509259259 | 48.057 |
| 44374.47675925926 | 49.138 |
| 44374.518425925926 | 49.91 |
| 44374.56009259259 | 51.918 |
| 44374.60175925926 | 53.462 |
| 44374.643425925926 | 53.926 |
| 44374.68509259259 | 53.54 |
| 44374.72675925926 | 53.54 |
| 44374.768425925926 | 52.845 |
| 44374.81009259259 | 52.458 |
| 44374.85175925926 | 51.609 |
| 44374.893425925926 | 50.296 |
| 44374.93509259259 | 49.138 |
| 44374.97675925926 | 48.134 |
| 44375.018425925926 | 47.285 |
| 44375.06009259259 | 46.358 |
| 44375.10175925926 | 45.431 |
| 44375.143425925926 | 44.814 |
| 44375.18509259259 | 44.119 |
| 44375.22675925926 | 43.501 |
| 44375.268425925926 | 43.038 |
| 44375.31009259259 | 42.883 |
| 44375.35175925926 | 43.192 |
| 44375.393425925926 | 44.041 |
| 44375.43509259259 | 46.126 |
| 44375.47675925926 | 47.748 |
| 44375.518425925926 | 49.061 |
| 44375.56009259259 | 51.455 |
| 44375.60175925926 | 53.694 |
| 44375.643425925926 | 54.698 |
| 44375.68509259259 | 55.084 |
| 44375.72675925926 | 56.474 |
| 44375.768425925926 | 56.32 |
| 44375.81009259259 | 55.316 |
| 44375.85175925926 | 53.617 |
| 44375.893425925926 | 51.764 |
| 44375.93509259259 | 50.219 |
| 44375.97675925926 | 48.675 |
| 44376.018425925926 | 47.748 |
| 44376.06009259259 | 47.13 |
| 44376.10175925926 | 46.435 |
| 44376.143425925926 | 46.049 |
| 44376.18509259259 | 45.663 |
| 44376.22675925926 | 45.354 |
| 44376.268425925926 | 44.891 |
| 44376.31009259259 | 44.891 |
| 44376.35175925926 | 45.586 |
| 44376.393425925926 | 46.667 |
| 44376.43509259259 | 48.289 |
| 44376.47675925926 | 50.914 |
| 44376.518425925926 | 52.381 |
| 44376.56009259259 | 53.617 |
| 44376.60175925926 | 55.084 |
| 44376.643425925926 | 55.779 |
| 44376.68509259259 | 55.238 |
| 44376.72675925926 | 55.779 |
| 44376.768425925926 | 54.621 |
| 44376.81009259259 | 53.848 |
| 44376.85175925926 | 52.536 |
| 44376.893425925926 | 50.991 |
| 44376.93509259259 | 49.833 |
| 44376.97675925926 | 49.061 |
| 44377.018425925926 | 48.443 |
| 44377.06009259259 | 47.902 |
| 44377.10175925926 | 47.516 |
| 44377.143425925926 | 47.13 |
| 44377.18509259259 | 46.667 |
| 44377.22675925926 | 46.358 |
| 44377.268425925926 | 45.972 |
| 44377.31009259259 | 45.972 |
| 44377.35175925926 | 46.59 |
| 44377.393425925926 | 47.671 |
| 44377.43509259259 | 49.679 |
| 44377.47675925926 | 51.995 |
| 44377.518425925926 | 54.466 |
| 44377.56009259259 | 57.015 |
| 44377.60175925926 | 58.018 |
| 44377.643425925926 | 58.868 |
| 44377.68509259259 | 57.169 |
| 44377.72675925926 | 57.555 |
| 44377.768425925926 | 56.397 |
| 44377.81009259259 | 54.621 |
| 44377.85175925926 | 53.385 |
| 44377.893425925926 | 52.536 |
| 44377.93509259259 | 51.764 |
| 44377.97675925926 | 50.991 |
| 44378.018425925926 | 50.528 |
| 44378.06009259259 | 50.219 |
| 44378.10175925926 | 49.833 |
| 44378.143425925926 | 49.601 |
| 44378.18509259259 | 49.601 |
| 44378.22675925926 | 49.37 |
| 44378.268425925926 | 49.061 |
| 44378.31009259259 | 49.061 |
| 44378.35175925926 | 49.447 |
| 44378.393425925926 | 50.065 |
| 44378.43509259259 | 50.837 |
| 44378.47675925926 | 52.613 |
| 44378.518425925926 | 53.385 |
| 44378.56009259259 | 55.393 |
| 44378.60175925926 | 56.011 |
| 44378.643425925926 | 56.474 |
| 44378.68509259259 | 56.165 |
| 44378.72675925926 | 56.474 |
| 44378.768425925926 | 56.165 |
| 44378.81009259259 | 55.007 |
| 44378.85175925926 | 53.848 |
| 44378.893425925926 | 53.231 |
| 44378.93509259259 | 52.381 |
| 44378.97675925926 | 51.609 |
| 44379.018425925926 | 51.223 |
| 44379.06009259259 | 50.682 |
| 44379.10175925926 | 50.374 |
| 44379.143425925926 | 49.91 |
| 44379.18509259259 | 49.679 |
| 44379.22675925926 | 49.292 |
| 44379.268425925926 | 49.215 |
| 44379.31009259259 | 49.061 |
| 44379.35175925926 | 49.601 |
| 44379.393425925926 | 50.605 |
| 44379.43509259259 | 52.227 |
| 44379.47675925926 | 54.389 |
| 44379.518425925926 | 55.47 |
| 44379.56009259259 | 57.169 |
| 44379.60175925926 | 58.791 |
| 44379.643425925926 | 58.327 |
| 44379.68509259259 | 58.173 |
| 44379.72675925926 | 57.632 |
| 44379.768425925926 | 56.551 |
| 44379.81009259259 | 55.47 |
| 44379.85175925926 | 54.235 |
| 44379.893425925926 | 53.153 |
| 44379.93509259259 | 52.304 |
| 44379.97675925926 | 51.532 |
| 44380.018425925926 | 50.837 |
| 44380.06009259259 | 50.451 |
| 44380.10175925926 | 50.065 |
| 44380.143425925926 | 49.756 |
| 44380.18509259259 | 49.524 |
| 44380.22675925926 | 49.292 |
| 44380.268425925926 | 49.061 |
| 44380.31009259259 | 49.138 |
| 44380.35175925926 | 49.524 |
| 44380.393425925926 | 50.528 |
| 44380.43509259259 | 52.227 |
| 44380.47675925926 | 54.466 |
| 44380.518425925926 | 56.088 |
| 44380.56009259259 | 57.71 |
| 44380.60175925926 | 58.868 |
| 44380.643425925926 | 57.941 |
| 44380.68509259259 | 57.632 |
| 44380.72675925926 | 57.787 |
| 44380.768425925926 | 57.632 |
| 44380.81009259259 | 56.783 |
| 44380.85175925926 | 55.856 |
| 44380.893425925926 | 54.621 |
| 44380.93509259259 | 53.462 |
| 44380.97675925926 | 52.458 |
| 44381.018425925926 | 51.686 |
| 44381.06009259259 | 51.3 |
| 44381.10175925926 | 50.837 |
| 44381.143425925926 | 50.605 |
| 44381.18509259259 | 50.374 |
| 44381.22675925926 | 49.987 |
| 44381.268425925926 | 49.833 |
| 44381.31009259259 | 49.756 |
| 44381.35175925926 | 50.219 |
| 44381.393425925926 | 51.223 |
| 44381.43509259259 | 52.922 |
| 44381.47675925926 | 55.161 |
| 44381.518425925926 | 57.632 |
| 44381.56009259259 | 59.794 |
| 44381.60175925926 | 60.721 |
| 44381.643425925926 | 60.798 |
| 44381.68509259259 | 60.489 |
| 44381.72675925926 | 59.408 |
| 44381.768425925926 | 57.941 |
| 44381.81009259259 | 56.474 |
| 44381.85175925926 | 55.084 |
| 44381.893425925926 | 54.003 |
| 44381.93509259259 | 53.308 |
| 44381.97675925926 | 52.613 |
| 44382.018425925926 | 52.072 |
| 44382.06009259259 | 51.609 |
| 44382.10175925926 | 51.223 |
| 44382.143425925926 | 51.069 |
| 44382.18509259259 | 50.76 |
| 44382.22675925926 | 50.528 |
| 44382.268425925926 | 50.296 |
| 44382.31009259259 | 50.219 |
| 44382.35175925926 | 50.682 |
| 44382.393425925926 | 51.764 |
| 44382.43509259259 | 53.308 |
| 44382.47675925926 | 55.47 |
| 44382.518425925926 | 56.86 |
| 44382.56009259259 | 57.555 |
| 44382.60175925926 | 57.71 |
| 44382.643425925926 | 57.478 |
| 44382.68509259259 | 56.937 |
| 44382.72675925926 | 56.474 |
| 44382.768425925926 | 56.474 |
| 44382.81009259259 | 55.625 |
| 44382.85175925926 | 54.389 |
| 44382.893425925926 | 53.385 |
| 44382.93509259259 | 52.845 |
| 44382.97675925926 | 52.381 |
| 44383.018425925926 | 51.686 |
| 44383.06009259259 | 51.223 |
| 44383.10175925926 | 50.991 |
| 44383.143425925926 | 50.76 |
| 44383.18509259259 | 50.682 |
| 44383.22675925926 | 50.296 |
| 44383.268425925926 | 50.142 |
| 44383.31009259259 | 50.065 |
| 44383.35175925926 | 50.605 |
| 44383.393425925926 | 51.532 |
| 44383.43509259259 | 53.076 |
| 44383.47675925926 | 55.007 |
| 44383.518425925926 | 57.169 |
| 44383.56009259259 | 59.177 |
| 44383.60175925926 | 60.953 |
| 44383.643425925926 | 62.188 |
| 44383.68509259259 | 62.574 |
| 44383.72675925926 | 62.034 |
| 44383.768425925926 | 60.953 |
| 44383.81009259259 | 59.177 |
| 44383.85175925926 | 57.401 |
| 44383.893425925926 | 55.779 |
| 44383.93509259259 | 54.543 |
| 44383.97675925926 | 53.462 |
| 44384.018425925926 | 52.69 |
| 44384.06009259259 | 52.15 |
| 44384.10175925926 | 51.764 |
| 44384.143425925926 | 51.609 |
| 44384.18509259259 | 51.3 |
| 44384.22675925926 | 50.991 |
| 44384.268425925926 | 50.605 |
| 44384.31009259259 | 50.528 |
| 44384.35175925926 | 50.991 |
| 44384.393425925926 | 51.918 |
| 44384.43509259259 | 53.462 |
| 44384.47675925926 | 55.393 |
| 44384.518425925926 | 57.555 |
| 44384.56009259259 | 59.794 |
| 44384.60175925926 | 61.571 |
| 44384.643425925926 | 62.806 |
| 44384.68509259259 | 63.269 |
| 44384.72675925926 | 62.729 |
| 44384.768425925926 | 61.725 |
| 44384.81009259259 | 59.949 |
| 44384.85175925926 | 58.018 |
| 44384.893425925926 | 56.397 |
| 44384.93509259259 | 54.93 |
| 44384.97675925926 | 53.771 |
| 44385.018425925926 | 53.076 |
| 44385.06009259259 | 52.613 |
| 44385.10175925926 | 52.304 |
| 44385.143425925926 | 51.841 |
| 44385.18509259259 | 51.609 |
| 44385.22675925926 | 51.223 |
| 44385.268425925926 | 51.146 |
| 44385.31009259259 | 50.991 |
| 44385.35175925926 | 51.377 |
| 44385.393425925926 | 52.072 |
| 44385.43509259259 | 53.771 |
| 44385.47675925926 | 55.779 |
| 44385.518425925926 | 57.555 |
| 44385.56009259259 | 58.713 |
| 44385.60175925926 | 59.022 |
| 44385.643425925926 | 59.486 |
| 44385.68509259259 | 60.103 |
| 44385.72675925926 | 59.563 |
| 44385.768425925926 | 59.099 |
| 44385.81009259259 | 58.482 |
| 44385.85175925926 | 56.86 |
| 44385.893425925926 | 55.47 |
| 44385.93509259259 | 54.235 |
| 44385.97675925926 | 53.231 |
| 44386.018425925926 | 52.536 |
| 44386.06009259259 | 51.995 |
| 44386.10175925926 | 51.532 |
| 44386.143425925926 | 51.223 |
| 44386.18509259259 | 50.837 |
| 44386.22675925926 | 50.451 |
| 44386.268425925926 | 50.219 |
| 44386.31009259259 | 50.219 |
| 44386.35175925926 | 50.682 |
| 44386.393425925926 | 51.764 |
| 44386.43509259259 | 53.462 |
| 44386.47675925926 | 55.625 |
| 44386.518425925926 | 57.169 |
| 44386.56009259259 | 58.791 |
| 44386.60175925926 | 59.64 |
| 44386.643425925926 | 59.254 |
| 44386.68509259259 | 59.408 |
| 44386.72675925926 | 58.482 |
| 44386.768425925926 | 57.632 |
| 44386.81009259259 | 56.86 |
| 44386.85175925926 | 56.011 |
| 44386.893425925926 | 55.161 |
| 44386.93509259259 | 54.08 |
| 44386.97675925926 | 53.153 |
| 44387.018425925926 | 52.381 |
| 44387.06009259259 | 51.532 |
| 44387.10175925926 | 50.837 |
| 44387.143425925926 | 50.219 |
| 44387.18509259259 | 49.679 |
| 44387.22675925926 | 49.215 |
| 44387.268425925926 | 48.752 |
| 44387.31009259259 | 48.52 |
| 44387.35175925926 | 48.906 |
| 44387.393425925926 | 50.065 |
| 44387.43509259259 | 51.686 |
| 44387.47675925926 | 53.848 |
| 44387.518425925926 | 56.011 |
| 44387.56009259259 | 58.25 |
| 44387.60175925926 | 60.181 |
| 44387.643425925926 | 61.416 |
| 44387.68509259259 | 61.879 |
| 44387.72675925926 | 61.493 |
| 44387.768425925926 | 60.489 |
| 44387.81009259259 | 58.945 |
| 44387.85175925926 | 57.246 |
| 44387.893425925926 | 55.393 |
| 44387.93509259259 | 53.926 |
| 44387.97675925926 | 52.458 |
| 44388.018425925926 | 51.3 |
| 44388.06009259259 | 50.296 |
| 44388.10175925926 | 49.601 |
| 44388.143425925926 | 49.215 |
| 44388.18509259259 | 48.752 |
| 44388.22675925926 | 48.443 |
| 44388.268425925926 | 48.057 |
| 44388.31009259259 | 47.98 |
| 44388.35175925926 | 48.366 |
| 44388.393425925926 | 49.37 |
| 44388.43509259259 | 50.991 |
| 44388.47675925926 | 53.076 |
| 44388.518425925926 | 55.393 |
| 44388.56009259259 | 57.71 |
| 44388.60175925926 | 59.563 |
| 44388.643425925926 | 60.953 |
| 44388.68509259259 | 61.725 |
| 44388.72675925926 | 61.416 |
| 44388.768425925926 | 60.412 |
| 44388.81009259259 | 58.868 |
| 44388.85175925926 | 57.092 |
| 44388.893425925926 | 55.238 |
| 44388.93509259259 | 53.694 |
| 44388.97675925926 | 52.304 |
| 44389.018425925926 | 51.146 |
| 44389.06009259259 | 50.219 |
| 44389.10175925926 | 49.601 |
| 44389.143425925926 | 49.138 |
| 44389.18509259259 | 48.597 |
| 44389.22675925926 | 48.289 |
| 44389.268425925926 | 47.902 |
| 44389.31009259259 | 47.902 |
| 44389.35175925926 | 48.289 |
| 44389.393425925926 | 49.215 |
| 44389.43509259259 | 50.837 |
| 44389.47675925926 | 52.922 |
| 44389.518425925926 | 55.084 |
| 44389.56009259259 | 57.323 |
| 44389.60175925926 | 59.563 |
| 44389.643425925926 | 61.107 |
| 44389.68509259259 | 61.648 |
| 44389.72675925926 | 61.493 |
| 44389.768425925926 | 60.798 |
| 44389.81009259259 | 59.254 |
| 44389.85175925926 | 57.401 |
| 44389.893425925926 | 55.393 |
| 44389.93509259259 | 53.54 |
| 44389.97675925926 | 52.227 |
| 44390.018425925926 | 51.3 |
| 44390.06009259259 | 50.76 |
| 44390.10175925926 | 50.065 |
| 44390.143425925926 | 49.601 |
| 44390.18509259259 | 49.061 |
| 44390.22675925926 | 48.752 |
| 44390.268425925926 | 48.366 |
| 44390.31009259259 | 48.289 |
| 44390.35175925926 | 48.675 |
| 44390.393425925926 | 49.37 |
| 44390.43509259259 | 50.991 |
| 44390.47675925926 | 52.458 |
| 44390.518425925926 | 53.848 |
| 44390.56009259259 | 55.856 |
| 44390.60175925926 | 55.933 |
| 44390.643425925926 | 56.706 |
| 44390.68509259259 | 56.86 |
| 44390.72675925926 | 56.474 |
| 44390.768425925926 | 55.933 |
| 44390.81009259259 | 55.161 |
| 44390.85175925926 | 54.157 |
| 44390.893425925926 | 52.922 |
| 44390.93509259259 | 51.841 |
| 44390.97675925926 | 50.991 |
| 44391.018425925926 | 49.987 |
| 44391.06009259259 | 49.215 |
| 44391.10175925926 | 48.597 |
| 44391.143425925926 | 48.134 |
| 44391.18509259259 | 47.748 |
| 44391.22675925926 | 47.439 |
| 44391.268425925926 | 47.13 |
| 44391.31009259259 | 47.207 |
| 44391.35175925926 | 47.439 |
| 44391.393425925926 | 47.825 |
| 44391.43509259259 | 48.211 |
| 44391.47675925926 | 49.061 |
| 44391.518425925926 | 50.065 |
| 44391.56009259259 | 51.3 |
| 44391.60175925926 | 52.304 |
| 44391.643425925926 | 52.304 |
| 44391.68509259259 | 51.532 |
| 44391.72675925926 | 51.069 |
| 44391.768425925926 | 50.837 |
| 44391.81009259259 | 50.528 |
| 44391.85175925926 | 49.91 |
| 44391.893425925926 | 48.984 |
| 44391.93509259259 | 48.289 |
| 44391.97675925926 | 47.671 |
| 44392.018425925926 | 47.207 |
| 44392.06009259259 | 46.821 |
| 44392.10175925926 | 46.204 |
| 44392.143425925926 | 45.74 |
| 44392.18509259259 | 45.431 |
| 44392.22675925926 | 44.968 |
| 44392.268425925926 | 44.582 |
| 44392.31009259259 | 44.582 |
| 44392.35175925926 | 44.968 |
| 44392.393425925926 | 46.204 |
| 44392.43509259259 | 47.98 |
| 44392.47675925926 | 50.296 |
| 44392.518425925926 | 52.999 |
| 44392.56009259259 | 55.779 |
| 44392.60175925926 | 58.173 |
| 44392.643425925926 | 59.64 |
| 44392.68509259259 | 59.794 |
| 44392.72675925926 | 59.64 |
| 44392.768425925926 | 59.022 |
| 44392.81009259259 | 57.323 |
| 44392.85175925926 | 55.702 |
| 44392.893425925926 | 54.157 |
| 44392.93509259259 | 52.458 |
| 44392.97675925926 | 50.991 |
| 44393.018425925926 | 49.91 |
| 44393.06009259259 | 48.984 |
| 44393.10175925926 | 47.98 |
| 44393.143425925926 | 47.285 |
| 44393.18509259259 | 46.513 |
| 44393.22675925926 | 45.972 |
| 44393.268425925926 | 45.509 |
| 44393.31009259259 | 45.277 |
| 44393.35175925926 | 45.663 |
| 44393.393425925926 | 46.899 |
| 44393.43509259259 | 48.675 |
| 44393.47675925926 | 51.069 |
| 44393.518425925926 | 51.764 |
| 44393.56009259259 | 52.999 |
| 44393.60175925926 | 53.926 |
| 44393.643425925926 | 54.621 |
| 44393.68509259259 | 55.316 |
| 44393.72675925926 | 55.316 |
| 44393.768425925926 | 55.084 |
| 44393.81009259259 | 54.466 |
| 44393.85175925926 | 53.385 |
| 44393.893425925926 | 52.227 |
| 44393.93509259259 | 51.146 |
| 44393.97675925926 | 50.219 |
| 44394.018425925926 | 49.138 |
| 44394.06009259259 | 48.443 |
| 44394.10175925926 | 47.902 |
| 44394.143425925926 | 47.285 |
| 44394.18509259259 | 46.821 |
| 44394.22675925926 | 46.667 |
| 44394.268425925926 | 46.358 |
| 44394.31009259259 | 46.281 |
| 44394.35175925926 | 47.053 |
| 44394.393425925926 | 48.211 |
| 44394.43509259259 | 49.833 |
| 44394.47675925926 | 52.767 |
| 44394.518425925926 | 54.621 |
| 44394.56009259259 | 57.015 |
| 44394.60175925926 | 58.868 |
| 44394.643425925926 | 58.482 |
| 44394.68509259259 | 58.018 |
| 44394.72675925926 | 56.706 |
| 44394.768425925926 | 55.933 |
| 44394.81009259259 | 55.007 |
| 44394.85175925926 | 53.462 |
| 44394.893425925926 | 52.072 |
| 44394.93509259259 | 50.914 |
| 44394.97675925926 | 50.065 |
| 44395.018425925926 | 49.292 |
| 44395.06009259259 | 48.675 |
| 44395.10175925926 | 47.902 |
| 44395.143425925926 | 47.207 |
| 44395.18509259259 | 46.667 |
| 44395.22675925926 | 46.204 |
| 44395.268425925926 | 45.74 |
| 44395.31009259259 | 45.586 |
| 44395.35175925926 | 45.972 |
| 44395.393425925926 | 47.207 |
| 44395.43509259259 | 48.984 |
| 44395.47675925926 | 51.455 |
| 44395.518425925926 | 54.08 |
| 44395.56009259259 | 56.783 |
| 44395.60175925926 | 59.408 |
| 44395.643425925926 | 61.184 |
| 44395.68509259259 | 61.802 |
| 44395.72675925926 | 62.497 |
| 44395.768425925926 | 61.648 |
| 44395.81009259259 | 60.489 |
| 44395.85175925926 | 58.636 |
| 44395.893425925926 | 56.86 |
| 44395.93509259259 | 54.852 |
| 44395.97675925926 | 52.922 |
| 44396.018425925926 | 51.223 |
| 44396.06009259259 | 49.756 |
| 44396.10175925926 | 48.752 |
| 44396.143425925926 | 47.748 |
| 44396.18509259259 | 47.053 |
| 44396.22675925926 | 46.281 |
| 44396.268425925926 | 45.818 |
| 44396.31009259259 | 45.431 |
| 44396.35175925926 | 45.663 |
| 44396.393425925926 | 46.744 |
| 44396.43509259259 | 48.443 |
| 44396.47675925926 | 50.76 |
| 44396.518425925926 | 53.231 |
| 44396.56009259259 | 56.011 |
| 44396.60175925926 | 58.404 |
| 44396.643425925926 | 60.644 |
| 44396.68509259259 | 61.571 |
| 44396.72675925926 | 61.184 |
| 44396.768425925926 | 60.489 |
| 44396.81009259259 | 58.945 |
| 44396.85175925926 | 57.015 |
| 44396.893425925926 | 55.084 |
| 44396.93509259259 | 53.462 |
| 44396.97675925926 | 51.764 |
| 44397.018425925926 | 50.296 |
| 44397.06009259259 | 49.215 |
| 44397.10175925926 | 48.134 |
| 44397.143425925926 | 47.516 |
| 44397.18509259259 | 46.976 |
| 44397.22675925926 | 46.513 |
| 44397.268425925926 | 46.126 |
| 44397.31009259259 | 45.895 |
| 44397.35175925926 | 46.204 |
| 44397.393425925926 | 47.285 |
| 44397.43509259259 | 49.061 |
| 44397.47675925926 | 51.609 |
| 44397.518425925926 | 54.389 |
| 44397.56009259259 | 57.246 |
| 44397.60175925926 | 58.404 |
| 44397.643425925926 | 58.713 |
| 44397.68509259259 | 59.331 |
| 44397.72675925926 | 60.103 |
| 44397.768425925926 | 59.794 |
| 44397.81009259259 | 58.791 |
| 44397.85175925926 | 57.246 |
| 44397.893425925926 | 55.779 |
| 44397.93509259259 | 54.312 |
| 44397.97675925926 | 52.845 |
| 44398.018425925926 | 51.764 |
| 44398.06009259259 | 50.528 |
| 44398.10175925926 | 49.601 |
| 44398.143425925926 | 48.675 |
| 44398.18509259259 | 48.057 |
| 44398.22675925926 | 47.362 |
| 44398.268425925926 | 46.899 |
| 44398.31009259259 | 46.744 |
| 44398.35175925926 | 46.976 |
| 44398.393425925926 | 47.439 |
| 44398.43509259259 | 49.061 |
| 44398.47675925926 | 51.764 |
| 44398.518425925926 | 54.543 |
| 44398.56009259259 | 54.852 |
| 44398.60175925926 | 55.316 |
| 44398.643425925926 | 55.084 |
| 44398.68509259259 | 55.161 |
| 44398.72675925926 | 56.32 |
| 44398.768425925926 | 56.937 |
| 44398.81009259259 | 55.933 |
| 44398.85175925926 | 54.621 |
| 44398.893425925926 | 52.999 |
| 44398.93509259259 | 51.609 |
| 44398.97675925926 | 50.76 |
| 44399.018425925926 | 50.142 |
| 44399.06009259259 | 49.756 |
| 44399.10175925926 | 49.292 |
| 44399.143425925926 | 49.138 |
| 44399.18509259259 | 48.906 |
| 44399.22675925926 | 48.289 |
| 44399.268425925926 | 47.671 |
| 44399.31009259259 | 47.285 |
| 44399.35175925926 | 47.748 |
| 44399.393425925926 | 48.829 |
| 44399.43509259259 | 50.451 |
| 44399.47675925926 | 52.69 |
| 44399.518425925926 | 55.161 |
| 44399.56009259259 | 58.018 |
| 44399.60175925926 | 59.872 |
| 44399.643425925926 | 60.026 |
| 44399.68509259259 | 59.177 |
| 44399.72675925926 | 58.018 |
| 44399.768425925926 | 57.015 |
| 44399.81009259259 | 55.933 |
| 44399.85175925926 | 54.466 |
| 44399.893425925926 | 52.845 |
| 44399.93509259259 | 51.455 |
| 44399.97675925926 | 50.296 |
| 44400.018425925926 | 49.524 |
| 44400.06009259259 | 49.061 |
| 44400.10175925926 | 48.675 |
| 44400.143425925926 | 48.211 |
| 44400.18509259259 | 47.825 |
| 44400.22675925926 | 47.362 |
| 44400.268425925926 | 46.976 |
| 44400.31009259259 | 46.899 |
| 44400.35175925926 | 47.13 |
| 44400.393425925926 | 48.443 |
| 44400.43509259259 | 50.142 |
| 44400.47675925926 | 52.381 |
| 44400.518425925926 | 55.161 |
| 44400.56009259259 | 58.096 |
| 44400.60175925926 | 60.258 |
| 44400.643425925926 | 59.717 |
| 44400.68509259259 | 58.173 |
| 44400.72675925926 | 57.169 |
| 44400.768425925926 | 55.856 |
| 44400.81009259259 | 53.771 |
| 44400.85175925926 | 52.458 |
| 44400.893425925926 | 52.458 |
| 44400.93509259259 | 52.072 |
| 44400.97675925926 | 51.069 |
| 44401.018425925926 | 50.528 |
| 44401.06009259259 | 50.142 |
| 44401.10175925926 | 49.756 |
| 44401.143425925926 | 49.447 |
| 44401.18509259259 | 49.061 |
| 44401.22675925926 | 48.52 |
| 44401.268425925926 | 48.057 |
| 44401.31009259259 | 47.902 |
| 44401.35175925926 | 48.134 |
| 44401.393425925926 | 48.675 |
| 44401.43509259259 | 49.601 |
| 44401.47675925926 | 51.609 |
| 44401.518425925926 | 52.999 |
| 44401.56009259259 | 55.393 |
| 44401.60175925926 | 56.783 |
| 44401.643425925926 | 57.478 |
| 44401.68509259259 | 56.783 |
| 44401.72675925926 | 56.706 |
| 44401.768425925926 | 56.165 |
| 44401.81009259259 | 54.93 |
| 44401.85175925926 | 53.462 |
| 44401.893425925926 | 52.304 |
| 44401.93509259259 | 51.146 |
| 44401.97675925926 | 50.374 |
| 44402.018425925926 | 49.447 |
| 44402.06009259259 | 48.443 |
| 44402.10175925926 | 47.902 |
| 44402.143425925926 | 47.207 |
| 44402.18509259259 | 46.821 |
| 44402.22675925926 | 46.281 |
| 44402.268425925926 | 46.126 |
| 44402.31009259259 | 46.126 |
| 44402.35175925926 | 46.513 |
| 44402.393425925926 | 47.516 |
| 44402.43509259259 | 49.061 |
| 44402.47675925926 | 51.3 |
| 44402.518425925926 | 53.848 |
| 44402.56009259259 | 56.32 |
| 44402.60175925926 | 58.868 |
| 44402.643425925926 | 60.953 |
| 44402.68509259259 | 62.034 |
| 44402.72675925926 | 61.879 |
| 44402.768425925926 | 61.03 |
| 44402.81009259259 | 59.408 |
| 44402.85175925926 | 57.71 |
| 44402.893425925926 | 55.779 |
| 44402.93509259259 | 54.08 |
| 44402.97675925926 | 52.613 |
| 44403.018425925926 | 51.455 |
| 44403.06009259259 | 50.528 |
| 44403.10175925926 | 49.601 |
| 44403.143425925926 | 48.752 |
| 44403.18509259259 | 48.057 |
| 44403.22675925926 | 47.439 |
| 44403.268425925926 | 47.053 |
| 44403.31009259259 | 46.899 |
| 44403.35175925926 | 47.285 |
| 44403.393425925926 | 48.211 |
| 44403.43509259259 | 49.987 |
| 44403.47675925926 | 52.304 |
| 44403.518425925926 | 54.93 |
| 44403.56009259259 | 57.632 |
| 44403.60175925926 | 59.254 |
| 44403.643425925926 | 60.026 |
| 44403.68509259259 | 61.184 |
| 44403.72675925926 | 61.184 |
| 44403.768425925926 | 60.026 |
| 44403.81009259259 | 58.018 |
| 44403.85175925926 | 56.165 |
| 44403.893425925926 | 54.621 |
| 44403.93509259259 | 53.231 |
| 44403.97675925926 | 52.072 |
| 44404.018425925926 | 50.837 |
| 44404.06009259259 | 49.91 |
| 44404.10175925926 | 49.138 |
| 44404.143425925926 | 48.52 |
| 44404.18509259259 | 48.057 |
| 44404.22675925926 | 47.439 |
| 44404.268425925926 | 47.207 |
| 44404.31009259259 | 46.976 |
| 44404.35175925926 | 47.362 |
| 44404.393425925926 | 48.443 |
| 44404.43509259259 | 50.219 |
| 44404.47675925926 | 52.613 |
| 44404.518425925926 | 55.316 |
| 44404.56009259259 | 58.018 |
| 44404.60175925926 | 60.335 |
| 44404.643425925926 | 62.497 |
| 44404.68509259259 | 63.038 |
| 44404.72675925926 | 62.42 |
| 44404.768425925926 | 62.034 |
| 44404.81009259259 | 61.184 |
| 44404.85175925926 | 59.563 |
| 44404.893425925926 | 57.401 |
| 44404.93509259259 | 55.47 |
| 44404.97675925926 | 53.848 |
| 44405.018425925926 | 52.536 |
| 44405.06009259259 | 51.609 |
| 44405.10175925926 | 50.991 |
| 44405.143425925926 | 50.374 |
| 44405.18509259259 | 49.833 |
| 44405.22675925926 | 49.447 |
| 44405.268425925926 | 49.061 |
| 44405.31009259259 | 48.906 |
| 44405.35175925926 | 49.138 |
| 44405.393425925926 | 50.219 |
| 44405.43509259259 | 51.918 |
| 44405.47675925926 | 54.157 |
| 44405.518425925926 | 56.783 |
| 44405.56009259259 | 59.254 |
| 44405.60175925926 | 61.725 |
| 44405.643425925926 | 63.655 |
| 44405.68509259259 | 64.582 |
| 44405.72675925926 | 64.428 |
| 44405.768425925926 | 62.729 |
| 44405.81009259259 | 61.339 |
| 44405.85175925926 | 59.794 |
| 44405.893425925926 | 57.864 |
| 44405.93509259259 | 56.165 |
| 44405.97675925926 | 54.621 |
| 44406.018425925926 | 53.54 |
| 44406.06009259259 | 52.69 |
| 44406.10175925926 | 51.841 |
| 44406.143425925926 | 51.223 |
| 44406.18509259259 | 50.605 |
| 44406.22675925926 | 50.296 |
| 44406.268425925926 | 49.833 |
| 44406.31009259259 | 49.833 |
| 44406.35175925926 | 50.296 |
| 44406.393425925926 | 51.377 |
| 44406.43509259259 | 52.922 |
| 44406.47675925926 | 55.161 |
| 44406.518425925926 | 57.71 |
| 44406.56009259259 | 60.335 |
| 44406.60175925926 | 62.42 |
| 44406.643425925926 | 64.119 |
| 44406.68509259259 | 65.277 |
| 44406.72675925926 | 65.277 |
| 44406.768425925926 | 63.964 |
| 44406.81009259259 | 61.879 |
| 44406.85175925926 | 59.949 |
| 44406.893425925926 | 58.482 |
| 44406.93509259259 | 57.015 |
| 44406.97675925926 | 55.547 |
| 44407.018425925926 | 54.312 |
| 44407.06009259259 | 53.153 |
| 44407.10175925926 | 52.304 |
| 44407.143425925926 | 51.609 |
| 44407.18509259259 | 50.914 |
| 44407.22675925926 | 50.219 |
| 44407.268425925926 | 49.679 |
| 44407.31009259259 | 49.292 |
| 44407.35175925926 | 49.447 |
| 44407.393425925926 | 50.374 |
| 44407.43509259259 | 52.227 |
| 44407.47675925926 | 54.543 |
| 44407.518425925926 | 57.169 |
| 44407.56009259259 | 60.103 |
| 44407.60175925926 | 61.648 |
| 44407.643425925926 | 60.876 |
| 44407.68509259259 | 60.953 |
| 44407.72675925926 | 60.103 |
| 44407.768425925926 | 59.177 |
| 44407.81009259259 | 57.169 |
| 44407.85175925926 | 55.161 |
| 44407.893425925926 | 54.157 |
| 44407.93509259259 | 53.694 |
| 44407.97675925926 | 53.076 |
| 44408.018425925926 | 52.381 |
| 44408.06009259259 | 51.995 |
| 44408.10175925926 | 51.918 |
| 44408.143425925926 | 51.918 |
| 44408.18509259259 | 51.764 |
| 44408.22675925926 | 51.532 |
| 44408.268425925926 | 51.3 |
| 44408.31009259259 | 51.223 |
| 44408.35175925926 | 51.686 |
| 44408.393425925926 | 52.767 |
| 44408.43509259259 | 54.08 |
| 44408.47675925926 | 56.088 |
| 44408.518425925926 | 56.937 |
| 44408.56009259259 | 57.555 |
| 44408.60175925926 | 57.787 |
| 44408.643425925926 | 58.173 |
| 44408.68509259259 | 57.787 |
| 44408.72675925926 | 56.706 |
| 44408.768425925926 | 55.856 |
| 44408.81009259259 | 55.161 |
| 44408.85175925926 | 54.698 |
| 44408.893425925926 | 54.08 |
| 44408.93509259259 | 53.694 |
| 44408.97675925926 | 53.462 |
| 44409.018425925926 | 53.231 |
| 44409.06009259259 | 52.999 |
| 44409.10175925926 | 52.999 |
| 44409.143425925926 | 52.845 |
| 44409.18509259259 | 52.69 |
| 44409.22675925926 | 52.613 |
| 44409.268425925926 | 52.613 |
| 44409.31009259259 | 52.69 |
| 44409.35175925926 | 52.767 |
| 44409.393425925926 | 53.385 |
| 44409.43509259259 | 54.003 |
| 44409.47675925926 | 54.93 |
| 44409.518425925926 | 56.551 |
| 44409.56009259259 | 57.401 |
| 44409.60175925926 | 58.482 |
| 44409.643425925926 | 60.335 |
| 44409.68509259259 | 61.03 |
| 44409.72675925926 | 60.876 |
| 44409.768425925926 | 60.026 |
| 44409.81009259259 | 59.099 |
| 44409.85175925926 | 58.096 |
| 44409.893425925926 | 56.937 |
| 44409.93509259259 | 55.933 |
| 44409.97675925926 | 55.393 |
| 44410.018425925926 | 54.93 |
| 44410.06009259259 | 54.389 |
| 44410.10175925926 | 54.08 |
| 44410.143425925926 | 53.848 |
| 44410.18509259259 | 53.617 |
| 44410.22675925926 | 53.385 |
| 44410.268425925926 | 53.308 |
| 44410.31009259259 | 53.462 |
| 44410.35175925926 | 53.848 |
| 44410.393425925926 | 54.775 |
| 44410.43509259259 | 56.397 |
| 44410.47675925926 | 58.096 |
| 44410.518425925926 | 58.327 |
| 44410.56009259259 | 59.177 |
| 44410.60175925926 | 59.872 |
| 44410.643425925926 | 59.949 |
| 44410.68509259259 | 59.872 |
| 44410.72675925926 | 59.64 |
| 44410.768425925926 | 58.482 |
| 44410.81009259259 | 57.555 |
| 44410.85175925926 | 56.783 |
| 44410.893425925926 | 56.32 |
| 44410.93509259259 | 56.088 |
| 44410.97675925926 | 56.32 |
| 44411.018425925926 | 56.088 |
| 44411.06009259259 | 55.702 |
| 44411.10175925926 | 55.47 |
| 44411.143425925926 | 55.238 |
| 44411.18509259259 | 55.161 |
| 44411.22675925926 | 55.161 |
| 44411.268425925926 | 55.161 |
| 44411.31009259259 | 55.393 |
| 44411.35175925926 | 55.625 |
| 44411.393425925926 | 55.933 |
| 44411.43509259259 | 56.32 |
| 44411.47675925926 | 56.937 |
| 44411.518425925926 | 57.71 |
| 44411.56009259259 | 58.404 |
| 44411.60175925926 | 58.559 |
| 44411.643425925926 | 58.868 |
| 44411.68509259259 | 58.791 |
| 44411.72675925926 | 58.327 |
| 44411.768425925926 | 58.018 |
| 44411.81009259259 | 57.71 |
| 44411.85175925926 | 57.015 |
| 44411.893425925926 | 56.706 |
| 44411.93509259259 | 56.32 |
| 44411.97675925926 | 56.088 |
| 44412.018425925926 | 55.702 |
| 44412.06009259259 | 55.316 |
| 44412.10175925926 | 55.007 |
| 44412.143425925926 | 54.698 |
| 44412.18509259259 | 54.543 |
| 44412.22675925926 | 54.235 |
| 44412.268425925926 | 54.157 |
| 44412.31009259259 | 54.08 |
| 44412.35175925926 | 54.389 |
| 44412.393425925926 | 55.084 |
| 44412.43509259259 | 56.165 |
| 44412.47675925926 | 57.555 |
| 44412.518425925926 | 58.945 |
| 44412.56009259259 | 60.412 |
| 44412.60175925926 | 61.802 |
| 44412.643425925926 | 62.42 |
| 44412.68509259259 | 62.574 |
| 44412.72675925926 | 62.111 |
| 44412.768425925926 | 61.03 |
| 44412.81009259259 | 59.717 |
| 44412.85175925926 | 58.559 |
| 44412.893425925926 | 57.71 |
| 44412.93509259259 | 56.86 |
| 44412.97675925926 | 56.165 |
| 44413.018425925926 | 55.547 |
| 44413.06009259259 | 55.238 |
| 44413.10175925926 | 54.852 |
| 44413.143425925926 | 54.621 |
| 44413.18509259259 | 54.312 |
| 44413.22675925926 | 54.08 |
| 44413.268425925926 | 53.926 |
| 44413.31009259259 | 53.771 |
| 44413.35175925926 | 54.08 |
| 44413.393425925926 | 54.775 |
| 44413.43509259259 | 56.011 |
| 44413.47675925926 | 57.71 |
| 44413.518425925926 | 59.408 |
| 44413.56009259259 | 61.107 |
| 44413.60175925926 | 62.42 |
| 44413.643425925926 | 63.115 |
| 44413.68509259259 | 63.038 |
| 44413.72675925926 | 62.497 |
| 44413.768425925926 | 61.416 |
| 44413.81009259259 | 60.489 |
| 44413.85175925926 | 59.254 |
| 44413.893425925926 | 58.173 |
| 44413.93509259259 | 57.401 |
| 44413.97675925926 | 56.551 |
| 44414.018425925926 | 56.011 |
| 44414.06009259259 | 55.625 |
| 44414.10175925926 | 55.393 |
| 44414.143425925926 | 55.084 |
| 44414.18509259259 | 55.007 |
| 44414.22675925926 | 54.775 |
| 44414.268425925926 | 54.621 |
| 44414.31009259259 | 54.389 |
| 44414.35175925926 | 54.698 |
| 44414.393425925926 | 55.161 |
| 44414.43509259259 | 56.165 |
| 44414.47675925926 | 58.404 |
| 44414.518425925926 | 59.872 |
| 44414.56009259259 | 60.644 |
| 44414.60175925926 | 60.567 |
| 44414.643425925926 | 60.181 |
| 44414.68509259259 | 59.717 |
| 44414.72675925926 | 59.872 |
| 44414.768425925926 | 59.717 |
| 44414.81009259259 | 58.868 |
| 44414.85175925926 | 58.018 |
| 44414.893425925926 | 57.169 |
| 44414.93509259259 | 56.628 |
| 44414.97675925926 | 56.088 |
| 44415.018425925926 | 55.625 |
| 44415.06009259259 | 55.316 |
| 44415.10175925926 | 55.238 |
| 44415.143425925926 | 54.93 |
| 44415.18509259259 | 54.621 |
| 44415.22675925926 | 54.312 |
| 44415.268425925926 | 53.926 |
| 44415.31009259259 | 53.771 |
| 44415.35175925926 | 54.003 |
| 44415.393425925926 | 54.389 |
| 44415.43509259259 | 54.775 |
| 44415.47675925926 | 55.547 |
| 44415.518425925926 | 56.937 |
| 44415.56009259259 | 58.096 |
| 44415.60175925926 | 58.559 |
| 44415.643425925926 | 58.636 |
| 44415.68509259259 | 58.636 |
| 44415.72675925926 | 58.096 |
| 44415.768425925926 | 57.401 |
| 44415.81009259259 | 56.706 |
| 44415.85175925926 | 56.011 |
| 44415.893425925926 | 55.161 |
| 44415.93509259259 | 54.466 |
| 44415.97675925926 | 53.848 |
| 44416.018425925926 | 53.308 |
| 44416.06009259259 | 52.922 |
| 44416.10175925926 | 52.613 |
| 44416.143425925926 | 52.304 |
| 44416.18509259259 | 52.15 |
| 44416.22675925926 | 51.918 |
| 44416.268425925926 | 51.532 |
| 44416.31009259259 | 51.455 |
| 44416.35175925926 | 51.841 |
| 44416.393425925926 | 52.458 |
| 44416.43509259259 | 53.848 |
| 44416.47675925926 | 55.547 |
| 44416.518425925926 | 57.555 |
| 44416.56009259259 | 59.331 |
| 44416.60175925926 | 61.107 |
| 44416.643425925926 | 62.111 |
| 44416.68509259259 | 62.188 |
| 44416.72675925926 | 61.802 |
| 44416.768425925926 | 60.721 |
| 44416.81009259259 | 59.331 |
| 44416.85175925926 | 57.941 |
| 44416.893425925926 | 56.397 |
| 44416.93509259259 | 55.007 |
| 44416.97675925926 | 53.926 |
| 44417.018425925926 | 53.231 |
| 44417.06009259259 | 52.767 |
| 44417.10175925926 | 52.304 |
| 44417.143425925926 | 51.918 |
| 44417.18509259259 | 51.686 |
| 44417.22675925926 | 51.223 |
| 44417.268425925926 | 50.991 |
| 44417.31009259259 | 50.914 |
| 44417.35175925926 | 51.146 |
| 44417.393425925926 | 51.764 |
| 44417.43509259259 | 53.076 |
| 44417.47675925926 | 54.543 |
| 44417.518425925926 | 55.933 |
| 44417.56009259259 | 57.169 |
| 44417.60175925926 | 59.331 |
| 44417.643425925926 | 61.03 |
| 44417.68509259259 | 60.953 |
| 44417.72675925926 | 60.721 |
| 44417.768425925926 | 60.489 |
| 44417.81009259259 | 58.868 |
| 44417.85175925926 | 56.937 |
| 44417.893425925926 | 55.238 |
| 44417.93509259259 | 53.848 |
| 44417.97675925926 | 52.845 |
| 44418.018425925926 | 51.918 |
| 44418.06009259259 | 51.3 |
| 44418.10175925926 | 50.76 |
| 44418.143425925926 | 50.451 |
| 44418.18509259259 | 50.065 |
| 44418.22675925926 | 49.679 |
| 44418.268425925926 | 49.292 |
| 44418.31009259259 | 49.215 |
| 44418.35175925926 | 49.524 |
| 44418.393425925926 | 50.296 |
| 44418.43509259259 | 51.764 |
| 44418.47675925926 | 53.771 |
| 44418.518425925926 | 55.316 |
| 44418.56009259259 | 55.856 |
| 44418.60175925926 | 57.169 |
| 44418.643425925926 | 56.32 |
| 44418.68509259259 | 55.47 |
| 44418.72675925926 | 55.007 |
| 44418.768425925926 | 54.621 |
| 44418.81009259259 | 53.54 |
| 44418.85175925926 | 51.995 |
| 44418.893425925926 | 50.605 |
| 44418.93509259259 | 49.37 |
| 44418.97675925926 | 48.366 |
| 44419.018425925926 | 47.516 |
| 44419.06009259259 | 46.976 |
| 44419.10175925926 | 46.513 |
| 44419.143425925926 | 46.204 |
| 44419.18509259259 | 45.818 |
| 44419.22675925926 | 45.431 |
| 44419.268425925926 | 45.045 |
| 44419.31009259259 | 44.891 |
| 44419.35175925926 | 45.123 |
| 44419.393425925926 | 45.972 |
| 44419.43509259259 | 47.362 |
| 44419.47675925926 | 49.215 |
| 44419.518425925926 | 51.069 |
| 44419.56009259259 | 52.845 |
| 44419.60175925926 | 53.848 |
| 44419.643425925926 | 54.157 |
| 44419.68509259259 | 53.848 |
| 44419.72675925926 | 52.767 |
| 44419.768425925926 | 51.146 |
| 44419.81009259259 | 49.292 |
| 44419.85175925926 | 47.516 |
| 44419.893425925926 | 46.049 |
| 44419.93509259259 | 44.814 |
| 44419.97675925926 | 44.041 |
| 44420.018425925926 | 43.655 |
| 44420.06009259259 | 43.269 |
| 44420.10175925926 | 43.038 |
| 44420.143425925926 | 42.729 |
| 44420.18509259259 | 42.574 |
| 44420.22675925926 | 42.343 |
| 44420.268425925926 | 42.034 |
| 44420.31009259259 | 42.111 |
| 44420.35175925926 | 42.497 |
| 44420.393425925926 | 43.269 |
| 44420.43509259259 | 44.582 |
| 44420.47675925926 | 46.513 |
| 44420.518425925926 | 48.984 |
| 44420.56009259259 | 50.605 |
| 44420.60175925926 | 51.455 |
| 44420.643425925926 | 54.157 |
| 44420.68509259259 | 54.235 |
| 44420.72675925926 | 53.54 |
| 44420.768425925926 | 53.308 |
| 44420.81009259259 | 52.227 |
| 44420.85175925926 | 50.991 |
| 44420.893425925926 | 50.142 |
| 44420.93509259259 | 49.601 |
| 44420.97675925926 | 48.984 |
| 44421.018425925926 | 48.443 |
| 44421.06009259259 | 47.825 |
| 44421.10175925926 | 47.362 |
| 44421.143425925926 | 46.899 |
| 44421.18509259259 | 46.59 |
| 44421.22675925926 | 46.204 |
| 44421.268425925926 | 45.818 |
| 44421.31009259259 | 45.663 |
| 44421.35175925926 | 45.895 |
| 44421.393425925926 | 46.744 |
| 44421.43509259259 | 48.366 |
| 44421.47675925926 | 50.605 |
| 44421.518425925926 | 53.153 |
| 44421.56009259259 | 55.238 |
| 44421.60175925926 | 57.401 |
| 44421.643425925926 | 57.787 |
| 44421.68509259259 | 57.864 |
| 44421.72675925926 | 58.559 |
| 44421.768425925926 | 57.787 |
| 44421.81009259259 | 56.783 |
| 44421.85175925926 | 55.393 |
| 44421.893425925926 | 53.848 |
| 44421.93509259259 | 52.458 |
| 44421.97675925926 | 51.069 |
| 44422.018425925926 | 49.987 |
| 44422.06009259259 | 48.829 |
| 44422.10175925926 | 47.671 |
| 44422.143425925926 | 46.821 |
| 44422.18509259259 | 46.358 |
| 44422.22675925926 | 45.74 |
| 44422.268425925926 | 45.2 |
| 44422.31009259259 | 45.045 |
| 44422.35175925926 | 45.2 |
| 44422.393425925926 | 46.204 |
| 44422.43509259259 | 47.902 |
| 44422.47675925926 | 50.142 |
| 44422.518425925926 | 52.922 |
| 44422.56009259259 | 55.702 |
| 44422.60175925926 | 58.173 |
| 44422.643425925926 | 59.563 |
| 44422.68509259259 | 60.181 |
| 44422.72675925926 | 60.489 |
| 44422.768425925926 | 59.717 |
| 44422.81009259259 | 58.327 |
| 44422.85175925926 | 56.628 |
| 44422.893425925926 | 54.698 |
| 44422.93509259259 | 52.845 |
| 44422.97675925926 | 51.069 |
| 44423.018425925926 | 49.601 |
| 44423.06009259259 | 48.52 |
| 44423.10175925926 | 47.748 |
| 44423.143425925926 | 47.285 |
| 44423.18509259259 | 46.744 |
| 44423.22675925926 | 46.126 |
| 44423.268425925926 | 45.74 |
| 44423.31009259259 | 45.431 |
| 44423.35175925926 | 45.972 |
| 44423.393425925926 | 47.13 |
| 44423.43509259259 | 48.752 |
| 44423.47675925926 | 51.069 |
| 44423.518425925926 | 53.231 |
| 44423.56009259259 | 55.084 |
| 44423.60175925926 | 55.625 |
| 44423.643425925926 | 56.165 |
| 44423.68509259259 | 55.393 |
| 44423.72675925926 | 54.775 |
| 44423.768425925926 | 54.235 |
| 44423.81009259259 | 52.999 |
| 44423.85175925926 | 51.764 |
| 44423.893425925926 | 50.605 |
| 44423.93509259259 | 49.524 |
| 44423.97675925926 | 48.675 |
| 44424.018425925926 | 47.98 |
| 44424.06009259259 | 47.13 |
| 44424.10175925926 | 46.59 |
| 44424.143425925926 | 46.126 |
| 44424.18509259259 | 45.586 |
| 44424.22675925926 | 45.123 |
| 44424.268425925926 | 44.736 |
| 44424.31009259259 | 44.505 |
| 44424.35175925926 | 44.736 |
| 44424.393425925926 | 45.74 |
| 44424.43509259259 | 47.439 |
| 44424.47675925926 | 49.679 |
| 44424.518425925926 | 52.15 |
| 44424.56009259259 | 55.084 |
| 44424.60175925926 | 57.246 |
| 44424.643425925926 | 58.945 |
| 44424.68509259259 | 58.945 |
| 44424.72675925926 | 58.404 |
| 44424.768425925926 | 57.246 |
| 44424.81009259259 | 56.165 |
| 44424.85175925926 | 54.698 |
| 44424.893425925926 | 53.153 |
| 44424.93509259259 | 51.377 |
| 44424.97675925926 | 49.679 |
| 44425.018425925926 | 48.211 |
| 44425.06009259259 | 47.207 |
| 44425.10175925926 | 46.281 |
| 44425.143425925926 | 45.74 |
| 44425.18509259259 | 45.2 |
| 44425.22675925926 | 44.736 |
| 44425.268425925926 | 44.428 |
| 44425.31009259259 | 44.119 |
| 44425.35175925926 | 44.428 |
| 44425.393425925926 | 45.431 |
| 44425.43509259259 | 47.053 |
| 44425.47675925926 | 49.447 |
| 44425.518425925926 | 52.072 |
| 44425.56009259259 | 54.08 |
| 44425.60175925926 | 55.161 |
| 44425.643425925926 | 56.86 |
| 44425.68509259259 | 57.71 |
| 44425.72675925926 | 57.478 |
| 44425.768425925926 | 56.937 |
| 44425.81009259259 | 55.625 |
| 44425.85175925926 | 54.003 |
| 44425.893425925926 | 52.69 |
| 44425.93509259259 | 51.532 |
| 44425.97675925926 | 50.374 |
| 44426.018425925926 | 49.292 |
| 44426.06009259259 | 48.52 |
| 44426.10175925926 | 47.594 |
| 44426.143425925926 | 47.207 |
| 44426.18509259259 | 46.513 |
| 44426.22675925926 | 45.972 |
| 44426.268425925926 | 45.586 |
| 44426.31009259259 | 45.431 |
| 44426.35175925926 | 45.509 |
| 44426.393425925926 | 46.59 |
| 44426.43509259259 | 48.134 |
| 44426.47675925926 | 49.524 |
| 44426.518425925926 | 51.377 |
| 44426.56009259259 | 52.922 |
| 44426.60175925926 | 52.999 |
| 44426.643425925926 | 54.157 |
| 44426.68509259259 | 55.933 |
| 44426.72675925926 | 55.625 |
| 44426.768425925926 | 55.393 |
| 44426.81009259259 | 54.312 |
| 44426.85175925926 | 52.999 |
| 44426.893425925926 | 51.609 |
| 44426.93509259259 | 50.374 |
| 44426.97675925926 | 49.601 |
| 44427.018425925926 | 48.52 |
| 44427.06009259259 | 47.748 |
| 44427.10175925926 | 47.13 |
| 44427.143425925926 | 46.59 |
| 44427.18509259259 | 46.435 |
| 44427.22675925926 | 46.204 |
| 44427.268425925926 | 46.049 |
| 44427.31009259259 | 45.972 |
| 44427.35175925926 | 46.204 |
| 44427.393425925926 | 46.899 |
| 44427.43509259259 | 47.748 |
| 44427.47675925926 | 48.829 |
| 44427.518425925926 | 50.296 |
| 44427.56009259259 | 52.381 |
| 44427.60175925926 | 52.922 |
| 44427.643425925926 | 53.308 |
| 44427.68509259259 | 53.694 |
| 44427.72675925926 | 53.926 |
| 44427.768425925926 | 53.771 |
| 44427.81009259259 | 52.613 |
| 44427.85175925926 | 51.686 |
| 44427.893425925926 | 50.682 |
| 44427.93509259259 | 49.756 |
| 44427.97675925926 | 48.675 |
| 44428.018425925926 | 47.825 |
| 44428.06009259259 | 47.053 |
| 44428.10175925926 | 46.435 |
| 44428.143425925926 | 45.74 |
| 44428.18509259259 | 45.123 |
| 44428.22675925926 | 44.582 |
| 44428.268425925926 | 44.041 |
| 44428.31009259259 | 43.655 |
| 44428.35175925926 | 43.655 |
| 44428.393425925926 | 44.35 |
| 44428.43509259259 | 45.045 |
| 44428.47675925926 | 46.126 |
| 44428.518425925926 | 47.671 |
| 44428.56009259259 | 51.532 |
| 44428.60175925926 | 54.003 |
| 44428.643425925926 | 55.856 |
| 44428.68509259259 | 56.011 |
| 44428.72675925926 | 56.088 |
| 44428.768425925926 | 55.702 |
| 44428.81009259259 | 55.007 |
| 44428.85175925926 | 53.617 |
| 44428.893425925926 | 51.609 |
| 44428.93509259259 | 49.679 |
| 44428.97675925926 | 48.057 |
| 44429.018425925926 | 46.435 |
| 44429.06009259259 | 45.277 |
| 44429.10175925926 | 44.428 |
| 44429.143425925926 | 43.81 |
| 44429.18509259259 | 43.501 |
| 44429.22675925926 | 43.192 |
| 44429.268425925926 | 43.038 |
| 44429.31009259259 | 43.038 |
| 44429.35175925926 | 43.346 |
| 44429.393425925926 | 44.428 |
| 44429.43509259259 | 46.281 |
| 44429.47675925926 | 48.597 |
| 44429.518425925926 | 49.91 |
| 44429.56009259259 | 50.296 |
| 44429.60175925926 | 52.613 |
| 44429.643425925926 | 55.084 |
| 44429.68509259259 | 55.084 |
| 44429.72675925926 | 55.547 |
| 44429.768425925926 | 54.621 |
| 44429.81009259259 | 53.308 |
| 44429.85175925926 | 52.15 |
| 44429.893425925926 | 50.837 |
| 44429.93509259259 | 49.601 |
| 44429.97675925926 | 48.443 |
| 44430.018425925926 | 47.439 |
| 44430.06009259259 | 46.59 |
| 44430.10175925926 | 46.049 |
| 44430.143425925926 | 45.586 |
| 44430.18509259259 | 45.045 |
| 44430.22675925926 | 44.736 |
| 44430.268425925926 | 44.505 |
| 44430.31009259259 | 44.582 |
| 44430.35175925926 | 45.045 |
| 44430.393425925926 | 46.126 |
| 44430.43509259259 | 47.594 |
| 44430.47675925926 | 48.597 |
| 44430.518425925926 | 50.528 |
| 44430.56009259259 | 52.227 |
| 44430.60175925926 | 54.157 |
| 44430.643425925926 | 55.47 |
| 44430.68509259259 | 56.165 |
| 44430.72675925926 | 56.32 |
| 44430.768425925926 | 56.088 |
| 44430.81009259259 | 54.621 |
| 44430.85175925926 | 53.462 |
| 44430.893425925926 | 52.15 |
| 44430.93509259259 | 50.528 |
| 44430.97675925926 | 48.906 |
| 44431.018425925926 | 47.439 |
| 44431.06009259259 | 46.049 |
| 44431.10175925926 | 45.045 |
| 44431.143425925926 | 44.273 |
| 44431.18509259259 | 43.655 |
| 44431.22675925926 | 43.346 |
| 44431.268425925926 | 42.96 |
| 44431.31009259259 | 42.806 |
| 44431.35175925926 | 43.192 |
| 44431.393425925926 | 43.964 |
| 44431.43509259259 | 44.968 |
| 44431.47675925926 | 47.362 |
| 44431.518425925926 | 48.057 |
| 44431.56009259259 | 49.91 |
| 44431.60175925926 | 52.536 |
| 44431.643425925926 | 55.007 |
| 44431.68509259259 | 56.474 |
| 44431.72675925926 | 57.092 |
| 44431.768425925926 | 56.397 |
| 44431.81009259259 | 55.007 |
| 44431.85175925926 | 53.617 |
| 44431.893425925926 | 52.072 |
| 44431.93509259259 | 50.296 |
| 44431.97675925926 | 48.675 |
| 44432.018425925926 | 47.207 |
| 44432.06009259259 | 46.049 |
| 44432.10175925926 | 45.045 |
| 44432.143425925926 | 44.35 |
| 44432.18509259259 | 43.733 |
| 44432.22675925926 | 43.269 |
| 44432.268425925926 | 43.115 |
| 44432.31009259259 | 42.806 |
| 44432.35175925926 | 43.038 |
| 44432.393425925926 | 44.196 |
| 44432.43509259259 | 45.2 |
| 44432.47675925926 | 47.748 |
| 44432.518425925926 | 50.76 |
| 44432.56009259259 | 53.54 |
| 44432.60175925926 | 55.547 |
| 44432.643425925926 | 57.478 |
| 44432.68509259259 | 58.636 |
| 44432.72675925926 | 58.791 |
| 44432.768425925926 | 57.864 |
| 44432.81009259259 | 56.397 |
| 44432.85175925926 | 54.543 |
| 44432.893425925926 | 52.536 |
| 44432.93509259259 | 50.837 |
| 44432.97675925926 | 48.984 |
| 44433.018425925926 | 47.285 |
| 44433.06009259259 | 45.895 |
| 44433.10175925926 | 44.891 |
| 44433.143425925926 | 43.964 |
| 44433.18509259259 | 43.269 |
| 44433.22675925926 | 42.729 |
| 44433.268425925926 | 42.343 |
| 44433.31009259259 | 41.956 |
| 44433.35175925926 | 42.265 |
| 44433.393425925926 | 43.192 |
| 44433.43509259259 | 45.123 |
| 44433.47675925926 | 47.671 |
| 44433.518425925926 | 50.451 |
| 44433.56009259259 | 53.385 |
| 44433.60175925926 | 55.933 |
| 44433.643425925926 | 57.941 |
| 44433.68509259259 | 58.945 |
| 44433.72675925926 | 59.022 |
| 44433.768425925926 | 58.018 |
| 44433.81009259259 | 56.551 |
| 44433.85175925926 | 54.775 |
| 44433.893425925926 | 52.845 |
| 44433.93509259259 | 51.069 |
| 44433.97675925926 | 49.292 |
| 44434.018425925926 | 47.671 |
| 44434.06009259259 | 46.435 |
| 44434.10175925926 | 45.509 |
| 44434.143425925926 | 44.736 |
| 44434.18509259259 | 44.273 |
| 44434.22675925926 | 43.964 |
| 44434.268425925926 | 43.578 |
| 44434.31009259259 | 43.501 |
| 44434.35175925926 | 43.733 |
| 44434.393425925926 | 44.659 |
| 44434.43509259259 | 46.281 |
| 44434.47675925926 | 48.52 |
| 44434.518425925926 | 50.528 |
| 44434.56009259259 | 52.536 |
| 44434.60175925926 | 52.999 |
| 44434.643425925926 | 53.771 |
| 44434.68509259259 | 55.084 |
| 44434.72675925926 | 55.856 |
| 44434.768425925926 | 55.393 |
| 44434.81009259259 | 54.003 |
| 44434.85175925926 | 52.381 |
| 44434.893425925926 | 50.914 |
| 44434.93509259259 | 49.833 |
| 44434.97675925926 | 48.675 |
| 44435.018425925926 | 47.439 |
| 44435.06009259259 | 46.281 |
| 44435.10175925926 | 45.509 |
| 44435.143425925926 | 44.814 |
| 44435.18509259259 | 44.273 |
| 44435.22675925926 | 43.81 |
| 44435.268425925926 | 43.346 |
| 44435.31009259259 | 43.192 |
| 44435.35175925926 | 43.346 |
| 44435.393425925926 | 44.35 |
| 44435.43509259259 | 46.281 |
| 44435.47675925926 | 48.289 |
| 44435.518425925926 | 51.069 |
| 44435.56009259259 | 53.54 |
| 44435.60175925926 | 56.474 |
| 44435.643425925926 | 59.254 |
| 44435.68509259259 | 59.099 |
| 44435.72675925926 | 58.096 |
| 44435.768425925926 | 57.71 |
| 44435.81009259259 | 56.706 |
| 44435.85175925926 | 54.93 |
| 44435.893425925926 | 53.076 |
| 44435.93509259259 | 51.3 |
| 44435.97675925926 | 49.524 |
| 44436.018425925926 | 47.98 |
| 44436.06009259259 | 46.513 |
| 44436.10175925926 | 45.431 |
| 44436.143425925926 | 44.736 |
| 44436.18509259259 | 44.119 |
| 44436.22675925926 | 43.578 |
| 44436.268425925926 | 43.192 |
| 44436.31009259259 | 42.883 |
| 44436.35175925926 | 43.192 |
| 44436.393425925926 | 44.196 |
| 44436.43509259259 | 46.049 |
| 44436.47675925926 | 48.366 |
| 44436.518425925926 | 51.069 |
| 44436.56009259259 | 53.848 |
| 44436.60175925926 | 56.32 |
| 44436.643425925926 | 58.096 |
| 44436.68509259259 | 59.022 |
| 44436.72675925926 | 59.177 |
| 44436.768425925926 | 58.173 |
| 44436.81009259259 | 56.397 |
| 44436.85175925926 | 54.621 |
| 44436.893425925926 | 52.767 |
| 44436.93509259259 | 50.914 |
| 44436.97675925926 | 49.138 |
| 44437.018425925926 | 47.362 |
| 44437.06009259259 | 46.126 |
| 44437.10175925926 | 45.123 |
| 44437.143425925926 | 44.736 |
| 44437.18509259259 | 44.428 |
| 44437.22675925926 | 44.119 |
| 44437.268425925926 | 43.964 |
| 44437.31009259259 | 43.733 |
| 44437.35175925926 | 44.041 |
| 44437.393425925926 | 45.045 |
| 44437.43509259259 | 46.821 |
| 44437.47675925926 | 49.061 |
| 44437.518425925926 | 51.686 |
| 44437.56009259259 | 54.312 |
| 44437.60175925926 | 56.551 |
| 44437.643425925926 | 58.096 |
| 44437.68509259259 | 58.713 |
| 44437.72675925926 | 58.559 |
| 44437.768425925926 | 57.632 |
| 44437.81009259259 | 56.088 |
| 44437.85175925926 | 54.312 |
| 44437.893425925926 | 52.381 |
| 44437.93509259259 | 50.76 |
| 44437.97675925926 | 49.061 |
| 44438.018425925926 | 47.594 |
| 44438.06009259259 | 46.513 |
| 44438.10175925926 | 45.663 |
| 44438.143425925926 | 44.968 |
| 44438.18509259259 | 44.505 |
| 44438.22675925926 | 44.041 |
| 44438.268425925926 | 43.655 |
| 44438.31009259259 | 43.501 |
| 44438.35175925926 | 43.578 |
| 44438.393425925926 | 44.505 |
| 44438.43509259259 | 46.126 |
| 44438.47675925926 | 48.211 |
| 44438.518425925926 | 50.605 |
| 44438.56009259259 | 52.845 |
| 44438.60175925926 | 54.157 |
| 44438.643425925926 | 56.011 |
| 44438.68509259259 | 57.246 |
| 44438.72675925926 | 57.478 |
| 44438.768425925926 | 56.937 |
| 44438.81009259259 | 55.547 |
| 44438.85175925926 | 53.617 |
| 44438.893425925926 | 51.764 |
| 44438.93509259259 | 49.833 |
| 44438.97675925926 | 48.366 |
| 44439.018425925926 | 47.053 |
| 44439.06009259259 | 45.895 |
| 44439.10175925926 | 45.045 |
| 44439.143425925926 | 44.273 |
| 44439.18509259259 | 43.655 |
| 44439.22675925926 | 43.192 |
| 44439.268425925926 | 42.729 |
| 44439.31009259259 | 42.574 |
| 44439.35175925926 | 42.651 |
| 44439.393425925926 | 43.578 |
| 44439.43509259259 | 44.968 |
| 44439.47675925926 | 47.207 |
| 44439.518425925926 | 49.756 |
| 44439.56009259259 | 52.381 |
| 44439.60175925926 | 54.698 |
| 44439.643425925926 | 55.625 |
| 44439.68509259259 | 56.165 |
| 44439.72675925926 | 55.702 |
| 44439.768425925926 | 55.238 |
| 44439.81009259259 | 54.621 |
| 44439.85175925926 | 53.462 |
| 44439.893425925926 | 52.304 |
| 44439.93509259259 | 50.76 |
| 44439.97675925926 | 49.215 |
| 44440.018425925926 | 48.057 |
| 44440.06009259259 | 46.976 |
| 44440.10175925926 | 46.281 |
| 44440.143425925926 | 45.74 |
| 44440.18509259259 | 45.277 |
| 44440.22675925926 | 45.045 |
| 44440.268425925926 | 44.814 |
| 44440.31009259259 | 44.736 |
| 44440.35175925926 | 44.968 |
| 44440.393425925926 | 45.431 |
| 44440.43509259259 | 46.667 |
| 44440.47675925926 | 47.748 |
| 44440.518425925926 | 48.211 |
| 44440.56009259259 | 48.984 |
| 44440.60175925926 | 49.601 |
| 44440.643425925926 | 49.91 |
| 44440.68509259259 | 50.065 |
| 44440.72675925926 | 49.91 |
| 44440.768425925926 | 49.833 |
| 44440.81009259259 | 49.37 |
| 44440.85175925926 | 48.675 |
| 44440.893425925926 | 48.057 |
| 44440.93509259259 | 47.439 |
| 44440.97675925926 | 46.821 |
| 44441.018425925926 | 46.435 |
| 44441.06009259259 | 46.126 |
| 44441.10175925926 | 45.972 |
| 44441.143425925926 | 45.663 |
| 44441.18509259259 | 45.586 |
| 44441.22675925926 | 45.509 |
| 44441.268425925926 | 45.354 |
| 44441.31009259259 | 45.277 |
| 44441.35175925926 | 45.586 |
| 44441.393425925926 | 45.895 |
| 44441.43509259259 | 47.594 |
| 44441.47675925926 | 48.597 |
| 44441.518425925926 | 49.833 |
| 44441.56009259259 | 50.219 |
| 44441.60175925926 | 51.532 |
| 44441.643425925926 | 52.458 |
| 44441.68509259259 | 53.54 |
| 44441.72675925926 | 54.543 |
| 44441.768425925926 | 54.08 |
| 44441.81009259259 | 52.999 |
| 44441.85175925926 | 51.532 |
| 44441.893425925926 | 50.451 |
| 44441.93509259259 | 49.215 |
| 44441.97675925926 | 48.211 |
| 44442.018425925926 | 47.362 |
| 44442.06009259259 | 46.744 |
| 44442.10175925926 | 46.204 |
| 44442.143425925926 | 46.049 |
| 44442.18509259259 | 45.74 |
| 44442.22675925926 | 45.74 |
| 44442.268425925926 | 45.431 |
| 44442.31009259259 | 45.2 |
| 44442.35175925926 | 45.277 |
| 44442.393425925926 | 46.204 |
| 44442.43509259259 | 47.748 |
| 44442.47675925926 | 48.057 |
| 44442.518425925926 | 48.829 |
| 44442.56009259259 | 50.991 |
| 44442.60175925926 | 51.609 |
| 44442.643425925926 | 52.381 |
| 44442.68509259259 | 53.694 |
| 44442.72675925926 | 53.771 |
| 44442.768425925926 | 53.076 |
| 44442.81009259259 | 52.227 |
| 44442.85175925926 | 51.069 |
| 44442.893425925926 | 49.756 |
| 44442.93509259259 | 48.443 |
| 44442.97675925926 | 47.516 |
| 44443.018425925926 | 46.667 |
| 44443.06009259259 | 45.818 |
| 44443.10175925926 | 45.123 |
| 44443.143425925926 | 44.428 |
| 44443.18509259259 | 43.81 |
| 44443.22675925926 | 43.346 |
| 44443.268425925926 | 43.038 |
| 44443.31009259259 | 43.038 |
| 44443.35175925926 | 43.192 |
| 44443.393425925926 | 44.273 |
| 44443.43509259259 | 45.972 |
| 44443.47675925926 | 47.671 |
| 44443.518425925926 | 49.138 |
| 44443.56009259259 | 50.837 |
| 44443.60175925926 | 51.841 |
| 44443.643425925926 | 53.54 |
| 44443.68509259259 | 55.238 |
| 44443.72675925926 | 55.856 |
| 44443.768425925926 | 55.084 |
| 44443.81009259259 | 53.231 |
| 44443.85175925926 | 52.15 |
| 44443.893425925926 | 51.069 |
| 44443.93509259259 | 49.679 |
| 44443.97675925926 | 48.134 |
| 44444.018425925926 | 46.667 |
| 44444.06009259259 | 45.277 |
| 44444.10175925926 | 44.35 |
| 44444.143425925926 | 43.501 |
| 44444.18509259259 | 42.806 |
| 44444.22675925926 | 42.265 |
| 44444.268425925926 | 41.802 |
| 44444.31009259259 | 41.416 |
| 44444.35175925926 | 41.493 |
| 44444.393425925926 | 42.343 |
| 44444.43509259259 | 44.041 |
| 44444.47675925926 | 46.358 |
| 44444.518425925926 | 49.061 |
| 44444.56009259259 | 51.609 |
| 44444.60175925926 | 54.003 |
| 44444.643425925926 | 55.625 |
| 44444.68509259259 | 56.551 |
| 44444.72675925926 | 56.397 |
| 44444.768425925926 | 55.316 |
| 44444.81009259259 | 53.926 |
| 44444.85175925926 | 52.381 |
| 44444.893425925926 | 50.76 |
| 44444.93509259259 | 49.061 |
| 44444.97675925926 | 47.439 |
| 44445.018425925926 | 45.972 |
| 44445.06009259259 | 44.891 |
| 44445.10175925926 | 43.81 |
| 44445.143425925926 | 43.115 |
| 44445.18509259259 | 42.574 |
| 44445.22675925926 | 42.111 |
| 44445.268425925926 | 41.725 |
| 44445.31009259259 | 41.339 |
| 44445.35175925926 | 41.493 |
| 44445.393425925926 | 42.265 |
| 44445.43509259259 | 43.887 |
| 44445.47675925926 | 46.204 |
| 44445.518425925926 | 48.829 |
| 44445.56009259259 | 51.609 |
| 44445.60175925926 | 54.003 |
| 44445.643425925926 | 55.702 |
| 44445.68509259259 | 56.551 |
| 44445.72675925926 | 56.397 |
| 44445.768425925926 | 55.316 |
| 44445.81009259259 | 53.848 |
| 44445.85175925926 | 52.381 |
| 44445.893425925926 | 50.682 |
| 44445.93509259259 | 49.138 |
| 44445.97675925926 | 47.516 |
| 44446.018425925926 | 46.049 |
| 44446.06009259259 | 44.891 |
| 44446.10175925926 | 43.887 |
| 44446.143425925926 | 43.038 |
| 44446.18509259259 | 42.497 |
| 44446.22675925926 | 41.956 |
| 44446.268425925926 | 41.493 |
| 44446.31009259259 | 41.261 |
| 44446.35175925926 | 41.416 |
| 44446.393425925926 | 42.265 |
| 44446.43509259259 | 43.964 |
| 44446.47675925926 | 46.204 |
| 44446.518425925926 | 48.829 |
| 44446.56009259259 | 51.609 |
| 44446.60175925926 | 54.003 |
| 44446.643425925926 | 55.702 |
| 44446.68509259259 | 56.628 |
| 44446.72675925926 | 56.551 |
| 44446.768425925926 | 55.547 |
| 44446.81009259259 | 54.235 |
| 44446.85175925926 | 52.767 |
| 44446.893425925926 | 51.146 |
| 44446.93509259259 | 49.601 |
| 44446.97675925926 | 47.748 |
| 44447.018425925926 | 46.281 |
| 44447.06009259259 | 45.045 |
| 44447.10175925926 | 44.041 |
| 44447.143425925926 | 43.346 |
| 44447.18509259259 | 42.806 |
| 44447.22675925926 | 42.343 |
| 44447.268425925926 | 42.034 |
| 44447.31009259259 | 41.725 |
| 44447.35175925926 | 41.802 |
| 44447.393425925926 | 42.651 |
| 44447.43509259259 | 44.273 |
| 44447.47675925926 | 46.59 |
| 44447.518425925926 | 49.37 |
| 44447.56009259259 | 52.15 |
| 44447.60175925926 | 54.621 |
| 44447.643425925926 | 56.32 |
| 44447.68509259259 | 57.092 |
| 44447.72675925926 | 57.169 |
| 44447.768425925926 | 56.088 |
| 44447.81009259259 | 54.621 |
| 44447.85175925926 | 52.999 |
| 44447.893425925926 | 51.3 |
| 44447.93509259259 | 49.601 |
| 44447.97675925926 | 47.902 |
| 44448.018425925926 | 46.435 |
| 44448.06009259259 | 45.123 |
| 44448.10175925926 | 44.119 |
| 44448.143425925926 | 43.269 |
| 44448.18509259259 | 42.574 |
| 44448.22675925926 | 42.111 |
| 44448.268425925926 | 41.57 |
| 44448.31009259259 | 41.261 |
| 44448.35175925926 | 41.416 |
| 44448.393425925926 | 42.265 |
| 44448.43509259259 | 44.041 |
| 44448.47675925926 | 46.358 |
| 44448.518425925926 | 49.138 |
| 44448.56009259259 | 51.918 |
| 44448.60175925926 | 54.312 |
| 44448.643425925926 | 56.088 |
| 44448.68509259259 | 57.015 |
| 44448.72675925926 | 57.015 |
| 44448.768425925926 | 56.088 |
| 44448.81009259259 | 54.621 |
| 44448.85175925926 | 52.999 |
| 44448.893425925926 | 51.3 |
| 44448.93509259259 | 49.679 |
| 44448.97675925926 | 48.057 |
| 44449.018425925926 | 46.358 |
| 44449.06009259259 | 45.277 |
| 44449.10175925926 | 44.428 |
| 44449.143425925926 | 43.81 |
| 44449.18509259259 | 43.269 |
| 44449.22675925926 | 42.651 |
| 44449.268425925926 | 42.343 |
| 44449.31009259259 | 42.188 |
| 44449.35175925926 | 42.188 |
| 44449.393425925926 | 42.806 |
| 44449.43509259259 | 44.428 |
| 44449.47675925926 | 46.513 |
| 44449.518425925926 | 49.292 |
| 44449.56009259259 | 51.995 |
| 44449.60175925926 | 54.466 |
| 44449.643425925926 | 56.242 |
| 44449.68509259259 | 57.246 |
| 44449.72675925926 | 57.092 |
| 44449.768425925926 | 56.242 |
| 44449.81009259259 | 54.852 |
| 44449.85175925926 | 53.231 |
| 44449.893425925926 | 51.609 |
| 44449.93509259259 | 49.91 |
| 44449.97675925926 | 48.211 |
| 44450.018425925926 | 46.744 |
| 44450.06009259259 | 45.586 |
| 44450.10175925926 | 44.659 |
| 44450.143425925926 | 44.041 |
| 44450.18509259259 | 43.424 |
| 44450.22675925926 | 43.038 |
| 44450.268425925926 | 42.651 |
| 44450.31009259259 | 42.497 |
| 44450.35175925926 | 42.497 |
| 44450.393425925926 | 43.346 |
| 44450.43509259259 | 44.814 |
| 44450.47675925926 | 46.821 |
| 44450.518425925926 | 49.215 |
| 44450.56009259259 | 51.532 |
| 44450.60175925926 | 53.926 |
| 44450.643425925926 | 55.702 |
| 44450.68509259259 | 56.783 |
| 44450.72675925926 | 56.783 |
| 44450.768425925926 | 55.702 |
| 44450.81009259259 | 54.157 |
| 44450.85175925926 | 52.536 |
| 44450.893425925926 | 51.146 |
| 44450.93509259259 | 49.987 |
| 44450.97675925926 | 48.752 |
| 44451.018425925926 | 47.516 |
| 44451.06009259259 | 46.358 |
| 44451.10175925926 | 45.431 |
| 44451.143425925926 | 44.814 |
| 44451.18509259259 | 44.428 |
| 44451.22675925926 | 44.273 |
| 44451.268425925926 | 44.041 |
| 44451.31009259259 | 43.655 |
| 44451.35175925926 | 43.578 |
| 44451.393425925926 | 44.041 |
| 44451.43509259259 | 45.354 |
| 44451.47675925926 | 47.594 |
| 44451.518425925926 | 49.91 |
| 44451.56009259259 | 51.3 |
| 44451.60175925926 | 54.003 |
| 44451.643425925926 | 55.547 |
| 44451.68509259259 | 55.547 |
| 44451.72675925926 | 55.47 |
| 44451.768425925926 | 54.775 |
| 44451.81009259259 | 54.312 |
| 44451.85175925926 | 52.845 |
| 44451.893425925926 | 51.3 |
| 44451.93509259259 | 49.91 |
| 44451.97675925926 | 48.443 |
| 44452.018425925926 | 47.13 |
| 44452.06009259259 | 46.049 |
| 44452.10175925926 | 45.045 |
| 44452.143425925926 | 44.505 |
| 44452.18509259259 | 43.964 |
| 44452.22675925926 | 43.578 |
| 44452.268425925926 | 43.346 |
| 44452.31009259259 | 43.346 |
| 44452.35175925926 | 43.501 |
| 44452.393425925926 | 44.041 |
| 44452.43509259259 | 45.354 |
| 44452.47675925926 | 47.207 |
| 44452.518425925926 | 49.138 |
| 44452.56009259259 | 51.995 |
| 44452.60175925926 | 54.621 |
| 44452.643425925926 | 55.393 |
| 44452.68509259259 | 56.242 |
| 44452.72675925926 | 56.397 |
| 44452.768425925926 | 55.47 |
| 44452.81009259259 | 54.543 |
| 44452.85175925926 | 53.308 |
| 44452.893425925926 | 51.609 |
| 44452.93509259259 | 49.91 |
| 44452.97675925926 | 48.366 |
| 44453.018425925926 | 47.053 |
| 44453.06009259259 | 45.972 |
| 44453.10175925926 | 45.045 |
| 44453.143425925926 | 44.196 |
| 44453.18509259259 | 43.578 |
| 44453.22675925926 | 43.192 |
| 44453.268425925926 | 42.883 |
| 44453.31009259259 | 42.729 |
| 44453.35175925926 | 42.806 |
| 44453.393425925926 | 43.424 |
| 44453.43509259259 | 45.045 |
| 44453.47675925926 | 47.439 |
| 44453.518425925926 | 49.679 |
| 44453.56009259259 | 51.069 |
| 44453.60175925926 | 50.837 |
| 44453.643425925926 | 52.072 |
| 44453.68509259259 | 52.227 |
| 44453.72675925926 | 52.613 |
| 44453.768425925926 | 51.841 |
| 44453.81009259259 | 50.682 |
| 44453.85175925926 | 49.601 |
| 44453.893425925926 | 48.443 |
| 44453.93509259259 | 47.207 |
| 44453.97675925926 | 46.126 |
| 44454.018425925926 | 45.045 |
| 44454.06009259259 | 43.887 |
| 44454.10175925926 | 43.115 |
| 44454.143425925926 | 42.497 |
| 44454.18509259259 | 41.956 |
| 44454.22675925926 | 41.57 |
| 44454.268425925926 | 41.261 |
| 44454.31009259259 | 41.03 |
| 44454.35175925926 | 41.03 |
| 44454.393425925926 | 41.879 |
| 44454.43509259259 | 43.578 |
| 44454.47675925926 | 45.818 |
| 44454.518425925926 | 48.443 |
| 44454.56009259259 | 51.3 |
| 44454.60175925926 | 53.848 |
| 44454.643425925926 | 55.393 |
| 44454.68509259259 | 56.32 |
| 44454.72675925926 | 56.011 |
| 44454.768425925926 | 54.775 |
| 44454.81009259259 | 53.308 |
| 44454.85175925926 | 51.764 |
| 44454.893425925926 | 50.142 |
| 44454.93509259259 | 48.52 |
| 44454.97675925926 | 47.13 |
| 44455.018425925926 | 45.509 |
| 44455.06009259259 | 44.273 |
| 44455.10175925926 | 43.346 |
| 44455.143425925926 | 42.42 |
| 44455.18509259259 | 42.034 |
| 44455.22675925926 | 41.57 |
| 44455.268425925926 | 41.03 |
| 44455.31009259259 | 40.875 |
| 44455.35175925926 | 40.875 |
| 44455.393425925926 | 41.648 |
| 44455.43509259259 | 43.424 |
| 44455.47675925926 | 45.74 |
| 44455.518425925926 | 48.443 |
| 44455.56009259259 | 50.451 |
| 44455.60175925926 | 52.999 |
| 44455.643425925926 | 54.698 |
| 44455.68509259259 | 55.625 |
| 44455.72675925926 | 55.625 |
| 44455.768425925926 | 54.775 |
| 44455.81009259259 | 53.308 |
| 44455.85175925926 | 51.609 |
| 44455.893425925926 | 49.987 |
| 44455.93509259259 | 48.289 |
| 44455.97675925926 | 46.667 |
| 44456.018425925926 | 45.354 |
| 44456.06009259259 | 44.273 |
| 44456.10175925926 | 43.346 |
| 44456.143425925926 | 42.806 |
| 44456.18509259259 | 42.188 |
| 44456.22675925926 | 41.802 |
| 44456.268425925926 | 41.493 |
| 44456.31009259259 | 41.184 |
| 44456.35175925926 | 41.184 |
| 44456.393425925926 | 42.034 |
| 44456.43509259259 | 43.733 |
| 44456.47675925926 | 46.204 |
| 44456.518425925926 | 49.215 |
| 44456.56009259259 | 51.995 |
| 44456.60175925926 | 54.312 |
| 44456.643425925926 | 54.775 |
| 44456.68509259259 | 55.393 |
| 44456.72675925926 | 55.161 |
| 44456.768425925926 | 54.235 |
| 44456.81009259259 | 53.076 |
| 44456.85175925926 | 51.609 |
| 44456.893425925926 | 49.91 |
| 44456.93509259259 | 48.057 |
| 44456.97675925926 | 46.59 |
| 44457.018425925926 | 45.2 |
| 44457.06009259259 | 44.041 |
| 44457.10175925926 | 43.192 |
| 44457.143425925926 | 42.42 |
| 44457.18509259259 | 41.802 |
| 44457.22675925926 | 41.493 |
| 44457.268425925926 | 41.03 |
| 44457.31009259259 | 40.721 |
| 44457.35175925926 | 40.644 |
| 44457.393425925926 | 41.416 |
| 44457.43509259259 | 43.192 |
| 44457.47675925926 | 45.509 |
| 44457.518425925926 | 48.211 |
| 44457.56009259259 | 51.069 |
| 44457.60175925926 | 53.385 |
| 44457.643425925926 | 54.389 |
| 44457.68509259259 | 54.621 |
| 44457.72675925926 | 53.848 |
| 44457.768425925926 | 53.153 |
| 44457.81009259259 | 52.15 |
| 44457.85175925926 | 51.146 |
| 44457.893425925926 | 49.756 |
| 44457.93509259259 | 48.52 |
| 44457.97675925926 | 47.594 |
| 44458.018425925926 | 46.821 |
| 44458.06009259259 | 46.281 |
| 44458.10175925926 | 45.663 |
| 44458.143425925926 | 45.277 |
| 44458.18509259259 | 44.891 |
| 44458.22675925926 | 44.428 |
| 44458.268425925926 | 44.119 |
| 44458.31009259259 | 43.733 |
| 44458.35175925926 | 43.501 |
| 44458.393425925926 | 44.041 |
| 44458.43509259259 | 44.968 |
| 44458.47675925926 | 45.818 |
| 44458.518425925926 | 47.207 |
| 44458.56009259259 | 49.833 |
| 44458.60175925926 | 50.914 |
| 44458.643425925926 | 51.3 |
| 44458.68509259259 | 52.304 |
| 44458.72675925926 | 52.536 |
| 44458.768425925926 | 52.15 |
| 44458.81009259259 | 51.918 |
| 44458.85175925926 | 51.223 |
| 44458.893425925926 | 49.91 |
| 44458.93509259259 | 48.597 |
| 44458.97675925926 | 47.053 |
| 44459.018425925926 | 45.972 |
| 44459.06009259259 | 44.968 |
| 44459.10175925926 | 44.119 |
| 44459.143425925926 | 43.501 |
| 44459.18509259259 | 43.038 |
| 44459.22675925926 | 42.497 |
| 44459.268425925926 | 42.188 |
| 44459.31009259259 | 42.111 |
| 44459.35175925926 | 41.879 |
| 44459.393425925926 | 42.034 |
| 44459.43509259259 | 43.269 |
| 44459.47675925926 | 45.2 |
| 44459.518425925926 | 47.439 |
| 44459.56009259259 | 49.524 |
| 44459.60175925926 | 51.3 |
| 44459.643425925926 | 52.304 |
| 44459.68509259259 | 52.227 |
| 44459.72675925926 | 51.3 |
| 44459.768425925926 | 49.37 |
| 44459.81009259259 | 47.98 |
| 44459.85175925926 | 47.285 |
| 44459.893425925926 | 46.513 |
| 44459.93509259259 | 45.431 |
| 44459.97675925926 | 44.273 |
| 44460.018425925926 | 43.424 |
| 44460.06009259259 | 42.651 |
| 44460.10175925926 | 42.111 |
| 44460.143425925926 | 41.648 |
| 44460.18509259259 | 41.339 |
| 44460.22675925926 | 41.03 |
| 44460.268425925926 | 40.567 |
| 44460.31009259259 | 40.18 |
| 44460.35175925926 | 40.103 |
| 44460.393425925926 | 40.567 |
| 44460.43509259259 | 41.956 |
| 44460.47675925926 | 43.81 |
| 44460.518425925926 | 46.126 |
| 44460.56009259259 | 48.597 |
| 44460.60175925926 | 50.76 |
| 44460.643425925926 | 52.15 |
| 44460.68509259259 | 52.767 |
| 44460.72675925926 | 52.381 |
| 44460.768425925926 | 51.069 |
| 44460.81009259259 | 49.833 |
| 44460.85175925926 | 48.366 |
| 44460.893425925926 | 46.976 |
| 44460.93509259259 | 45.509 |
| 44460.97675925926 | 44.041 |
| 44461.018425925926 | 42.729 |
| 44461.06009259259 | 41.725 |
| 44461.10175925926 | 40.875 |
| 44461.143425925926 | 40.18 |
| 44461.18509259259 | 39.717 |
| 44461.22675925926 | 39.254 |
| 44461.268425925926 | 38.868 |
| 44461.31009259259 | 38.713 |
| 44461.35175925926 | 38.636 |
| 44461.393425925926 | 39.485 |
| 44461.43509259259 | 41.184 |
| 44461.47675925926 | 43.424 |
| 44461.518425925926 | 46.126 |
| 44461.56009259259 | 48.906 |
| 44461.60175925926 | 51.3 |
| 44461.643425925926 | 52.845 |
| 44461.68509259259 | 53.617 |
| 44461.72675925926 | 53.308 |
| 44461.768425925926 | 52.304 |
| 44461.81009259259 | 50.991 |
| 44461.85175925926 | 49.447 |
| 44461.893425925926 | 47.98 |
| 44461.93509259259 | 46.435 |
| 44461.97675925926 | 44.736 |
| 44462.018425925926 | 43.501 |
| 44462.06009259259 | 42.343 |
| 44462.10175925926 | 41.416 |
| 44462.143425925926 | 40.721 |
| 44462.18509259259 | 40.18 |
| 44462.22675925926 | 39.794 |
| 44462.268425925926 | 39.485 |
| 44462.31009259259 | 39.177 |
| 44462.35175925926 | 39.177 |
| 44462.393425925926 | 39.563 |
| 44462.43509259259 | 41.184 |
| 44462.47675925926 | 43.346 |
| 44462.518425925926 | 45.972 |
| 44462.56009259259 | 48.443 |
| 44462.60175925926 | 50.837 |
| 44462.643425925926 | 51.841 |
| 44462.68509259259 | 51.995 |
| 44462.72675925926 | 51.377 |
| 44462.768425925926 | 50.605 |
| 44462.81009259259 | 49.91 |
| 44462.85175925926 | 49.215 |
| 44462.893425925926 | 47.98 |
| 44462.93509259259 | 46.744 |
| 44462.97675925926 | 45.586 |
| 44463.018425925926 | 44.659 |
| 44463.06009259259 | 43.81 |
| 44463.10175925926 | 43.192 |
| 44463.143425925926 | 42.651 |
| 44463.18509259259 | 42.111 |
| 44463.22675925926 | 41.648 |
| 44463.268425925926 | 41.261 |
| 44463.31009259259 | 40.721 |
| 44463.35175925926 | 40.721 |
| 44463.393425925926 | 41.339 |
| 44463.43509259259 | 42.883 |
| 44463.47675925926 | 44.891 |
| 44463.518425925926 | 47.362 |
| 44463.56009259259 | 49.756 |
| 44463.60175925926 | 51.995 |
| 44463.643425925926 | 53.385 |
| 44463.68509259259 | 53.926 |
| 44463.72675925926 | 53.54 |
| 44463.768425925926 | 52.304 |
| 44463.81009259259 | 50.991 |
| 44463.85175925926 | 49.679 |
| 44463.893425925926 | 48.211 |
| 44463.93509259259 | 46.821 |
| 44463.97675925926 | 45.354 |
| 44464.018425925926 | 44.119 |
| 44464.06009259259 | 43.038 |
| 44464.10175925926 | 42.343 |
| 44464.143425925926 | 41.648 |
| 44464.18509259259 | 41.107 |
| 44464.22675925926 | 40.644 |
| 44464.268425925926 | 40.335 |
| 44464.31009259259 | 40.026 |
| 44464.35175925926 | 39.949 |
| 44464.393425925926 | 40.644 |
| 44464.43509259259 | 42.265 |
| 44464.47675925926 | 44.428 |
| 44464.518425925926 | 47.13 |
| 44464.56009259259 | 49.679 |
| 44464.60175925926 | 51.995 |
| 44464.643425925926 | 53.462 |
| 44464.68509259259 | 54.003 |
| 44464.72675925926 | 53.848 |
| 44464.768425925926 | 52.613 |
| 44464.81009259259 | 51.455 |
| 44464.85175925926 | 49.987 |
| 44464.893425925926 | 48.597 |
| 44464.93509259259 | 47.13 |
| 44464.97675925926 | 45.663 |
| 44465.018425925926 | 44.35 |
| 44465.06009259259 | 43.269 |
| 44465.10175925926 | 42.42 |
| 44465.143425925926 | 41.725 |
| 44465.18509259259 | 41.339 |
| 44465.22675925926 | 40.953 |
| 44465.268425925926 | 40.721 |
| 44465.31009259259 | 40.412 |
| 44465.35175925926 | 40.258 |
| 44465.393425925926 | 41.03 |
| 44465.43509259259 | 42.574 |
| 44465.47675925926 | 44.659 |
| 44465.518425925926 | 46.821 |
| 44465.56009259259 | 49.37 |
| 44465.60175925926 | 51.609 |
| 44465.643425925926 | 53.308 |
| 44465.68509259259 | 54.003 |
| 44465.72675925926 | 53.617 |
| 44465.768425925926 | 52.69 |
| 44465.81009259259 | 51.532 |
| 44465.85175925926 | 50.296 |
| 44465.893425925926 | 48.984 |
| 44465.93509259259 | 47.748 |
| 44465.97675925926 | 46.204 |
| 44466.018425925926 | 44.968 |
| 44466.06009259259 | 43.964 |
| 44466.10175925926 | 43.038 |
| 44466.143425925926 | 42.42 |
| 44466.18509259259 | 41.879 |
| 44466.22675925926 | 41.493 |
| 44466.268425925926 | 41.107 |
| 44466.31009259259 | 40.721 |
| 44466.35175925926 | 40.567 |
| 44466.393425925926 | 41.261 |
| 44466.43509259259 | 42.806 |
| 44466.47675925926 | 44.891 |
| 44466.518425925926 | 46.513 |
| 44466.56009259259 | 47.748 |
| 44466.60175925926 | 48.752 |
| 44466.643425925926 | 49.679 |
| 44466.68509259259 | 49.91 |
| 44466.72675925926 | 50.605 |
| 44466.768425925926 | 50.76 |
| 44466.81009259259 | 50.296 |
| 44466.85175925926 | 49.061 |
| 44466.893425925926 | 47.748 |
| 44466.93509259259 | 46.435 |
| 44466.97675925926 | 45.431 |
| 44467.018425925926 | 44.505 |
| 44467.06009259259 | 43.81 |
| 44467.10175925926 | 43.269 |
| 44467.143425925926 | 42.729 |
| 44467.18509259259 | 42.651 |
| 44467.22675925926 | 42.42 |
| 44467.268425925926 | 42.188 |
| 44467.31009259259 | 41.956 |
| 44467.35175925926 | 41.879 |
| 44467.393425925926 | 42.729 |
| 44467.43509259259 | 43.733 |
| 44467.47675925926 | 45.663 |
| 44467.518425925926 | 47.825 |
| 44467.56009259259 | 48.057 |
| 44467.60175925926 | 48.057 |
| 44467.643425925926 | 48.057 |
| 44467.68509259259 | 48.443 |
| 44467.72675925926 | 48.134 |
| 44467.768425925926 | 47.748 |
| 44467.81009259259 | 47.285 |
| 44467.85175925926 | 46.59 |
| 44467.893425925926 | 45.895 |
| 44467.93509259259 | 45.354 |
| 44467.97675925926 | 45.045 |
| 44468.018425925926 | 44.582 |
| 44468.06009259259 | 44.35 |
| 44468.10175925926 | 44.196 |
| 44468.143425925926 | 43.964 |
| 44468.18509259259 | 43.81 |
| 44468.22675925926 | 43.81 |
| 44468.268425925926 | 43.655 |
| 44468.31009259259 | 43.655 |
| 44468.35175925926 | 43.733 |
| 44468.393425925926 | 44.428 |
| 44468.43509259259 | 45.277 |
| 44468.47675925926 | 45.586 |
| 44468.518425925926 | 45.663 |
| 44468.56009259259 | 46.204 |
| 44468.60175925926 | 47.748 |
| 44468.643425925926 | 48.752 |
| 44468.68509259259 | 49.37 |
| 44468.72675925926 | 49.215 |
| 44468.768425925926 | 48.597 |
| 44468.81009259259 | 47.902 |
| 44468.85175925926 | 47.13 |
| 44468.893425925926 | 46.358 |
| 44468.93509259259 | 45.818 |
| 44468.97675925926 | 45.431 |
| 44469.018425925926 | 45.045 |
| 44469.06009259259 | 44.582 |
| 44469.10175925926 | 44.041 |
| 44469.143425925926 | 43.81 |
| 44469.18509259259 | 43.578 |
| 44469.22675925926 | 43.346 |
| 44469.268425925926 | 43.192 |
| 44469.31009259259 | 43.192 |
| 44469.35175925926 | 43.269 |
| 44469.393425925926 | 43.655 |
| 44469.43509259259 | 44.736 |
| 44469.47675925926 | 46.435 |
| 44469.518425925926 | 48.597 |
| 44469.56009259259 | 49.91 |
| 44469.60175925926 | 51.377 |
| 44469.643425925926 | 52.536 |
| 44469.68509259259 | 52.922 |
| 44469.72675925926 | 51.918 |
| 44469.768425925926 | 50.991 |
| 44469.81009259259 | 50.296 |
| 44469.85175925926 | 49.37 |
| 44469.893425925926 | 48.443 |
| 44469.93509259259 | 47.362 |
| 44469.97675925926 | 46.281 |
| 44470.018425925926 | 45.354 |
| 44470.06009259259 | 44.505 |
| 44470.10175925926 | 43.81 |
| 44470.143425925926 | 43.192 |
| 44470.18509259259 | 42.651 |
| 44470.22675925926 | 42.343 |
| 44470.268425925926 | 42.265 |
| 44470.31009259259 | 42.188 |
| 44470.35175925926 | 42.343 |
| 44470.393425925926 | 42.651 |
| 44470.43509259259 | 43.578 |
| 44470.47675925926 | 44.659 |
| 44470.518425925926 | 45.586 |
| 44470.56009259259 | 46.204 |
| 44470.60175925926 | 46.821 |
| 44470.643425925926 | 46.667 |
| 44470.68509259259 | 46.821 |
| 44470.72675925926 | 47.053 |
| 44470.768425925926 | 47.053 |
| 44470.81009259259 | 47.13 |
| 44470.85175925926 | 46.821 |
| 44470.893425925926 | 46.126 |
| 44470.93509259259 | 45.431 |
| 44470.97675925926 | 44.891 |
| 44471.018425925926 | 44.273 |
| 44471.06009259259 | 43.578 |
| 44471.10175925926 | 42.96 |
| 44471.143425925926 | 42.343 |
| 44471.18509259259 | 41.879 |
| 44471.22675925926 | 41.57 |
| 44471.268425925926 | 41.493 |
| 44471.31009259259 | 41.184 |
| 44471.35175925926 | 41.107 |
| 44471.393425925926 | 41.339 |
| 44471.43509259259 | 42.729 |
| 44471.47675925926 | 44.814 |
| 44471.518425925926 | 47.13 |
| 44471.56009259259 | 49.601 |
| 44471.60175925926 | 51.532 |
| 44471.643425925926 | 52.381 |
| 44471.68509259259 | 52.69 |
| 44471.72675925926 | 51.841 |
| 44471.768425925926 | 50.837 |
| 44471.81009259259 | 49.524 |
| 44471.85175925926 | 48.211 |
| 44471.893425925926 | 46.821 |
| 44471.93509259259 | 45.509 |
| 44471.97675925926 | 44.273 |
| 44472.018425925926 | 43.192 |
| 44472.06009259259 | 42.42 |
| 44472.10175925926 | 41.648 |
| 44472.143425925926 | 41.107 |
| 44472.18509259259 | 40.721 |
| 44472.22675925926 | 40.258 |
| 44472.268425925926 | 39.949 |
| 44472.31009259259 | 39.563 |
| 44472.35175925926 | 39.563 |
| 44472.393425925926 | 40.18 |
| 44472.43509259259 | 41.648 |
| 44472.47675925926 | 43.733 |
| 44472.518425925926 | 46.126 |
| 44472.56009259259 | 48.52 |
| 44472.60175925926 | 50.528 |
| 44472.643425925926 | 51.918 |
| 44472.68509259259 | 52.381 |
| 44472.72675925926 | 51.686 |
| 44472.768425925926 | 50.76 |
| 44472.81009259259 | 49.756 |
| 44472.85175925926 | 48.52 |
| 44472.893425925926 | 47.285 |
| 44472.93509259259 | 45.972 |
| 44472.97675925926 | 44.736 |
| 44473.018425925926 | 43.424 |
| 44473.06009259259 | 42.497 |
| 44473.10175925926 | 41.57 |
| 44473.143425925926 | 40.953 |
| 44473.18509259259 | 40.489 |
| 44473.22675925926 | 40.103 |
| 44473.268425925926 | 39.794 |
| 44473.31009259259 | 39.408 |
| 44473.35175925926 | 39.331 |
| 44473.393425925926 | 39.949 |
| 44473.43509259259 | 41.493 |
| 44473.47675925926 | 43.578 |
| 44473.518425925926 | 46.049 |
| 44473.56009259259 | 48.597 |
| 44473.60175925926 | 50.605 |
| 44473.643425925926 | 52.227 |
| 44473.68509259259 | 52.536 |
| 44473.72675925926 | 52.15 |
| 44473.768425925926 | 51.069 |
| 44473.81009259259 | 50.065 |
| 44473.85175925926 | 48.675 |
| 44473.893425925926 | 47.516 |
| 44473.93509259259 | 46.126 |
| 44473.97675925926 | 44.659 |
| 44474.018425925926 | 43.655 |
| 44474.06009259259 | 42.806 |
| 44474.10175925926 | 42.034 |
| 44474.143425925926 | 41.493 |
| 44474.18509259259 | 41.107 |
| 44474.22675925926 | 40.798 |
| 44474.268425925926 | 40.489 |
| 44474.31009259259 | 40.258 |
| 44474.35175925926 | 40.103 |
| 44474.393425925926 | 40.721 |
| 44474.43509259259 | 42.188 |
| 44474.47675925926 | 44.273 |
| 44474.518425925926 | 46.667 |
| 44474.56009259259 | 49.215 |
| 44474.60175925926 | 51.223 |
| 44474.643425925926 | 52.536 |
| 44474.68509259259 | 52.613 |
| 44474.72675925926 | 51.918 |
| 44474.768425925926 | 51.3 |
| 44474.81009259259 | 50.065 |
| 44474.85175925926 | 48.906 |
| 44474.893425925926 | 47.594 |
| 44474.93509259259 | 46.513 |
| 44474.97675925926 | 45.431 |
| 44475.018425925926 | 44.35 |
| 44475.06009259259 | 43.501 |
| 44475.10175925926 | 42.883 |
| 44475.143425925926 | 42.497 |
| 44475.18509259259 | 42.111 |
| 44475.22675925926 | 41.725 |
| 44475.268425925926 | 41.416 |
| 44475.31009259259 | 41.261 |
| 44475.35175925926 | 41.261 |
| 44475.393425925926 | 41.879 |
| 44475.43509259259 | 42.651 |
| 44475.47675925926 | 44.273 |
| 44475.518425925926 | 45.74 |
| 44475.56009259259 | 46.667 |
| 44475.60175925926 | 47.671 |
| 44475.643425925926 | 48.289 |
| 44475.68509259259 | 48.752 |
| 44475.72675925926 | 48.597 |
| 44475.768425925926 | 48.289 |
| 44475.81009259259 | 47.516 |
| 44475.85175925926 | 46.59 |
| 44475.893425925926 | 45.663 |
| 44475.93509259259 | 44.582 |
| 44475.97675925926 | 43.655 |
| 44476.018425925926 | 42.729 |
| 44476.06009259259 | 41.956 |
| 44476.10175925926 | 41.261 |
| 44476.143425925926 | 40.721 |
| 44476.18509259259 | 40.18 |
| 44476.22675925926 | 39.794 |
| 44476.268425925926 | 39.485 |
| 44476.31009259259 | 39.177 |
| 44476.35175925926 | 39.022 |
| 44476.393425925926 | 39.64 |
| 44476.43509259259 | 41.107 |
| 44476.47675925926 | 43.038 |
| 44476.518425925926 | 45.431 |
| 44476.56009259259 | 47.902 |
| 44476.60175925926 | 50.065 |
| 44476.643425925926 | 51.455 |
| 44476.68509259259 | 51.532 |
| 44476.72675925926 | 50.991 |
| 44476.768425925926 | 50.605 |
| 44476.81009259259 | 49.833 |
| 44476.85175925926 | 48.984 |
| 44476.893425925926 | 47.825 |
| 44476.93509259259 | 46.435 |
| 44476.97675925926 | 45.277 |
| 44477.018425925926 | 44.273 |
| 44477.06009259259 | 43.346 |
| 44477.10175925926 | 42.574 |
| 44477.143425925926 | 41.879 |
| 44477.18509259259 | 41.339 |
| 44477.22675925926 | 40.875 |
| 44477.268425925926 | 40.489 |
| 44477.31009259259 | 40.026 |
| 44477.35175925926 | 40.026 |
| 44477.393425925926 | 40.489 |
| 44477.43509259259 | 41.725 |
| 44477.47675925926 | 43.346 |
| 44477.518425925926 | 44.505 |
| 44477.56009259259 | 45.74 |
| 44477.60175925926 | 46.821 |
| 44477.643425925926 | 47.207 |
| 44477.68509259259 | 47.207 |
| 44477.72675925926 | 47.13 |
| 44477.768425925926 | 46.899 |
| 44477.81009259259 | 46.281 |
| 44477.85175925926 | 45.509 |
| 44477.893425925926 | 44.968 |
| 44477.93509259259 | 44.505 |
| 44477.97675925926 | 44.196 |
| 44478.018425925926 | 43.733 |
| 44478.06009259259 | 43.655 |
| 44478.10175925926 | 43.424 |
| 44478.143425925926 | 43.192 |
| 44478.18509259259 | 43.038 |
| 44478.22675925926 | 42.96 |
| 44478.268425925926 | 42.96 |
| 44478.31009259259 | 42.729 |
| 44478.35175925926 | 42.574 |
| 44478.393425925926 | 42.883 |
| 44478.43509259259 | 43.578 |
| 44478.47675925926 | 44.196 |
| 44478.518425925926 | 44.119 |
| 44478.56009259259 | 44.35 |
| 44478.60175925926 | 46.204 |
| 44478.643425925926 | 46.667 |
| 44478.68509259259 | 46.435 |
| 44478.72675925926 | 46.59 |
| 44478.768425925926 | 46.126 |
| 44478.81009259259 | 45.277 |
| 44478.85175925926 | 44.582 |
| 44478.893425925926 | 43.964 |
| 44478.93509259259 | 43.192 |
| 44478.97675925926 | 42.497 |
| 44479.018425925926 | 41.648 |
| 44479.06009259259 | 41.107 |
| 44479.10175925926 | 40.644 |
| 44479.143425925926 | 40.335 |
| 44479.18509259259 | 40.18 |
| 44479.22675925926 | 40.026 |
| 44479.268425925926 | 39.949 |
| 44479.31009259259 | 40.026 |
| 44479.35175925926 | 40.103 |
| 44479.393425925926 | 40.412 |
| 44479.43509259259 | 41.184 |
| 44479.47675925926 | 42.265 |
| 44479.518425925926 | 43.192 |
| 44479.56009259259 | 44.273 |
| 44479.60175925926 | 45.123 |
| 44479.643425925926 | 45.509 |
| 44479.68509259259 | 45.586 |
| 44479.72675925926 | 45.431 |
| 44479.768425925926 | 45.045 |
| 44479.81009259259 | 44.505 |
| 44479.85175925926 | 43.964 |
| 44479.893425925926 | 43.346 |
| 44479.93509259259 | 42.574 |
| 44479.97675925926 | 41.802 |
| 44480.018425925926 | 41.184 |
| 44480.06009259259 | 40.489 |
| 44480.10175925926 | 39.949 |
| 44480.143425925926 | 39.331 |
| 44480.18509259259 | 39.022 |
| 44480.22675925926 | 38.559 |
| 44480.268425925926 | 38.327 |
| 44480.31009259259 | 38.018 |
| 44480.35175925926 | 37.941 |
| 44480.393425925926 | 38.25 |
| 44480.43509259259 | 39.64 |
| 44480.47675925926 | 41.184 |
| 44480.518425925926 | 43.733 |
| 44480.56009259259 | 46.126 |
| 44480.60175925926 | 48.057 |
| 44480.643425925926 | 48.984 |
| 44480.68509259259 | 48.984 |
| 44480.72675925926 | 48.211 |
| 44480.768425925926 | 47.594 |
| 44480.81009259259 | 46.821 |
| 44480.85175925926 | 45.895 |
| 44480.893425925926 | 44.814 |
| 44480.93509259259 | 43.578 |
| 44480.97675925926 | 42.574 |
| 44481.018425925926 | 41.57 |
| 44481.06009259259 | 40.953 |
| 44481.10175925926 | 40.335 |
| 44481.143425925926 | 40.026 |
| 44481.18509259259 | 39.872 |
| 44481.22675925926 | 39.717 |
| 44481.268425925926 | 39.563 |
| 44481.31009259259 | 39.408 |
| 44481.35175925926 | 39.485 |
| 44481.393425925926 | 39.872 |
| 44481.43509259259 | 40.644 |
| 44481.47675925926 | 41.261 |
| 44481.518425925926 | 41.648 |
| 44481.56009259259 | 42.729 |
| 44481.60175925926 | 42.265 |
| 44481.643425925926 | 42.497 |
| 44481.68509259259 | 42.651 |
| 44481.72675925926 | 42.497 |
| 44481.768425925926 | 41.879 |
| 44481.81009259259 | 41.648 |
| 44481.85175925926 | 41.184 |
| 44481.893425925926 | 40.18 |
| 44481.93509259259 | 39.64 |
| 44481.97675925926 | 39.331 |
| 44482.018425925926 | 39.099 |
| 44482.06009259259 | 39.022 |
| 44482.10175925926 | 38.713 |
| 44482.143425925926 | 38.559 |
| 44482.18509259259 | 38.327 |
| 44482.22675925926 | 38.095 |
| 44482.268425925926 | 37.941 |
| 44482.31009259259 | 37.709 |
| 44482.35175925926 | 37.632 |
| 44482.393425925926 | 38.25 |
| 44482.43509259259 | 38.79 |
| 44482.47675925926 | 39.794 |
| 44482.518425925926 | 40.953 |
| 44482.56009259259 | 42.265 |
| 44482.60175925926 | 43.346 |
| 44482.643425925926 | 43.81 |
| 44482.68509259259 | 43.81 |
| 44482.72675925926 | 43.192 |
| 44482.768425925926 | 42.574 |
| 44482.81009259259 | 42.343 |
| 44482.85175925926 | 41.879 |
| 44482.893425925926 | 41.107 |
| 44482.93509259259 | 40.18 |
| 44482.97675925926 | 39.64 |
| 44483.018425925926 | 39.022 |
| 44483.06009259259 | 38.482 |
| 44483.10175925926 | 38.095 |
| 44483.143425925926 | 37.864 |
| 44483.18509259259 | 37.632 |
| 44483.22675925926 | 37.709 |
| 44483.268425925926 | 37.555 |
| 44483.31009259259 | 37.4 |
| 44483.35175925926 | 37.555 |
| 44483.393425925926 | 37.709 |
| 44483.43509259259 | 38.868 |
| 44483.47675925926 | 39.64 |
| 44483.518425925926 | 39.717 |
| 44483.56009259259 | 39.64 |
| 44483.60175925926 | 40.258 |
| 44483.643425925926 | 40.567 |
| 44483.68509259259 | 40.644 |
| 44483.72675925926 | 40.567 |
| 44483.768425925926 | 40.103 |
| 44483.81009259259 | 39.563 |
| 44483.85175925926 | 39.254 |
| 44483.893425925926 | 38.79 |
| 44483.93509259259 | 37.864 |
| 44483.97675925926 | 37.478 |
| 44484.018425925926 | 37.169 |
| 44484.06009259259 | 36.937 |
| 44484.10175925926 | 36.86 |
| 44484.143425925926 | 36.628 |
| 44484.18509259259 | 36.319 |
| 44484.22675925926 | 36.165 |
| 44484.268425925926 | 36.01 |
| 44484.31009259259 | 35.779 |
| 44484.35175925926 | 35.856 |
| 44484.393425925926 | 36.01 |
| 44484.43509259259 | 36.783 |
| 44484.47675925926 | 38.482 |
| 44484.518425925926 | 40.335 |
| 44484.56009259259 | 42.111 |
| 44484.60175925926 | 43.578 |
| 44484.643425925926 | 44.505 |
| 44484.68509259259 | 44.35 |
| 44484.72675925926 | 43.578 |
| 44484.768425925926 | 42.651 |
| 44484.81009259259 | 41.648 |
| 44484.85175925926 | 40.567 |
| 44484.893425925926 | 39.717 |
| 44484.93509259259 | 38.79 |
| 44484.97675925926 | 37.941 |
| 44485.018425925926 | 37.323 |
| 44485.06009259259 | 36.783 |
| 44485.10175925926 | 36.397 |
| 44485.143425925926 | 36.165 |
| 44485.18509259259 | 35.856 |
| 44485.22675925926 | 35.779 |
| 44485.268425925926 | 35.702 |
| 44485.31009259259 | 35.547 |
| 44485.35175925926 | 35.547 |
| 44485.393425925926 | 36.165 |
| 44485.43509259259 | 37.478 |
| 44485.47675925926 | 39.177 |
| 44485.518425925926 | 41.493 |
| 44485.56009259259 | 43.81 |
| 44485.60175925926 | 45.818 |
| 44485.643425925926 | 46.744 |
| 44485.68509259259 | 47.207 |
| 44485.72675925926 | 46.435 |
| 44485.768425925926 | 45.431 |
| 44485.81009259259 | 44.35 |
| 44485.85175925926 | 43.192 |
| 44485.893425925926 | 41.956 |
| 44485.93509259259 | 40.798 |
| 44485.97675925926 | 39.872 |
| 44486.018425925926 | 39.099 |
| 44486.06009259259 | 38.636 |
| 44486.10175925926 | 38.25 |
| 44486.143425925926 | 37.941 |
| 44486.18509259259 | 37.709 |
| 44486.22675925926 | 37.478 |
| 44486.268425925926 | 37.246 |
| 44486.31009259259 | 37.169 |
| 44486.35175925926 | 37.014 |
| 44486.393425925926 | 37.555 |
| 44486.43509259259 | 38.79 |
| 44486.47675925926 | 40.644 |
| 44486.518425925926 | 42.883 |
| 44486.56009259259 | 45.123 |
| 44486.60175925926 | 46.744 |
| 44486.643425925926 | 47.825 |
| 44486.68509259259 | 48.134 |
| 44486.72675925926 | 47.516 |
| 44486.768425925926 | 46.513 |
| 44486.81009259259 | 45.431 |
| 44486.85175925926 | 44.273 |
| 44486.893425925926 | 43.038 |
| 44486.93509259259 | 41.802 |
| 44486.97675925926 | 40.875 |
| 44487.018425925926 | 40.026 |
| 44487.06009259259 | 39.485 |
| 44487.10175925926 | 39.177 |
| 44487.143425925926 | 38.79 |
| 44487.18509259259 | 38.559 |
| 44487.22675925926 | 38.404 |
| 44487.268425925926 | 38.327 |
| 44487.31009259259 | 38.173 |
| 44487.35175925926 | 38.095 |
| 44487.393425925926 | 38.559 |
| 44487.43509259259 | 40.026 |
| 44487.47675925926 | 41.725 |
| 44487.518425925926 | 43.501 |
| 44487.56009259259 | 45.818 |
| 44487.60175925926 | 47.98 |
| 44487.643425925926 | 48.597 |
| 44487.68509259259 | 48.52 |
| 44487.72675925926 | 47.902 |
| 44487.768425925926 | 46.976 |
| 44487.81009259259 | 46.049 |
| 44487.85175925926 | 44.736 |
| 44487.893425925926 | 43.655 |
| 44487.93509259259 | 42.497 |
| 44487.97675925926 | 41.493 |
| 44488.018425925926 | 40.721 |
| 44488.06009259259 | 40.18 |
| 44488.10175925926 | 39.64 |
| 44488.143425925926 | 39.331 |
| 44488.18509259259 | 39.099 |
| 44488.22675925926 | 38.868 |
| 44488.268425925926 | 38.868 |
| 44488.31009259259 | 38.559 |
| 44488.35175925926 | 38.636 |
| 44488.393425925926 | 39.099 |
| 44488.43509259259 | 40.335 |
| 44488.47675925926 | 41.725 |
| 44488.518425925926 | 43.192 |
| 44488.56009259259 | 45.045 |
| 44488.60175925926 | 46.821 |
| 44488.643425925926 | 45.818 |
| 44488.68509259259 | 44.814 |
| 44488.72675925926 | 44.736 |
| 44488.768425925926 | 44.196 |
| 44488.81009259259 | 43.501 |
| 44488.85175925926 | 42.883 |
| 44488.893425925926 | 41.956 |
| 44488.93509259259 | 41.107 |
| 44488.97675925926 | 40.18 |
| 44489.018425925926 | 39.408 |
| 44489.06009259259 | 38.79 |
| 44489.10175925926 | 38.404 |
| 44489.143425925926 | 38.173 |
| 44489.18509259259 | 37.864 |
| 44489.22675925926 | 37.555 |
| 44489.268425925926 | 37.246 |
| 44489.31009259259 | 36.937 |
| 44489.35175925926 | 36.705 |
| 44489.393425925926 | 36.937 |
| 44489.43509259259 | 38.25 |
| 44489.47675925926 | 39.872 |
| 44489.518425925926 | 41.879 |
| 44489.56009259259 | 43.964 |
| 44489.60175925926 | 45.663 |
| 44489.643425925926 | 46.744 |
| 44489.68509259259 | 46.976 |
| 44489.72675925926 | 46.204 |
| 44489.768425925926 | 45.354 |
| 44489.81009259259 | 44.119 |
| 44489.85175925926 | 42.883 |
| 44489.893425925926 | 41.57 |
| 44489.93509259259 | 40.335 |
| 44489.97675925926 | 39.408 |
| 44490.018425925926 | 38.713 |
| 44490.06009259259 | 38.095 |
| 44490.10175925926 | 37.787 |
| 44490.143425925926 | 37.4 |
| 44490.18509259259 | 37.246 |
| 44490.22675925926 | 37.014 |
| 44490.268425925926 | 36.937 |
| 44490.31009259259 | 36.783 |
| 44490.35175925926 | 36.783 |
| 44490.393425925926 | 37.323 |
| 44490.43509259259 | 38.327 |
| 44490.47675925926 | 39.872 |
| 44490.518425925926 | 41.725 |
| 44490.56009259259 | 43.578 |
| 44490.60175925926 | 45.431 |
| 44490.643425925926 | 46.821 |
| 44490.68509259259 | 46.821 |
| 44490.72675925926 | 46.126 |
| 44490.768425925926 | 45.123 |
| 44490.81009259259 | 43.964 |
| 44490.85175925926 | 43.038 |
| 44490.893425925926 | 41.956 |
| 44490.93509259259 | 40.875 |
| 44490.97675925926 | 39.949 |
| 44491.018425925926 | 39.254 |
| 44491.06009259259 | 38.713 |
| 44491.10175925926 | 38.327 |
| 44491.143425925926 | 38.018 |
| 44491.18509259259 | 37.787 |
| 44491.22675925926 | 37.632 |
| 44491.268425925926 | 37.4 |
| 44491.31009259259 | 37.092 |
| 44491.35175925926 | 37.092 |
| 44491.393425925926 | 37.632 |
| 44491.43509259259 | 38.713 |
| 44491.47675925926 | 40.489 |
| 44491.518425925926 | 42.651 |
| 44491.56009259259 | 44.814 |
| 44491.60175925926 | 46.281 |
| 44491.643425925926 | 47.285 |
| 44491.68509259259 | 47.516 |
| 44491.72675925926 | 47.13 |
| 44491.768425925926 | 46.281 |
| 44491.81009259259 | 45.277 |
| 44491.85175925926 | 44.505 |
| 44491.893425925926 | 43.501 |
| 44491.93509259259 | 42.343 |
| 44491.97675925926 | 41.339 |
| 44492.018425925926 | 40.335 |
| 44492.06009259259 | 39.563 |
| 44492.10175925926 | 39.177 |
| 44492.143425925926 | 38.559 |
| 44492.18509259259 | 38.25 |
| 44492.22675925926 | 38.095 |
| 44492.268425925926 | 37.864 |
| 44492.31009259259 | 37.632 |
| 44492.35175925926 | 37.555 |
| 44492.393425925926 | 37.941 |
| 44492.43509259259 | 38.945 |
| 44492.47675925926 | 39.949 |
| 44492.518425925926 | 41.648 |
| 44492.56009259259 | 43.269 |
| 44492.60175925926 | 44.736 |
| 44492.643425925926 | 45.509 |
| 44492.68509259259 | 45.2 |
| 44492.72675925926 | 45.2 |
| 44492.768425925926 | 44.582 |
| 44492.81009259259 | 44.041 |
| 44492.85175925926 | 43.424 |
| 44492.893425925926 | 42.497 |
| 44492.93509259259 | 41.956 |
| 44492.97675925926 | 41.184 |
| 44493.018425925926 | 40.875 |
| 44493.06009259259 | 40.644 |
| 44493.10175925926 | 40.567 |
| 44493.143425925926 | 40.412 |
| 44493.18509259259 | 40.412 |
| 44493.22675925926 | 40.026 |
| 44493.268425925926 | 39.485 |
| 44493.31009259259 | 39.022 |
| 44493.35175925926 | 39.022 |
| 44493.393425925926 | 39.177 |
| 44493.43509259259 | 40.103 |
| 44493.47675925926 | 41.57 |
| 44493.518425925926 | 43.578 |
| 44493.56009259259 | 45.045 |
| 44493.60175925926 | 46.59 |
| 44493.643425925926 | 47.207 |
| 44493.68509259259 | 46.976 |
| 44493.72675925926 | 46.513 |
| 44493.768425925926 | 45.663 |
| 44493.81009259259 | 44.736 |
| 44493.85175925926 | 43.733 |
| 44493.893425925926 | 42.729 |
| 44493.93509259259 | 41.802 |
| 44493.97675925926 | 41.03 |
| 44494.018425925926 | 40.335 |
| 44494.06009259259 | 39.949 |
| 44494.10175925926 | 39.563 |
| 44494.143425925926 | 39.331 |
| 44494.18509259259 | 39.331 |
| 44494.22675925926 | 39.177 |
| 44494.268425925926 | 39.099 |
| 44494.31009259259 | 38.945 |
| 44494.35175925926 | 39.022 |
| 44494.393425925926 | 39.408 |
| 44494.43509259259 | 40.567 |
| 44494.47675925926 | 42.265 |
| 44494.518425925926 | 44.35 |
| 44494.56009259259 | 46.435 |
| 44494.60175925926 | 48.134 |
| 44494.643425925926 | 49.138 |
| 44494.68509259259 | 49.292 |
| 44494.72675925926 | 48.597 |
| 44494.768425925926 | 47.671 |
| 44494.81009259259 | 46.59 |
| 44494.85175925926 | 45.431 |
| 44494.893425925926 | 44.35 |
| 44494.93509259259 | 43.192 |
| 44494.97675925926 | 42.343 |
| 44495.018425925926 | 41.493 |
| 44495.06009259259 | 40.875 |
| 44495.10175925926 | 40.412 |
| 44495.143425925926 | 40.026 |
| 44495.18509259259 | 39.64 |
| 44495.22675925926 | 39.485 |
| 44495.268425925926 | 39.177 |
| 44495.31009259259 | 39.331 |
| 44495.35175925926 | 39.563 |
| 44495.393425925926 | 39.949 |
| 44495.43509259259 | 40.953 |
| 44495.47675925926 | 40.798 |
| 44495.518425925926 | 41.03 |
| 44495.56009259259 | 41.261 |
| 44495.60175925926 | 42.111 |
| 44495.643425925926 | 42.651 |
| 44495.68509259259 | 42.188 |
| 44495.72675925926 | 41.57 |
| 44495.768425925926 | 40.875 |
| 44495.81009259259 | 40.258 |
| 44495.85175925926 | 39.331 |
| 44495.893425925926 | 38.79 |
| 44495.93509259259 | 38.404 |
| 44495.97675925926 | 38.018 |
| 44496.018425925926 | 37.709 |
| 44496.06009259259 | 37.555 |
| 44496.10175925926 | 37.323 |
| 44496.143425925926 | 37.092 |
| 44496.18509259259 | 36.937 |
| 44496.22675925926 | 36.783 |
| 44496.268425925926 | 36.783 |
| 44496.31009259259 | 36.705 |
| 44496.35175925926 | 36.551 |
| 44496.393425925926 | 36.705 |
| 44496.43509259259 | 37.246 |